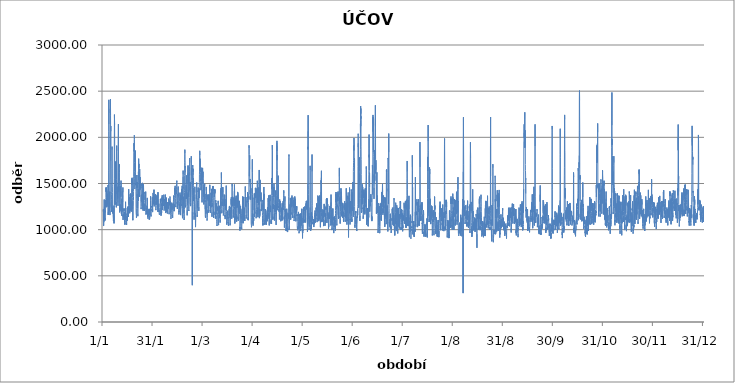
| Category | Series 0 |
|---|---|
| 2012-01-01 01:00:00 | 1198.5 |
| 2012-01-01 02:00:00 | 1199.75 |
| 2012-01-01 03:00:00 | 1194 |
| 2012-01-01 04:00:00 | 1204.25 |
| 2012-01-01 05:00:00 | 1206.75 |
| 2012-01-01 06:00:00 | 1213 |
| 2012-01-01 07:00:00 | 1224.5 |
| 2012-01-01 08:00:00 | 1087 |
| 2012-01-01 09:00:00 | 1039.5 |
| 2012-01-01 10:00:00 | 1044.75 |
| 2012-01-01 11:00:00 | 1045.75 |
| 2012-01-01 12:00:00 | 1058.25 |
| 2012-01-01 13:00:00 | 1062 |
| 2012-01-01 14:00:00 | 1069.5 |
| 2012-01-01 15:00:00 | 1065.25 |
| 2012-01-01 16:00:00 | 1120 |
| 2012-01-01 17:00:00 | 1090 |
| 2012-01-01 18:00:00 | 1147.25 |
| 2012-01-01 19:00:00 | 1326.75 |
| 2012-01-01 20:00:00 | 1124.25 |
| 2012-01-01 21:00:00 | 1173 |
| 2012-01-01 22:00:00 | 1247.25 |
| 2012-01-01 23:00:00 | 1140.25 |
| 2012-01-02 | 1233 |
| 2012-01-02 01:00:00 | 1231.25 |
| 2012-01-02 02:00:00 | 1214.25 |
| 2012-01-02 03:00:00 | 1180.25 |
| 2012-01-02 04:00:00 | 1172.5 |
| 2012-01-02 05:00:00 | 1110 |
| 2012-01-02 06:00:00 | 1124.5 |
| 2012-01-02 07:00:00 | 1099.75 |
| 2012-01-02 08:00:00 | 1207.5 |
| 2012-01-02 09:00:00 | 1188.25 |
| 2012-01-02 10:00:00 | 1191.75 |
| 2012-01-02 11:00:00 | 1196.75 |
| 2012-01-02 12:00:00 | 1208.25 |
| 2012-01-02 13:00:00 | 1250.5 |
| 2012-01-02 14:00:00 | 1319 |
| 2012-01-02 15:00:00 | 1302.25 |
| 2012-01-02 16:00:00 | 1295 |
| 2012-01-02 17:00:00 | 1272.5 |
| 2012-01-02 18:00:00 | 1245 |
| 2012-01-02 19:00:00 | 1259.75 |
| 2012-01-02 20:00:00 | 1348 |
| 2012-01-02 21:00:00 | 1451.5 |
| 2012-01-02 22:00:00 | 1411 |
| 2012-01-02 23:00:00 | 1458.25 |
| 2012-01-03 | 1453.25 |
| 2012-01-03 01:00:00 | 1443.5 |
| 2012-01-03 02:00:00 | 1346.25 |
| 2012-01-03 03:00:00 | 1310.5 |
| 2012-01-03 04:00:00 | 1243.25 |
| 2012-01-03 05:00:00 | 1242.75 |
| 2012-01-03 06:00:00 | 1343.5 |
| 2012-01-03 07:00:00 | 1369.25 |
| 2012-01-03 08:00:00 | 1422.5 |
| 2012-01-03 09:00:00 | 1379.75 |
| 2012-01-03 10:00:00 | 1343.75 |
| 2012-01-03 11:00:00 | 1304.75 |
| 2012-01-03 12:00:00 | 1283.25 |
| 2012-01-03 13:00:00 | 1249.5 |
| 2012-01-03 14:00:00 | 1330.25 |
| 2012-01-03 15:00:00 | 1275.5 |
| 2012-01-03 16:00:00 | 1339 |
| 2012-01-03 17:00:00 | 1318 |
| 2012-01-03 18:00:00 | 1387.5 |
| 2012-01-03 19:00:00 | 1333.75 |
| 2012-01-03 20:00:00 | 1354.75 |
| 2012-01-03 21:00:00 | 1352 |
| 2012-01-03 22:00:00 | 1367 |
| 2012-01-03 23:00:00 | 1386.5 |
| 2012-01-04 | 1449 |
| 2012-01-04 01:00:00 | 1481.5 |
| 2012-01-04 02:00:00 | 1466.5 |
| 2012-01-04 03:00:00 | 1323.5 |
| 2012-01-04 04:00:00 | 1335.5 |
| 2012-01-04 05:00:00 | 1159.5 |
| 2012-01-04 06:00:00 | 1193.25 |
| 2012-01-04 07:00:00 | 1187.25 |
| 2012-01-04 08:00:00 | 1240.5 |
| 2012-01-04 09:00:00 | 1231.5 |
| 2012-01-04 10:00:00 | 1256.5 |
| 2012-01-04 11:00:00 | 1636.25 |
| 2012-01-04 12:00:00 | 1871.75 |
| 2012-01-04 13:00:00 | 2063 |
| 2012-01-04 14:00:00 | 2406 |
| 2012-01-04 15:00:00 | 2143 |
| 2012-01-04 16:00:00 | 2057.75 |
| 2012-01-04 17:00:00 | 1987.25 |
| 2012-01-04 18:00:00 | 1623 |
| 2012-01-04 19:00:00 | 1487.5 |
| 2012-01-04 20:00:00 | 1272.25 |
| 2012-01-04 21:00:00 | 1258.5 |
| 2012-01-04 22:00:00 | 1198.75 |
| 2012-01-04 23:00:00 | 1258.75 |
| 2012-01-05 | 1297 |
| 2012-01-05 01:00:00 | 1287.5 |
| 2012-01-05 02:00:00 | 1251.5 |
| 2012-01-05 03:00:00 | 1301.25 |
| 2012-01-05 04:00:00 | 1411.75 |
| 2012-01-05 05:00:00 | 1235.75 |
| 2012-01-05 06:00:00 | 1158 |
| 2012-01-05 07:00:00 | 1203.5 |
| 2012-01-05 08:00:00 | 1345 |
| 2012-01-05 09:00:00 | 1393 |
| 2012-01-05 10:00:00 | 1824.75 |
| 2012-01-05 11:00:00 | 2266.75 |
| 2012-01-05 12:00:00 | 2307.75 |
| 2012-01-05 13:00:00 | 2264.25 |
| 2012-01-05 14:00:00 | 2415 |
| 2012-01-05 15:00:00 | 2238 |
| 2012-01-05 16:00:00 | 2135 |
| 2012-01-05 17:00:00 | 2066.25 |
| 2012-01-05 18:00:00 | 2122.25 |
| 2012-01-05 19:00:00 | 1745.75 |
| 2012-01-05 20:00:00 | 1654.75 |
| 2012-01-05 21:00:00 | 1546 |
| 2012-01-05 22:00:00 | 1496 |
| 2012-01-05 23:00:00 | 1410.25 |
| 2012-01-06 | 1405.25 |
| 2012-01-06 01:00:00 | 1382.25 |
| 2012-01-06 02:00:00 | 1324.5 |
| 2012-01-06 03:00:00 | 1194.5 |
| 2012-01-06 04:00:00 | 1188.25 |
| 2012-01-06 05:00:00 | 1197.25 |
| 2012-01-06 06:00:00 | 1214.75 |
| 2012-01-06 07:00:00 | 1220 |
| 2012-01-06 08:00:00 | 1323.75 |
| 2012-01-06 09:00:00 | 1381.75 |
| 2012-01-06 10:00:00 | 1409.75 |
| 2012-01-06 11:00:00 | 1481.75 |
| 2012-01-06 12:00:00 | 1660.25 |
| 2012-01-06 13:00:00 | 1899.25 |
| 2012-01-06 14:00:00 | 1866 |
| 2012-01-06 15:00:00 | 1752.75 |
| 2012-01-06 16:00:00 | 1489 |
| 2012-01-06 17:00:00 | 1464.25 |
| 2012-01-06 18:00:00 | 1402.25 |
| 2012-01-06 19:00:00 | 1231.5 |
| 2012-01-06 20:00:00 | 1246.75 |
| 2012-01-06 21:00:00 | 1177 |
| 2012-01-06 22:00:00 | 1193 |
| 2012-01-06 23:00:00 | 1204 |
| 2012-01-07 | 1236.5 |
| 2012-01-07 01:00:00 | 1230.25 |
| 2012-01-07 02:00:00 | 1230.75 |
| 2012-01-07 03:00:00 | 1228 |
| 2012-01-07 04:00:00 | 1196.75 |
| 2012-01-07 05:00:00 | 1143 |
| 2012-01-07 06:00:00 | 1134.5 |
| 2012-01-07 07:00:00 | 1128 |
| 2012-01-07 08:00:00 | 1116.25 |
| 2012-01-07 09:00:00 | 1094.5 |
| 2012-01-07 10:00:00 | 1091.75 |
| 2012-01-07 11:00:00 | 1108.5 |
| 2012-01-07 12:00:00 | 1134.25 |
| 2012-01-07 13:00:00 | 1128.75 |
| 2012-01-07 14:00:00 | 1144 |
| 2012-01-07 15:00:00 | 1140.5 |
| 2012-01-07 16:00:00 | 1190.5 |
| 2012-01-07 17:00:00 | 1260.25 |
| 2012-01-07 18:00:00 | 1068.75 |
| 2012-01-07 19:00:00 | 1155.75 |
| 2012-01-07 20:00:00 | 1239.75 |
| 2012-01-07 21:00:00 | 1554.5 |
| 2012-01-07 22:00:00 | 1929.5 |
| 2012-01-07 23:00:00 | 2106.25 |
| 2012-01-08 | 2246 |
| 2012-01-08 01:00:00 | 2243.25 |
| 2012-01-08 02:00:00 | 2134.5 |
| 2012-01-08 03:00:00 | 2047 |
| 2012-01-08 04:00:00 | 1393.75 |
| 2012-01-08 05:00:00 | 1273.5 |
| 2012-01-08 06:00:00 | 1399 |
| 2012-01-08 07:00:00 | 1483.5 |
| 2012-01-08 08:00:00 | 1378 |
| 2012-01-08 09:00:00 | 1294.75 |
| 2012-01-08 10:00:00 | 1271 |
| 2012-01-08 11:00:00 | 1281.75 |
| 2012-01-08 12:00:00 | 1289 |
| 2012-01-08 13:00:00 | 1295.75 |
| 2012-01-08 14:00:00 | 1313.75 |
| 2012-01-08 15:00:00 | 1422 |
| 2012-01-08 16:00:00 | 1592 |
| 2012-01-08 17:00:00 | 1703.75 |
| 2012-01-08 18:00:00 | 1738.25 |
| 2012-01-08 19:00:00 | 1642.5 |
| 2012-01-08 20:00:00 | 1502.75 |
| 2012-01-08 21:00:00 | 1470.5 |
| 2012-01-08 22:00:00 | 1315.5 |
| 2012-01-08 23:00:00 | 1292.5 |
| 2012-01-09 | 1293.5 |
| 2012-01-09 01:00:00 | 1299 |
| 2012-01-09 02:00:00 | 1272.25 |
| 2012-01-09 03:00:00 | 1241.5 |
| 2012-01-09 04:00:00 | 1304 |
| 2012-01-09 05:00:00 | 1314 |
| 2012-01-09 06:00:00 | 1541.75 |
| 2012-01-09 07:00:00 | 1756 |
| 2012-01-09 08:00:00 | 1889.75 |
| 2012-01-09 09:00:00 | 1910 |
| 2012-01-09 10:00:00 | 1853.25 |
| 2012-01-09 11:00:00 | 1819.75 |
| 2012-01-09 12:00:00 | 1736.75 |
| 2012-01-09 13:00:00 | 1505 |
| 2012-01-09 14:00:00 | 1439 |
| 2012-01-09 15:00:00 | 1385.5 |
| 2012-01-09 16:00:00 | 1424.5 |
| 2012-01-09 17:00:00 | 1465 |
| 2012-01-09 18:00:00 | 1471.25 |
| 2012-01-09 19:00:00 | 1391.75 |
| 2012-01-09 20:00:00 | 1394.25 |
| 2012-01-09 21:00:00 | 1353.75 |
| 2012-01-09 22:00:00 | 1357.75 |
| 2012-01-09 23:00:00 | 1338 |
| 2012-01-10 | 1330 |
| 2012-01-10 01:00:00 | 1334 |
| 2012-01-10 02:00:00 | 1415.75 |
| 2012-01-10 03:00:00 | 1293 |
| 2012-01-10 04:00:00 | 1258.5 |
| 2012-01-10 05:00:00 | 1508 |
| 2012-01-10 06:00:00 | 1718 |
| 2012-01-10 07:00:00 | 1953.25 |
| 2012-01-10 08:00:00 | 2010 |
| 2012-01-10 09:00:00 | 2049.5 |
| 2012-01-10 10:00:00 | 2142.5 |
| 2012-01-10 11:00:00 | 1904.25 |
| 2012-01-10 12:00:00 | 1588.5 |
| 2012-01-10 13:00:00 | 1604.5 |
| 2012-01-10 14:00:00 | 1616 |
| 2012-01-10 15:00:00 | 1412 |
| 2012-01-10 16:00:00 | 1562 |
| 2012-01-10 17:00:00 | 1641.25 |
| 2012-01-10 18:00:00 | 1626.5 |
| 2012-01-10 19:00:00 | 1638.75 |
| 2012-01-10 20:00:00 | 1711.5 |
| 2012-01-10 21:00:00 | 1682.5 |
| 2012-01-10 22:00:00 | 1699.5 |
| 2012-01-10 23:00:00 | 1699 |
| 2012-01-11 | 1669.75 |
| 2012-01-11 01:00:00 | 1526 |
| 2012-01-11 02:00:00 | 1475.25 |
| 2012-01-11 03:00:00 | 1221.5 |
| 2012-01-11 04:00:00 | 1187.25 |
| 2012-01-11 05:00:00 | 1185.25 |
| 2012-01-11 06:00:00 | 1194.75 |
| 2012-01-11 07:00:00 | 1201.5 |
| 2012-01-11 08:00:00 | 1265.5 |
| 2012-01-11 09:00:00 | 1242 |
| 2012-01-11 10:00:00 | 1275.75 |
| 2012-01-11 11:00:00 | 1233.25 |
| 2012-01-11 12:00:00 | 1205.25 |
| 2012-01-11 13:00:00 | 1199.5 |
| 2012-01-11 14:00:00 | 1270.5 |
| 2012-01-11 15:00:00 | 1420.5 |
| 2012-01-11 16:00:00 | 1400.25 |
| 2012-01-11 17:00:00 | 1411 |
| 2012-01-11 18:00:00 | 1413.25 |
| 2012-01-11 19:00:00 | 1406.25 |
| 2012-01-11 20:00:00 | 1471.75 |
| 2012-01-11 21:00:00 | 1372 |
| 2012-01-11 22:00:00 | 1357.5 |
| 2012-01-11 23:00:00 | 1414.5 |
| 2012-01-12 | 1531.25 |
| 2012-01-12 01:00:00 | 1460.25 |
| 2012-01-12 02:00:00 | 1400 |
| 2012-01-12 03:00:00 | 1363.5 |
| 2012-01-12 04:00:00 | 1349 |
| 2012-01-12 05:00:00 | 1172.75 |
| 2012-01-12 06:00:00 | 1229.25 |
| 2012-01-12 07:00:00 | 1193.75 |
| 2012-01-12 08:00:00 | 1244.75 |
| 2012-01-12 09:00:00 | 1176.75 |
| 2012-01-12 10:00:00 | 1174.25 |
| 2012-01-12 11:00:00 | 1167.5 |
| 2012-01-12 12:00:00 | 1149.75 |
| 2012-01-12 13:00:00 | 1267 |
| 2012-01-12 14:00:00 | 1313 |
| 2012-01-12 15:00:00 | 1294.25 |
| 2012-01-12 16:00:00 | 1331.5 |
| 2012-01-12 17:00:00 | 1262.25 |
| 2012-01-12 18:00:00 | 1197.75 |
| 2012-01-12 19:00:00 | 1273 |
| 2012-01-12 20:00:00 | 1413.5 |
| 2012-01-12 21:00:00 | 1377.25 |
| 2012-01-12 22:00:00 | 1311.5 |
| 2012-01-12 23:00:00 | 1298 |
| 2012-01-13 | 1373 |
| 2012-01-13 01:00:00 | 1416 |
| 2012-01-13 02:00:00 | 1429.75 |
| 2012-01-13 03:00:00 | 1457 |
| 2012-01-13 04:00:00 | 1404.25 |
| 2012-01-13 05:00:00 | 1225.25 |
| 2012-01-13 06:00:00 | 1105.5 |
| 2012-01-13 07:00:00 | 1162.5 |
| 2012-01-13 08:00:00 | 1141.25 |
| 2012-01-13 09:00:00 | 1132 |
| 2012-01-13 10:00:00 | 1140 |
| 2012-01-13 11:00:00 | 1134.75 |
| 2012-01-13 12:00:00 | 1165.75 |
| 2012-01-13 13:00:00 | 1150 |
| 2012-01-13 14:00:00 | 1146 |
| 2012-01-13 15:00:00 | 1160.5 |
| 2012-01-13 16:00:00 | 1160.75 |
| 2012-01-13 17:00:00 | 1165.5 |
| 2012-01-13 18:00:00 | 1226.5 |
| 2012-01-13 19:00:00 | 1204.25 |
| 2012-01-13 20:00:00 | 1229 |
| 2012-01-13 21:00:00 | 1209.5 |
| 2012-01-13 22:00:00 | 1200.75 |
| 2012-01-13 23:00:00 | 1123.75 |
| 2012-01-14 | 1170.25 |
| 2012-01-14 01:00:00 | 1189.75 |
| 2012-01-14 02:00:00 | 1107.5 |
| 2012-01-14 03:00:00 | 1079.5 |
| 2012-01-14 04:00:00 | 1098.75 |
| 2012-01-14 05:00:00 | 1062.25 |
| 2012-01-14 06:00:00 | 1073 |
| 2012-01-14 07:00:00 | 1078.25 |
| 2012-01-14 08:00:00 | 1070.5 |
| 2012-01-14 09:00:00 | 1054 |
| 2012-01-14 10:00:00 | 1072.25 |
| 2012-01-14 11:00:00 | 1072.75 |
| 2012-01-14 12:00:00 | 1110.25 |
| 2012-01-14 13:00:00 | 1111.25 |
| 2012-01-14 14:00:00 | 1126.25 |
| 2012-01-14 15:00:00 | 1104.25 |
| 2012-01-14 16:00:00 | 1101.75 |
| 2012-01-14 17:00:00 | 1124 |
| 2012-01-14 18:00:00 | 1302 |
| 2012-01-14 19:00:00 | 1124 |
| 2012-01-14 20:00:00 | 1235.25 |
| 2012-01-14 21:00:00 | 1174.75 |
| 2012-01-14 22:00:00 | 1159.75 |
| 2012-01-14 23:00:00 | 1174.5 |
| 2012-01-15 | 1114.25 |
| 2012-01-15 01:00:00 | 1098.5 |
| 2012-01-15 02:00:00 | 1093.5 |
| 2012-01-15 03:00:00 | 1084.5 |
| 2012-01-15 04:00:00 | 1085.5 |
| 2012-01-15 05:00:00 | 1097.5 |
| 2012-01-15 06:00:00 | 1088.75 |
| 2012-01-15 07:00:00 | 1088.75 |
| 2012-01-15 08:00:00 | 1073.5 |
| 2012-01-15 09:00:00 | 1050.75 |
| 2012-01-15 10:00:00 | 1067.75 |
| 2012-01-15 11:00:00 | 1071.5 |
| 2012-01-15 12:00:00 | 1110.5 |
| 2012-01-15 13:00:00 | 1105.5 |
| 2012-01-15 14:00:00 | 1116 |
| 2012-01-15 15:00:00 | 1095.25 |
| 2012-01-15 16:00:00 | 1137.75 |
| 2012-01-15 17:00:00 | 1147.25 |
| 2012-01-15 18:00:00 | 1153.5 |
| 2012-01-15 19:00:00 | 1103.5 |
| 2012-01-15 20:00:00 | 1153 |
| 2012-01-15 21:00:00 | 1170.75 |
| 2012-01-15 22:00:00 | 1155.75 |
| 2012-01-15 23:00:00 | 1188.5 |
| 2012-01-16 | 1248.75 |
| 2012-01-16 01:00:00 | 1203.75 |
| 2012-01-16 02:00:00 | 1166.75 |
| 2012-01-16 03:00:00 | 1169.25 |
| 2012-01-16 04:00:00 | 1144.75 |
| 2012-01-16 05:00:00 | 1143 |
| 2012-01-16 06:00:00 | 1161.5 |
| 2012-01-16 07:00:00 | 1183 |
| 2012-01-16 08:00:00 | 1230.5 |
| 2012-01-16 09:00:00 | 1211.5 |
| 2012-01-16 10:00:00 | 1214.75 |
| 2012-01-16 11:00:00 | 1234 |
| 2012-01-16 12:00:00 | 1225.5 |
| 2012-01-16 13:00:00 | 1137.5 |
| 2012-01-16 14:00:00 | 1261 |
| 2012-01-16 15:00:00 | 1281.75 |
| 2012-01-16 16:00:00 | 1438.5 |
| 2012-01-16 17:00:00 | 1309 |
| 2012-01-16 18:00:00 | 1275.5 |
| 2012-01-16 19:00:00 | 1348.25 |
| 2012-01-16 20:00:00 | 1325.75 |
| 2012-01-16 21:00:00 | 1352.75 |
| 2012-01-16 22:00:00 | 1360.25 |
| 2012-01-16 23:00:00 | 1354 |
| 2012-01-17 | 1350.25 |
| 2012-01-17 01:00:00 | 1326.75 |
| 2012-01-17 02:00:00 | 1283.25 |
| 2012-01-17 03:00:00 | 1264.75 |
| 2012-01-17 04:00:00 | 1196.25 |
| 2012-01-17 05:00:00 | 1230.25 |
| 2012-01-17 06:00:00 | 1178.25 |
| 2012-01-17 07:00:00 | 1217.5 |
| 2012-01-17 08:00:00 | 1280 |
| 2012-01-17 09:00:00 | 1269 |
| 2012-01-17 10:00:00 | 1272 |
| 2012-01-17 11:00:00 | 1275.25 |
| 2012-01-17 12:00:00 | 1307.5 |
| 2012-01-17 13:00:00 | 1360.25 |
| 2012-01-17 14:00:00 | 1384 |
| 2012-01-17 15:00:00 | 1319.5 |
| 2012-01-17 16:00:00 | 1212.25 |
| 2012-01-17 17:00:00 | 1244.5 |
| 2012-01-17 18:00:00 | 1243.5 |
| 2012-01-17 19:00:00 | 1304.5 |
| 2012-01-17 20:00:00 | 1257 |
| 2012-01-17 21:00:00 | 1259.75 |
| 2012-01-17 22:00:00 | 1392 |
| 2012-01-17 23:00:00 | 1348.5 |
| 2012-01-18 | 1372.25 |
| 2012-01-18 01:00:00 | 1254 |
| 2012-01-18 02:00:00 | 1322.25 |
| 2012-01-18 03:00:00 | 1200 |
| 2012-01-18 04:00:00 | 1259.5 |
| 2012-01-18 05:00:00 | 1268.5 |
| 2012-01-18 06:00:00 | 1197.25 |
| 2012-01-18 07:00:00 | 1229 |
| 2012-01-18 08:00:00 | 1278.5 |
| 2012-01-18 09:00:00 | 1274 |
| 2012-01-18 10:00:00 | 1304.75 |
| 2012-01-18 11:00:00 | 1334.25 |
| 2012-01-18 12:00:00 | 1335.5 |
| 2012-01-18 13:00:00 | 1435.5 |
| 2012-01-18 14:00:00 | 1553.75 |
| 2012-01-18 15:00:00 | 1554.5 |
| 2012-01-18 16:00:00 | 1490 |
| 2012-01-18 17:00:00 | 1548.75 |
| 2012-01-18 18:00:00 | 1562.25 |
| 2012-01-18 19:00:00 | 1401.5 |
| 2012-01-18 20:00:00 | 1439 |
| 2012-01-18 21:00:00 | 1350.75 |
| 2012-01-18 22:00:00 | 1299.25 |
| 2012-01-18 23:00:00 | 1259.25 |
| 2012-01-19 | 1227.75 |
| 2012-01-19 01:00:00 | 1223 |
| 2012-01-19 02:00:00 | 1286.75 |
| 2012-01-19 03:00:00 | 1308.5 |
| 2012-01-19 04:00:00 | 1102.5 |
| 2012-01-19 05:00:00 | 1119.75 |
| 2012-01-19 06:00:00 | 1137 |
| 2012-01-19 07:00:00 | 1200.5 |
| 2012-01-19 08:00:00 | 1248.5 |
| 2012-01-19 09:00:00 | 1243 |
| 2012-01-19 10:00:00 | 1311 |
| 2012-01-19 11:00:00 | 1329.25 |
| 2012-01-19 12:00:00 | 1343 |
| 2012-01-19 13:00:00 | 1325.75 |
| 2012-01-19 14:00:00 | 1358.5 |
| 2012-01-19 15:00:00 | 1414.75 |
| 2012-01-19 16:00:00 | 1572.25 |
| 2012-01-19 17:00:00 | 1711.5 |
| 2012-01-19 18:00:00 | 1840.25 |
| 2012-01-19 19:00:00 | 1906.75 |
| 2012-01-19 20:00:00 | 1936.5 |
| 2012-01-19 21:00:00 | 1901.25 |
| 2012-01-19 22:00:00 | 1849 |
| 2012-01-19 23:00:00 | 1857 |
| 2012-01-20 | 1861.75 |
| 2012-01-20 01:00:00 | 1977.5 |
| 2012-01-20 02:00:00 | 2022 |
| 2012-01-20 03:00:00 | 2009.5 |
| 2012-01-20 04:00:00 | 1976.75 |
| 2012-01-20 05:00:00 | 1725.25 |
| 2012-01-20 06:00:00 | 1631.75 |
| 2012-01-20 07:00:00 | 1551 |
| 2012-01-20 08:00:00 | 1457.75 |
| 2012-01-20 09:00:00 | 1442.5 |
| 2012-01-20 10:00:00 | 1456.25 |
| 2012-01-20 11:00:00 | 1464 |
| 2012-01-20 12:00:00 | 1452 |
| 2012-01-20 13:00:00 | 1461.25 |
| 2012-01-20 14:00:00 | 1678.25 |
| 2012-01-20 15:00:00 | 1848.5 |
| 2012-01-20 16:00:00 | 1824.5 |
| 2012-01-20 17:00:00 | 1837.75 |
| 2012-01-20 18:00:00 | 1856.5 |
| 2012-01-20 19:00:00 | 1766 |
| 2012-01-20 20:00:00 | 1615.75 |
| 2012-01-20 21:00:00 | 1505.5 |
| 2012-01-20 22:00:00 | 1483.25 |
| 2012-01-20 23:00:00 | 1486.25 |
| 2012-01-21 | 1506.25 |
| 2012-01-21 01:00:00 | 1476.25 |
| 2012-01-21 02:00:00 | 1410.75 |
| 2012-01-21 03:00:00 | 1243.75 |
| 2012-01-21 04:00:00 | 1183.25 |
| 2012-01-21 05:00:00 | 1170.25 |
| 2012-01-21 06:00:00 | 1173 |
| 2012-01-21 07:00:00 | 1165.25 |
| 2012-01-21 08:00:00 | 1151 |
| 2012-01-21 09:00:00 | 1130 |
| 2012-01-21 10:00:00 | 1152.75 |
| 2012-01-21 11:00:00 | 1169 |
| 2012-01-21 12:00:00 | 1228.5 |
| 2012-01-21 13:00:00 | 1310.25 |
| 2012-01-21 14:00:00 | 1360.75 |
| 2012-01-21 15:00:00 | 1570 |
| 2012-01-21 16:00:00 | 1592 |
| 2012-01-21 17:00:00 | 1453.5 |
| 2012-01-21 18:00:00 | 1516.25 |
| 2012-01-21 19:00:00 | 1424.75 |
| 2012-01-21 20:00:00 | 1344.25 |
| 2012-01-21 21:00:00 | 1384.25 |
| 2012-01-21 22:00:00 | 1370.5 |
| 2012-01-21 23:00:00 | 1315.5 |
| 2012-01-22 | 1284.75 |
| 2012-01-22 01:00:00 | 1260 |
| 2012-01-22 02:00:00 | 1304.25 |
| 2012-01-22 03:00:00 | 1232 |
| 2012-01-22 04:00:00 | 1174.25 |
| 2012-01-22 05:00:00 | 1145.75 |
| 2012-01-22 06:00:00 | 1175.75 |
| 2012-01-22 07:00:00 | 1201.5 |
| 2012-01-22 08:00:00 | 1322.75 |
| 2012-01-22 09:00:00 | 1360.5 |
| 2012-01-22 10:00:00 | 1436.5 |
| 2012-01-22 11:00:00 | 1312.25 |
| 2012-01-22 12:00:00 | 1340.75 |
| 2012-01-22 13:00:00 | 1378.25 |
| 2012-01-22 14:00:00 | 1628 |
| 2012-01-22 15:00:00 | 1541 |
| 2012-01-22 16:00:00 | 1580.5 |
| 2012-01-22 17:00:00 | 1769 |
| 2012-01-22 18:00:00 | 1758.25 |
| 2012-01-22 19:00:00 | 1670.75 |
| 2012-01-22 20:00:00 | 1712 |
| 2012-01-22 21:00:00 | 1714.5 |
| 2012-01-22 22:00:00 | 1657.75 |
| 2012-01-22 23:00:00 | 1665.25 |
| 2012-01-23 | 1609.75 |
| 2012-01-23 01:00:00 | 1602.75 |
| 2012-01-23 02:00:00 | 1570.25 |
| 2012-01-23 03:00:00 | 1479 |
| 2012-01-23 04:00:00 | 1356 |
| 2012-01-23 05:00:00 | 1410.5 |
| 2012-01-23 06:00:00 | 1499.25 |
| 2012-01-23 07:00:00 | 1517.5 |
| 2012-01-23 08:00:00 | 1656.75 |
| 2012-01-23 09:00:00 | 1560 |
| 2012-01-23 10:00:00 | 1459.25 |
| 2012-01-23 11:00:00 | 1428.5 |
| 2012-01-23 12:00:00 | 1420 |
| 2012-01-23 13:00:00 | 1452.25 |
| 2012-01-23 14:00:00 | 1533.75 |
| 2012-01-23 15:00:00 | 1569.75 |
| 2012-01-23 16:00:00 | 1562.5 |
| 2012-01-23 17:00:00 | 1578.75 |
| 2012-01-23 18:00:00 | 1513.5 |
| 2012-01-23 19:00:00 | 1554.25 |
| 2012-01-23 20:00:00 | 1505 |
| 2012-01-23 21:00:00 | 1495 |
| 2012-01-23 22:00:00 | 1448.75 |
| 2012-01-23 23:00:00 | 1468 |
| 2012-01-24 | 1446 |
| 2012-01-24 01:00:00 | 1385.25 |
| 2012-01-24 02:00:00 | 1304 |
| 2012-01-24 03:00:00 | 1286.75 |
| 2012-01-24 04:00:00 | 1248.5 |
| 2012-01-24 05:00:00 | 1222.5 |
| 2012-01-24 06:00:00 | 1238 |
| 2012-01-24 07:00:00 | 1251.25 |
| 2012-01-24 08:00:00 | 1278 |
| 2012-01-24 09:00:00 | 1379 |
| 2012-01-24 10:00:00 | 1304 |
| 2012-01-24 11:00:00 | 1334.75 |
| 2012-01-24 12:00:00 | 1332.5 |
| 2012-01-24 13:00:00 | 1362.25 |
| 2012-01-24 14:00:00 | 1430.25 |
| 2012-01-24 15:00:00 | 1490.75 |
| 2012-01-24 16:00:00 | 1473 |
| 2012-01-24 17:00:00 | 1476 |
| 2012-01-24 18:00:00 | 1496.25 |
| 2012-01-24 19:00:00 | 1486.25 |
| 2012-01-24 20:00:00 | 1490.75 |
| 2012-01-24 21:00:00 | 1483 |
| 2012-01-24 22:00:00 | 1451.75 |
| 2012-01-24 23:00:00 | 1461.25 |
| 2012-01-25 | 1506.75 |
| 2012-01-25 01:00:00 | 1490.5 |
| 2012-01-25 02:00:00 | 1435.75 |
| 2012-01-25 03:00:00 | 1349.5 |
| 2012-01-25 04:00:00 | 1292 |
| 2012-01-25 05:00:00 | 1221.75 |
| 2012-01-25 06:00:00 | 1289.5 |
| 2012-01-25 07:00:00 | 1386.75 |
| 2012-01-25 08:00:00 | 1294.25 |
| 2012-01-25 09:00:00 | 1261.5 |
| 2012-01-25 10:00:00 | 1440.25 |
| 2012-01-25 11:00:00 | 1206 |
| 2012-01-25 12:00:00 | 1340 |
| 2012-01-25 13:00:00 | 1419.5 |
| 2012-01-25 14:00:00 | 1492.75 |
| 2012-01-25 15:00:00 | 1463.25 |
| 2012-01-25 16:00:00 | 1476.5 |
| 2012-01-25 17:00:00 | 1430.75 |
| 2012-01-25 18:00:00 | 1426.75 |
| 2012-01-25 19:00:00 | 1368.75 |
| 2012-01-25 20:00:00 | 1376.75 |
| 2012-01-25 21:00:00 | 1371.25 |
| 2012-01-25 22:00:00 | 1323.5 |
| 2012-01-25 23:00:00 | 1372 |
| 2012-01-26 | 1392 |
| 2012-01-26 01:00:00 | 1408.5 |
| 2012-01-26 02:00:00 | 1386.75 |
| 2012-01-26 03:00:00 | 1318.75 |
| 2012-01-26 04:00:00 | 1293 |
| 2012-01-26 05:00:00 | 1228.75 |
| 2012-01-26 06:00:00 | 1202 |
| 2012-01-26 07:00:00 | 1210.5 |
| 2012-01-26 08:00:00 | 1235 |
| 2012-01-26 09:00:00 | 1239.75 |
| 2012-01-26 10:00:00 | 1253.75 |
| 2012-01-26 11:00:00 | 1264 |
| 2012-01-26 12:00:00 | 1262 |
| 2012-01-26 13:00:00 | 1276.25 |
| 2012-01-26 14:00:00 | 1252.5 |
| 2012-01-26 15:00:00 | 1217.75 |
| 2012-01-26 16:00:00 | 1212.5 |
| 2012-01-26 17:00:00 | 1240 |
| 2012-01-26 18:00:00 | 1244.5 |
| 2012-01-26 19:00:00 | 1237 |
| 2012-01-26 20:00:00 | 1241.5 |
| 2012-01-26 21:00:00 | 1332.25 |
| 2012-01-26 22:00:00 | 1359.5 |
| 2012-01-26 23:00:00 | 1356.25 |
| 2012-01-27 | 1412 |
| 2012-01-27 01:00:00 | 1311.75 |
| 2012-01-27 02:00:00 | 1319 |
| 2012-01-27 03:00:00 | 1269.5 |
| 2012-01-27 04:00:00 | 1163 |
| 2012-01-27 05:00:00 | 1166.75 |
| 2012-01-27 06:00:00 | 1186.75 |
| 2012-01-27 07:00:00 | 1195.25 |
| 2012-01-27 08:00:00 | 1229 |
| 2012-01-27 09:00:00 | 1192.25 |
| 2012-01-27 10:00:00 | 1188 |
| 2012-01-27 11:00:00 | 1202.75 |
| 2012-01-27 12:00:00 | 1233.25 |
| 2012-01-27 13:00:00 | 1224.25 |
| 2012-01-27 14:00:00 | 1231.75 |
| 2012-01-27 15:00:00 | 1185.75 |
| 2012-01-27 16:00:00 | 1169 |
| 2012-01-27 17:00:00 | 1188.5 |
| 2012-01-27 18:00:00 | 1194.25 |
| 2012-01-27 19:00:00 | 1260 |
| 2012-01-27 20:00:00 | 1180.75 |
| 2012-01-27 21:00:00 | 1175 |
| 2012-01-27 22:00:00 | 1222.75 |
| 2012-01-27 23:00:00 | 1344 |
| 2012-01-28 | 1265.5 |
| 2012-01-28 01:00:00 | 1262.5 |
| 2012-01-28 02:00:00 | 1209 |
| 2012-01-28 03:00:00 | 1136.5 |
| 2012-01-28 04:00:00 | 1134.75 |
| 2012-01-28 05:00:00 | 1136 |
| 2012-01-28 06:00:00 | 1149.5 |
| 2012-01-28 07:00:00 | 1132.5 |
| 2012-01-28 08:00:00 | 1134.75 |
| 2012-01-28 09:00:00 | 1119 |
| 2012-01-28 10:00:00 | 1120.5 |
| 2012-01-28 11:00:00 | 1131.25 |
| 2012-01-28 12:00:00 | 1146.5 |
| 2012-01-28 13:00:00 | 1155.25 |
| 2012-01-28 14:00:00 | 1162.75 |
| 2012-01-28 15:00:00 | 1151.25 |
| 2012-01-28 16:00:00 | 1150.25 |
| 2012-01-28 17:00:00 | 1150.75 |
| 2012-01-28 18:00:00 | 1178.25 |
| 2012-01-28 19:00:00 | 1166.25 |
| 2012-01-28 20:00:00 | 1170.75 |
| 2012-01-28 21:00:00 | 1165.25 |
| 2012-01-28 22:00:00 | 1172.5 |
| 2012-01-28 23:00:00 | 1161.75 |
| 2012-01-29 | 1219.75 |
| 2012-01-29 01:00:00 | 1173 |
| 2012-01-29 02:00:00 | 1225.5 |
| 2012-01-29 03:00:00 | 1162.75 |
| 2012-01-29 04:00:00 | 1108 |
| 2012-01-29 05:00:00 | 1128.25 |
| 2012-01-29 06:00:00 | 1142.5 |
| 2012-01-29 07:00:00 | 1129.25 |
| 2012-01-29 08:00:00 | 1122.75 |
| 2012-01-29 09:00:00 | 1113.75 |
| 2012-01-29 10:00:00 | 1121.25 |
| 2012-01-29 11:00:00 | 1121 |
| 2012-01-29 12:00:00 | 1151 |
| 2012-01-29 13:00:00 | 1161 |
| 2012-01-29 14:00:00 | 1169 |
| 2012-01-29 15:00:00 | 1157 |
| 2012-01-29 16:00:00 | 1153 |
| 2012-01-29 17:00:00 | 1154 |
| 2012-01-29 18:00:00 | 1189.5 |
| 2012-01-29 19:00:00 | 1181.25 |
| 2012-01-29 20:00:00 | 1186.5 |
| 2012-01-29 21:00:00 | 1182.5 |
| 2012-01-29 22:00:00 | 1201.25 |
| 2012-01-29 23:00:00 | 1316.25 |
| 2012-01-30 | 1361 |
| 2012-01-30 01:00:00 | 1320.25 |
| 2012-01-30 02:00:00 | 1229.75 |
| 2012-01-30 03:00:00 | 1179.25 |
| 2012-01-30 04:00:00 | 1177 |
| 2012-01-30 05:00:00 | 1186 |
| 2012-01-30 06:00:00 | 1143.5 |
| 2012-01-30 07:00:00 | 1163.5 |
| 2012-01-30 08:00:00 | 1210 |
| 2012-01-30 09:00:00 | 1203.25 |
| 2012-01-30 10:00:00 | 1222.5 |
| 2012-01-30 11:00:00 | 1228.75 |
| 2012-01-30 12:00:00 | 1219.25 |
| 2012-01-30 13:00:00 | 1207.5 |
| 2012-01-30 14:00:00 | 1218.75 |
| 2012-01-30 15:00:00 | 1216.25 |
| 2012-01-30 16:00:00 | 1225.5 |
| 2012-01-30 17:00:00 | 1231.5 |
| 2012-01-30 18:00:00 | 1254.25 |
| 2012-01-30 19:00:00 | 1243.25 |
| 2012-01-30 20:00:00 | 1253.75 |
| 2012-01-30 21:00:00 | 1240 |
| 2012-01-30 22:00:00 | 1256.25 |
| 2012-01-30 23:00:00 | 1243.25 |
| 2012-01-31 | 1317 |
| 2012-01-31 01:00:00 | 1349 |
| 2012-01-31 02:00:00 | 1331.5 |
| 2012-01-31 03:00:00 | 1260.75 |
| 2012-01-31 04:00:00 | 1243.25 |
| 2012-01-31 05:00:00 | 1190 |
| 2012-01-31 06:00:00 | 1219.5 |
| 2012-01-31 07:00:00 | 1252.5 |
| 2012-01-31 08:00:00 | 1290.5 |
| 2012-01-31 09:00:00 | 1271.5 |
| 2012-01-31 10:00:00 | 1304.5 |
| 2012-01-31 11:00:00 | 1353.75 |
| 2012-01-31 12:00:00 | 1327.75 |
| 2012-01-31 13:00:00 | 1397.75 |
| 2012-01-31 14:00:00 | 1334.5 |
| 2012-01-31 15:00:00 | 1308.5 |
| 2012-01-31 16:00:00 | 1280 |
| 2012-01-31 17:00:00 | 1281.25 |
| 2012-01-31 18:00:00 | 1314.25 |
| 2012-01-31 19:00:00 | 1311.75 |
| 2012-01-31 20:00:00 | 1306.5 |
| 2012-01-31 21:00:00 | 1371.75 |
| 2012-01-31 22:00:00 | 1325.5 |
| 2012-01-31 23:00:00 | 1312 |
| 2012-02-01 | 1304.75 |
| 2012-02-01 01:00:00 | 1432.75 |
| 2012-02-01 02:00:00 | 1294.75 |
| 2012-02-01 03:00:00 | 1252.25 |
| 2012-02-01 04:00:00 | 1249.75 |
| 2012-02-01 05:00:00 | 1244.25 |
| 2012-02-01 06:00:00 | 1273.25 |
| 2012-02-01 07:00:00 | 1299.25 |
| 2012-02-01 08:00:00 | 1322.25 |
| 2012-02-01 09:00:00 | 1332 |
| 2012-02-01 10:00:00 | 1357 |
| 2012-02-01 11:00:00 | 1339.25 |
| 2012-02-01 12:00:00 | 1340.25 |
| 2012-02-01 13:00:00 | 1309 |
| 2012-02-01 14:00:00 | 1311 |
| 2012-02-01 15:00:00 | 1268.25 |
| 2012-02-01 16:00:00 | 1266 |
| 2012-02-01 17:00:00 | 1335.5 |
| 2012-02-01 18:00:00 | 1331.75 |
| 2012-02-01 19:00:00 | 1378.75 |
| 2012-02-01 20:00:00 | 1381.25 |
| 2012-02-01 21:00:00 | 1381 |
| 2012-02-01 22:00:00 | 1365.25 |
| 2012-02-01 23:00:00 | 1327 |
| 2012-02-02 | 1385 |
| 2012-02-02 01:00:00 | 1353 |
| 2012-02-02 02:00:00 | 1317.5 |
| 2012-02-02 03:00:00 | 1264 |
| 2012-02-02 04:00:00 | 1211.5 |
| 2012-02-02 05:00:00 | 1227 |
| 2012-02-02 06:00:00 | 1247.75 |
| 2012-02-02 07:00:00 | 1269 |
| 2012-02-02 08:00:00 | 1304.75 |
| 2012-02-02 09:00:00 | 1308.5 |
| 2012-02-02 10:00:00 | 1277.5 |
| 2012-02-02 11:00:00 | 1292.75 |
| 2012-02-02 12:00:00 | 1282 |
| 2012-02-02 13:00:00 | 1272.75 |
| 2012-02-02 14:00:00 | 1286.25 |
| 2012-02-02 15:00:00 | 1314 |
| 2012-02-02 16:00:00 | 1324.5 |
| 2012-02-02 17:00:00 | 1293.25 |
| 2012-02-02 18:00:00 | 1329 |
| 2012-02-02 19:00:00 | 1322.25 |
| 2012-02-02 20:00:00 | 1373.25 |
| 2012-02-02 21:00:00 | 1329.25 |
| 2012-02-02 22:00:00 | 1358.75 |
| 2012-02-02 23:00:00 | 1293 |
| 2012-02-03 | 1348.25 |
| 2012-02-03 01:00:00 | 1291 |
| 2012-02-03 02:00:00 | 1243.75 |
| 2012-02-03 03:00:00 | 1254.75 |
| 2012-02-03 04:00:00 | 1229.25 |
| 2012-02-03 05:00:00 | 1250 |
| 2012-02-03 06:00:00 | 1254.5 |
| 2012-02-03 07:00:00 | 1289.75 |
| 2012-02-03 08:00:00 | 1329.5 |
| 2012-02-03 09:00:00 | 1301 |
| 2012-02-03 10:00:00 | 1194 |
| 2012-02-03 11:00:00 | 1405.5 |
| 2012-02-03 12:00:00 | 1336.5 |
| 2012-02-03 13:00:00 | 1286.25 |
| 2012-02-03 14:00:00 | 1265.75 |
| 2012-02-03 15:00:00 | 1229.25 |
| 2012-02-03 16:00:00 | 1194.25 |
| 2012-02-03 17:00:00 | 1200.5 |
| 2012-02-03 18:00:00 | 1228.5 |
| 2012-02-03 19:00:00 | 1223.25 |
| 2012-02-03 20:00:00 | 1219.75 |
| 2012-02-03 21:00:00 | 1223.75 |
| 2012-02-03 22:00:00 | 1234 |
| 2012-02-03 23:00:00 | 1281.5 |
| 2012-02-04 | 1246.25 |
| 2012-02-04 01:00:00 | 1242.5 |
| 2012-02-04 02:00:00 | 1184.75 |
| 2012-02-04 03:00:00 | 1178 |
| 2012-02-04 04:00:00 | 1174 |
| 2012-02-04 05:00:00 | 1177.25 |
| 2012-02-04 06:00:00 | 1182.5 |
| 2012-02-04 07:00:00 | 1181.75 |
| 2012-02-04 08:00:00 | 1161.75 |
| 2012-02-04 09:00:00 | 1155 |
| 2012-02-04 10:00:00 | 1170 |
| 2012-02-04 11:00:00 | 1175.5 |
| 2012-02-04 12:00:00 | 1190 |
| 2012-02-04 13:00:00 | 1196.25 |
| 2012-02-04 14:00:00 | 1210 |
| 2012-02-04 15:00:00 | 1193.75 |
| 2012-02-04 16:00:00 | 1183.5 |
| 2012-02-04 17:00:00 | 1183 |
| 2012-02-04 18:00:00 | 1236.5 |
| 2012-02-04 19:00:00 | 1315.75 |
| 2012-02-04 20:00:00 | 1316.5 |
| 2012-02-04 21:00:00 | 1318.25 |
| 2012-02-04 22:00:00 | 1332.75 |
| 2012-02-04 23:00:00 | 1323.75 |
| 2012-02-05 | 1318.5 |
| 2012-02-05 01:00:00 | 1297.75 |
| 2012-02-05 02:00:00 | 1333.75 |
| 2012-02-05 03:00:00 | 1282.75 |
| 2012-02-05 04:00:00 | 1214 |
| 2012-02-05 05:00:00 | 1173.75 |
| 2012-02-05 06:00:00 | 1186.5 |
| 2012-02-05 07:00:00 | 1185.5 |
| 2012-02-05 08:00:00 | 1152 |
| 2012-02-05 09:00:00 | 1147 |
| 2012-02-05 10:00:00 | 1161.5 |
| 2012-02-05 11:00:00 | 1156.5 |
| 2012-02-05 12:00:00 | 1191.5 |
| 2012-02-05 13:00:00 | 1204.5 |
| 2012-02-05 14:00:00 | 1203.75 |
| 2012-02-05 15:00:00 | 1198 |
| 2012-02-05 16:00:00 | 1181.25 |
| 2012-02-05 17:00:00 | 1181.5 |
| 2012-02-05 18:00:00 | 1251.75 |
| 2012-02-05 19:00:00 | 1284 |
| 2012-02-05 20:00:00 | 1281.75 |
| 2012-02-05 21:00:00 | 1250.75 |
| 2012-02-05 22:00:00 | 1346 |
| 2012-02-05 23:00:00 | 1315.75 |
| 2012-02-06 | 1361 |
| 2012-02-06 01:00:00 | 1373.5 |
| 2012-02-06 02:00:00 | 1313.5 |
| 2012-02-06 03:00:00 | 1301 |
| 2012-02-06 04:00:00 | 1330.5 |
| 2012-02-06 05:00:00 | 1214.75 |
| 2012-02-06 06:00:00 | 1246.25 |
| 2012-02-06 07:00:00 | 1277.25 |
| 2012-02-06 08:00:00 | 1309.25 |
| 2012-02-06 09:00:00 | 1319.5 |
| 2012-02-06 10:00:00 | 1333.25 |
| 2012-02-06 11:00:00 | 1321.5 |
| 2012-02-06 12:00:00 | 1327.5 |
| 2012-02-06 13:00:00 | 1312.5 |
| 2012-02-06 14:00:00 | 1311 |
| 2012-02-06 15:00:00 | 1281.75 |
| 2012-02-06 16:00:00 | 1256.25 |
| 2012-02-06 17:00:00 | 1285.75 |
| 2012-02-06 18:00:00 | 1296.5 |
| 2012-02-06 19:00:00 | 1321.25 |
| 2012-02-06 20:00:00 | 1300.75 |
| 2012-02-06 21:00:00 | 1292 |
| 2012-02-06 22:00:00 | 1353.25 |
| 2012-02-06 23:00:00 | 1367.25 |
| 2012-02-07 | 1378.5 |
| 2012-02-07 01:00:00 | 1381.25 |
| 2012-02-07 02:00:00 | 1357.5 |
| 2012-02-07 03:00:00 | 1339 |
| 2012-02-07 04:00:00 | 1281 |
| 2012-02-07 05:00:00 | 1207.25 |
| 2012-02-07 06:00:00 | 1220.5 |
| 2012-02-07 07:00:00 | 1258.5 |
| 2012-02-07 08:00:00 | 1306.5 |
| 2012-02-07 09:00:00 | 1332.5 |
| 2012-02-07 10:00:00 | 1306.75 |
| 2012-02-07 11:00:00 | 1297.5 |
| 2012-02-07 12:00:00 | 1295 |
| 2012-02-07 13:00:00 | 1279 |
| 2012-02-07 14:00:00 | 1278 |
| 2012-02-07 15:00:00 | 1228.5 |
| 2012-02-07 16:00:00 | 1239.25 |
| 2012-02-07 17:00:00 | 1276 |
| 2012-02-07 18:00:00 | 1278 |
| 2012-02-07 19:00:00 | 1329.25 |
| 2012-02-07 20:00:00 | 1335.5 |
| 2012-02-07 21:00:00 | 1337.5 |
| 2012-02-07 22:00:00 | 1359 |
| 2012-02-07 23:00:00 | 1380 |
| 2012-02-08 | 1376.75 |
| 2012-02-08 01:00:00 | 1371.75 |
| 2012-02-08 02:00:00 | 1375.25 |
| 2012-02-08 03:00:00 | 1278.25 |
| 2012-02-08 04:00:00 | 1256 |
| 2012-02-08 05:00:00 | 1180 |
| 2012-02-08 06:00:00 | 1187.25 |
| 2012-02-08 07:00:00 | 1222.75 |
| 2012-02-08 08:00:00 | 1254 |
| 2012-02-08 09:00:00 | 1237.25 |
| 2012-02-08 10:00:00 | 1205.25 |
| 2012-02-08 11:00:00 | 1215.75 |
| 2012-02-08 12:00:00 | 1346.75 |
| 2012-02-08 13:00:00 | 1224.5 |
| 2012-02-08 14:00:00 | 1193.25 |
| 2012-02-08 15:00:00 | 1208 |
| 2012-02-08 16:00:00 | 1232.75 |
| 2012-02-08 17:00:00 | 1227.5 |
| 2012-02-08 18:00:00 | 1247.75 |
| 2012-02-08 19:00:00 | 1270.75 |
| 2012-02-08 20:00:00 | 1268.5 |
| 2012-02-08 21:00:00 | 1284 |
| 2012-02-08 22:00:00 | 1293.75 |
| 2012-02-08 23:00:00 | 1281.5 |
| 2012-02-09 | 1280.75 |
| 2012-02-09 01:00:00 | 1284.5 |
| 2012-02-09 02:00:00 | 1283.5 |
| 2012-02-09 03:00:00 | 1188.5 |
| 2012-02-09 04:00:00 | 1174.75 |
| 2012-02-09 05:00:00 | 1189.5 |
| 2012-02-09 06:00:00 | 1188.5 |
| 2012-02-09 07:00:00 | 1213.5 |
| 2012-02-09 08:00:00 | 1254.5 |
| 2012-02-09 09:00:00 | 1287 |
| 2012-02-09 10:00:00 | 1299 |
| 2012-02-09 11:00:00 | 1282.25 |
| 2012-02-09 12:00:00 | 1292.75 |
| 2012-02-09 13:00:00 | 1251.25 |
| 2012-02-09 14:00:00 | 1257.75 |
| 2012-02-09 15:00:00 | 1234.25 |
| 2012-02-09 16:00:00 | 1246 |
| 2012-02-09 17:00:00 | 1227.75 |
| 2012-02-09 18:00:00 | 1287.25 |
| 2012-02-09 19:00:00 | 1283 |
| 2012-02-09 20:00:00 | 1287 |
| 2012-02-09 21:00:00 | 1291.5 |
| 2012-02-09 22:00:00 | 1301.5 |
| 2012-02-09 23:00:00 | 1336.25 |
| 2012-02-10 | 1332.25 |
| 2012-02-10 01:00:00 | 1323.25 |
| 2012-02-10 02:00:00 | 1307.75 |
| 2012-02-10 03:00:00 | 1245.25 |
| 2012-02-10 04:00:00 | 1204 |
| 2012-02-10 05:00:00 | 1167.5 |
| 2012-02-10 06:00:00 | 1186.25 |
| 2012-02-10 07:00:00 | 1212 |
| 2012-02-10 08:00:00 | 1271.25 |
| 2012-02-10 09:00:00 | 1268 |
| 2012-02-10 10:00:00 | 1279.25 |
| 2012-02-10 11:00:00 | 1284 |
| 2012-02-10 12:00:00 | 1300.75 |
| 2012-02-10 13:00:00 | 1272.5 |
| 2012-02-10 14:00:00 | 1292.5 |
| 2012-02-10 15:00:00 | 1279.5 |
| 2012-02-10 16:00:00 | 1269.5 |
| 2012-02-10 17:00:00 | 1325.75 |
| 2012-02-10 18:00:00 | 1358.5 |
| 2012-02-10 19:00:00 | 1357 |
| 2012-02-10 20:00:00 | 1347.25 |
| 2012-02-10 21:00:00 | 1319.5 |
| 2012-02-10 22:00:00 | 1258.5 |
| 2012-02-10 23:00:00 | 1308.75 |
| 2012-02-11 | 1298 |
| 2012-02-11 01:00:00 | 1279.75 |
| 2012-02-11 02:00:00 | 1247.5 |
| 2012-02-11 03:00:00 | 1270.25 |
| 2012-02-11 04:00:00 | 1174.25 |
| 2012-02-11 05:00:00 | 1151.25 |
| 2012-02-11 06:00:00 | 1157.25 |
| 2012-02-11 07:00:00 | 1134.25 |
| 2012-02-11 08:00:00 | 1118 |
| 2012-02-11 09:00:00 | 1116 |
| 2012-02-11 10:00:00 | 1133.25 |
| 2012-02-11 11:00:00 | 1143 |
| 2012-02-11 12:00:00 | 1159.75 |
| 2012-02-11 13:00:00 | 1169 |
| 2012-02-11 14:00:00 | 1187 |
| 2012-02-11 15:00:00 | 1186.75 |
| 2012-02-11 16:00:00 | 1272.75 |
| 2012-02-11 17:00:00 | 1245.5 |
| 2012-02-11 18:00:00 | 1291.25 |
| 2012-02-11 19:00:00 | 1253.5 |
| 2012-02-11 20:00:00 | 1282.75 |
| 2012-02-11 21:00:00 | 1248.5 |
| 2012-02-11 22:00:00 | 1247.75 |
| 2012-02-11 23:00:00 | 1244.25 |
| 2012-02-12 | 1218.75 |
| 2012-02-12 01:00:00 | 1260.25 |
| 2012-02-12 02:00:00 | 1213.75 |
| 2012-02-12 03:00:00 | 1178 |
| 2012-02-12 04:00:00 | 1144.25 |
| 2012-02-12 05:00:00 | 1143 |
| 2012-02-12 06:00:00 | 1158.5 |
| 2012-02-12 07:00:00 | 1145 |
| 2012-02-12 08:00:00 | 1127 |
| 2012-02-12 09:00:00 | 1121 |
| 2012-02-12 10:00:00 | 1120.25 |
| 2012-02-12 11:00:00 | 1139 |
| 2012-02-12 12:00:00 | 1169 |
| 2012-02-12 13:00:00 | 1179.25 |
| 2012-02-12 14:00:00 | 1182.75 |
| 2012-02-12 15:00:00 | 1176.75 |
| 2012-02-12 16:00:00 | 1279.25 |
| 2012-02-12 17:00:00 | 1263.75 |
| 2012-02-12 18:00:00 | 1293 |
| 2012-02-12 19:00:00 | 1292.25 |
| 2012-02-12 20:00:00 | 1305.75 |
| 2012-02-12 21:00:00 | 1316.5 |
| 2012-02-12 22:00:00 | 1330.5 |
| 2012-02-12 23:00:00 | 1338.5 |
| 2012-02-13 | 1369.5 |
| 2012-02-13 01:00:00 | 1350.25 |
| 2012-02-13 02:00:00 | 1330 |
| 2012-02-13 03:00:00 | 1307 |
| 2012-02-13 04:00:00 | 1308.25 |
| 2012-02-13 05:00:00 | 1228.75 |
| 2012-02-13 06:00:00 | 1272.75 |
| 2012-02-13 07:00:00 | 1200.5 |
| 2012-02-13 08:00:00 | 1232.75 |
| 2012-02-13 09:00:00 | 1311 |
| 2012-02-13 10:00:00 | 1344.75 |
| 2012-02-13 11:00:00 | 1345.75 |
| 2012-02-13 12:00:00 | 1372.5 |
| 2012-02-13 13:00:00 | 1417 |
| 2012-02-13 14:00:00 | 1426 |
| 2012-02-13 15:00:00 | 1449.25 |
| 2012-02-13 16:00:00 | 1410.5 |
| 2012-02-13 17:00:00 | 1434.75 |
| 2012-02-13 18:00:00 | 1462.25 |
| 2012-02-13 19:00:00 | 1459.5 |
| 2012-02-13 20:00:00 | 1457.5 |
| 2012-02-13 21:00:00 | 1463 |
| 2012-02-13 22:00:00 | 1474.75 |
| 2012-02-13 23:00:00 | 1466 |
| 2012-02-14 | 1403 |
| 2012-02-14 01:00:00 | 1415 |
| 2012-02-14 02:00:00 | 1434 |
| 2012-02-14 03:00:00 | 1405 |
| 2012-02-14 04:00:00 | 1337.75 |
| 2012-02-14 05:00:00 | 1338.75 |
| 2012-02-14 06:00:00 | 1244.5 |
| 2012-02-14 07:00:00 | 1248.25 |
| 2012-02-14 08:00:00 | 1250.5 |
| 2012-02-14 09:00:00 | 1256.5 |
| 2012-02-14 10:00:00 | 1284.5 |
| 2012-02-14 11:00:00 | 1300.25 |
| 2012-02-14 12:00:00 | 1300.25 |
| 2012-02-14 13:00:00 | 1364.5 |
| 2012-02-14 14:00:00 | 1410.5 |
| 2012-02-14 15:00:00 | 1387.75 |
| 2012-02-14 16:00:00 | 1431 |
| 2012-02-14 17:00:00 | 1467.75 |
| 2012-02-14 18:00:00 | 1494 |
| 2012-02-14 19:00:00 | 1503.75 |
| 2012-02-14 20:00:00 | 1505.75 |
| 2012-02-14 21:00:00 | 1496 |
| 2012-02-14 22:00:00 | 1530.5 |
| 2012-02-14 23:00:00 | 1516.5 |
| 2012-02-15 | 1496.5 |
| 2012-02-15 01:00:00 | 1455.25 |
| 2012-02-15 02:00:00 | 1407.5 |
| 2012-02-15 03:00:00 | 1315.75 |
| 2012-02-15 04:00:00 | 1280 |
| 2012-02-15 05:00:00 | 1298.25 |
| 2012-02-15 06:00:00 | 1227 |
| 2012-02-15 07:00:00 | 1257.25 |
| 2012-02-15 08:00:00 | 1258 |
| 2012-02-15 09:00:00 | 1256.75 |
| 2012-02-15 10:00:00 | 1293 |
| 2012-02-15 11:00:00 | 1309 |
| 2012-02-15 12:00:00 | 1290.75 |
| 2012-02-15 13:00:00 | 1261.25 |
| 2012-02-15 14:00:00 | 1387.5 |
| 2012-02-15 15:00:00 | 1369.5 |
| 2012-02-15 16:00:00 | 1382.75 |
| 2012-02-15 17:00:00 | 1392.75 |
| 2012-02-15 18:00:00 | 1467 |
| 2012-02-15 19:00:00 | 1424 |
| 2012-02-15 20:00:00 | 1392.5 |
| 2012-02-15 21:00:00 | 1370.25 |
| 2012-02-15 22:00:00 | 1361.5 |
| 2012-02-15 23:00:00 | 1399 |
| 2012-02-16 | 1378.25 |
| 2012-02-16 01:00:00 | 1392 |
| 2012-02-16 02:00:00 | 1345.5 |
| 2012-02-16 03:00:00 | 1299 |
| 2012-02-16 04:00:00 | 1306.5 |
| 2012-02-16 05:00:00 | 1164.5 |
| 2012-02-16 06:00:00 | 1202.5 |
| 2012-02-16 07:00:00 | 1191.25 |
| 2012-02-16 08:00:00 | 1224 |
| 2012-02-16 09:00:00 | 1247.25 |
| 2012-02-16 10:00:00 | 1263.75 |
| 2012-02-16 11:00:00 | 1260.25 |
| 2012-02-16 12:00:00 | 1276 |
| 2012-02-16 13:00:00 | 1230.5 |
| 2012-02-16 14:00:00 | 1243.25 |
| 2012-02-16 15:00:00 | 1302.75 |
| 2012-02-16 16:00:00 | 1344.75 |
| 2012-02-16 17:00:00 | 1358.5 |
| 2012-02-16 18:00:00 | 1389.25 |
| 2012-02-16 19:00:00 | 1380 |
| 2012-02-16 20:00:00 | 1390 |
| 2012-02-16 21:00:00 | 1401.25 |
| 2012-02-16 22:00:00 | 1385.75 |
| 2012-02-16 23:00:00 | 1334.5 |
| 2012-02-17 | 1337.5 |
| 2012-02-17 01:00:00 | 1315.25 |
| 2012-02-17 02:00:00 | 1379.5 |
| 2012-02-17 03:00:00 | 1271.25 |
| 2012-02-17 04:00:00 | 1170.5 |
| 2012-02-17 05:00:00 | 1157.75 |
| 2012-02-17 06:00:00 | 1179 |
| 2012-02-17 07:00:00 | 1176.25 |
| 2012-02-17 08:00:00 | 1213.5 |
| 2012-02-17 09:00:00 | 1223 |
| 2012-02-17 10:00:00 | 1245.5 |
| 2012-02-17 11:00:00 | 1245.75 |
| 2012-02-17 12:00:00 | 1275.5 |
| 2012-02-17 13:00:00 | 1256.5 |
| 2012-02-17 14:00:00 | 1337.25 |
| 2012-02-17 15:00:00 | 1323.5 |
| 2012-02-17 16:00:00 | 1354.25 |
| 2012-02-17 17:00:00 | 1379.75 |
| 2012-02-17 18:00:00 | 1408.5 |
| 2012-02-17 19:00:00 | 1429 |
| 2012-02-17 20:00:00 | 1411.75 |
| 2012-02-17 21:00:00 | 1441 |
| 2012-02-17 22:00:00 | 1395.5 |
| 2012-02-17 23:00:00 | 1375.25 |
| 2012-02-18 | 1364.5 |
| 2012-02-18 01:00:00 | 1342.75 |
| 2012-02-18 02:00:00 | 1329.75 |
| 2012-02-18 03:00:00 | 1366.5 |
| 2012-02-18 04:00:00 | 1475 |
| 2012-02-18 05:00:00 | 1230.25 |
| 2012-02-18 06:00:00 | 1153.5 |
| 2012-02-18 07:00:00 | 1145 |
| 2012-02-18 08:00:00 | 1140.25 |
| 2012-02-18 09:00:00 | 1124.25 |
| 2012-02-18 10:00:00 | 1133.25 |
| 2012-02-18 11:00:00 | 1160.5 |
| 2012-02-18 12:00:00 | 1225.75 |
| 2012-02-18 13:00:00 | 1304.25 |
| 2012-02-18 14:00:00 | 1460 |
| 2012-02-18 15:00:00 | 1459.25 |
| 2012-02-18 16:00:00 | 1446.25 |
| 2012-02-18 17:00:00 | 1573 |
| 2012-02-18 18:00:00 | 1639.5 |
| 2012-02-18 19:00:00 | 1599 |
| 2012-02-18 20:00:00 | 1484.75 |
| 2012-02-18 21:00:00 | 1368.75 |
| 2012-02-18 22:00:00 | 1330.75 |
| 2012-02-18 23:00:00 | 1318.25 |
| 2012-02-19 | 1321 |
| 2012-02-19 01:00:00 | 1349.25 |
| 2012-02-19 02:00:00 | 1181.5 |
| 2012-02-19 03:00:00 | 1162.5 |
| 2012-02-19 04:00:00 | 1170.5 |
| 2012-02-19 05:00:00 | 1163.5 |
| 2012-02-19 06:00:00 | 1133 |
| 2012-02-19 07:00:00 | 1125 |
| 2012-02-19 08:00:00 | 1104.75 |
| 2012-02-19 09:00:00 | 1101.75 |
| 2012-02-19 10:00:00 | 1101.75 |
| 2012-02-19 11:00:00 | 1142 |
| 2012-02-19 12:00:00 | 1170.25 |
| 2012-02-19 13:00:00 | 1217.25 |
| 2012-02-19 14:00:00 | 1404 |
| 2012-02-19 15:00:00 | 1420.75 |
| 2012-02-19 16:00:00 | 1586 |
| 2012-02-19 17:00:00 | 1724.5 |
| 2012-02-19 18:00:00 | 1817.5 |
| 2012-02-19 19:00:00 | 1866.25 |
| 2012-02-19 20:00:00 | 1830.75 |
| 2012-02-19 21:00:00 | 1763 |
| 2012-02-19 22:00:00 | 1751.75 |
| 2012-02-19 23:00:00 | 1674.25 |
| 2012-02-20 | 1689 |
| 2012-02-20 01:00:00 | 1617.75 |
| 2012-02-20 02:00:00 | 1259.25 |
| 2012-02-20 03:00:00 | 1241.75 |
| 2012-02-20 04:00:00 | 1251.75 |
| 2012-02-20 05:00:00 | 1241 |
| 2012-02-20 06:00:00 | 1246 |
| 2012-02-20 07:00:00 | 1235 |
| 2012-02-20 08:00:00 | 1242 |
| 2012-02-20 09:00:00 | 1267.25 |
| 2012-02-20 10:00:00 | 1292.5 |
| 2012-02-20 11:00:00 | 1346 |
| 2012-02-20 12:00:00 | 1373 |
| 2012-02-20 13:00:00 | 1421 |
| 2012-02-20 14:00:00 | 1483.25 |
| 2012-02-20 15:00:00 | 1332 |
| 2012-02-20 16:00:00 | 1421 |
| 2012-02-20 17:00:00 | 1441 |
| 2012-02-20 18:00:00 | 1450.25 |
| 2012-02-20 19:00:00 | 1487.75 |
| 2012-02-20 20:00:00 | 1550.75 |
| 2012-02-20 21:00:00 | 1553 |
| 2012-02-20 22:00:00 | 1589 |
| 2012-02-20 23:00:00 | 1580.5 |
| 2012-02-21 | 1524 |
| 2012-02-21 01:00:00 | 1470.5 |
| 2012-02-21 02:00:00 | 1396.5 |
| 2012-02-21 03:00:00 | 1291.5 |
| 2012-02-21 04:00:00 | 1255.25 |
| 2012-02-21 05:00:00 | 1155.5 |
| 2012-02-21 06:00:00 | 1212 |
| 2012-02-21 07:00:00 | 1249.75 |
| 2012-02-21 08:00:00 | 1248.5 |
| 2012-02-21 09:00:00 | 1263.25 |
| 2012-02-21 10:00:00 | 1329 |
| 2012-02-21 11:00:00 | 1287.5 |
| 2012-02-21 12:00:00 | 1395 |
| 2012-02-21 13:00:00 | 1414.25 |
| 2012-02-21 14:00:00 | 1483.25 |
| 2012-02-21 15:00:00 | 1557.5 |
| 2012-02-21 16:00:00 | 1607.25 |
| 2012-02-21 17:00:00 | 1588.75 |
| 2012-02-21 18:00:00 | 1694.25 |
| 2012-02-21 19:00:00 | 1601.5 |
| 2012-02-21 20:00:00 | 1502 |
| 2012-02-21 21:00:00 | 1602.75 |
| 2012-02-21 22:00:00 | 1398.25 |
| 2012-02-21 23:00:00 | 1357.25 |
| 2012-02-22 | 1368.25 |
| 2012-02-22 01:00:00 | 1411.75 |
| 2012-02-22 02:00:00 | 1376 |
| 2012-02-22 03:00:00 | 1357.75 |
| 2012-02-22 04:00:00 | 1232.75 |
| 2012-02-22 05:00:00 | 1202.5 |
| 2012-02-22 06:00:00 | 1213.5 |
| 2012-02-22 07:00:00 | 1248.5 |
| 2012-02-22 08:00:00 | 1245 |
| 2012-02-22 09:00:00 | 1263.75 |
| 2012-02-22 10:00:00 | 1275.25 |
| 2012-02-22 11:00:00 | 1282.5 |
| 2012-02-22 12:00:00 | 1351.25 |
| 2012-02-22 13:00:00 | 1466.75 |
| 2012-02-22 14:00:00 | 1580.75 |
| 2012-02-22 15:00:00 | 1585.25 |
| 2012-02-22 16:00:00 | 1626 |
| 2012-02-22 17:00:00 | 1683.5 |
| 2012-02-22 18:00:00 | 1774.75 |
| 2012-02-22 19:00:00 | 1726.5 |
| 2012-02-22 20:00:00 | 1651 |
| 2012-02-22 21:00:00 | 1577.75 |
| 2012-02-22 22:00:00 | 1467.5 |
| 2012-02-22 23:00:00 | 1427.25 |
| 2012-02-23 | 1514 |
| 2012-02-23 01:00:00 | 1491 |
| 2012-02-23 02:00:00 | 1410.75 |
| 2012-02-23 03:00:00 | 1426 |
| 2012-02-23 04:00:00 | 1499.5 |
| 2012-02-23 05:00:00 | 1344 |
| 2012-02-23 06:00:00 | 1294 |
| 2012-02-23 07:00:00 | 1255 |
| 2012-02-23 08:00:00 | 1244.25 |
| 2012-02-23 09:00:00 | 1286 |
| 2012-02-23 10:00:00 | 1336 |
| 2012-02-23 11:00:00 | 1354.75 |
| 2012-02-23 12:00:00 | 1451.75 |
| 2012-02-23 13:00:00 | 1495.5 |
| 2012-02-23 14:00:00 | 1491.5 |
| 2012-02-23 15:00:00 | 1530.75 |
| 2012-02-23 16:00:00 | 1679.25 |
| 2012-02-23 17:00:00 | 1795.25 |
| 2012-02-23 18:00:00 | 1766.5 |
| 2012-02-23 19:00:00 | 1590 |
| 2012-02-23 20:00:00 | 1664.25 |
| 2012-02-23 21:00:00 | 1656.25 |
| 2012-02-23 22:00:00 | 1593.5 |
| 2012-02-23 23:00:00 | 1533.75 |
| 2012-02-24 | 1503.25 |
| 2012-02-24 01:00:00 | 1485.5 |
| 2012-02-24 02:00:00 | 1437.25 |
| 2012-02-24 03:00:00 | 1351.75 |
| 2012-02-24 04:00:00 | 1351.75 |
| 2012-02-24 05:00:00 | 1223 |
| 2012-02-24 06:00:00 | 901.25 |
| 2012-02-24 07:00:00 | 421.75 |
| 2012-02-24 08:00:00 | 398.5 |
| 2012-02-24 09:00:00 | 1195 |
| 2012-02-24 10:00:00 | 1374.75 |
| 2012-02-24 11:00:00 | 1532 |
| 2012-02-24 12:00:00 | 1624 |
| 2012-02-24 13:00:00 | 1673.5 |
| 2012-02-24 14:00:00 | 1699.75 |
| 2012-02-24 15:00:00 | 1671.5 |
| 2012-02-24 16:00:00 | 1658.25 |
| 2012-02-24 17:00:00 | 1645.5 |
| 2012-02-24 18:00:00 | 1660.25 |
| 2012-02-24 19:00:00 | 1629.5 |
| 2012-02-24 20:00:00 | 1649.5 |
| 2012-02-24 21:00:00 | 1592.75 |
| 2012-02-24 22:00:00 | 1527.5 |
| 2012-02-24 23:00:00 | 1558.75 |
| 2012-02-25 | 1478 |
| 2012-02-25 01:00:00 | 1453.5 |
| 2012-02-25 02:00:00 | 1367 |
| 2012-02-25 03:00:00 | 1310.25 |
| 2012-02-25 04:00:00 | 1371.75 |
| 2012-02-25 05:00:00 | 1361.5 |
| 2012-02-25 06:00:00 | 1334.75 |
| 2012-02-25 07:00:00 | 1271.5 |
| 2012-02-25 08:00:00 | 1212.5 |
| 2012-02-25 09:00:00 | 1122 |
| 2012-02-25 10:00:00 | 1108.75 |
| 2012-02-25 11:00:00 | 1151.25 |
| 2012-02-25 12:00:00 | 1186 |
| 2012-02-25 13:00:00 | 1175.25 |
| 2012-02-25 14:00:00 | 1181.25 |
| 2012-02-25 15:00:00 | 1162.75 |
| 2012-02-25 16:00:00 | 1252.5 |
| 2012-02-25 17:00:00 | 1298 |
| 2012-02-25 18:00:00 | 1358 |
| 2012-02-25 19:00:00 | 1363.25 |
| 2012-02-25 20:00:00 | 1445 |
| 2012-02-25 21:00:00 | 1464.25 |
| 2012-02-25 22:00:00 | 1400.75 |
| 2012-02-25 23:00:00 | 1320 |
| 2012-02-26 | 1285 |
| 2012-02-26 01:00:00 | 1214.25 |
| 2012-02-26 02:00:00 | 1135.75 |
| 2012-02-26 03:00:00 | 1176.25 |
| 2012-02-26 04:00:00 | 1142.25 |
| 2012-02-26 05:00:00 | 1147.75 |
| 2012-02-26 06:00:00 | 1099.5 |
| 2012-02-26 07:00:00 | 1027.75 |
| 2012-02-26 08:00:00 | 1063.75 |
| 2012-02-26 09:00:00 | 1087 |
| 2012-02-26 10:00:00 | 1080.25 |
| 2012-02-26 11:00:00 | 1146.25 |
| 2012-02-26 12:00:00 | 1162.5 |
| 2012-02-26 13:00:00 | 1154.75 |
| 2012-02-26 14:00:00 | 1219.25 |
| 2012-02-26 15:00:00 | 1223 |
| 2012-02-26 16:00:00 | 1291.5 |
| 2012-02-26 17:00:00 | 1302.5 |
| 2012-02-26 18:00:00 | 1344.5 |
| 2012-02-26 19:00:00 | 1381.25 |
| 2012-02-26 20:00:00 | 1332.25 |
| 2012-02-26 21:00:00 | 1356.5 |
| 2012-02-26 22:00:00 | 1361.5 |
| 2012-02-26 23:00:00 | 1465.5 |
| 2012-02-27 | 1510.75 |
| 2012-02-27 01:00:00 | 1486.75 |
| 2012-02-27 02:00:00 | 1398.5 |
| 2012-02-27 03:00:00 | 1245 |
| 2012-02-27 04:00:00 | 1235.5 |
| 2012-02-27 05:00:00 | 1198 |
| 2012-02-27 06:00:00 | 1173.75 |
| 2012-02-27 07:00:00 | 1138.5 |
| 2012-02-27 08:00:00 | 1159 |
| 2012-02-27 09:00:00 | 1194.75 |
| 2012-02-27 10:00:00 | 1239.75 |
| 2012-02-27 11:00:00 | 1261.75 |
| 2012-02-27 12:00:00 | 1282.5 |
| 2012-02-27 13:00:00 | 1235.75 |
| 2012-02-27 14:00:00 | 1316.25 |
| 2012-02-27 15:00:00 | 1321.25 |
| 2012-02-27 16:00:00 | 1350.25 |
| 2012-02-27 17:00:00 | 1351.75 |
| 2012-02-27 18:00:00 | 1365.5 |
| 2012-02-27 19:00:00 | 1397.25 |
| 2012-02-27 20:00:00 | 1388 |
| 2012-02-27 21:00:00 | 1456.5 |
| 2012-02-27 22:00:00 | 1408 |
| 2012-02-27 23:00:00 | 1423 |
| 2012-02-28 | 1405.25 |
| 2012-02-28 01:00:00 | 1415.75 |
| 2012-02-28 02:00:00 | 1379.5 |
| 2012-02-28 03:00:00 | 1315.5 |
| 2012-02-28 04:00:00 | 1297.5 |
| 2012-02-28 05:00:00 | 1247.75 |
| 2012-02-28 06:00:00 | 1257.25 |
| 2012-02-28 07:00:00 | 1203.5 |
| 2012-02-28 08:00:00 | 1245 |
| 2012-02-28 09:00:00 | 1249.5 |
| 2012-02-28 10:00:00 | 1446 |
| 2012-02-28 11:00:00 | 1361.75 |
| 2012-02-28 12:00:00 | 1342.25 |
| 2012-02-28 13:00:00 | 1360.75 |
| 2012-02-28 14:00:00 | 1458.25 |
| 2012-02-28 15:00:00 | 1512.5 |
| 2012-02-28 16:00:00 | 1601.25 |
| 2012-02-28 17:00:00 | 1634.75 |
| 2012-02-28 18:00:00 | 1677.25 |
| 2012-02-28 19:00:00 | 1727.75 |
| 2012-02-28 20:00:00 | 1854 |
| 2012-02-28 21:00:00 | 1845.25 |
| 2012-02-28 22:00:00 | 1808.5 |
| 2012-02-28 23:00:00 | 1743 |
| 2012-02-29 | 1768 |
| 2012-02-29 01:00:00 | 1685.75 |
| 2012-02-29 02:00:00 | 1649.75 |
| 2012-02-29 03:00:00 | 1742 |
| 2012-02-29 04:00:00 | 1703.25 |
| 2012-02-29 05:00:00 | 1698 |
| 2012-02-29 06:00:00 | 1653.5 |
| 2012-02-29 07:00:00 | 1692.25 |
| 2012-02-29 08:00:00 | 1618 |
| 2012-02-29 09:00:00 | 1525.75 |
| 2012-02-29 10:00:00 | 1550.5 |
| 2012-02-29 11:00:00 | 1536.75 |
| 2012-02-29 12:00:00 | 1538.25 |
| 2012-02-29 13:00:00 | 1489 |
| 2012-02-29 14:00:00 | 1508.25 |
| 2012-02-29 15:00:00 | 1427.75 |
| 2012-02-29 16:00:00 | 1460 |
| 2012-02-29 17:00:00 | 1508.75 |
| 2012-02-29 18:00:00 | 1590.5 |
| 2012-02-29 19:00:00 | 1578.5 |
| 2012-02-29 20:00:00 | 1560.25 |
| 2012-02-29 21:00:00 | 1536.75 |
| 2012-02-29 22:00:00 | 1609.25 |
| 2012-02-29 23:00:00 | 1607 |
| 2012-03-01 | 1670.75 |
| 2012-03-01 01:00:00 | 1599.5 |
| 2012-03-01 02:00:00 | 1621.75 |
| 2012-03-01 03:00:00 | 1579.5 |
| 2012-03-01 04:00:00 | 1577 |
| 2012-03-01 05:00:00 | 1327 |
| 2012-03-01 06:00:00 | 1296 |
| 2012-03-01 07:00:00 | 1433.75 |
| 2012-03-01 08:00:00 | 1540.5 |
| 2012-03-01 09:00:00 | 1616.25 |
| 2012-03-01 10:00:00 | 1622 |
| 2012-03-01 11:00:00 | 1545.25 |
| 2012-03-01 12:00:00 | 1579.75 |
| 2012-03-01 13:00:00 | 1571 |
| 2012-03-01 14:00:00 | 1668.75 |
| 2012-03-01 15:00:00 | 1593.5 |
| 2012-03-01 16:00:00 | 1524.5 |
| 2012-03-01 17:00:00 | 1494.25 |
| 2012-03-01 18:00:00 | 1520.25 |
| 2012-03-01 19:00:00 | 1550.5 |
| 2012-03-01 20:00:00 | 1627.5 |
| 2012-03-01 21:00:00 | 1562.75 |
| 2012-03-01 22:00:00 | 1569.75 |
| 2012-03-01 23:00:00 | 1555.5 |
| 2012-03-02 | 1534.75 |
| 2012-03-02 01:00:00 | 1452.75 |
| 2012-03-02 02:00:00 | 1412.25 |
| 2012-03-02 03:00:00 | 1385.75 |
| 2012-03-02 04:00:00 | 1454.25 |
| 2012-03-02 05:00:00 | 1446.25 |
| 2012-03-02 06:00:00 | 1407.75 |
| 2012-03-02 07:00:00 | 1304 |
| 2012-03-02 08:00:00 | 1273.25 |
| 2012-03-02 09:00:00 | 1276.25 |
| 2012-03-02 10:00:00 | 1328.75 |
| 2012-03-02 11:00:00 | 1351.75 |
| 2012-03-02 12:00:00 | 1483.25 |
| 2012-03-02 13:00:00 | 1354.75 |
| 2012-03-02 14:00:00 | 1404.25 |
| 2012-03-02 15:00:00 | 1453 |
| 2012-03-02 16:00:00 | 1421.75 |
| 2012-03-02 17:00:00 | 1495.75 |
| 2012-03-02 18:00:00 | 1467.75 |
| 2012-03-02 19:00:00 | 1470 |
| 2012-03-02 20:00:00 | 1495 |
| 2012-03-02 21:00:00 | 1419 |
| 2012-03-02 22:00:00 | 1355.75 |
| 2012-03-02 23:00:00 | 1329.25 |
| 2012-03-03 | 1386.25 |
| 2012-03-03 01:00:00 | 1301.25 |
| 2012-03-03 02:00:00 | 1317.25 |
| 2012-03-03 03:00:00 | 1221.5 |
| 2012-03-03 04:00:00 | 1190.5 |
| 2012-03-03 05:00:00 | 1145.75 |
| 2012-03-03 06:00:00 | 1154.25 |
| 2012-03-03 07:00:00 | 1151.5 |
| 2012-03-03 08:00:00 | 1130 |
| 2012-03-03 09:00:00 | 1130.25 |
| 2012-03-03 10:00:00 | 1149.5 |
| 2012-03-03 11:00:00 | 1165.25 |
| 2012-03-03 12:00:00 | 1202 |
| 2012-03-03 13:00:00 | 1206.75 |
| 2012-03-03 14:00:00 | 1251.25 |
| 2012-03-03 15:00:00 | 1214 |
| 2012-03-03 16:00:00 | 1175.5 |
| 2012-03-03 17:00:00 | 1274.75 |
| 2012-03-03 18:00:00 | 1350.25 |
| 2012-03-03 19:00:00 | 1446 |
| 2012-03-03 20:00:00 | 1462.75 |
| 2012-03-03 21:00:00 | 1430.25 |
| 2012-03-03 22:00:00 | 1369.75 |
| 2012-03-03 23:00:00 | 1401 |
| 2012-03-04 | 1344.75 |
| 2012-03-04 01:00:00 | 1298.5 |
| 2012-03-04 02:00:00 | 1306 |
| 2012-03-04 03:00:00 | 1221.5 |
| 2012-03-04 04:00:00 | 1193.5 |
| 2012-03-04 05:00:00 | 1120.5 |
| 2012-03-04 06:00:00 | 1127.75 |
| 2012-03-04 07:00:00 | 1099.25 |
| 2012-03-04 08:00:00 | 1109.25 |
| 2012-03-04 09:00:00 | 1095.25 |
| 2012-03-04 10:00:00 | 1113 |
| 2012-03-04 11:00:00 | 1131 |
| 2012-03-04 12:00:00 | 1158 |
| 2012-03-04 13:00:00 | 1159.75 |
| 2012-03-04 14:00:00 | 1167.75 |
| 2012-03-04 15:00:00 | 1215.5 |
| 2012-03-04 16:00:00 | 1207.75 |
| 2012-03-04 17:00:00 | 1228.75 |
| 2012-03-04 18:00:00 | 1229.75 |
| 2012-03-04 19:00:00 | 1328.5 |
| 2012-03-04 20:00:00 | 1375.25 |
| 2012-03-04 21:00:00 | 1336.75 |
| 2012-03-04 22:00:00 | 1381.5 |
| 2012-03-04 23:00:00 | 1316 |
| 2012-03-05 | 1344.75 |
| 2012-03-05 01:00:00 | 1303.25 |
| 2012-03-05 02:00:00 | 1311 |
| 2012-03-05 03:00:00 | 1221.75 |
| 2012-03-05 04:00:00 | 1184.75 |
| 2012-03-05 05:00:00 | 1191.25 |
| 2012-03-05 06:00:00 | 1212 |
| 2012-03-05 07:00:00 | 1200 |
| 2012-03-05 08:00:00 | 1214.25 |
| 2012-03-05 09:00:00 | 1225.5 |
| 2012-03-05 10:00:00 | 1305 |
| 2012-03-05 11:00:00 | 1302 |
| 2012-03-05 12:00:00 | 1348.5 |
| 2012-03-05 13:00:00 | 1347 |
| 2012-03-05 14:00:00 | 1324.5 |
| 2012-03-05 15:00:00 | 1272.5 |
| 2012-03-05 16:00:00 | 1377.75 |
| 2012-03-05 17:00:00 | 1256.75 |
| 2012-03-05 18:00:00 | 1270.5 |
| 2012-03-05 19:00:00 | 1279.75 |
| 2012-03-05 20:00:00 | 1321.5 |
| 2012-03-05 21:00:00 | 1365 |
| 2012-03-05 22:00:00 | 1390.5 |
| 2012-03-05 23:00:00 | 1485.75 |
| 2012-03-06 | 1421.75 |
| 2012-03-06 01:00:00 | 1401.5 |
| 2012-03-06 02:00:00 | 1364.5 |
| 2012-03-06 03:00:00 | 1289.25 |
| 2012-03-06 04:00:00 | 1240.75 |
| 2012-03-06 05:00:00 | 1232.25 |
| 2012-03-06 06:00:00 | 1182.5 |
| 2012-03-06 07:00:00 | 1191.5 |
| 2012-03-06 08:00:00 | 1217.5 |
| 2012-03-06 09:00:00 | 1246.5 |
| 2012-03-06 10:00:00 | 1283 |
| 2012-03-06 11:00:00 | 1312.5 |
| 2012-03-06 12:00:00 | 1308.5 |
| 2012-03-06 13:00:00 | 1278.25 |
| 2012-03-06 14:00:00 | 1242.25 |
| 2012-03-06 15:00:00 | 1268.25 |
| 2012-03-06 16:00:00 | 1258.75 |
| 2012-03-06 17:00:00 | 1248.25 |
| 2012-03-06 18:00:00 | 1398.5 |
| 2012-03-06 19:00:00 | 1375.5 |
| 2012-03-06 20:00:00 | 1298.75 |
| 2012-03-06 21:00:00 | 1339.5 |
| 2012-03-06 22:00:00 | 1363.75 |
| 2012-03-06 23:00:00 | 1402.5 |
| 2012-03-07 | 1397.75 |
| 2012-03-07 01:00:00 | 1376 |
| 2012-03-07 02:00:00 | 1441.5 |
| 2012-03-07 03:00:00 | 1347.5 |
| 2012-03-07 04:00:00 | 1294.5 |
| 2012-03-07 05:00:00 | 1232.75 |
| 2012-03-07 06:00:00 | 1168.75 |
| 2012-03-07 07:00:00 | 1139.5 |
| 2012-03-07 08:00:00 | 1190.25 |
| 2012-03-07 09:00:00 | 1214 |
| 2012-03-07 10:00:00 | 1267.75 |
| 2012-03-07 11:00:00 | 1252.75 |
| 2012-03-07 12:00:00 | 1290.25 |
| 2012-03-07 13:00:00 | 1341 |
| 2012-03-07 14:00:00 | 1395.75 |
| 2012-03-07 15:00:00 | 1401.25 |
| 2012-03-07 16:00:00 | 1458 |
| 2012-03-07 17:00:00 | 1417 |
| 2012-03-07 18:00:00 | 1472.75 |
| 2012-03-07 19:00:00 | 1475.25 |
| 2012-03-07 20:00:00 | 1456 |
| 2012-03-07 21:00:00 | 1381 |
| 2012-03-07 22:00:00 | 1473 |
| 2012-03-07 23:00:00 | 1414.25 |
| 2012-03-08 | 1408 |
| 2012-03-08 01:00:00 | 1395 |
| 2012-03-08 02:00:00 | 1313.5 |
| 2012-03-08 03:00:00 | 1232 |
| 2012-03-08 04:00:00 | 1185.5 |
| 2012-03-08 05:00:00 | 1134.75 |
| 2012-03-08 06:00:00 | 1153.25 |
| 2012-03-08 07:00:00 | 1127 |
| 2012-03-08 08:00:00 | 1191.25 |
| 2012-03-08 09:00:00 | 1211 |
| 2012-03-08 10:00:00 | 1235.5 |
| 2012-03-08 11:00:00 | 1238.5 |
| 2012-03-08 12:00:00 | 1263.5 |
| 2012-03-08 13:00:00 | 1292.5 |
| 2012-03-08 14:00:00 | 1351.25 |
| 2012-03-08 15:00:00 | 1371 |
| 2012-03-08 16:00:00 | 1374.5 |
| 2012-03-08 17:00:00 | 1355.75 |
| 2012-03-08 18:00:00 | 1411.5 |
| 2012-03-08 19:00:00 | 1383.5 |
| 2012-03-08 20:00:00 | 1380.75 |
| 2012-03-08 21:00:00 | 1391.5 |
| 2012-03-08 22:00:00 | 1418.25 |
| 2012-03-08 23:00:00 | 1440.5 |
| 2012-03-09 | 1398.75 |
| 2012-03-09 01:00:00 | 1432.75 |
| 2012-03-09 02:00:00 | 1383.25 |
| 2012-03-09 03:00:00 | 1329.25 |
| 2012-03-09 04:00:00 | 1160 |
| 2012-03-09 05:00:00 | 1160 |
| 2012-03-09 06:00:00 | 1194.5 |
| 2012-03-09 07:00:00 | 1165.5 |
| 2012-03-09 08:00:00 | 1143.5 |
| 2012-03-09 09:00:00 | 1119 |
| 2012-03-09 10:00:00 | 1170.5 |
| 2012-03-09 11:00:00 | 1191.5 |
| 2012-03-09 12:00:00 | 1248 |
| 2012-03-09 13:00:00 | 1239.25 |
| 2012-03-09 14:00:00 | 1319.25 |
| 2012-03-09 15:00:00 | 1298.75 |
| 2012-03-09 16:00:00 | 1252.75 |
| 2012-03-09 17:00:00 | 1219.5 |
| 2012-03-09 18:00:00 | 1201.25 |
| 2012-03-09 19:00:00 | 1270.25 |
| 2012-03-09 20:00:00 | 1287.75 |
| 2012-03-09 21:00:00 | 1218.25 |
| 2012-03-09 22:00:00 | 1225 |
| 2012-03-09 23:00:00 | 1224.25 |
| 2012-03-10 | 1202.5 |
| 2012-03-10 01:00:00 | 1166.25 |
| 2012-03-10 02:00:00 | 1152 |
| 2012-03-10 03:00:00 | 1108.75 |
| 2012-03-10 04:00:00 | 1091.5 |
| 2012-03-10 05:00:00 | 1069.25 |
| 2012-03-10 06:00:00 | 1077.75 |
| 2012-03-10 07:00:00 | 1051.75 |
| 2012-03-10 08:00:00 | 1040 |
| 2012-03-10 09:00:00 | 1031.25 |
| 2012-03-10 10:00:00 | 1055.5 |
| 2012-03-10 11:00:00 | 1061.25 |
| 2012-03-10 12:00:00 | 1106 |
| 2012-03-10 13:00:00 | 1099 |
| 2012-03-10 14:00:00 | 1106.25 |
| 2012-03-10 15:00:00 | 1183.75 |
| 2012-03-10 16:00:00 | 1196.75 |
| 2012-03-10 17:00:00 | 1249.75 |
| 2012-03-10 18:00:00 | 1241.5 |
| 2012-03-10 19:00:00 | 1237.25 |
| 2012-03-10 20:00:00 | 1212.75 |
| 2012-03-10 21:00:00 | 1205.75 |
| 2012-03-10 22:00:00 | 1217.5 |
| 2012-03-10 23:00:00 | 1240.75 |
| 2012-03-11 | 1278.75 |
| 2012-03-11 01:00:00 | 1312.5 |
| 2012-03-11 02:00:00 | 1277.5 |
| 2012-03-11 03:00:00 | 1210.25 |
| 2012-03-11 04:00:00 | 1164.75 |
| 2012-03-11 05:00:00 | 1058.25 |
| 2012-03-11 06:00:00 | 1082 |
| 2012-03-11 07:00:00 | 1049.25 |
| 2012-03-11 08:00:00 | 1060.25 |
| 2012-03-11 09:00:00 | 1069.75 |
| 2012-03-11 10:00:00 | 1093.5 |
| 2012-03-11 11:00:00 | 1141 |
| 2012-03-11 12:00:00 | 1234.5 |
| 2012-03-11 13:00:00 | 1189.25 |
| 2012-03-11 14:00:00 | 1173.25 |
| 2012-03-11 15:00:00 | 1222.25 |
| 2012-03-11 16:00:00 | 1190.25 |
| 2012-03-11 17:00:00 | 1258.25 |
| 2012-03-11 18:00:00 | 1202.25 |
| 2012-03-11 19:00:00 | 1190.5 |
| 2012-03-11 20:00:00 | 1202.25 |
| 2012-03-11 21:00:00 | 1125.25 |
| 2012-03-11 22:00:00 | 1151 |
| 2012-03-11 23:00:00 | 1207.25 |
| 2012-03-12 | 1254 |
| 2012-03-12 01:00:00 | 1245 |
| 2012-03-12 02:00:00 | 1176.5 |
| 2012-03-12 03:00:00 | 1198.25 |
| 2012-03-12 04:00:00 | 1142.5 |
| 2012-03-12 05:00:00 | 1091.5 |
| 2012-03-12 06:00:00 | 1077 |
| 2012-03-12 07:00:00 | 1084.75 |
| 2012-03-12 08:00:00 | 1108.5 |
| 2012-03-12 09:00:00 | 1161.75 |
| 2012-03-12 10:00:00 | 1216.5 |
| 2012-03-12 11:00:00 | 1314.25 |
| 2012-03-12 12:00:00 | 1259.25 |
| 2012-03-12 13:00:00 | 1340.75 |
| 2012-03-12 14:00:00 | 1319.75 |
| 2012-03-12 15:00:00 | 1322.75 |
| 2012-03-12 16:00:00 | 1425.75 |
| 2012-03-12 17:00:00 | 1325.5 |
| 2012-03-12 18:00:00 | 1342 |
| 2012-03-12 19:00:00 | 1449.25 |
| 2012-03-12 20:00:00 | 1396 |
| 2012-03-12 21:00:00 | 1447.5 |
| 2012-03-12 22:00:00 | 1484.5 |
| 2012-03-12 23:00:00 | 1541 |
| 2012-03-13 | 1619.25 |
| 2012-03-13 01:00:00 | 1554.25 |
| 2012-03-13 02:00:00 | 1556.5 |
| 2012-03-13 03:00:00 | 1423.5 |
| 2012-03-13 04:00:00 | 1339.5 |
| 2012-03-13 05:00:00 | 1230.75 |
| 2012-03-13 06:00:00 | 1178 |
| 2012-03-13 07:00:00 | 1185.5 |
| 2012-03-13 08:00:00 | 1181.25 |
| 2012-03-13 09:00:00 | 1210.5 |
| 2012-03-13 10:00:00 | 1303.25 |
| 2012-03-13 11:00:00 | 1257.75 |
| 2012-03-13 12:00:00 | 1259 |
| 2012-03-13 13:00:00 | 1267 |
| 2012-03-13 14:00:00 | 1338.5 |
| 2012-03-13 15:00:00 | 1435.5 |
| 2012-03-13 16:00:00 | 1362 |
| 2012-03-13 17:00:00 | 1423 |
| 2012-03-13 18:00:00 | 1393.25 |
| 2012-03-13 19:00:00 | 1402.5 |
| 2012-03-13 20:00:00 | 1377.5 |
| 2012-03-13 21:00:00 | 1460.5 |
| 2012-03-13 22:00:00 | 1408.25 |
| 2012-03-13 23:00:00 | 1393 |
| 2012-03-14 | 1350 |
| 2012-03-14 01:00:00 | 1345.5 |
| 2012-03-14 02:00:00 | 1308.25 |
| 2012-03-14 03:00:00 | 1271 |
| 2012-03-14 04:00:00 | 1242.5 |
| 2012-03-14 05:00:00 | 1154 |
| 2012-03-14 06:00:00 | 1149.5 |
| 2012-03-14 07:00:00 | 1150 |
| 2012-03-14 08:00:00 | 1172 |
| 2012-03-14 09:00:00 | 1180.25 |
| 2012-03-14 10:00:00 | 1204.75 |
| 2012-03-14 11:00:00 | 1205.5 |
| 2012-03-14 12:00:00 | 1213.75 |
| 2012-03-14 13:00:00 | 1216.25 |
| 2012-03-14 14:00:00 | 1246.75 |
| 2012-03-14 15:00:00 | 1323.25 |
| 2012-03-14 16:00:00 | 1255 |
| 2012-03-14 17:00:00 | 1379.5 |
| 2012-03-14 18:00:00 | 1317.25 |
| 2012-03-14 19:00:00 | 1330 |
| 2012-03-14 20:00:00 | 1277.75 |
| 2012-03-14 21:00:00 | 1280 |
| 2012-03-14 22:00:00 | 1306 |
| 2012-03-14 23:00:00 | 1298.75 |
| 2012-03-15 | 1287.5 |
| 2012-03-15 01:00:00 | 1249.25 |
| 2012-03-15 02:00:00 | 1239.25 |
| 2012-03-15 03:00:00 | 1186 |
| 2012-03-15 04:00:00 | 1141.75 |
| 2012-03-15 05:00:00 | 1158.75 |
| 2012-03-15 06:00:00 | 1146.75 |
| 2012-03-15 07:00:00 | 1114.25 |
| 2012-03-15 08:00:00 | 1151 |
| 2012-03-15 09:00:00 | 1181.5 |
| 2012-03-15 10:00:00 | 1196.5 |
| 2012-03-15 11:00:00 | 1208 |
| 2012-03-15 12:00:00 | 1237.5 |
| 2012-03-15 13:00:00 | 1272.25 |
| 2012-03-15 14:00:00 | 1247.5 |
| 2012-03-15 15:00:00 | 1216.5 |
| 2012-03-15 16:00:00 | 1236.75 |
| 2012-03-15 17:00:00 | 1267.5 |
| 2012-03-15 18:00:00 | 1265 |
| 2012-03-15 19:00:00 | 1278.5 |
| 2012-03-15 20:00:00 | 1335 |
| 2012-03-15 21:00:00 | 1220.5 |
| 2012-03-15 22:00:00 | 1348.5 |
| 2012-03-15 23:00:00 | 1476.75 |
| 2012-03-16 | 1345.25 |
| 2012-03-16 01:00:00 | 1376.5 |
| 2012-03-16 02:00:00 | 1249.75 |
| 2012-03-16 03:00:00 | 1198.75 |
| 2012-03-16 04:00:00 | 1169.75 |
| 2012-03-16 05:00:00 | 1102.5 |
| 2012-03-16 06:00:00 | 1081.75 |
| 2012-03-16 07:00:00 | 1054 |
| 2012-03-16 08:00:00 | 1090.25 |
| 2012-03-16 09:00:00 | 1096.75 |
| 2012-03-16 10:00:00 | 1127 |
| 2012-03-16 11:00:00 | 1132.5 |
| 2012-03-16 12:00:00 | 1134.5 |
| 2012-03-16 13:00:00 | 1132.5 |
| 2012-03-16 14:00:00 | 1125.5 |
| 2012-03-16 15:00:00 | 1150.75 |
| 2012-03-16 16:00:00 | 1165 |
| 2012-03-16 17:00:00 | 1176.75 |
| 2012-03-16 18:00:00 | 1163.75 |
| 2012-03-16 19:00:00 | 1204.5 |
| 2012-03-16 20:00:00 | 1151.75 |
| 2012-03-16 21:00:00 | 1170 |
| 2012-03-16 22:00:00 | 1160.75 |
| 2012-03-16 23:00:00 | 1121.5 |
| 2012-03-17 | 1140 |
| 2012-03-17 01:00:00 | 1092 |
| 2012-03-17 02:00:00 | 1095.75 |
| 2012-03-17 03:00:00 | 1073.25 |
| 2012-03-17 04:00:00 | 1085 |
| 2012-03-17 05:00:00 | 1089.25 |
| 2012-03-17 06:00:00 | 1078.75 |
| 2012-03-17 07:00:00 | 1044.75 |
| 2012-03-17 08:00:00 | 1065.25 |
| 2012-03-17 09:00:00 | 1045 |
| 2012-03-17 10:00:00 | 1073.75 |
| 2012-03-17 11:00:00 | 1087.75 |
| 2012-03-17 12:00:00 | 1107.25 |
| 2012-03-17 13:00:00 | 1105.25 |
| 2012-03-17 14:00:00 | 1172.75 |
| 2012-03-17 15:00:00 | 1190.75 |
| 2012-03-17 16:00:00 | 1188.75 |
| 2012-03-17 17:00:00 | 1195 |
| 2012-03-17 18:00:00 | 1221.75 |
| 2012-03-17 19:00:00 | 1216.5 |
| 2012-03-17 20:00:00 | 1162.25 |
| 2012-03-17 21:00:00 | 1250.5 |
| 2012-03-17 22:00:00 | 1166 |
| 2012-03-17 23:00:00 | 1256.5 |
| 2012-03-18 | 1199.75 |
| 2012-03-18 01:00:00 | 1151.25 |
| 2012-03-18 02:00:00 | 1232.75 |
| 2012-03-18 03:00:00 | 1122.75 |
| 2012-03-18 04:00:00 | 1128 |
| 2012-03-18 05:00:00 | 1065.5 |
| 2012-03-18 06:00:00 | 1069.5 |
| 2012-03-18 07:00:00 | 1047 |
| 2012-03-18 08:00:00 | 1039.25 |
| 2012-03-18 09:00:00 | 1039 |
| 2012-03-18 10:00:00 | 1053.5 |
| 2012-03-18 11:00:00 | 1078.25 |
| 2012-03-18 12:00:00 | 1095 |
| 2012-03-18 13:00:00 | 1103.75 |
| 2012-03-18 14:00:00 | 1196.5 |
| 2012-03-18 15:00:00 | 1132.25 |
| 2012-03-18 16:00:00 | 1213.25 |
| 2012-03-18 17:00:00 | 1194.25 |
| 2012-03-18 18:00:00 | 1218.25 |
| 2012-03-18 19:00:00 | 1243.75 |
| 2012-03-18 20:00:00 | 1223.25 |
| 2012-03-18 21:00:00 | 1219.5 |
| 2012-03-18 22:00:00 | 1238.25 |
| 2012-03-18 23:00:00 | 1334 |
| 2012-03-19 | 1327 |
| 2012-03-19 01:00:00 | 1271.5 |
| 2012-03-19 02:00:00 | 1352.5 |
| 2012-03-19 03:00:00 | 1173.25 |
| 2012-03-19 04:00:00 | 1183 |
| 2012-03-19 05:00:00 | 1174.25 |
| 2012-03-19 06:00:00 | 1164.5 |
| 2012-03-19 07:00:00 | 1117.75 |
| 2012-03-19 08:00:00 | 1145 |
| 2012-03-19 09:00:00 | 1162.25 |
| 2012-03-19 10:00:00 | 1269 |
| 2012-03-19 11:00:00 | 1437.75 |
| 2012-03-19 12:00:00 | 1453.75 |
| 2012-03-19 13:00:00 | 1497 |
| 2012-03-19 14:00:00 | 1467.25 |
| 2012-03-19 15:00:00 | 1366 |
| 2012-03-19 16:00:00 | 1334.25 |
| 2012-03-19 17:00:00 | 1302.5 |
| 2012-03-19 18:00:00 | 1254 |
| 2012-03-19 19:00:00 | 1314.75 |
| 2012-03-19 20:00:00 | 1310.25 |
| 2012-03-19 21:00:00 | 1296 |
| 2012-03-19 22:00:00 | 1355.25 |
| 2012-03-19 23:00:00 | 1352.5 |
| 2012-03-20 | 1364.25 |
| 2012-03-20 01:00:00 | 1342.75 |
| 2012-03-20 02:00:00 | 1287.25 |
| 2012-03-20 03:00:00 | 1215.25 |
| 2012-03-20 04:00:00 | 1158.5 |
| 2012-03-20 05:00:00 | 1131.25 |
| 2012-03-20 06:00:00 | 1163 |
| 2012-03-20 07:00:00 | 1216.5 |
| 2012-03-20 08:00:00 | 1166.5 |
| 2012-03-20 09:00:00 | 1175 |
| 2012-03-20 10:00:00 | 1213.75 |
| 2012-03-20 11:00:00 | 1230.25 |
| 2012-03-20 12:00:00 | 1278.75 |
| 2012-03-20 13:00:00 | 1281.25 |
| 2012-03-20 14:00:00 | 1342 |
| 2012-03-20 15:00:00 | 1332 |
| 2012-03-20 16:00:00 | 1309.5 |
| 2012-03-20 17:00:00 | 1262.25 |
| 2012-03-20 18:00:00 | 1306.25 |
| 2012-03-20 19:00:00 | 1260 |
| 2012-03-20 20:00:00 | 1251.5 |
| 2012-03-20 21:00:00 | 1417 |
| 2012-03-20 22:00:00 | 1412.5 |
| 2012-03-20 23:00:00 | 1489.25 |
| 2012-03-21 | 1480.25 |
| 2012-03-21 01:00:00 | 1400.75 |
| 2012-03-21 02:00:00 | 1342.75 |
| 2012-03-21 03:00:00 | 1227.25 |
| 2012-03-21 04:00:00 | 1247.5 |
| 2012-03-21 05:00:00 | 1067.5 |
| 2012-03-21 06:00:00 | 1125.25 |
| 2012-03-21 07:00:00 | 1142.75 |
| 2012-03-21 08:00:00 | 1109.25 |
| 2012-03-21 09:00:00 | 1111.75 |
| 2012-03-21 10:00:00 | 1117.75 |
| 2012-03-21 11:00:00 | 1158.5 |
| 2012-03-21 12:00:00 | 1174.75 |
| 2012-03-21 13:00:00 | 1160.25 |
| 2012-03-21 14:00:00 | 1249.5 |
| 2012-03-21 15:00:00 | 1338.25 |
| 2012-03-21 16:00:00 | 1287.75 |
| 2012-03-21 17:00:00 | 1260 |
| 2012-03-21 18:00:00 | 1268.5 |
| 2012-03-21 19:00:00 | 1237.75 |
| 2012-03-21 20:00:00 | 1290.25 |
| 2012-03-21 21:00:00 | 1233 |
| 2012-03-21 22:00:00 | 1345.75 |
| 2012-03-21 23:00:00 | 1329 |
| 2012-03-22 | 1367 |
| 2012-03-22 01:00:00 | 1273.75 |
| 2012-03-22 02:00:00 | 1284.5 |
| 2012-03-22 03:00:00 | 1190.5 |
| 2012-03-22 04:00:00 | 1177.25 |
| 2012-03-22 05:00:00 | 1095.25 |
| 2012-03-22 06:00:00 | 1142.25 |
| 2012-03-22 07:00:00 | 1087.75 |
| 2012-03-22 08:00:00 | 1135 |
| 2012-03-22 09:00:00 | 1125 |
| 2012-03-22 10:00:00 | 1116.75 |
| 2012-03-22 11:00:00 | 1157.25 |
| 2012-03-22 12:00:00 | 1189.5 |
| 2012-03-22 13:00:00 | 1246.25 |
| 2012-03-22 14:00:00 | 1308.75 |
| 2012-03-22 15:00:00 | 1316 |
| 2012-03-22 16:00:00 | 1325.5 |
| 2012-03-22 17:00:00 | 1321.75 |
| 2012-03-22 18:00:00 | 1306.25 |
| 2012-03-22 19:00:00 | 1298 |
| 2012-03-22 20:00:00 | 1408.5 |
| 2012-03-22 21:00:00 | 1241.5 |
| 2012-03-22 22:00:00 | 1381.25 |
| 2012-03-22 23:00:00 | 1311.5 |
| 2012-03-23 | 1377.75 |
| 2012-03-23 01:00:00 | 1402.5 |
| 2012-03-23 02:00:00 | 1279.5 |
| 2012-03-23 03:00:00 | 1209.75 |
| 2012-03-23 04:00:00 | 1114 |
| 2012-03-23 05:00:00 | 1106 |
| 2012-03-23 06:00:00 | 1110.75 |
| 2012-03-23 07:00:00 | 1095.75 |
| 2012-03-23 08:00:00 | 1144 |
| 2012-03-23 09:00:00 | 1137.5 |
| 2012-03-23 10:00:00 | 1142.5 |
| 2012-03-23 11:00:00 | 1156.5 |
| 2012-03-23 12:00:00 | 1154.5 |
| 2012-03-23 13:00:00 | 1207.75 |
| 2012-03-23 14:00:00 | 1242.25 |
| 2012-03-23 15:00:00 | 1199.75 |
| 2012-03-23 16:00:00 | 1313.5 |
| 2012-03-23 17:00:00 | 1185.75 |
| 2012-03-23 18:00:00 | 1309.5 |
| 2012-03-23 19:00:00 | 1186.5 |
| 2012-03-23 20:00:00 | 1260 |
| 2012-03-23 21:00:00 | 1249.75 |
| 2012-03-23 22:00:00 | 1265 |
| 2012-03-23 23:00:00 | 1185.75 |
| 2012-03-24 | 1270 |
| 2012-03-24 01:00:00 | 1266 |
| 2012-03-24 02:00:00 | 1174.5 |
| 2012-03-24 03:00:00 | 1271.75 |
| 2012-03-24 04:00:00 | 1224.75 |
| 2012-03-24 05:00:00 | 1165.25 |
| 2012-03-24 06:00:00 | 1099.75 |
| 2012-03-24 07:00:00 | 989.5 |
| 2012-03-24 08:00:00 | 1025.5 |
| 2012-03-24 09:00:00 | 1012.75 |
| 2012-03-24 10:00:00 | 1034 |
| 2012-03-24 11:00:00 | 1042.75 |
| 2012-03-24 12:00:00 | 1070.5 |
| 2012-03-24 13:00:00 | 1160 |
| 2012-03-24 14:00:00 | 1202.75 |
| 2012-03-24 15:00:00 | 1234 |
| 2012-03-24 16:00:00 | 1255.75 |
| 2012-03-24 17:00:00 | 1193.5 |
| 2012-03-24 18:00:00 | 1204 |
| 2012-03-24 19:00:00 | 1226 |
| 2012-03-24 20:00:00 | 1139.75 |
| 2012-03-24 21:00:00 | 1170.75 |
| 2012-03-24 22:00:00 | 1153.25 |
| 2012-03-24 23:00:00 | 1148.5 |
| 2012-03-25 | 1120 |
| 2012-03-25 01:00:00 | 1149.5 |
| 2012-03-25 03:00:00 | 1071.5 |
| 2012-03-25 04:00:00 | 1047 |
| 2012-03-25 05:00:00 | 1042 |
| 2012-03-25 06:00:00 | 1049 |
| 2012-03-25 07:00:00 | 1033.25 |
| 2012-03-25 08:00:00 | 1027.5 |
| 2012-03-25 09:00:00 | 1004.5 |
| 2012-03-25 10:00:00 | 1022 |
| 2012-03-25 11:00:00 | 1019.25 |
| 2012-03-25 12:00:00 | 1052.25 |
| 2012-03-25 13:00:00 | 1061.25 |
| 2012-03-25 14:00:00 | 1070 |
| 2012-03-25 15:00:00 | 1064 |
| 2012-03-25 16:00:00 | 1165 |
| 2012-03-25 17:00:00 | 1197 |
| 2012-03-25 18:00:00 | 1159 |
| 2012-03-25 19:00:00 | 1215 |
| 2012-03-25 20:00:00 | 1179.75 |
| 2012-03-25 21:00:00 | 1194.25 |
| 2012-03-25 22:00:00 | 1286.25 |
| 2012-03-25 23:00:00 | 1266 |
| 2012-03-26 | 1359.5 |
| 2012-03-26 01:00:00 | 1249.5 |
| 2012-03-26 02:00:00 | 1159.5 |
| 2012-03-26 03:00:00 | 1261.5 |
| 2012-03-26 04:00:00 | 1104 |
| 2012-03-26 05:00:00 | 1154.25 |
| 2012-03-26 06:00:00 | 1070 |
| 2012-03-26 07:00:00 | 1183.25 |
| 2012-03-26 08:00:00 | 1144.75 |
| 2012-03-26 09:00:00 | 1144.25 |
| 2012-03-26 10:00:00 | 1146.25 |
| 2012-03-26 11:00:00 | 1113.25 |
| 2012-03-26 12:00:00 | 1216.25 |
| 2012-03-26 13:00:00 | 1117.5 |
| 2012-03-26 14:00:00 | 1114.75 |
| 2012-03-26 15:00:00 | 1354 |
| 2012-03-26 16:00:00 | 1342.5 |
| 2012-03-26 17:00:00 | 1299 |
| 2012-03-26 18:00:00 | 1234.5 |
| 2012-03-26 19:00:00 | 1194 |
| 2012-03-26 20:00:00 | 1186.75 |
| 2012-03-26 21:00:00 | 1223.25 |
| 2012-03-26 22:00:00 | 1231.75 |
| 2012-03-26 23:00:00 | 1237.75 |
| 2012-03-27 | 1221 |
| 2012-03-27 01:00:00 | 1202.25 |
| 2012-03-27 02:00:00 | 1220.75 |
| 2012-03-27 03:00:00 | 1123.75 |
| 2012-03-27 04:00:00 | 1123.25 |
| 2012-03-27 05:00:00 | 1158.75 |
| 2012-03-27 06:00:00 | 1094 |
| 2012-03-27 07:00:00 | 1141.75 |
| 2012-03-27 08:00:00 | 1148.75 |
| 2012-03-27 09:00:00 | 1157.5 |
| 2012-03-27 10:00:00 | 1163.5 |
| 2012-03-27 11:00:00 | 1178 |
| 2012-03-27 12:00:00 | 1362.25 |
| 2012-03-27 13:00:00 | 1445.5 |
| 2012-03-27 14:00:00 | 1468 |
| 2012-03-27 15:00:00 | 1404.25 |
| 2012-03-27 16:00:00 | 1410 |
| 2012-03-27 17:00:00 | 1310 |
| 2012-03-27 18:00:00 | 1302 |
| 2012-03-27 19:00:00 | 1252 |
| 2012-03-27 20:00:00 | 1253.75 |
| 2012-03-27 21:00:00 | 1279.25 |
| 2012-03-27 22:00:00 | 1333.5 |
| 2012-03-27 23:00:00 | 1340.25 |
| 2012-03-28 | 1340.75 |
| 2012-03-28 01:00:00 | 1352 |
| 2012-03-28 02:00:00 | 1246.25 |
| 2012-03-28 03:00:00 | 1220.75 |
| 2012-03-28 04:00:00 | 1121.25 |
| 2012-03-28 05:00:00 | 1112 |
| 2012-03-28 06:00:00 | 1123.75 |
| 2012-03-28 07:00:00 | 1133.75 |
| 2012-03-28 08:00:00 | 1137.25 |
| 2012-03-28 09:00:00 | 1145.75 |
| 2012-03-28 10:00:00 | 1163.25 |
| 2012-03-28 11:00:00 | 1175.5 |
| 2012-03-28 12:00:00 | 1228.25 |
| 2012-03-28 13:00:00 | 1255.25 |
| 2012-03-28 14:00:00 | 1262.5 |
| 2012-03-28 15:00:00 | 1293.25 |
| 2012-03-28 16:00:00 | 1312.75 |
| 2012-03-28 17:00:00 | 1295.5 |
| 2012-03-28 18:00:00 | 1286.25 |
| 2012-03-28 19:00:00 | 1288 |
| 2012-03-28 20:00:00 | 1311 |
| 2012-03-28 21:00:00 | 1316.75 |
| 2012-03-28 22:00:00 | 1302 |
| 2012-03-28 23:00:00 | 1340.5 |
| 2012-03-29 | 1406.5 |
| 2012-03-29 01:00:00 | 1337.75 |
| 2012-03-29 02:00:00 | 1321.75 |
| 2012-03-29 03:00:00 | 1222.5 |
| 2012-03-29 04:00:00 | 1175 |
| 2012-03-29 05:00:00 | 1141.5 |
| 2012-03-29 06:00:00 | 1120 |
| 2012-03-29 07:00:00 | 1106 |
| 2012-03-29 08:00:00 | 1131.5 |
| 2012-03-29 09:00:00 | 1102.5 |
| 2012-03-29 10:00:00 | 1110.75 |
| 2012-03-29 11:00:00 | 1108 |
| 2012-03-29 12:00:00 | 1242.5 |
| 2012-03-29 13:00:00 | 1290.75 |
| 2012-03-29 14:00:00 | 1299 |
| 2012-03-29 15:00:00 | 1332.5 |
| 2012-03-29 16:00:00 | 1361 |
| 2012-03-29 17:00:00 | 1327 |
| 2012-03-29 18:00:00 | 1391.75 |
| 2012-03-29 19:00:00 | 1506.75 |
| 2012-03-29 20:00:00 | 1812.75 |
| 2012-03-29 21:00:00 | 1913.75 |
| 2012-03-29 22:00:00 | 1883.5 |
| 2012-03-29 23:00:00 | 1816.75 |
| 2012-03-30 | 1814 |
| 2012-03-30 01:00:00 | 1770.5 |
| 2012-03-30 02:00:00 | 1579.25 |
| 2012-03-30 03:00:00 | 1642 |
| 2012-03-30 04:00:00 | 1748 |
| 2012-03-30 05:00:00 | 1769.75 |
| 2012-03-30 06:00:00 | 1804.5 |
| 2012-03-30 07:00:00 | 1651.25 |
| 2012-03-30 08:00:00 | 1549.5 |
| 2012-03-30 09:00:00 | 1551.5 |
| 2012-03-30 10:00:00 | 1543.25 |
| 2012-03-30 11:00:00 | 1513.75 |
| 2012-03-30 12:00:00 | 1549 |
| 2012-03-30 13:00:00 | 1466.25 |
| 2012-03-30 14:00:00 | 1386.5 |
| 2012-03-30 15:00:00 | 1379.75 |
| 2012-03-30 16:00:00 | 1426.75 |
| 2012-03-30 17:00:00 | 1403.75 |
| 2012-03-30 18:00:00 | 1495.25 |
| 2012-03-30 19:00:00 | 1365.25 |
| 2012-03-30 20:00:00 | 1337.75 |
| 2012-03-30 21:00:00 | 1325.75 |
| 2012-03-30 22:00:00 | 1316.75 |
| 2012-03-30 23:00:00 | 1448 |
| 2012-03-31 | 1395.25 |
| 2012-03-31 01:00:00 | 1341 |
| 2012-03-31 02:00:00 | 1287.75 |
| 2012-03-31 03:00:00 | 1133.25 |
| 2012-03-31 04:00:00 | 1064.75 |
| 2012-03-31 05:00:00 | 1061 |
| 2012-03-31 06:00:00 | 1073.5 |
| 2012-03-31 07:00:00 | 1046.5 |
| 2012-03-31 08:00:00 | 1026.25 |
| 2012-03-31 09:00:00 | 1015.75 |
| 2012-03-31 10:00:00 | 1043.75 |
| 2012-03-31 11:00:00 | 1057.5 |
| 2012-03-31 12:00:00 | 1083.75 |
| 2012-03-31 13:00:00 | 1106.5 |
| 2012-03-31 14:00:00 | 1100.75 |
| 2012-03-31 15:00:00 | 1112 |
| 2012-03-31 16:00:00 | 1186.75 |
| 2012-03-31 17:00:00 | 1291.75 |
| 2012-03-31 18:00:00 | 1516 |
| 2012-03-31 19:00:00 | 1687 |
| 2012-03-31 20:00:00 | 1749.75 |
| 2012-03-31 21:00:00 | 1762.25 |
| 2012-03-31 22:00:00 | 1621.75 |
| 2012-03-31 23:00:00 | 1379.5 |
| 2012-04-01 | 1202.5 |
| 2012-04-01 01:00:00 | 1136.25 |
| 2012-04-01 02:00:00 | 1120.75 |
| 2012-04-01 03:00:00 | 1175.25 |
| 2012-04-01 04:00:00 | 1067.75 |
| 2012-04-01 05:00:00 | 1063 |
| 2012-04-01 06:00:00 | 1091.75 |
| 2012-04-01 07:00:00 | 1069.5 |
| 2012-04-01 08:00:00 | 1043.75 |
| 2012-04-01 09:00:00 | 1044.5 |
| 2012-04-01 10:00:00 | 1072.25 |
| 2012-04-01 11:00:00 | 1085.5 |
| 2012-04-01 12:00:00 | 1128.25 |
| 2012-04-01 13:00:00 | 1133.25 |
| 2012-04-01 14:00:00 | 1128 |
| 2012-04-01 15:00:00 | 1119.25 |
| 2012-04-01 16:00:00 | 1137.75 |
| 2012-04-01 17:00:00 | 1098 |
| 2012-04-01 18:00:00 | 1131 |
| 2012-04-01 19:00:00 | 1175 |
| 2012-04-01 20:00:00 | 1257.5 |
| 2012-04-01 21:00:00 | 1260.25 |
| 2012-04-01 22:00:00 | 1250.75 |
| 2012-04-01 23:00:00 | 1346.75 |
| 2012-04-02 | 1327.75 |
| 2012-04-02 01:00:00 | 1211 |
| 2012-04-02 02:00:00 | 1392.25 |
| 2012-04-02 03:00:00 | 1218.25 |
| 2012-04-02 04:00:00 | 1138.25 |
| 2012-04-02 05:00:00 | 1144.5 |
| 2012-04-02 06:00:00 | 1136.75 |
| 2012-04-02 07:00:00 | 1195.25 |
| 2012-04-02 08:00:00 | 1192.5 |
| 2012-04-02 09:00:00 | 1175.25 |
| 2012-04-02 10:00:00 | 1231.5 |
| 2012-04-02 11:00:00 | 1259.75 |
| 2012-04-02 12:00:00 | 1257 |
| 2012-04-02 13:00:00 | 1317.75 |
| 2012-04-02 14:00:00 | 1383.5 |
| 2012-04-02 15:00:00 | 1396.5 |
| 2012-04-02 16:00:00 | 1409.75 |
| 2012-04-02 17:00:00 | 1450.25 |
| 2012-04-02 18:00:00 | 1450.25 |
| 2012-04-02 19:00:00 | 1418 |
| 2012-04-02 20:00:00 | 1452.75 |
| 2012-04-02 21:00:00 | 1392.25 |
| 2012-04-02 22:00:00 | 1429.75 |
| 2012-04-02 23:00:00 | 1348 |
| 2012-04-03 | 1424.75 |
| 2012-04-03 01:00:00 | 1338 |
| 2012-04-03 02:00:00 | 1312.75 |
| 2012-04-03 03:00:00 | 1220 |
| 2012-04-03 04:00:00 | 1123.75 |
| 2012-04-03 05:00:00 | 1114.75 |
| 2012-04-03 06:00:00 | 1132.5 |
| 2012-04-03 07:00:00 | 1131.75 |
| 2012-04-03 08:00:00 | 1180.5 |
| 2012-04-03 09:00:00 | 1192.25 |
| 2012-04-03 10:00:00 | 1200 |
| 2012-04-03 11:00:00 | 1217 |
| 2012-04-03 12:00:00 | 1209.5 |
| 2012-04-03 13:00:00 | 1292.25 |
| 2012-04-03 14:00:00 | 1427 |
| 2012-04-03 15:00:00 | 1447 |
| 2012-04-03 16:00:00 | 1443.75 |
| 2012-04-03 17:00:00 | 1390.5 |
| 2012-04-03 18:00:00 | 1350.25 |
| 2012-04-03 19:00:00 | 1289.5 |
| 2012-04-03 20:00:00 | 1322.5 |
| 2012-04-03 21:00:00 | 1293 |
| 2012-04-03 22:00:00 | 1529 |
| 2012-04-03 23:00:00 | 1515.75 |
| 2012-04-04 | 1317.25 |
| 2012-04-04 01:00:00 | 1394.5 |
| 2012-04-04 02:00:00 | 1331.75 |
| 2012-04-04 03:00:00 | 1280.5 |
| 2012-04-04 04:00:00 | 1240 |
| 2012-04-04 05:00:00 | 1167.75 |
| 2012-04-04 06:00:00 | 1240.5 |
| 2012-04-04 07:00:00 | 1135.25 |
| 2012-04-04 08:00:00 | 1169.75 |
| 2012-04-04 09:00:00 | 1167 |
| 2012-04-04 10:00:00 | 1183.25 |
| 2012-04-04 11:00:00 | 1185.25 |
| 2012-04-04 12:00:00 | 1183.75 |
| 2012-04-04 13:00:00 | 1277 |
| 2012-04-04 14:00:00 | 1351 |
| 2012-04-04 15:00:00 | 1356.5 |
| 2012-04-04 16:00:00 | 1448.5 |
| 2012-04-04 17:00:00 | 1402.25 |
| 2012-04-04 18:00:00 | 1327.75 |
| 2012-04-04 19:00:00 | 1269.25 |
| 2012-04-04 20:00:00 | 1383.5 |
| 2012-04-04 21:00:00 | 1459.5 |
| 2012-04-04 22:00:00 | 1351 |
| 2012-04-04 23:00:00 | 1409 |
| 2012-04-05 | 1507.75 |
| 2012-04-05 01:00:00 | 1646.5 |
| 2012-04-05 02:00:00 | 1353.25 |
| 2012-04-05 03:00:00 | 1306.25 |
| 2012-04-05 04:00:00 | 1124.5 |
| 2012-04-05 05:00:00 | 1139.25 |
| 2012-04-05 06:00:00 | 1151.75 |
| 2012-04-05 07:00:00 | 1137 |
| 2012-04-05 08:00:00 | 1221.75 |
| 2012-04-05 09:00:00 | 1152 |
| 2012-04-05 10:00:00 | 1218.25 |
| 2012-04-05 11:00:00 | 1373.25 |
| 2012-04-05 12:00:00 | 1435.25 |
| 2012-04-05 13:00:00 | 1465.5 |
| 2012-04-05 14:00:00 | 1539.5 |
| 2012-04-05 15:00:00 | 1506.25 |
| 2012-04-05 16:00:00 | 1524.75 |
| 2012-04-05 17:00:00 | 1387.5 |
| 2012-04-05 18:00:00 | 1361.25 |
| 2012-04-05 19:00:00 | 1335.75 |
| 2012-04-05 20:00:00 | 1333.5 |
| 2012-04-05 21:00:00 | 1352.5 |
| 2012-04-05 22:00:00 | 1334 |
| 2012-04-05 23:00:00 | 1347 |
| 2012-04-06 | 1344.25 |
| 2012-04-06 01:00:00 | 1356.25 |
| 2012-04-06 02:00:00 | 1307.5 |
| 2012-04-06 03:00:00 | 1402 |
| 2012-04-06 04:00:00 | 1393 |
| 2012-04-06 05:00:00 | 1311 |
| 2012-04-06 06:00:00 | 1297.75 |
| 2012-04-06 07:00:00 | 1201.5 |
| 2012-04-06 08:00:00 | 1199.75 |
| 2012-04-06 09:00:00 | 1204.5 |
| 2012-04-06 10:00:00 | 1230.25 |
| 2012-04-06 11:00:00 | 1261.5 |
| 2012-04-06 12:00:00 | 1268 |
| 2012-04-06 13:00:00 | 1247.75 |
| 2012-04-06 14:00:00 | 1272.75 |
| 2012-04-06 15:00:00 | 1262 |
| 2012-04-06 16:00:00 | 1269 |
| 2012-04-06 17:00:00 | 1253.25 |
| 2012-04-06 18:00:00 | 1212 |
| 2012-04-06 19:00:00 | 1293 |
| 2012-04-06 20:00:00 | 1321.5 |
| 2012-04-06 21:00:00 | 1301.75 |
| 2012-04-06 22:00:00 | 1221.75 |
| 2012-04-06 23:00:00 | 1200.75 |
| 2012-04-07 | 1189 |
| 2012-04-07 01:00:00 | 1155 |
| 2012-04-07 02:00:00 | 1119 |
| 2012-04-07 03:00:00 | 1085.5 |
| 2012-04-07 04:00:00 | 1118.5 |
| 2012-04-07 05:00:00 | 1124.75 |
| 2012-04-07 06:00:00 | 1047 |
| 2012-04-07 07:00:00 | 1066 |
| 2012-04-07 08:00:00 | 1060 |
| 2012-04-07 09:00:00 | 1049.5 |
| 2012-04-07 10:00:00 | 1072.5 |
| 2012-04-07 11:00:00 | 1082.25 |
| 2012-04-07 12:00:00 | 1104 |
| 2012-04-07 13:00:00 | 1106 |
| 2012-04-07 14:00:00 | 1167.75 |
| 2012-04-07 15:00:00 | 1338.25 |
| 2012-04-07 16:00:00 | 1314 |
| 2012-04-07 17:00:00 | 1379.75 |
| 2012-04-07 18:00:00 | 1333.25 |
| 2012-04-07 19:00:00 | 1211.75 |
| 2012-04-07 20:00:00 | 1343 |
| 2012-04-07 21:00:00 | 1462.25 |
| 2012-04-07 22:00:00 | 1338 |
| 2012-04-07 23:00:00 | 1325.5 |
| 2012-04-08 | 1387.25 |
| 2012-04-08 01:00:00 | 1329 |
| 2012-04-08 02:00:00 | 1127.75 |
| 2012-04-08 03:00:00 | 1077.25 |
| 2012-04-08 04:00:00 | 1074.25 |
| 2012-04-08 05:00:00 | 1066 |
| 2012-04-08 06:00:00 | 1079 |
| 2012-04-08 07:00:00 | 1070.5 |
| 2012-04-08 08:00:00 | 1054.75 |
| 2012-04-08 09:00:00 | 1048.25 |
| 2012-04-08 10:00:00 | 1066.25 |
| 2012-04-08 11:00:00 | 1083.75 |
| 2012-04-08 12:00:00 | 1100.5 |
| 2012-04-08 13:00:00 | 1110.75 |
| 2012-04-08 14:00:00 | 1104.75 |
| 2012-04-08 15:00:00 | 1087.5 |
| 2012-04-08 16:00:00 | 1082.25 |
| 2012-04-08 17:00:00 | 1086.75 |
| 2012-04-08 18:00:00 | 1223.25 |
| 2012-04-08 19:00:00 | 1084.75 |
| 2012-04-08 20:00:00 | 1095.25 |
| 2012-04-08 21:00:00 | 1113.75 |
| 2012-04-08 22:00:00 | 1127.25 |
| 2012-04-08 23:00:00 | 1124 |
| 2012-04-09 | 1115 |
| 2012-04-09 01:00:00 | 1107.25 |
| 2012-04-09 02:00:00 | 1101.75 |
| 2012-04-09 03:00:00 | 1106.5 |
| 2012-04-09 04:00:00 | 1055.75 |
| 2012-04-09 05:00:00 | 1070.75 |
| 2012-04-09 06:00:00 | 1082.75 |
| 2012-04-09 07:00:00 | 1064.25 |
| 2012-04-09 08:00:00 | 1052.5 |
| 2012-04-09 09:00:00 | 1054 |
| 2012-04-09 10:00:00 | 1061.25 |
| 2012-04-09 11:00:00 | 1088.5 |
| 2012-04-09 12:00:00 | 1101.5 |
| 2012-04-09 13:00:00 | 1101.25 |
| 2012-04-09 14:00:00 | 1105.5 |
| 2012-04-09 15:00:00 | 1087.25 |
| 2012-04-09 16:00:00 | 1146 |
| 2012-04-09 17:00:00 | 1102 |
| 2012-04-09 18:00:00 | 1158.75 |
| 2012-04-09 19:00:00 | 1093.5 |
| 2012-04-09 20:00:00 | 1178.5 |
| 2012-04-09 21:00:00 | 1204.75 |
| 2012-04-09 22:00:00 | 1143 |
| 2012-04-09 23:00:00 | 1194 |
| 2012-04-10 | 1214.75 |
| 2012-04-10 01:00:00 | 1199.75 |
| 2012-04-10 02:00:00 | 1241 |
| 2012-04-10 03:00:00 | 1163.25 |
| 2012-04-10 04:00:00 | 1199 |
| 2012-04-10 05:00:00 | 1152 |
| 2012-04-10 06:00:00 | 1172 |
| 2012-04-10 07:00:00 | 1142.5 |
| 2012-04-10 08:00:00 | 1178.5 |
| 2012-04-10 09:00:00 | 1119.25 |
| 2012-04-10 10:00:00 | 1215.25 |
| 2012-04-10 11:00:00 | 1293 |
| 2012-04-10 12:00:00 | 1343 |
| 2012-04-10 13:00:00 | 1320.5 |
| 2012-04-10 14:00:00 | 1193.75 |
| 2012-04-10 15:00:00 | 1328 |
| 2012-04-10 16:00:00 | 1299.25 |
| 2012-04-10 17:00:00 | 1318.25 |
| 2012-04-10 18:00:00 | 1366.25 |
| 2012-04-10 19:00:00 | 1293.75 |
| 2012-04-10 20:00:00 | 1299.5 |
| 2012-04-10 21:00:00 | 1329.5 |
| 2012-04-10 22:00:00 | 1306.75 |
| 2012-04-10 23:00:00 | 1318.25 |
| 2012-04-11 | 1374 |
| 2012-04-11 01:00:00 | 1315.25 |
| 2012-04-11 02:00:00 | 1258 |
| 2012-04-11 03:00:00 | 1332.25 |
| 2012-04-11 04:00:00 | 1047 |
| 2012-04-11 05:00:00 | 1106.75 |
| 2012-04-11 06:00:00 | 1124.5 |
| 2012-04-11 07:00:00 | 1113 |
| 2012-04-11 08:00:00 | 1141.25 |
| 2012-04-11 09:00:00 | 1139 |
| 2012-04-11 10:00:00 | 1132.75 |
| 2012-04-11 11:00:00 | 1168 |
| 2012-04-11 12:00:00 | 1183.25 |
| 2012-04-11 13:00:00 | 1195.25 |
| 2012-04-11 14:00:00 | 1314 |
| 2012-04-11 15:00:00 | 1317.5 |
| 2012-04-11 16:00:00 | 1359.25 |
| 2012-04-11 17:00:00 | 1377 |
| 2012-04-11 18:00:00 | 1304.25 |
| 2012-04-11 19:00:00 | 1241 |
| 2012-04-11 20:00:00 | 1190.75 |
| 2012-04-11 21:00:00 | 1213.75 |
| 2012-04-11 22:00:00 | 1259.75 |
| 2012-04-11 23:00:00 | 1269 |
| 2012-04-12 | 1267 |
| 2012-04-12 01:00:00 | 1244.25 |
| 2012-04-12 02:00:00 | 1222.25 |
| 2012-04-12 03:00:00 | 1227 |
| 2012-04-12 04:00:00 | 1120.25 |
| 2012-04-12 05:00:00 | 1063.75 |
| 2012-04-12 06:00:00 | 1065.75 |
| 2012-04-12 07:00:00 | 1094.5 |
| 2012-04-12 08:00:00 | 1109 |
| 2012-04-12 09:00:00 | 1078.5 |
| 2012-04-12 10:00:00 | 1079.75 |
| 2012-04-12 11:00:00 | 1089.75 |
| 2012-04-12 12:00:00 | 1078.5 |
| 2012-04-12 13:00:00 | 1061.5 |
| 2012-04-12 14:00:00 | 1073.5 |
| 2012-04-12 15:00:00 | 1367.5 |
| 2012-04-12 16:00:00 | 1557.25 |
| 2012-04-12 17:00:00 | 1438.75 |
| 2012-04-12 18:00:00 | 1490.5 |
| 2012-04-12 19:00:00 | 1463.5 |
| 2012-04-12 20:00:00 | 1481.5 |
| 2012-04-12 21:00:00 | 1545.75 |
| 2012-04-12 22:00:00 | 1700 |
| 2012-04-12 23:00:00 | 1873.5 |
| 2012-04-13 | 1916 |
| 2012-04-13 01:00:00 | 1918.75 |
| 2012-04-13 02:00:00 | 1858.25 |
| 2012-04-13 03:00:00 | 1542 |
| 2012-04-13 04:00:00 | 1367.25 |
| 2012-04-13 05:00:00 | 1119.25 |
| 2012-04-13 06:00:00 | 1136.25 |
| 2012-04-13 07:00:00 | 1109.5 |
| 2012-04-13 08:00:00 | 1151.5 |
| 2012-04-13 09:00:00 | 1175.5 |
| 2012-04-13 10:00:00 | 1183.5 |
| 2012-04-13 11:00:00 | 1189.5 |
| 2012-04-13 12:00:00 | 1276.75 |
| 2012-04-13 13:00:00 | 1224.5 |
| 2012-04-13 14:00:00 | 1280.75 |
| 2012-04-13 15:00:00 | 1271.5 |
| 2012-04-13 16:00:00 | 1348 |
| 2012-04-13 17:00:00 | 1423.75 |
| 2012-04-13 18:00:00 | 1425.75 |
| 2012-04-13 19:00:00 | 1436.5 |
| 2012-04-13 20:00:00 | 1416.5 |
| 2012-04-13 21:00:00 | 1460.25 |
| 2012-04-13 22:00:00 | 1414 |
| 2012-04-13 23:00:00 | 1355.5 |
| 2012-04-14 | 1462.5 |
| 2012-04-14 01:00:00 | 1497 |
| 2012-04-14 02:00:00 | 1315.75 |
| 2012-04-14 03:00:00 | 1221.5 |
| 2012-04-14 04:00:00 | 1110.5 |
| 2012-04-14 05:00:00 | 1121.5 |
| 2012-04-14 06:00:00 | 1173.75 |
| 2012-04-14 07:00:00 | 1099.75 |
| 2012-04-14 08:00:00 | 1090 |
| 2012-04-14 09:00:00 | 1103.5 |
| 2012-04-14 10:00:00 | 1113.75 |
| 2012-04-14 11:00:00 | 1131 |
| 2012-04-14 12:00:00 | 1149.5 |
| 2012-04-14 13:00:00 | 1227.25 |
| 2012-04-14 14:00:00 | 1213.5 |
| 2012-04-14 15:00:00 | 1218 |
| 2012-04-14 16:00:00 | 1267 |
| 2012-04-14 17:00:00 | 1271.75 |
| 2012-04-14 18:00:00 | 1193 |
| 2012-04-14 19:00:00 | 1318.25 |
| 2012-04-14 20:00:00 | 1302.5 |
| 2012-04-14 21:00:00 | 1274.25 |
| 2012-04-14 22:00:00 | 1315.75 |
| 2012-04-14 23:00:00 | 1306 |
| 2012-04-15 | 1329.25 |
| 2012-04-15 01:00:00 | 1325.25 |
| 2012-04-15 02:00:00 | 1424.5 |
| 2012-04-15 03:00:00 | 1261.5 |
| 2012-04-15 04:00:00 | 1227.25 |
| 2012-04-15 05:00:00 | 1217.5 |
| 2012-04-15 06:00:00 | 1140.75 |
| 2012-04-15 07:00:00 | 1082 |
| 2012-04-15 08:00:00 | 1051.5 |
| 2012-04-15 09:00:00 | 1184 |
| 2012-04-15 10:00:00 | 1169.5 |
| 2012-04-15 11:00:00 | 1239.25 |
| 2012-04-15 12:00:00 | 1220.75 |
| 2012-04-15 13:00:00 | 1196 |
| 2012-04-15 14:00:00 | 1285.5 |
| 2012-04-15 15:00:00 | 1372.75 |
| 2012-04-15 16:00:00 | 1656 |
| 2012-04-15 17:00:00 | 1907.75 |
| 2012-04-15 18:00:00 | 1853.25 |
| 2012-04-15 19:00:00 | 1939 |
| 2012-04-15 20:00:00 | 1961.75 |
| 2012-04-15 21:00:00 | 1966.25 |
| 2012-04-15 22:00:00 | 1753 |
| 2012-04-15 23:00:00 | 1807.5 |
| 2012-04-16 | 1768.25 |
| 2012-04-16 01:00:00 | 1637.75 |
| 2012-04-16 02:00:00 | 1476.75 |
| 2012-04-16 03:00:00 | 1243.75 |
| 2012-04-16 04:00:00 | 1242 |
| 2012-04-16 05:00:00 | 1228.25 |
| 2012-04-16 06:00:00 | 1226 |
| 2012-04-16 07:00:00 | 1210.75 |
| 2012-04-16 08:00:00 | 1302 |
| 2012-04-16 09:00:00 | 1358.5 |
| 2012-04-16 10:00:00 | 1338.25 |
| 2012-04-16 11:00:00 | 1328 |
| 2012-04-16 12:00:00 | 1379.75 |
| 2012-04-16 13:00:00 | 1463 |
| 2012-04-16 14:00:00 | 1585 |
| 2012-04-16 15:00:00 | 1521.75 |
| 2012-04-16 16:00:00 | 1441.75 |
| 2012-04-16 17:00:00 | 1484 |
| 2012-04-16 18:00:00 | 1467.5 |
| 2012-04-16 19:00:00 | 1356 |
| 2012-04-16 20:00:00 | 1294.5 |
| 2012-04-16 21:00:00 | 1236.5 |
| 2012-04-16 22:00:00 | 1255 |
| 2012-04-16 23:00:00 | 1258.5 |
| 2012-04-17 | 1264.25 |
| 2012-04-17 01:00:00 | 1236.5 |
| 2012-04-17 02:00:00 | 1220.25 |
| 2012-04-17 03:00:00 | 1194.75 |
| 2012-04-17 04:00:00 | 1225.75 |
| 2012-04-17 05:00:00 | 1196.25 |
| 2012-04-17 06:00:00 | 1157.5 |
| 2012-04-17 07:00:00 | 1131.5 |
| 2012-04-17 08:00:00 | 1110.25 |
| 2012-04-17 09:00:00 | 1104.5 |
| 2012-04-17 10:00:00 | 1100 |
| 2012-04-17 11:00:00 | 1171.5 |
| 2012-04-17 12:00:00 | 1327 |
| 2012-04-17 13:00:00 | 1189.5 |
| 2012-04-17 14:00:00 | 1195.25 |
| 2012-04-17 15:00:00 | 1189.75 |
| 2012-04-17 16:00:00 | 1238 |
| 2012-04-17 17:00:00 | 1310 |
| 2012-04-17 18:00:00 | 1249.25 |
| 2012-04-17 19:00:00 | 1240.25 |
| 2012-04-17 20:00:00 | 1246.5 |
| 2012-04-17 21:00:00 | 1255.75 |
| 2012-04-17 22:00:00 | 1263.5 |
| 2012-04-17 23:00:00 | 1276.5 |
| 2012-04-18 | 1267.75 |
| 2012-04-18 01:00:00 | 1251.25 |
| 2012-04-18 02:00:00 | 1231.5 |
| 2012-04-18 03:00:00 | 1162.25 |
| 2012-04-18 04:00:00 | 1090.75 |
| 2012-04-18 05:00:00 | 1092.75 |
| 2012-04-18 06:00:00 | 1100.5 |
| 2012-04-18 07:00:00 | 1080 |
| 2012-04-18 08:00:00 | 1121.5 |
| 2012-04-18 09:00:00 | 1114.25 |
| 2012-04-18 10:00:00 | 1151.5 |
| 2012-04-18 11:00:00 | 1154 |
| 2012-04-18 12:00:00 | 1130.25 |
| 2012-04-18 13:00:00 | 1100.75 |
| 2012-04-18 14:00:00 | 1235.75 |
| 2012-04-18 15:00:00 | 1227.25 |
| 2012-04-18 16:00:00 | 1220 |
| 2012-04-18 17:00:00 | 1214.25 |
| 2012-04-18 18:00:00 | 1203.5 |
| 2012-04-18 19:00:00 | 1200.75 |
| 2012-04-18 20:00:00 | 1205.25 |
| 2012-04-18 21:00:00 | 1235.25 |
| 2012-04-18 22:00:00 | 1265.5 |
| 2012-04-18 23:00:00 | 1276 |
| 2012-04-19 | 1286.5 |
| 2012-04-19 01:00:00 | 1251 |
| 2012-04-19 02:00:00 | 1229.25 |
| 2012-04-19 03:00:00 | 1248 |
| 2012-04-19 04:00:00 | 1137.5 |
| 2012-04-19 05:00:00 | 1101 |
| 2012-04-19 06:00:00 | 1109.75 |
| 2012-04-19 07:00:00 | 1094 |
| 2012-04-19 08:00:00 | 1115 |
| 2012-04-19 09:00:00 | 1153.75 |
| 2012-04-19 10:00:00 | 1185 |
| 2012-04-19 11:00:00 | 1238.75 |
| 2012-04-19 12:00:00 | 1248.5 |
| 2012-04-19 13:00:00 | 1213.5 |
| 2012-04-19 14:00:00 | 1277 |
| 2012-04-19 15:00:00 | 1310.75 |
| 2012-04-19 16:00:00 | 1245.5 |
| 2012-04-19 17:00:00 | 1295 |
| 2012-04-19 18:00:00 | 1284.5 |
| 2012-04-19 19:00:00 | 1255 |
| 2012-04-19 20:00:00 | 1333 |
| 2012-04-19 21:00:00 | 1347.25 |
| 2012-04-19 22:00:00 | 1374 |
| 2012-04-19 23:00:00 | 1425.75 |
| 2012-04-20 | 1416.75 |
| 2012-04-20 01:00:00 | 1397.25 |
| 2012-04-20 02:00:00 | 1322 |
| 2012-04-20 03:00:00 | 1284.75 |
| 2012-04-20 04:00:00 | 1172.5 |
| 2012-04-20 05:00:00 | 1144.75 |
| 2012-04-20 06:00:00 | 1114 |
| 2012-04-20 07:00:00 | 1140.5 |
| 2012-04-20 08:00:00 | 1098.75 |
| 2012-04-20 09:00:00 | 1022 |
| 2012-04-20 10:00:00 | 1132.25 |
| 2012-04-20 11:00:00 | 1058.5 |
| 2012-04-20 12:00:00 | 1125.25 |
| 2012-04-20 13:00:00 | 1162 |
| 2012-04-20 14:00:00 | 1188.25 |
| 2012-04-20 15:00:00 | 1257.75 |
| 2012-04-20 16:00:00 | 1359.75 |
| 2012-04-20 17:00:00 | 1304.25 |
| 2012-04-20 18:00:00 | 1262.25 |
| 2012-04-20 19:00:00 | 1252.75 |
| 2012-04-20 20:00:00 | 1213.25 |
| 2012-04-20 21:00:00 | 1197.75 |
| 2012-04-20 22:00:00 | 1220.5 |
| 2012-04-20 23:00:00 | 1210.5 |
| 2012-04-21 | 1211.5 |
| 2012-04-21 01:00:00 | 1192.25 |
| 2012-04-21 02:00:00 | 1143.75 |
| 2012-04-21 03:00:00 | 1136.25 |
| 2012-04-21 04:00:00 | 1196.75 |
| 2012-04-21 05:00:00 | 1114.25 |
| 2012-04-21 06:00:00 | 1058 |
| 2012-04-21 07:00:00 | 986.75 |
| 2012-04-21 08:00:00 | 985.75 |
| 2012-04-21 09:00:00 | 985 |
| 2012-04-21 10:00:00 | 1020 |
| 2012-04-21 11:00:00 | 1059 |
| 2012-04-21 12:00:00 | 1112.75 |
| 2012-04-21 13:00:00 | 1067.75 |
| 2012-04-21 14:00:00 | 1093.75 |
| 2012-04-21 15:00:00 | 1088.5 |
| 2012-04-21 16:00:00 | 1141 |
| 2012-04-21 17:00:00 | 984.25 |
| 2012-04-21 18:00:00 | 1104.5 |
| 2012-04-21 19:00:00 | 1226.5 |
| 2012-04-21 20:00:00 | 1092.75 |
| 2012-04-21 21:00:00 | 1184 |
| 2012-04-21 22:00:00 | 1194.5 |
| 2012-04-21 23:00:00 | 1148.75 |
| 2012-04-22 | 1143 |
| 2012-04-22 01:00:00 | 1100.75 |
| 2012-04-22 02:00:00 | 1067.75 |
| 2012-04-22 03:00:00 | 995.75 |
| 2012-04-22 04:00:00 | 993 |
| 2012-04-22 05:00:00 | 999.25 |
| 2012-04-22 06:00:00 | 1016.75 |
| 2012-04-22 07:00:00 | 974.25 |
| 2012-04-22 08:00:00 | 1012.25 |
| 2012-04-22 09:00:00 | 995.5 |
| 2012-04-22 10:00:00 | 1005.75 |
| 2012-04-22 11:00:00 | 1024.25 |
| 2012-04-22 12:00:00 | 1048.5 |
| 2012-04-22 13:00:00 | 1052.25 |
| 2012-04-22 14:00:00 | 1047.25 |
| 2012-04-22 15:00:00 | 1059 |
| 2012-04-22 16:00:00 | 1095.5 |
| 2012-04-22 17:00:00 | 1101 |
| 2012-04-22 18:00:00 | 1166.75 |
| 2012-04-22 19:00:00 | 1154.25 |
| 2012-04-22 20:00:00 | 1177.75 |
| 2012-04-22 21:00:00 | 1122.25 |
| 2012-04-22 22:00:00 | 1160.5 |
| 2012-04-22 23:00:00 | 1361 |
| 2012-04-23 | 1593 |
| 2012-04-23 01:00:00 | 1657 |
| 2012-04-23 02:00:00 | 1781 |
| 2012-04-23 03:00:00 | 1813.5 |
| 2012-04-23 04:00:00 | 1794.5 |
| 2012-04-23 05:00:00 | 1305.25 |
| 2012-04-23 06:00:00 | 1067.25 |
| 2012-04-23 07:00:00 | 997.75 |
| 2012-04-23 08:00:00 | 1039 |
| 2012-04-23 09:00:00 | 1048.5 |
| 2012-04-23 10:00:00 | 1059.25 |
| 2012-04-23 11:00:00 | 1105 |
| 2012-04-23 12:00:00 | 1151 |
| 2012-04-23 13:00:00 | 1133 |
| 2012-04-23 14:00:00 | 1141.5 |
| 2012-04-23 15:00:00 | 1133 |
| 2012-04-23 16:00:00 | 1220.25 |
| 2012-04-23 17:00:00 | 1213.25 |
| 2012-04-23 18:00:00 | 1274 |
| 2012-04-23 19:00:00 | 1284.25 |
| 2012-04-23 20:00:00 | 1200 |
| 2012-04-23 21:00:00 | 1263 |
| 2012-04-23 22:00:00 | 1293.5 |
| 2012-04-23 23:00:00 | 1341.5 |
| 2012-04-24 | 1349.75 |
| 2012-04-24 01:00:00 | 1313.5 |
| 2012-04-24 02:00:00 | 1254 |
| 2012-04-24 03:00:00 | 1287.75 |
| 2012-04-24 04:00:00 | 1109 |
| 2012-04-24 05:00:00 | 1110.5 |
| 2012-04-24 06:00:00 | 1141.75 |
| 2012-04-24 07:00:00 | 1188.25 |
| 2012-04-24 08:00:00 | 1193.25 |
| 2012-04-24 09:00:00 | 1164.25 |
| 2012-04-24 10:00:00 | 1303.75 |
| 2012-04-24 11:00:00 | 1304.5 |
| 2012-04-24 12:00:00 | 1305.25 |
| 2012-04-24 13:00:00 | 1295.25 |
| 2012-04-24 14:00:00 | 1323.25 |
| 2012-04-24 15:00:00 | 1353 |
| 2012-04-24 16:00:00 | 1244.25 |
| 2012-04-24 17:00:00 | 1320.5 |
| 2012-04-24 18:00:00 | 1292.25 |
| 2012-04-24 19:00:00 | 1278 |
| 2012-04-24 20:00:00 | 1302.75 |
| 2012-04-24 21:00:00 | 1335 |
| 2012-04-24 22:00:00 | 1352 |
| 2012-04-24 23:00:00 | 1369.75 |
| 2012-04-25 | 1367 |
| 2012-04-25 01:00:00 | 1337.5 |
| 2012-04-25 02:00:00 | 1275.25 |
| 2012-04-25 03:00:00 | 1275.5 |
| 2012-04-25 04:00:00 | 1190 |
| 2012-04-25 05:00:00 | 1139.75 |
| 2012-04-25 06:00:00 | 1127.75 |
| 2012-04-25 07:00:00 | 1120 |
| 2012-04-25 08:00:00 | 1160.25 |
| 2012-04-25 09:00:00 | 1172 |
| 2012-04-25 10:00:00 | 1175.25 |
| 2012-04-25 11:00:00 | 1179 |
| 2012-04-25 12:00:00 | 1196.25 |
| 2012-04-25 13:00:00 | 1204 |
| 2012-04-25 14:00:00 | 1347.75 |
| 2012-04-25 15:00:00 | 1254.75 |
| 2012-04-25 16:00:00 | 1305 |
| 2012-04-25 17:00:00 | 1311.5 |
| 2012-04-25 18:00:00 | 1309 |
| 2012-04-25 19:00:00 | 1274 |
| 2012-04-25 20:00:00 | 1241.75 |
| 2012-04-25 21:00:00 | 1318.75 |
| 2012-04-25 22:00:00 | 1296.5 |
| 2012-04-25 23:00:00 | 1296.75 |
| 2012-04-26 | 1307 |
| 2012-04-26 01:00:00 | 1282.75 |
| 2012-04-26 02:00:00 | 1252.75 |
| 2012-04-26 03:00:00 | 1278.25 |
| 2012-04-26 04:00:00 | 1173 |
| 2012-04-26 05:00:00 | 1138.25 |
| 2012-04-26 06:00:00 | 1093.5 |
| 2012-04-26 07:00:00 | 1105.25 |
| 2012-04-26 08:00:00 | 1150.75 |
| 2012-04-26 09:00:00 | 1126.75 |
| 2012-04-26 10:00:00 | 1170.5 |
| 2012-04-26 11:00:00 | 1203 |
| 2012-04-26 12:00:00 | 1204.75 |
| 2012-04-26 13:00:00 | 1193.5 |
| 2012-04-26 14:00:00 | 1254.75 |
| 2012-04-26 15:00:00 | 1242.25 |
| 2012-04-26 16:00:00 | 1358.75 |
| 2012-04-26 17:00:00 | 1264.75 |
| 2012-04-26 18:00:00 | 1335.75 |
| 2012-04-26 19:00:00 | 1252.75 |
| 2012-04-26 20:00:00 | 1242.5 |
| 2012-04-26 21:00:00 | 1300.75 |
| 2012-04-26 22:00:00 | 1236.5 |
| 2012-04-26 23:00:00 | 1286 |
| 2012-04-27 | 1284 |
| 2012-04-27 01:00:00 | 1246.5 |
| 2012-04-27 02:00:00 | 1194.25 |
| 2012-04-27 03:00:00 | 1227.75 |
| 2012-04-27 04:00:00 | 1164 |
| 2012-04-27 05:00:00 | 1103.75 |
| 2012-04-27 06:00:00 | 1097.75 |
| 2012-04-27 07:00:00 | 1090.25 |
| 2012-04-27 08:00:00 | 1130.25 |
| 2012-04-27 09:00:00 | 1125.5 |
| 2012-04-27 10:00:00 | 1143.5 |
| 2012-04-27 11:00:00 | 1214.25 |
| 2012-04-27 12:00:00 | 1253.25 |
| 2012-04-27 13:00:00 | 1222.25 |
| 2012-04-27 14:00:00 | 1253.25 |
| 2012-04-27 15:00:00 | 1178.5 |
| 2012-04-27 16:00:00 | 1213.5 |
| 2012-04-27 17:00:00 | 1199.5 |
| 2012-04-27 18:00:00 | 1208.5 |
| 2012-04-27 19:00:00 | 1199.75 |
| 2012-04-27 20:00:00 | 1195.25 |
| 2012-04-27 21:00:00 | 1252.5 |
| 2012-04-27 22:00:00 | 1209 |
| 2012-04-27 23:00:00 | 1207.5 |
| 2012-04-28 | 1168 |
| 2012-04-28 01:00:00 | 1149.5 |
| 2012-04-28 02:00:00 | 1166 |
| 2012-04-28 03:00:00 | 1094.5 |
| 2012-04-28 04:00:00 | 1030.75 |
| 2012-04-28 05:00:00 | 1024 |
| 2012-04-28 06:00:00 | 1012 |
| 2012-04-28 07:00:00 | 1007.5 |
| 2012-04-28 08:00:00 | 1005 |
| 2012-04-28 09:00:00 | 994 |
| 2012-04-28 10:00:00 | 1016.25 |
| 2012-04-28 11:00:00 | 1017.5 |
| 2012-04-28 12:00:00 | 1034.25 |
| 2012-04-28 13:00:00 | 1035.75 |
| 2012-04-28 14:00:00 | 1036 |
| 2012-04-28 15:00:00 | 1032.75 |
| 2012-04-28 16:00:00 | 1018 |
| 2012-04-28 17:00:00 | 1005.75 |
| 2012-04-28 18:00:00 | 1023.75 |
| 2012-04-28 19:00:00 | 1044.5 |
| 2012-04-28 20:00:00 | 1091.5 |
| 2012-04-28 21:00:00 | 1142.5 |
| 2012-04-28 22:00:00 | 1192.25 |
| 2012-04-28 23:00:00 | 1145.75 |
| 2012-04-29 | 1145.5 |
| 2012-04-29 01:00:00 | 1141.5 |
| 2012-04-29 02:00:00 | 1111.75 |
| 2012-04-29 03:00:00 | 1021.25 |
| 2012-04-29 04:00:00 | 1084.25 |
| 2012-04-29 05:00:00 | 1006.25 |
| 2012-04-29 06:00:00 | 961.5 |
| 2012-04-29 07:00:00 | 956.25 |
| 2012-04-29 08:00:00 | 969.5 |
| 2012-04-29 09:00:00 | 969.5 |
| 2012-04-29 10:00:00 | 981.75 |
| 2012-04-29 11:00:00 | 999.75 |
| 2012-04-29 12:00:00 | 1029 |
| 2012-04-29 13:00:00 | 1025.25 |
| 2012-04-29 14:00:00 | 1065 |
| 2012-04-29 15:00:00 | 1048.75 |
| 2012-04-29 16:00:00 | 1169 |
| 2012-04-29 17:00:00 | 1099.25 |
| 2012-04-29 18:00:00 | 1131.25 |
| 2012-04-29 19:00:00 | 1104.75 |
| 2012-04-29 20:00:00 | 1111 |
| 2012-04-29 21:00:00 | 1166.5 |
| 2012-04-29 22:00:00 | 1155 |
| 2012-04-29 23:00:00 | 1156.5 |
| 2012-04-30 | 1148 |
| 2012-04-30 01:00:00 | 1175 |
| 2012-04-30 02:00:00 | 1016 |
| 2012-04-30 03:00:00 | 1020 |
| 2012-04-30 04:00:00 | 1007.25 |
| 2012-04-30 05:00:00 | 999.75 |
| 2012-04-30 06:00:00 | 985 |
| 2012-04-30 07:00:00 | 987.75 |
| 2012-04-30 08:00:00 | 1006.25 |
| 2012-04-30 09:00:00 | 1040 |
| 2012-04-30 10:00:00 | 1071.5 |
| 2012-04-30 11:00:00 | 1046.5 |
| 2012-04-30 12:00:00 | 1066.75 |
| 2012-04-30 13:00:00 | 1113.25 |
| 2012-04-30 14:00:00 | 1089 |
| 2012-04-30 15:00:00 | 1047.5 |
| 2012-04-30 16:00:00 | 1103.5 |
| 2012-04-30 17:00:00 | 1089.75 |
| 2012-04-30 18:00:00 | 1090.25 |
| 2012-04-30 19:00:00 | 1118.25 |
| 2012-04-30 20:00:00 | 1136 |
| 2012-04-30 21:00:00 | 1147.75 |
| 2012-04-30 22:00:00 | 1087.5 |
| 2012-04-30 23:00:00 | 1226 |
| 2012-05-01 | 1142.25 |
| 2012-05-01 01:00:00 | 1069.25 |
| 2012-05-01 02:00:00 | 1100.25 |
| 2012-05-01 03:00:00 | 1015 |
| 2012-05-01 04:00:00 | 989.5 |
| 2012-05-01 05:00:00 | 992.5 |
| 2012-05-01 06:00:00 | 975.25 |
| 2012-05-01 07:00:00 | 968.5 |
| 2012-05-01 08:00:00 | 959.25 |
| 2012-05-01 09:00:00 | 906 |
| 2012-05-01 10:00:00 | 990.75 |
| 2012-05-01 11:00:00 | 964.75 |
| 2012-05-01 12:00:00 | 979.25 |
| 2012-05-01 13:00:00 | 974.25 |
| 2012-05-01 14:00:00 | 1001.25 |
| 2012-05-01 15:00:00 | 988.25 |
| 2012-05-01 16:00:00 | 1056.75 |
| 2012-05-01 17:00:00 | 1127.75 |
| 2012-05-01 18:00:00 | 1119.75 |
| 2012-05-01 19:00:00 | 1096.75 |
| 2012-05-01 20:00:00 | 1080.5 |
| 2012-05-01 21:00:00 | 1126.25 |
| 2012-05-01 22:00:00 | 1155.25 |
| 2012-05-01 23:00:00 | 1241.25 |
| 2012-05-02 | 1159.25 |
| 2012-05-02 01:00:00 | 1206.75 |
| 2012-05-02 02:00:00 | 1123 |
| 2012-05-02 03:00:00 | 1089.75 |
| 2012-05-02 04:00:00 | 1081 |
| 2012-05-02 05:00:00 | 1072.25 |
| 2012-05-02 06:00:00 | 1062 |
| 2012-05-02 07:00:00 | 1071.5 |
| 2012-05-02 08:00:00 | 1104.75 |
| 2012-05-02 09:00:00 | 1082.75 |
| 2012-05-02 10:00:00 | 1114.25 |
| 2012-05-02 11:00:00 | 1111 |
| 2012-05-02 12:00:00 | 1196 |
| 2012-05-02 13:00:00 | 1199.25 |
| 2012-05-02 14:00:00 | 1215 |
| 2012-05-02 15:00:00 | 1250.25 |
| 2012-05-02 16:00:00 | 1242 |
| 2012-05-02 17:00:00 | 1228 |
| 2012-05-02 18:00:00 | 1223.75 |
| 2012-05-02 19:00:00 | 1219.5 |
| 2012-05-02 20:00:00 | 1216.25 |
| 2012-05-02 21:00:00 | 1242.5 |
| 2012-05-02 22:00:00 | 1229.5 |
| 2012-05-02 23:00:00 | 1198.25 |
| 2012-05-03 | 1199.75 |
| 2012-05-03 01:00:00 | 1200.5 |
| 2012-05-03 02:00:00 | 1218.75 |
| 2012-05-03 03:00:00 | 1094.25 |
| 2012-05-03 04:00:00 | 1158.25 |
| 2012-05-03 05:00:00 | 1100.75 |
| 2012-05-03 06:00:00 | 1077.25 |
| 2012-05-03 07:00:00 | 1074.25 |
| 2012-05-03 08:00:00 | 1131.25 |
| 2012-05-03 09:00:00 | 1150.75 |
| 2012-05-03 10:00:00 | 1229.5 |
| 2012-05-03 11:00:00 | 1228.75 |
| 2012-05-03 12:00:00 | 1284.5 |
| 2012-05-03 13:00:00 | 1238 |
| 2012-05-03 14:00:00 | 1268 |
| 2012-05-03 15:00:00 | 1309 |
| 2012-05-03 16:00:00 | 1300.75 |
| 2012-05-03 17:00:00 | 1284.75 |
| 2012-05-03 18:00:00 | 1247.25 |
| 2012-05-03 19:00:00 | 1238.25 |
| 2012-05-03 20:00:00 | 1234 |
| 2012-05-03 21:00:00 | 1287.5 |
| 2012-05-03 22:00:00 | 1295.75 |
| 2012-05-03 23:00:00 | 1219.75 |
| 2012-05-04 | 1303 |
| 2012-05-04 01:00:00 | 1314 |
| 2012-05-04 02:00:00 | 1273 |
| 2012-05-04 03:00:00 | 1210.75 |
| 2012-05-04 04:00:00 | 1191 |
| 2012-05-04 05:00:00 | 1172.75 |
| 2012-05-04 06:00:00 | 1144.25 |
| 2012-05-04 07:00:00 | 1119 |
| 2012-05-04 08:00:00 | 1127.25 |
| 2012-05-04 09:00:00 | 975.75 |
| 2012-05-04 10:00:00 | 1264 |
| 2012-05-04 11:00:00 | 1233.75 |
| 2012-05-04 12:00:00 | 1207.25 |
| 2012-05-04 13:00:00 | 1137 |
| 2012-05-04 14:00:00 | 1133 |
| 2012-05-04 15:00:00 | 1496.5 |
| 2012-05-04 16:00:00 | 1897 |
| 2012-05-04 17:00:00 | 1869.5 |
| 2012-05-04 18:00:00 | 2065.75 |
| 2012-05-04 19:00:00 | 2240.25 |
| 2012-05-04 20:00:00 | 1987 |
| 2012-05-04 21:00:00 | 1479.5 |
| 2012-05-04 22:00:00 | 1436.75 |
| 2012-05-04 23:00:00 | 1380 |
| 2012-05-05 | 1321 |
| 2012-05-05 01:00:00 | 1234 |
| 2012-05-05 02:00:00 | 1119 |
| 2012-05-05 03:00:00 | 1180 |
| 2012-05-05 04:00:00 | 1053.5 |
| 2012-05-05 05:00:00 | 1043.5 |
| 2012-05-05 06:00:00 | 1020.75 |
| 2012-05-05 07:00:00 | 1017 |
| 2012-05-05 08:00:00 | 1011.25 |
| 2012-05-05 09:00:00 | 998 |
| 2012-05-05 10:00:00 | 1017 |
| 2012-05-05 11:00:00 | 1023.5 |
| 2012-05-05 12:00:00 | 1055.25 |
| 2012-05-05 13:00:00 | 1051.5 |
| 2012-05-05 14:00:00 | 1034 |
| 2012-05-05 15:00:00 | 1104 |
| 2012-05-05 16:00:00 | 1119 |
| 2012-05-05 17:00:00 | 1103 |
| 2012-05-05 18:00:00 | 1144 |
| 2012-05-05 19:00:00 | 1144.75 |
| 2012-05-05 20:00:00 | 1101.5 |
| 2012-05-05 21:00:00 | 1081.5 |
| 2012-05-05 22:00:00 | 1242 |
| 2012-05-05 23:00:00 | 1538.25 |
| 2012-05-06 | 1691.25 |
| 2012-05-06 01:00:00 | 1644 |
| 2012-05-06 02:00:00 | 1319.75 |
| 2012-05-06 03:00:00 | 1055.25 |
| 2012-05-06 04:00:00 | 1039.25 |
| 2012-05-06 05:00:00 | 1026.25 |
| 2012-05-06 06:00:00 | 1001 |
| 2012-05-06 07:00:00 | 991 |
| 2012-05-06 08:00:00 | 987.25 |
| 2012-05-06 09:00:00 | 988.75 |
| 2012-05-06 10:00:00 | 986.5 |
| 2012-05-06 11:00:00 | 1012.25 |
| 2012-05-06 12:00:00 | 1028.75 |
| 2012-05-06 13:00:00 | 1038.25 |
| 2012-05-06 14:00:00 | 1039.5 |
| 2012-05-06 15:00:00 | 1031.75 |
| 2012-05-06 16:00:00 | 1068.25 |
| 2012-05-06 17:00:00 | 1183.5 |
| 2012-05-06 18:00:00 | 1045.75 |
| 2012-05-06 19:00:00 | 1006.25 |
| 2012-05-06 20:00:00 | 1073.25 |
| 2012-05-06 21:00:00 | 1184 |
| 2012-05-06 22:00:00 | 1124.25 |
| 2012-05-06 23:00:00 | 1099.25 |
| 2012-05-07 | 1122.25 |
| 2012-05-07 01:00:00 | 1280 |
| 2012-05-07 02:00:00 | 1495.25 |
| 2012-05-07 03:00:00 | 1711.5 |
| 2012-05-07 04:00:00 | 1813.75 |
| 2012-05-07 05:00:00 | 1629.25 |
| 2012-05-07 06:00:00 | 1259.5 |
| 2012-05-07 07:00:00 | 1104.5 |
| 2012-05-07 08:00:00 | 1146.75 |
| 2012-05-07 09:00:00 | 1150.5 |
| 2012-05-07 10:00:00 | 1146 |
| 2012-05-07 11:00:00 | 1152.5 |
| 2012-05-07 12:00:00 | 1133.25 |
| 2012-05-07 13:00:00 | 1126.75 |
| 2012-05-07 14:00:00 | 1111 |
| 2012-05-07 15:00:00 | 1085.25 |
| 2012-05-07 16:00:00 | 1063.5 |
| 2012-05-07 17:00:00 | 1079.5 |
| 2012-05-07 18:00:00 | 1059 |
| 2012-05-07 19:00:00 | 1051 |
| 2012-05-07 20:00:00 | 1068 |
| 2012-05-07 21:00:00 | 1113.75 |
| 2012-05-07 22:00:00 | 1119.5 |
| 2012-05-07 23:00:00 | 1108.5 |
| 2012-05-08 | 1096.75 |
| 2012-05-08 01:00:00 | 1101.75 |
| 2012-05-08 02:00:00 | 1086.75 |
| 2012-05-08 03:00:00 | 1048.5 |
| 2012-05-08 04:00:00 | 1044.25 |
| 2012-05-08 05:00:00 | 1037.75 |
| 2012-05-08 06:00:00 | 1028.5 |
| 2012-05-08 07:00:00 | 1030.75 |
| 2012-05-08 08:00:00 | 1026.25 |
| 2012-05-08 09:00:00 | 1029.5 |
| 2012-05-08 10:00:00 | 1030.25 |
| 2012-05-08 11:00:00 | 1087.75 |
| 2012-05-08 12:00:00 | 1060 |
| 2012-05-08 13:00:00 | 1064 |
| 2012-05-08 14:00:00 | 1069.75 |
| 2012-05-08 15:00:00 | 1071.75 |
| 2012-05-08 16:00:00 | 1067 |
| 2012-05-08 17:00:00 | 1064.5 |
| 2012-05-08 18:00:00 | 1143.25 |
| 2012-05-08 19:00:00 | 1158.75 |
| 2012-05-08 20:00:00 | 1137.25 |
| 2012-05-08 21:00:00 | 1161.75 |
| 2012-05-08 22:00:00 | 1168.25 |
| 2012-05-08 23:00:00 | 1178.5 |
| 2012-05-09 | 1207.25 |
| 2012-05-09 01:00:00 | 1164.25 |
| 2012-05-09 02:00:00 | 1150.5 |
| 2012-05-09 03:00:00 | 1181 |
| 2012-05-09 04:00:00 | 1097.25 |
| 2012-05-09 05:00:00 | 1104.5 |
| 2012-05-09 06:00:00 | 1077 |
| 2012-05-09 07:00:00 | 1089.5 |
| 2012-05-09 08:00:00 | 1128.25 |
| 2012-05-09 09:00:00 | 1116.25 |
| 2012-05-09 10:00:00 | 1172.25 |
| 2012-05-09 11:00:00 | 1153.25 |
| 2012-05-09 12:00:00 | 1169.25 |
| 2012-05-09 13:00:00 | 1148 |
| 2012-05-09 14:00:00 | 1227.75 |
| 2012-05-09 15:00:00 | 1238.75 |
| 2012-05-09 16:00:00 | 1231.75 |
| 2012-05-09 17:00:00 | 1221.25 |
| 2012-05-09 18:00:00 | 1222.25 |
| 2012-05-09 19:00:00 | 1214.25 |
| 2012-05-09 20:00:00 | 1228.75 |
| 2012-05-09 21:00:00 | 1234.5 |
| 2012-05-09 22:00:00 | 1269.25 |
| 2012-05-09 23:00:00 | 1254 |
| 2012-05-10 | 1256.5 |
| 2012-05-10 01:00:00 | 1284.25 |
| 2012-05-10 02:00:00 | 1263 |
| 2012-05-10 03:00:00 | 1197.5 |
| 2012-05-10 04:00:00 | 1262 |
| 2012-05-10 05:00:00 | 1107.75 |
| 2012-05-10 06:00:00 | 1081.75 |
| 2012-05-10 07:00:00 | 1084.5 |
| 2012-05-10 08:00:00 | 1128.5 |
| 2012-05-10 09:00:00 | 1146.5 |
| 2012-05-10 10:00:00 | 1159.5 |
| 2012-05-10 11:00:00 | 1202 |
| 2012-05-10 12:00:00 | 1246.75 |
| 2012-05-10 13:00:00 | 1277 |
| 2012-05-10 14:00:00 | 1267.25 |
| 2012-05-10 15:00:00 | 1350.5 |
| 2012-05-10 16:00:00 | 1369 |
| 2012-05-10 17:00:00 | 1353.5 |
| 2012-05-10 18:00:00 | 1344.5 |
| 2012-05-10 19:00:00 | 1348.5 |
| 2012-05-10 20:00:00 | 1316.75 |
| 2012-05-10 21:00:00 | 1309.5 |
| 2012-05-10 22:00:00 | 1339 |
| 2012-05-10 23:00:00 | 1358 |
| 2012-05-11 | 1335.75 |
| 2012-05-11 01:00:00 | 1322.75 |
| 2012-05-11 02:00:00 | 1309 |
| 2012-05-11 03:00:00 | 1328.25 |
| 2012-05-11 04:00:00 | 1188 |
| 2012-05-11 05:00:00 | 1202.75 |
| 2012-05-11 06:00:00 | 1092.75 |
| 2012-05-11 07:00:00 | 1092.25 |
| 2012-05-11 08:00:00 | 1090.25 |
| 2012-05-11 09:00:00 | 1090.25 |
| 2012-05-11 10:00:00 | 1175.25 |
| 2012-05-11 11:00:00 | 1236.25 |
| 2012-05-11 12:00:00 | 1250.25 |
| 2012-05-11 13:00:00 | 1336.75 |
| 2012-05-11 14:00:00 | 1257.75 |
| 2012-05-11 15:00:00 | 1325.5 |
| 2012-05-11 16:00:00 | 1341.5 |
| 2012-05-11 17:00:00 | 1360.25 |
| 2012-05-11 18:00:00 | 1286 |
| 2012-05-11 19:00:00 | 1111.5 |
| 2012-05-11 20:00:00 | 1231 |
| 2012-05-11 21:00:00 | 1371 |
| 2012-05-11 22:00:00 | 1363 |
| 2012-05-11 23:00:00 | 1227 |
| 2012-05-12 | 1253.5 |
| 2012-05-12 01:00:00 | 1251.75 |
| 2012-05-12 02:00:00 | 1238.5 |
| 2012-05-12 03:00:00 | 1255.5 |
| 2012-05-12 04:00:00 | 1189.5 |
| 2012-05-12 05:00:00 | 1044.75 |
| 2012-05-12 06:00:00 | 1026 |
| 2012-05-12 07:00:00 | 1100.75 |
| 2012-05-12 08:00:00 | 1104 |
| 2012-05-12 09:00:00 | 1099.5 |
| 2012-05-12 10:00:00 | 1096.75 |
| 2012-05-12 11:00:00 | 1114 |
| 2012-05-12 12:00:00 | 1301 |
| 2012-05-12 13:00:00 | 1190.75 |
| 2012-05-12 14:00:00 | 1409.75 |
| 2012-05-12 15:00:00 | 1534 |
| 2012-05-12 16:00:00 | 1532.5 |
| 2012-05-12 17:00:00 | 1489.75 |
| 2012-05-12 18:00:00 | 1309.25 |
| 2012-05-12 19:00:00 | 1563 |
| 2012-05-12 20:00:00 | 1617.5 |
| 2012-05-12 21:00:00 | 1637.75 |
| 2012-05-12 22:00:00 | 1478.25 |
| 2012-05-12 23:00:00 | 1272.75 |
| 2012-05-13 | 1182.25 |
| 2012-05-13 01:00:00 | 1149.75 |
| 2012-05-13 02:00:00 | 1184.75 |
| 2012-05-13 03:00:00 | 1082 |
| 2012-05-13 04:00:00 | 1108.5 |
| 2012-05-13 05:00:00 | 1107.75 |
| 2012-05-13 06:00:00 | 1089.75 |
| 2012-05-13 07:00:00 | 1088.5 |
| 2012-05-13 08:00:00 | 1083 |
| 2012-05-13 09:00:00 | 1079.25 |
| 2012-05-13 10:00:00 | 1090.75 |
| 2012-05-13 11:00:00 | 1104.5 |
| 2012-05-13 12:00:00 | 1128 |
| 2012-05-13 13:00:00 | 1117 |
| 2012-05-13 14:00:00 | 1134.75 |
| 2012-05-13 15:00:00 | 1126.5 |
| 2012-05-13 16:00:00 | 1142.25 |
| 2012-05-13 17:00:00 | 1220 |
| 2012-05-13 18:00:00 | 1224.5 |
| 2012-05-13 19:00:00 | 1192.75 |
| 2012-05-13 20:00:00 | 1125.5 |
| 2012-05-13 21:00:00 | 1177.5 |
| 2012-05-13 22:00:00 | 1207 |
| 2012-05-13 23:00:00 | 1196.5 |
| 2012-05-14 | 1171.75 |
| 2012-05-14 01:00:00 | 1208.75 |
| 2012-05-14 02:00:00 | 1160.25 |
| 2012-05-14 03:00:00 | 1120.75 |
| 2012-05-14 04:00:00 | 1038.75 |
| 2012-05-14 05:00:00 | 1061.25 |
| 2012-05-14 06:00:00 | 1041.25 |
| 2012-05-14 07:00:00 | 1092 |
| 2012-05-14 08:00:00 | 1164 |
| 2012-05-14 09:00:00 | 1159.5 |
| 2012-05-14 10:00:00 | 1172.75 |
| 2012-05-14 11:00:00 | 1182.25 |
| 2012-05-14 12:00:00 | 1162.75 |
| 2012-05-14 13:00:00 | 1278.75 |
| 2012-05-14 14:00:00 | 1219.75 |
| 2012-05-14 15:00:00 | 1172.5 |
| 2012-05-14 16:00:00 | 1142.5 |
| 2012-05-14 17:00:00 | 1135.5 |
| 2012-05-14 18:00:00 | 1248 |
| 2012-05-14 19:00:00 | 1262.75 |
| 2012-05-14 20:00:00 | 1265.5 |
| 2012-05-14 21:00:00 | 1230 |
| 2012-05-14 22:00:00 | 1250.75 |
| 2012-05-14 23:00:00 | 1217.5 |
| 2012-05-15 | 1150.5 |
| 2012-05-15 01:00:00 | 1086.75 |
| 2012-05-15 02:00:00 | 1042.75 |
| 2012-05-15 03:00:00 | 1041.5 |
| 2012-05-15 04:00:00 | 1101.75 |
| 2012-05-15 05:00:00 | 1108.5 |
| 2012-05-15 06:00:00 | 1087.5 |
| 2012-05-15 07:00:00 | 1098.75 |
| 2012-05-15 08:00:00 | 1136.75 |
| 2012-05-15 09:00:00 | 1135 |
| 2012-05-15 10:00:00 | 1176.25 |
| 2012-05-15 11:00:00 | 1078.5 |
| 2012-05-15 12:00:00 | 1097.75 |
| 2012-05-15 13:00:00 | 1227.5 |
| 2012-05-15 14:00:00 | 1244.75 |
| 2012-05-15 15:00:00 | 1255.5 |
| 2012-05-15 16:00:00 | 1216.5 |
| 2012-05-15 17:00:00 | 1223.25 |
| 2012-05-15 18:00:00 | 1251 |
| 2012-05-15 19:00:00 | 1269.25 |
| 2012-05-15 20:00:00 | 1287.75 |
| 2012-05-15 21:00:00 | 1332 |
| 2012-05-15 22:00:00 | 1282.25 |
| 2012-05-15 23:00:00 | 1340 |
| 2012-05-16 | 1324.75 |
| 2012-05-16 01:00:00 | 1258 |
| 2012-05-16 02:00:00 | 1190.75 |
| 2012-05-16 03:00:00 | 1143.5 |
| 2012-05-16 04:00:00 | 1110.75 |
| 2012-05-16 05:00:00 | 1073 |
| 2012-05-16 06:00:00 | 1068.25 |
| 2012-05-16 07:00:00 | 1077 |
| 2012-05-16 08:00:00 | 1119.5 |
| 2012-05-16 09:00:00 | 1138.5 |
| 2012-05-16 10:00:00 | 1165.75 |
| 2012-05-16 11:00:00 | 1186 |
| 2012-05-16 12:00:00 | 1215.75 |
| 2012-05-16 13:00:00 | 1337.5 |
| 2012-05-16 14:00:00 | 1202 |
| 2012-05-16 15:00:00 | 1165.75 |
| 2012-05-16 16:00:00 | 1276 |
| 2012-05-16 17:00:00 | 1244 |
| 2012-05-16 18:00:00 | 1242.75 |
| 2012-05-16 19:00:00 | 1151 |
| 2012-05-16 20:00:00 | 1171.25 |
| 2012-05-16 21:00:00 | 1118 |
| 2012-05-16 22:00:00 | 1143.25 |
| 2012-05-16 23:00:00 | 1160.25 |
| 2012-05-17 | 1160.75 |
| 2012-05-17 01:00:00 | 1127.25 |
| 2012-05-17 02:00:00 | 1118.25 |
| 2012-05-17 03:00:00 | 1135.5 |
| 2012-05-17 04:00:00 | 1010.5 |
| 2012-05-17 05:00:00 | 1052 |
| 2012-05-17 06:00:00 | 1026.5 |
| 2012-05-17 07:00:00 | 1037.75 |
| 2012-05-17 08:00:00 | 1080 |
| 2012-05-17 09:00:00 | 1104.25 |
| 2012-05-17 10:00:00 | 1133.75 |
| 2012-05-17 11:00:00 | 1148.75 |
| 2012-05-17 12:00:00 | 1167.75 |
| 2012-05-17 13:00:00 | 1183.5 |
| 2012-05-17 14:00:00 | 1127.25 |
| 2012-05-17 15:00:00 | 1175 |
| 2012-05-17 16:00:00 | 1191 |
| 2012-05-17 17:00:00 | 1153.25 |
| 2012-05-17 18:00:00 | 1233.75 |
| 2012-05-17 19:00:00 | 1203.75 |
| 2012-05-17 20:00:00 | 1117 |
| 2012-05-17 21:00:00 | 1201.25 |
| 2012-05-17 22:00:00 | 1196 |
| 2012-05-17 23:00:00 | 1224.25 |
| 2012-05-18 | 1256.75 |
| 2012-05-18 01:00:00 | 1193.75 |
| 2012-05-18 02:00:00 | 1162 |
| 2012-05-18 03:00:00 | 1135.5 |
| 2012-05-18 04:00:00 | 1108.75 |
| 2012-05-18 05:00:00 | 1064.5 |
| 2012-05-18 06:00:00 | 1045.75 |
| 2012-05-18 07:00:00 | 1058.75 |
| 2012-05-18 08:00:00 | 1072.5 |
| 2012-05-18 09:00:00 | 1094.75 |
| 2012-05-18 10:00:00 | 1117.5 |
| 2012-05-18 11:00:00 | 1128 |
| 2012-05-18 12:00:00 | 1182 |
| 2012-05-18 13:00:00 | 1228.5 |
| 2012-05-18 14:00:00 | 1242.75 |
| 2012-05-18 15:00:00 | 1226 |
| 2012-05-18 16:00:00 | 1297 |
| 2012-05-18 17:00:00 | 1380 |
| 2012-05-18 18:00:00 | 1253 |
| 2012-05-18 19:00:00 | 1252 |
| 2012-05-18 20:00:00 | 1226.75 |
| 2012-05-18 21:00:00 | 1114.75 |
| 2012-05-18 22:00:00 | 1215.75 |
| 2012-05-18 23:00:00 | 1208.25 |
| 2012-05-19 | 1069.5 |
| 2012-05-19 01:00:00 | 1111.75 |
| 2012-05-19 02:00:00 | 1048.75 |
| 2012-05-19 03:00:00 | 1040.5 |
| 2012-05-19 04:00:00 | 1033 |
| 2012-05-19 05:00:00 | 1021.75 |
| 2012-05-19 06:00:00 | 995.5 |
| 2012-05-19 07:00:00 | 1004.25 |
| 2012-05-19 08:00:00 | 996.25 |
| 2012-05-19 09:00:00 | 991.25 |
| 2012-05-19 10:00:00 | 1025 |
| 2012-05-19 11:00:00 | 1044.75 |
| 2012-05-19 12:00:00 | 1056.5 |
| 2012-05-19 13:00:00 | 1048.75 |
| 2012-05-19 14:00:00 | 1050 |
| 2012-05-19 15:00:00 | 1082.5 |
| 2012-05-19 16:00:00 | 1125 |
| 2012-05-19 17:00:00 | 1100.75 |
| 2012-05-19 18:00:00 | 1047.25 |
| 2012-05-19 19:00:00 | 1229 |
| 2012-05-19 20:00:00 | 1101.25 |
| 2012-05-19 21:00:00 | 1108 |
| 2012-05-19 22:00:00 | 1137.25 |
| 2012-05-19 23:00:00 | 1141.5 |
| 2012-05-20 | 1099 |
| 2012-05-20 01:00:00 | 1067.5 |
| 2012-05-20 02:00:00 | 1065 |
| 2012-05-20 03:00:00 | 1020 |
| 2012-05-20 04:00:00 | 1010 |
| 2012-05-20 05:00:00 | 1009.25 |
| 2012-05-20 06:00:00 | 976.25 |
| 2012-05-20 07:00:00 | 979.75 |
| 2012-05-20 08:00:00 | 985.75 |
| 2012-05-20 09:00:00 | 962.75 |
| 2012-05-20 10:00:00 | 985.75 |
| 2012-05-20 11:00:00 | 1008.5 |
| 2012-05-20 12:00:00 | 1044.5 |
| 2012-05-20 13:00:00 | 1037.75 |
| 2012-05-20 14:00:00 | 1036.75 |
| 2012-05-20 15:00:00 | 1084 |
| 2012-05-20 16:00:00 | 1079 |
| 2012-05-20 17:00:00 | 1035 |
| 2012-05-20 18:00:00 | 1079.75 |
| 2012-05-20 19:00:00 | 1143 |
| 2012-05-20 20:00:00 | 1033.75 |
| 2012-05-20 21:00:00 | 1105 |
| 2012-05-20 22:00:00 | 1105.75 |
| 2012-05-20 23:00:00 | 1116.75 |
| 2012-05-21 | 1132.5 |
| 2012-05-21 01:00:00 | 1088.5 |
| 2012-05-21 02:00:00 | 1097 |
| 2012-05-21 03:00:00 | 1083 |
| 2012-05-21 04:00:00 | 1103.25 |
| 2012-05-21 05:00:00 | 1007.25 |
| 2012-05-21 06:00:00 | 988.25 |
| 2012-05-21 07:00:00 | 1041.25 |
| 2012-05-21 08:00:00 | 1106.5 |
| 2012-05-21 09:00:00 | 1134 |
| 2012-05-21 10:00:00 | 1173 |
| 2012-05-21 11:00:00 | 1206.5 |
| 2012-05-21 12:00:00 | 1259.25 |
| 2012-05-21 13:00:00 | 1278.25 |
| 2012-05-21 14:00:00 | 1331.75 |
| 2012-05-21 15:00:00 | 1298.5 |
| 2012-05-21 16:00:00 | 1384 |
| 2012-05-21 17:00:00 | 1361 |
| 2012-05-21 18:00:00 | 1407.75 |
| 2012-05-21 19:00:00 | 1350 |
| 2012-05-21 20:00:00 | 1301 |
| 2012-05-21 21:00:00 | 1293 |
| 2012-05-21 22:00:00 | 1361.5 |
| 2012-05-21 23:00:00 | 1353.5 |
| 2012-05-22 | 1256.75 |
| 2012-05-22 01:00:00 | 1295.5 |
| 2012-05-22 02:00:00 | 1241.5 |
| 2012-05-22 03:00:00 | 1262.75 |
| 2012-05-22 04:00:00 | 1219 |
| 2012-05-22 05:00:00 | 1046.75 |
| 2012-05-22 06:00:00 | 1065 |
| 2012-05-22 07:00:00 | 1106.25 |
| 2012-05-22 08:00:00 | 1199 |
| 2012-05-22 09:00:00 | 1269.25 |
| 2012-05-22 10:00:00 | 1270.25 |
| 2012-05-22 11:00:00 | 1244.5 |
| 2012-05-22 12:00:00 | 1274.5 |
| 2012-05-22 13:00:00 | 1297.75 |
| 2012-05-22 14:00:00 | 1356.5 |
| 2012-05-22 15:00:00 | 1348 |
| 2012-05-22 16:00:00 | 1314.75 |
| 2012-05-22 17:00:00 | 1371.5 |
| 2012-05-22 18:00:00 | 1401.5 |
| 2012-05-22 19:00:00 | 1391.75 |
| 2012-05-22 20:00:00 | 1352.75 |
| 2012-05-22 21:00:00 | 1396 |
| 2012-05-22 22:00:00 | 1397.25 |
| 2012-05-22 23:00:00 | 1404.75 |
| 2012-05-23 | 1413.25 |
| 2012-05-23 01:00:00 | 1405.25 |
| 2012-05-23 02:00:00 | 1306.5 |
| 2012-05-23 03:00:00 | 1161.75 |
| 2012-05-23 04:00:00 | 1247.75 |
| 2012-05-23 05:00:00 | 1214.25 |
| 2012-05-23 06:00:00 | 1132.25 |
| 2012-05-23 07:00:00 | 1188.75 |
| 2012-05-23 08:00:00 | 1117.25 |
| 2012-05-23 09:00:00 | 1140.75 |
| 2012-05-23 10:00:00 | 1145.5 |
| 2012-05-23 11:00:00 | 1128 |
| 2012-05-23 12:00:00 | 1128.5 |
| 2012-05-23 13:00:00 | 1126.75 |
| 2012-05-23 14:00:00 | 1143 |
| 2012-05-23 15:00:00 | 1273.5 |
| 2012-05-23 16:00:00 | 1476.25 |
| 2012-05-23 17:00:00 | 1592.5 |
| 2012-05-23 18:00:00 | 1669 |
| 2012-05-23 19:00:00 | 1574.5 |
| 2012-05-23 20:00:00 | 1493.25 |
| 2012-05-23 21:00:00 | 1428 |
| 2012-05-23 22:00:00 | 1419 |
| 2012-05-23 23:00:00 | 1372.25 |
| 2012-05-24 | 1334.5 |
| 2012-05-24 01:00:00 | 1280.5 |
| 2012-05-24 02:00:00 | 1347.5 |
| 2012-05-24 03:00:00 | 1252.5 |
| 2012-05-24 04:00:00 | 1238.75 |
| 2012-05-24 05:00:00 | 1167 |
| 2012-05-24 06:00:00 | 1065.75 |
| 2012-05-24 07:00:00 | 1115.75 |
| 2012-05-24 08:00:00 | 1155.75 |
| 2012-05-24 09:00:00 | 1153.25 |
| 2012-05-24 10:00:00 | 1199.5 |
| 2012-05-24 11:00:00 | 1201.25 |
| 2012-05-24 12:00:00 | 1283.75 |
| 2012-05-24 13:00:00 | 1255.25 |
| 2012-05-24 14:00:00 | 1341.75 |
| 2012-05-24 15:00:00 | 1354.75 |
| 2012-05-24 16:00:00 | 1344.5 |
| 2012-05-24 17:00:00 | 1314.75 |
| 2012-05-24 18:00:00 | 1447.25 |
| 2012-05-24 19:00:00 | 1388.25 |
| 2012-05-24 20:00:00 | 1285.25 |
| 2012-05-24 21:00:00 | 1288.75 |
| 2012-05-24 22:00:00 | 1409.75 |
| 2012-05-24 23:00:00 | 1401.5 |
| 2012-05-25 | 1324.75 |
| 2012-05-25 01:00:00 | 1297 |
| 2012-05-25 02:00:00 | 1362.75 |
| 2012-05-25 03:00:00 | 1301.5 |
| 2012-05-25 04:00:00 | 1160.5 |
| 2012-05-25 05:00:00 | 1174.75 |
| 2012-05-25 06:00:00 | 1144.5 |
| 2012-05-25 07:00:00 | 1145.75 |
| 2012-05-25 08:00:00 | 1196.25 |
| 2012-05-25 09:00:00 | 1178 |
| 2012-05-25 10:00:00 | 1205.75 |
| 2012-05-25 11:00:00 | 1224.5 |
| 2012-05-25 12:00:00 | 1229 |
| 2012-05-25 13:00:00 | 1290.75 |
| 2012-05-25 14:00:00 | 1214.75 |
| 2012-05-25 15:00:00 | 1244.25 |
| 2012-05-25 16:00:00 | 1141.5 |
| 2012-05-25 17:00:00 | 1128.5 |
| 2012-05-25 18:00:00 | 1134.75 |
| 2012-05-25 19:00:00 | 1179.25 |
| 2012-05-25 20:00:00 | 1160.75 |
| 2012-05-25 21:00:00 | 1204.25 |
| 2012-05-25 22:00:00 | 1245.25 |
| 2012-05-25 23:00:00 | 1285.5 |
| 2012-05-26 | 1264.75 |
| 2012-05-26 01:00:00 | 1265 |
| 2012-05-26 02:00:00 | 1180 |
| 2012-05-26 03:00:00 | 1191.75 |
| 2012-05-26 04:00:00 | 1144.25 |
| 2012-05-26 05:00:00 | 1121.75 |
| 2012-05-26 06:00:00 | 1095.75 |
| 2012-05-26 07:00:00 | 1091.5 |
| 2012-05-26 08:00:00 | 1092.75 |
| 2012-05-26 09:00:00 | 1083.75 |
| 2012-05-26 10:00:00 | 1124 |
| 2012-05-26 11:00:00 | 1133.75 |
| 2012-05-26 12:00:00 | 1143.25 |
| 2012-05-26 13:00:00 | 1144.75 |
| 2012-05-26 14:00:00 | 1154.75 |
| 2012-05-26 15:00:00 | 1142 |
| 2012-05-26 16:00:00 | 1183.5 |
| 2012-05-26 17:00:00 | 1265.5 |
| 2012-05-26 18:00:00 | 1233.25 |
| 2012-05-26 19:00:00 | 1259.5 |
| 2012-05-26 20:00:00 | 1217.75 |
| 2012-05-26 21:00:00 | 1219.5 |
| 2012-05-26 22:00:00 | 1246.5 |
| 2012-05-26 23:00:00 | 1221 |
| 2012-05-27 | 1267.25 |
| 2012-05-27 01:00:00 | 1308.5 |
| 2012-05-27 02:00:00 | 1244.25 |
| 2012-05-27 03:00:00 | 1157.5 |
| 2012-05-27 04:00:00 | 1135 |
| 2012-05-27 05:00:00 | 1110.75 |
| 2012-05-27 06:00:00 | 1099.5 |
| 2012-05-27 07:00:00 | 1106.75 |
| 2012-05-27 08:00:00 | 1097.75 |
| 2012-05-27 09:00:00 | 1085.75 |
| 2012-05-27 10:00:00 | 1111 |
| 2012-05-27 11:00:00 | 1125 |
| 2012-05-27 12:00:00 | 1138.25 |
| 2012-05-27 13:00:00 | 1143.75 |
| 2012-05-27 14:00:00 | 1215.75 |
| 2012-05-27 15:00:00 | 1129.75 |
| 2012-05-27 16:00:00 | 1194 |
| 2012-05-27 17:00:00 | 1242.5 |
| 2012-05-27 18:00:00 | 1226.75 |
| 2012-05-27 19:00:00 | 1187 |
| 2012-05-27 20:00:00 | 1288 |
| 2012-05-27 21:00:00 | 1189.5 |
| 2012-05-27 22:00:00 | 1279 |
| 2012-05-27 23:00:00 | 1448 |
| 2012-05-28 | 1306.25 |
| 2012-05-28 01:00:00 | 1273.25 |
| 2012-05-28 02:00:00 | 1190.75 |
| 2012-05-28 03:00:00 | 1240 |
| 2012-05-28 04:00:00 | 1147.75 |
| 2012-05-28 05:00:00 | 1120 |
| 2012-05-28 06:00:00 | 1140 |
| 2012-05-28 07:00:00 | 1207 |
| 2012-05-28 08:00:00 | 1107.75 |
| 2012-05-28 09:00:00 | 1055 |
| 2012-05-28 10:00:00 | 1117 |
| 2012-05-28 11:00:00 | 1094 |
| 2012-05-28 12:00:00 | 1102.25 |
| 2012-05-28 13:00:00 | 1189 |
| 2012-05-28 14:00:00 | 1304.75 |
| 2012-05-28 15:00:00 | 1237.75 |
| 2012-05-28 16:00:00 | 1241 |
| 2012-05-28 17:00:00 | 1291 |
| 2012-05-28 18:00:00 | 1185.25 |
| 2012-05-28 19:00:00 | 1282.5 |
| 2012-05-28 20:00:00 | 1240 |
| 2012-05-28 21:00:00 | 1350.25 |
| 2012-05-28 22:00:00 | 1367 |
| 2012-05-28 23:00:00 | 1336.5 |
| 2012-05-29 | 1351 |
| 2012-05-29 01:00:00 | 1390.75 |
| 2012-05-29 02:00:00 | 1387.5 |
| 2012-05-29 03:00:00 | 1402.5 |
| 2012-05-29 04:00:00 | 1390.5 |
| 2012-05-29 05:00:00 | 1305.5 |
| 2012-05-29 06:00:00 | 1092.5 |
| 2012-05-29 07:00:00 | 1091 |
| 2012-05-29 08:00:00 | 916 |
| 2012-05-29 09:00:00 | 1055.75 |
| 2012-05-29 10:00:00 | 1144.25 |
| 2012-05-29 11:00:00 | 1157.25 |
| 2012-05-29 12:00:00 | 1192.5 |
| 2012-05-29 13:00:00 | 1281.75 |
| 2012-05-29 14:00:00 | 1326.75 |
| 2012-05-29 15:00:00 | 1346.5 |
| 2012-05-29 16:00:00 | 1320.5 |
| 2012-05-29 17:00:00 | 1302.75 |
| 2012-05-29 18:00:00 | 1294.75 |
| 2012-05-29 19:00:00 | 1270.25 |
| 2012-05-29 20:00:00 | 1271 |
| 2012-05-29 21:00:00 | 1297 |
| 2012-05-29 22:00:00 | 1352 |
| 2012-05-29 23:00:00 | 1456 |
| 2012-05-30 | 1362.75 |
| 2012-05-30 01:00:00 | 1319.25 |
| 2012-05-30 02:00:00 | 1284 |
| 2012-05-30 03:00:00 | 1177.25 |
| 2012-05-30 04:00:00 | 1290.75 |
| 2012-05-30 05:00:00 | 1115.25 |
| 2012-05-30 06:00:00 | 1056.25 |
| 2012-05-30 07:00:00 | 1116 |
| 2012-05-30 08:00:00 | 1103.75 |
| 2012-05-30 09:00:00 | 1115 |
| 2012-05-30 10:00:00 | 1134.5 |
| 2012-05-30 11:00:00 | 1184.75 |
| 2012-05-30 12:00:00 | 1231 |
| 2012-05-30 13:00:00 | 1231.5 |
| 2012-05-30 14:00:00 | 1308.5 |
| 2012-05-30 15:00:00 | 1291.5 |
| 2012-05-30 16:00:00 | 1289 |
| 2012-05-30 17:00:00 | 1281 |
| 2012-05-30 18:00:00 | 1243 |
| 2012-05-30 19:00:00 | 1213.75 |
| 2012-05-30 20:00:00 | 1213.5 |
| 2012-05-30 21:00:00 | 1243.75 |
| 2012-05-30 22:00:00 | 1373.75 |
| 2012-05-30 23:00:00 | 1393.5 |
| 2012-05-31 | 1435.25 |
| 2012-05-31 01:00:00 | 1420.25 |
| 2012-05-31 02:00:00 | 1335.75 |
| 2012-05-31 03:00:00 | 1255 |
| 2012-05-31 04:00:00 | 1213 |
| 2012-05-31 05:00:00 | 1143 |
| 2012-05-31 06:00:00 | 1083.5 |
| 2012-05-31 07:00:00 | 1101.25 |
| 2012-05-31 08:00:00 | 1116.25 |
| 2012-05-31 09:00:00 | 1087.75 |
| 2012-05-31 10:00:00 | 1139.5 |
| 2012-05-31 11:00:00 | 1217.5 |
| 2012-05-31 12:00:00 | 1406 |
| 2012-05-31 13:00:00 | 1284 |
| 2012-05-31 14:00:00 | 1347.75 |
| 2012-05-31 15:00:00 | 1207 |
| 2012-05-31 16:00:00 | 1219.5 |
| 2012-05-31 17:00:00 | 1226.5 |
| 2012-05-31 18:00:00 | 1207.75 |
| 2012-05-31 19:00:00 | 1272.75 |
| 2012-05-31 20:00:00 | 1295.75 |
| 2012-05-31 21:00:00 | 1407.25 |
| 2012-05-31 22:00:00 | 1460 |
| 2012-05-31 23:00:00 | 1495.5 |
| 2012-06-01 | 1515.5 |
| 2012-06-01 01:00:00 | 1425 |
| 2012-06-01 02:00:00 | 1312 |
| 2012-06-01 03:00:00 | 1243.5 |
| 2012-06-01 04:00:00 | 1154 |
| 2012-06-01 05:00:00 | 1138.25 |
| 2012-06-01 06:00:00 | 1252.75 |
| 2012-06-01 07:00:00 | 1629 |
| 2012-06-01 08:00:00 | 1672.5 |
| 2012-06-01 09:00:00 | 1698.75 |
| 2012-06-01 10:00:00 | 1727.25 |
| 2012-06-01 11:00:00 | 1749.75 |
| 2012-06-01 12:00:00 | 1859 |
| 2012-06-01 13:00:00 | 1910.25 |
| 2012-06-01 14:00:00 | 1858 |
| 2012-06-01 15:00:00 | 1882 |
| 2012-06-01 16:00:00 | 1993 |
| 2012-06-01 17:00:00 | 1990.75 |
| 2012-06-01 18:00:00 | 1900.75 |
| 2012-06-01 19:00:00 | 1773.25 |
| 2012-06-01 20:00:00 | 1774.75 |
| 2012-06-01 21:00:00 | 1664.75 |
| 2012-06-01 22:00:00 | 1712.75 |
| 2012-06-01 23:00:00 | 1774 |
| 2012-06-02 | 1752 |
| 2012-06-02 01:00:00 | 1248 |
| 2012-06-02 02:00:00 | 1156.25 |
| 2012-06-02 03:00:00 | 1036.75 |
| 2012-06-02 04:00:00 | 1048.75 |
| 2012-06-02 05:00:00 | 1037.25 |
| 2012-06-02 06:00:00 | 1020.75 |
| 2012-06-02 07:00:00 | 1036 |
| 2012-06-02 08:00:00 | 1041.5 |
| 2012-06-02 09:00:00 | 1048.5 |
| 2012-06-02 10:00:00 | 1043.5 |
| 2012-06-02 11:00:00 | 1067.75 |
| 2012-06-02 12:00:00 | 1091 |
| 2012-06-02 13:00:00 | 1084.5 |
| 2012-06-02 14:00:00 | 1093 |
| 2012-06-02 15:00:00 | 1134.5 |
| 2012-06-02 16:00:00 | 1192 |
| 2012-06-02 17:00:00 | 1180.75 |
| 2012-06-02 18:00:00 | 1201.5 |
| 2012-06-02 19:00:00 | 1188.25 |
| 2012-06-02 20:00:00 | 1120.75 |
| 2012-06-02 21:00:00 | 1060.5 |
| 2012-06-02 22:00:00 | 1093 |
| 2012-06-02 23:00:00 | 1097 |
| 2012-06-03 | 1088.75 |
| 2012-06-03 01:00:00 | 1078.75 |
| 2012-06-03 02:00:00 | 1064.5 |
| 2012-06-03 03:00:00 | 1140 |
| 2012-06-03 04:00:00 | 1017.75 |
| 2012-06-03 05:00:00 | 1026.25 |
| 2012-06-03 06:00:00 | 1004.25 |
| 2012-06-03 07:00:00 | 1003 |
| 2012-06-03 08:00:00 | 1001.75 |
| 2012-06-03 09:00:00 | 985.25 |
| 2012-06-03 10:00:00 | 1010.5 |
| 2012-06-03 11:00:00 | 1028 |
| 2012-06-03 12:00:00 | 1060 |
| 2012-06-03 13:00:00 | 1071.75 |
| 2012-06-03 14:00:00 | 1070 |
| 2012-06-03 15:00:00 | 1067.5 |
| 2012-06-03 16:00:00 | 1146.25 |
| 2012-06-03 17:00:00 | 1137.25 |
| 2012-06-03 18:00:00 | 1183 |
| 2012-06-03 19:00:00 | 1129.25 |
| 2012-06-03 20:00:00 | 1207 |
| 2012-06-03 21:00:00 | 1157.25 |
| 2012-06-03 22:00:00 | 1223.75 |
| 2012-06-03 23:00:00 | 1221.75 |
| 2012-06-04 | 1247.5 |
| 2012-06-04 01:00:00 | 1274.75 |
| 2012-06-04 02:00:00 | 1682.75 |
| 2012-06-04 03:00:00 | 1887.25 |
| 2012-06-04 04:00:00 | 2014 |
| 2012-06-04 05:00:00 | 2038.75 |
| 2012-06-04 06:00:00 | 2027.5 |
| 2012-06-04 07:00:00 | 1893.75 |
| 2012-06-04 08:00:00 | 1934.5 |
| 2012-06-04 09:00:00 | 1783.75 |
| 2012-06-04 10:00:00 | 1689.5 |
| 2012-06-04 11:00:00 | 1703.5 |
| 2012-06-04 12:00:00 | 1292.75 |
| 2012-06-04 13:00:00 | 1234.25 |
| 2012-06-04 14:00:00 | 1243 |
| 2012-06-04 15:00:00 | 1403 |
| 2012-06-04 16:00:00 | 1442 |
| 2012-06-04 17:00:00 | 1661.5 |
| 2012-06-04 18:00:00 | 1784.75 |
| 2012-06-04 19:00:00 | 1789.5 |
| 2012-06-04 20:00:00 | 1760.5 |
| 2012-06-04 21:00:00 | 1779.5 |
| 2012-06-04 22:00:00 | 1631 |
| 2012-06-04 23:00:00 | 1518.75 |
| 2012-06-05 | 1604.75 |
| 2012-06-05 01:00:00 | 1587.5 |
| 2012-06-05 02:00:00 | 1600.5 |
| 2012-06-05 03:00:00 | 1477.25 |
| 2012-06-05 04:00:00 | 1340.75 |
| 2012-06-05 05:00:00 | 1242.25 |
| 2012-06-05 06:00:00 | 1094.75 |
| 2012-06-05 07:00:00 | 1150.25 |
| 2012-06-05 08:00:00 | 1179 |
| 2012-06-05 09:00:00 | 1191.75 |
| 2012-06-05 10:00:00 | 1204.75 |
| 2012-06-05 11:00:00 | 1216 |
| 2012-06-05 12:00:00 | 1334 |
| 2012-06-05 13:00:00 | 1868.25 |
| 2012-06-05 14:00:00 | 2147.25 |
| 2012-06-05 15:00:00 | 2051.75 |
| 2012-06-05 16:00:00 | 2180.75 |
| 2012-06-05 17:00:00 | 2339 |
| 2012-06-05 18:00:00 | 2256.75 |
| 2012-06-05 19:00:00 | 2312 |
| 2012-06-05 20:00:00 | 2202.75 |
| 2012-06-05 21:00:00 | 2227 |
| 2012-06-05 22:00:00 | 2119.5 |
| 2012-06-05 23:00:00 | 1904.25 |
| 2012-06-06 | 1796.5 |
| 2012-06-06 01:00:00 | 1757.25 |
| 2012-06-06 02:00:00 | 1598.75 |
| 2012-06-06 03:00:00 | 1361.75 |
| 2012-06-06 04:00:00 | 1210.5 |
| 2012-06-06 05:00:00 | 1199.75 |
| 2012-06-06 06:00:00 | 1181.5 |
| 2012-06-06 07:00:00 | 1195.5 |
| 2012-06-06 08:00:00 | 1218.75 |
| 2012-06-06 09:00:00 | 1219 |
| 2012-06-06 10:00:00 | 1240.25 |
| 2012-06-06 11:00:00 | 1337.25 |
| 2012-06-06 12:00:00 | 1378.5 |
| 2012-06-06 13:00:00 | 1275.75 |
| 2012-06-06 14:00:00 | 1421.75 |
| 2012-06-06 15:00:00 | 1404 |
| 2012-06-06 16:00:00 | 1441 |
| 2012-06-06 17:00:00 | 1491.5 |
| 2012-06-06 18:00:00 | 1340.25 |
| 2012-06-06 19:00:00 | 1376.25 |
| 2012-06-06 20:00:00 | 1387 |
| 2012-06-06 21:00:00 | 1301.5 |
| 2012-06-06 22:00:00 | 1322 |
| 2012-06-06 23:00:00 | 1462.75 |
| 2012-06-07 | 1384 |
| 2012-06-07 01:00:00 | 1315.75 |
| 2012-06-07 02:00:00 | 1306.5 |
| 2012-06-07 03:00:00 | 1226.5 |
| 2012-06-07 04:00:00 | 1238 |
| 2012-06-07 05:00:00 | 1187 |
| 2012-06-07 06:00:00 | 1117.75 |
| 2012-06-07 07:00:00 | 1112.25 |
| 2012-06-07 08:00:00 | 1151.75 |
| 2012-06-07 09:00:00 | 1147.25 |
| 2012-06-07 10:00:00 | 1163.75 |
| 2012-06-07 11:00:00 | 1246 |
| 2012-06-07 12:00:00 | 1252.5 |
| 2012-06-07 13:00:00 | 1275.25 |
| 2012-06-07 14:00:00 | 1337 |
| 2012-06-07 15:00:00 | 1410.5 |
| 2012-06-07 16:00:00 | 1362 |
| 2012-06-07 17:00:00 | 1433.25 |
| 2012-06-07 18:00:00 | 1388.75 |
| 2012-06-07 19:00:00 | 1340 |
| 2012-06-07 20:00:00 | 1378.75 |
| 2012-06-07 21:00:00 | 1343.5 |
| 2012-06-07 22:00:00 | 1390.75 |
| 2012-06-07 23:00:00 | 1386.75 |
| 2012-06-08 | 1343 |
| 2012-06-08 01:00:00 | 1270.75 |
| 2012-06-08 02:00:00 | 1336.75 |
| 2012-06-08 03:00:00 | 1175.75 |
| 2012-06-08 04:00:00 | 1172.5 |
| 2012-06-08 05:00:00 | 1272.25 |
| 2012-06-08 06:00:00 | 1181 |
| 2012-06-08 07:00:00 | 1165.25 |
| 2012-06-08 08:00:00 | 1213 |
| 2012-06-08 09:00:00 | 1220.25 |
| 2012-06-08 10:00:00 | 1397.5 |
| 2012-06-08 11:00:00 | 1383.5 |
| 2012-06-08 12:00:00 | 1319 |
| 2012-06-08 13:00:00 | 1448 |
| 2012-06-08 14:00:00 | 1338.75 |
| 2012-06-08 15:00:00 | 1291.75 |
| 2012-06-08 16:00:00 | 1310 |
| 2012-06-08 17:00:00 | 1368.75 |
| 2012-06-08 18:00:00 | 1423.75 |
| 2012-06-08 19:00:00 | 1337.75 |
| 2012-06-08 20:00:00 | 1312.5 |
| 2012-06-08 21:00:00 | 1249.25 |
| 2012-06-08 22:00:00 | 1267 |
| 2012-06-08 23:00:00 | 1293.5 |
| 2012-06-09 | 1389.5 |
| 2012-06-09 01:00:00 | 1337.75 |
| 2012-06-09 02:00:00 | 1524.75 |
| 2012-06-09 03:00:00 | 1684.25 |
| 2012-06-09 04:00:00 | 1656.25 |
| 2012-06-09 05:00:00 | 1425.25 |
| 2012-06-09 06:00:00 | 1128.5 |
| 2012-06-09 07:00:00 | 1122.5 |
| 2012-06-09 08:00:00 | 1057.5 |
| 2012-06-09 09:00:00 | 1087.75 |
| 2012-06-09 10:00:00 | 1056.25 |
| 2012-06-09 11:00:00 | 1099 |
| 2012-06-09 12:00:00 | 1131.5 |
| 2012-06-09 13:00:00 | 1100.75 |
| 2012-06-09 14:00:00 | 1119 |
| 2012-06-09 15:00:00 | 1159.5 |
| 2012-06-09 16:00:00 | 1234.75 |
| 2012-06-09 17:00:00 | 1203.25 |
| 2012-06-09 18:00:00 | 1230.5 |
| 2012-06-09 19:00:00 | 1234.75 |
| 2012-06-09 20:00:00 | 1214.25 |
| 2012-06-09 21:00:00 | 1147.75 |
| 2012-06-09 22:00:00 | 1223.5 |
| 2012-06-09 23:00:00 | 1215.25 |
| 2012-06-10 | 1165.5 |
| 2012-06-10 01:00:00 | 1204.25 |
| 2012-06-10 02:00:00 | 1194.5 |
| 2012-06-10 03:00:00 | 1089.5 |
| 2012-06-10 04:00:00 | 1151.25 |
| 2012-06-10 05:00:00 | 1041.25 |
| 2012-06-10 06:00:00 | 1054 |
| 2012-06-10 07:00:00 | 1046.75 |
| 2012-06-10 08:00:00 | 1036.5 |
| 2012-06-10 09:00:00 | 1033.25 |
| 2012-06-10 10:00:00 | 1052 |
| 2012-06-10 11:00:00 | 1060.5 |
| 2012-06-10 12:00:00 | 1107 |
| 2012-06-10 13:00:00 | 1173.75 |
| 2012-06-10 14:00:00 | 1132 |
| 2012-06-10 15:00:00 | 1335.75 |
| 2012-06-10 16:00:00 | 1583.5 |
| 2012-06-10 17:00:00 | 1595.75 |
| 2012-06-10 18:00:00 | 1640.5 |
| 2012-06-10 19:00:00 | 1879 |
| 2012-06-10 20:00:00 | 2030 |
| 2012-06-10 21:00:00 | 1783.5 |
| 2012-06-10 22:00:00 | 1811.75 |
| 2012-06-10 23:00:00 | 1643.75 |
| 2012-06-11 | 1629.25 |
| 2012-06-11 01:00:00 | 1585 |
| 2012-06-11 02:00:00 | 1599.75 |
| 2012-06-11 03:00:00 | 1611.25 |
| 2012-06-11 04:00:00 | 1460 |
| 2012-06-11 05:00:00 | 1208.75 |
| 2012-06-11 06:00:00 | 1195.25 |
| 2012-06-11 07:00:00 | 1185.5 |
| 2012-06-11 08:00:00 | 1202.25 |
| 2012-06-11 09:00:00 | 1275.25 |
| 2012-06-11 10:00:00 | 1318.75 |
| 2012-06-11 11:00:00 | 1278.75 |
| 2012-06-11 12:00:00 | 1275 |
| 2012-06-11 13:00:00 | 1254.25 |
| 2012-06-11 14:00:00 | 1294 |
| 2012-06-11 15:00:00 | 1323.5 |
| 2012-06-11 16:00:00 | 1347.5 |
| 2012-06-11 17:00:00 | 1330.75 |
| 2012-06-11 18:00:00 | 1360.75 |
| 2012-06-11 19:00:00 | 1299.5 |
| 2012-06-11 20:00:00 | 1339.75 |
| 2012-06-11 21:00:00 | 1300.25 |
| 2012-06-11 22:00:00 | 1383.25 |
| 2012-06-11 23:00:00 | 1370.25 |
| 2012-06-12 | 1379.75 |
| 2012-06-12 01:00:00 | 1319.75 |
| 2012-06-12 02:00:00 | 1281.75 |
| 2012-06-12 03:00:00 | 1200.75 |
| 2012-06-12 04:00:00 | 1184 |
| 2012-06-12 05:00:00 | 1141 |
| 2012-06-12 06:00:00 | 1119.5 |
| 2012-06-12 07:00:00 | 1107 |
| 2012-06-12 08:00:00 | 1154.25 |
| 2012-06-12 09:00:00 | 1102 |
| 2012-06-12 10:00:00 | 1132.25 |
| 2012-06-12 11:00:00 | 1113.25 |
| 2012-06-12 12:00:00 | 1143 |
| 2012-06-12 13:00:00 | 1093 |
| 2012-06-12 14:00:00 | 1119 |
| 2012-06-12 15:00:00 | 1149.75 |
| 2012-06-12 16:00:00 | 1297 |
| 2012-06-12 17:00:00 | 1351.5 |
| 2012-06-12 18:00:00 | 1539.5 |
| 2012-06-12 19:00:00 | 1601 |
| 2012-06-12 20:00:00 | 1634.75 |
| 2012-06-12 21:00:00 | 1700.5 |
| 2012-06-12 22:00:00 | 1653 |
| 2012-06-12 23:00:00 | 1621.25 |
| 2012-06-13 | 1382.75 |
| 2012-06-13 01:00:00 | 1406.75 |
| 2012-06-13 02:00:00 | 1566.5 |
| 2012-06-13 03:00:00 | 1856 |
| 2012-06-13 04:00:00 | 2016.25 |
| 2012-06-13 05:00:00 | 2242.5 |
| 2012-06-13 06:00:00 | 2146.25 |
| 2012-06-13 07:00:00 | 2062.25 |
| 2012-06-13 08:00:00 | 2218.5 |
| 2012-06-13 09:00:00 | 1977.75 |
| 2012-06-13 10:00:00 | 1973.25 |
| 2012-06-13 11:00:00 | 1845 |
| 2012-06-13 12:00:00 | 2120.25 |
| 2012-06-13 13:00:00 | 2203.5 |
| 2012-06-13 14:00:00 | 2129 |
| 2012-06-13 15:00:00 | 2052 |
| 2012-06-13 16:00:00 | 1812.5 |
| 2012-06-13 17:00:00 | 1792 |
| 2012-06-13 18:00:00 | 1584 |
| 2012-06-13 19:00:00 | 1467.25 |
| 2012-06-13 20:00:00 | 1333.5 |
| 2012-06-13 21:00:00 | 1452.75 |
| 2012-06-13 22:00:00 | 1597 |
| 2012-06-13 23:00:00 | 1561.25 |
| 2012-06-14 | 1498.25 |
| 2012-06-14 01:00:00 | 1694.75 |
| 2012-06-14 02:00:00 | 1777.75 |
| 2012-06-14 03:00:00 | 1832.5 |
| 2012-06-14 04:00:00 | 1860.25 |
| 2012-06-14 05:00:00 | 1768.5 |
| 2012-06-14 06:00:00 | 1657.75 |
| 2012-06-14 07:00:00 | 1531.25 |
| 2012-06-14 08:00:00 | 1581 |
| 2012-06-14 09:00:00 | 1671.75 |
| 2012-06-14 10:00:00 | 1682.25 |
| 2012-06-14 11:00:00 | 1681 |
| 2012-06-14 12:00:00 | 1683 |
| 2012-06-14 13:00:00 | 1944.5 |
| 2012-06-14 14:00:00 | 2056.75 |
| 2012-06-14 15:00:00 | 2210.5 |
| 2012-06-14 16:00:00 | 2347 |
| 2012-06-14 17:00:00 | 2114 |
| 2012-06-14 18:00:00 | 1992.75 |
| 2012-06-14 19:00:00 | 1757.75 |
| 2012-06-14 20:00:00 | 1610 |
| 2012-06-14 21:00:00 | 1609.75 |
| 2012-06-14 22:00:00 | 1724 |
| 2012-06-14 23:00:00 | 1724.75 |
| 2012-06-15 | 1752 |
| 2012-06-15 01:00:00 | 1648 |
| 2012-06-15 02:00:00 | 1573.75 |
| 2012-06-15 03:00:00 | 1523 |
| 2012-06-15 04:00:00 | 1509.5 |
| 2012-06-15 05:00:00 | 1469.25 |
| 2012-06-15 06:00:00 | 1266.25 |
| 2012-06-15 07:00:00 | 1172.5 |
| 2012-06-15 08:00:00 | 1246.25 |
| 2012-06-15 09:00:00 | 1259.5 |
| 2012-06-15 10:00:00 | 1366.5 |
| 2012-06-15 11:00:00 | 1384 |
| 2012-06-15 12:00:00 | 1406 |
| 2012-06-15 13:00:00 | 1505.5 |
| 2012-06-15 14:00:00 | 1621 |
| 2012-06-15 15:00:00 | 1354.75 |
| 2012-06-15 16:00:00 | 1347.25 |
| 2012-06-15 17:00:00 | 1369.5 |
| 2012-06-15 18:00:00 | 1370.25 |
| 2012-06-15 19:00:00 | 1256 |
| 2012-06-15 20:00:00 | 1347.25 |
| 2012-06-15 21:00:00 | 1180.5 |
| 2012-06-15 22:00:00 | 1318 |
| 2012-06-15 23:00:00 | 1307 |
| 2012-06-16 | 1291.75 |
| 2012-06-16 01:00:00 | 1264.25 |
| 2012-06-16 02:00:00 | 1225.75 |
| 2012-06-16 03:00:00 | 1181.75 |
| 2012-06-16 04:00:00 | 1184.75 |
| 2012-06-16 05:00:00 | 1153.25 |
| 2012-06-16 06:00:00 | 995.5 |
| 2012-06-16 07:00:00 | 964.25 |
| 2012-06-16 08:00:00 | 962 |
| 2012-06-16 09:00:00 | 974 |
| 2012-06-16 10:00:00 | 999.5 |
| 2012-06-16 11:00:00 | 1021.75 |
| 2012-06-16 12:00:00 | 1046 |
| 2012-06-16 13:00:00 | 1076 |
| 2012-06-16 14:00:00 | 1188.25 |
| 2012-06-16 15:00:00 | 1196.5 |
| 2012-06-16 16:00:00 | 1286.75 |
| 2012-06-16 17:00:00 | 1277.75 |
| 2012-06-16 18:00:00 | 1270.5 |
| 2012-06-16 19:00:00 | 1216.25 |
| 2012-06-16 20:00:00 | 1210.25 |
| 2012-06-16 21:00:00 | 1156.75 |
| 2012-06-16 22:00:00 | 1174.5 |
| 2012-06-16 23:00:00 | 1144 |
| 2012-06-17 | 1253.5 |
| 2012-06-17 01:00:00 | 1045.25 |
| 2012-06-17 02:00:00 | 1160.75 |
| 2012-06-17 03:00:00 | 1038.75 |
| 2012-06-17 04:00:00 | 1015.5 |
| 2012-06-17 05:00:00 | 980.5 |
| 2012-06-17 06:00:00 | 962 |
| 2012-06-17 07:00:00 | 957 |
| 2012-06-17 08:00:00 | 959.25 |
| 2012-06-17 09:00:00 | 964.5 |
| 2012-06-17 10:00:00 | 978.75 |
| 2012-06-17 11:00:00 | 996.5 |
| 2012-06-17 12:00:00 | 1033.75 |
| 2012-06-17 13:00:00 | 1095.75 |
| 2012-06-17 14:00:00 | 1152.5 |
| 2012-06-17 15:00:00 | 1216 |
| 2012-06-17 16:00:00 | 1264.75 |
| 2012-06-17 17:00:00 | 1267.25 |
| 2012-06-17 18:00:00 | 1277.25 |
| 2012-06-17 19:00:00 | 1240.5 |
| 2012-06-17 20:00:00 | 1209.5 |
| 2012-06-17 21:00:00 | 1200.5 |
| 2012-06-17 22:00:00 | 1161 |
| 2012-06-17 23:00:00 | 1228.25 |
| 2012-06-18 | 1250 |
| 2012-06-18 01:00:00 | 1289.75 |
| 2012-06-18 02:00:00 | 1251 |
| 2012-06-18 03:00:00 | 1235.25 |
| 2012-06-18 04:00:00 | 1233 |
| 2012-06-18 05:00:00 | 1100.75 |
| 2012-06-18 06:00:00 | 1156.5 |
| 2012-06-18 07:00:00 | 1099.5 |
| 2012-06-18 08:00:00 | 1139.5 |
| 2012-06-18 09:00:00 | 1200.5 |
| 2012-06-18 10:00:00 | 1278 |
| 2012-06-18 11:00:00 | 1386.75 |
| 2012-06-18 12:00:00 | 1407 |
| 2012-06-18 13:00:00 | 1307.25 |
| 2012-06-18 14:00:00 | 1336.25 |
| 2012-06-18 15:00:00 | 1300 |
| 2012-06-18 16:00:00 | 1277.25 |
| 2012-06-18 17:00:00 | 1245.75 |
| 2012-06-18 18:00:00 | 1320.75 |
| 2012-06-18 19:00:00 | 1330.75 |
| 2012-06-18 20:00:00 | 1367 |
| 2012-06-18 21:00:00 | 1347.5 |
| 2012-06-18 22:00:00 | 1420.5 |
| 2012-06-18 23:00:00 | 1471 |
| 2012-06-19 | 1496.5 |
| 2012-06-19 01:00:00 | 1407.75 |
| 2012-06-19 02:00:00 | 1372.5 |
| 2012-06-19 03:00:00 | 1365 |
| 2012-06-19 04:00:00 | 1313 |
| 2012-06-19 05:00:00 | 1221 |
| 2012-06-19 06:00:00 | 1161 |
| 2012-06-19 07:00:00 | 1229.75 |
| 2012-06-19 08:00:00 | 1180.75 |
| 2012-06-19 09:00:00 | 1230.25 |
| 2012-06-19 10:00:00 | 1253 |
| 2012-06-19 11:00:00 | 1305 |
| 2012-06-19 12:00:00 | 1285.25 |
| 2012-06-19 13:00:00 | 1229.75 |
| 2012-06-19 14:00:00 | 1269 |
| 2012-06-19 15:00:00 | 1369.75 |
| 2012-06-19 16:00:00 | 1306 |
| 2012-06-19 17:00:00 | 1233.75 |
| 2012-06-19 18:00:00 | 1253.25 |
| 2012-06-19 19:00:00 | 1236 |
| 2012-06-19 20:00:00 | 1351.25 |
| 2012-06-19 21:00:00 | 1284.5 |
| 2012-06-19 22:00:00 | 1349.25 |
| 2012-06-19 23:00:00 | 1319.5 |
| 2012-06-20 | 1259.75 |
| 2012-06-20 01:00:00 | 1191.75 |
| 2012-06-20 02:00:00 | 1157.75 |
| 2012-06-20 03:00:00 | 1136.5 |
| 2012-06-20 04:00:00 | 1104.5 |
| 2012-06-20 05:00:00 | 1078 |
| 2012-06-20 06:00:00 | 1052 |
| 2012-06-20 07:00:00 | 1062.25 |
| 2012-06-20 08:00:00 | 1068.75 |
| 2012-06-20 09:00:00 | 1031 |
| 2012-06-20 10:00:00 | 1169.5 |
| 2012-06-20 11:00:00 | 1118.5 |
| 2012-06-20 12:00:00 | 1202.75 |
| 2012-06-20 13:00:00 | 1237 |
| 2012-06-20 14:00:00 | 1272.75 |
| 2012-06-20 15:00:00 | 1243.75 |
| 2012-06-20 16:00:00 | 1202.75 |
| 2012-06-20 17:00:00 | 1201 |
| 2012-06-20 18:00:00 | 1268.25 |
| 2012-06-20 19:00:00 | 1347.25 |
| 2012-06-20 20:00:00 | 1356 |
| 2012-06-20 21:00:00 | 1216.5 |
| 2012-06-20 22:00:00 | 1179 |
| 2012-06-20 23:00:00 | 1167.75 |
| 2012-06-21 | 1162 |
| 2012-06-21 01:00:00 | 1144.75 |
| 2012-06-21 02:00:00 | 1211 |
| 2012-06-21 03:00:00 | 1186 |
| 2012-06-21 04:00:00 | 1154.25 |
| 2012-06-21 05:00:00 | 1076.5 |
| 2012-06-21 06:00:00 | 1060 |
| 2012-06-21 07:00:00 | 1204.75 |
| 2012-06-21 08:00:00 | 1548 |
| 2012-06-21 09:00:00 | 1643.25 |
| 2012-06-21 10:00:00 | 1628.25 |
| 2012-06-21 11:00:00 | 1651.25 |
| 2012-06-21 12:00:00 | 1655.75 |
| 2012-06-21 13:00:00 | 1621.5 |
| 2012-06-21 14:00:00 | 1257.5 |
| 2012-06-21 15:00:00 | 1204 |
| 2012-06-21 16:00:00 | 1184.5 |
| 2012-06-21 17:00:00 | 1146 |
| 2012-06-21 18:00:00 | 1223.5 |
| 2012-06-21 19:00:00 | 1199.25 |
| 2012-06-21 20:00:00 | 1260.5 |
| 2012-06-21 21:00:00 | 1204.75 |
| 2012-06-21 22:00:00 | 1216.25 |
| 2012-06-21 23:00:00 | 1200.75 |
| 2012-06-22 | 1188.25 |
| 2012-06-22 01:00:00 | 1164.25 |
| 2012-06-22 02:00:00 | 1106.25 |
| 2012-06-22 03:00:00 | 1093 |
| 2012-06-22 04:00:00 | 1040 |
| 2012-06-22 05:00:00 | 999.25 |
| 2012-06-22 06:00:00 | 980.75 |
| 2012-06-22 07:00:00 | 1199 |
| 2012-06-22 08:00:00 | 1617.5 |
| 2012-06-22 09:00:00 | 1776.5 |
| 2012-06-22 10:00:00 | 1761.25 |
| 2012-06-22 11:00:00 | 1718.25 |
| 2012-06-22 12:00:00 | 1415.75 |
| 2012-06-22 13:00:00 | 1445 |
| 2012-06-22 14:00:00 | 1355 |
| 2012-06-22 15:00:00 | 1280 |
| 2012-06-22 16:00:00 | 1275.5 |
| 2012-06-22 17:00:00 | 1418.5 |
| 2012-06-22 18:00:00 | 1702.5 |
| 2012-06-22 19:00:00 | 2040.75 |
| 2012-06-22 20:00:00 | 1839.25 |
| 2012-06-22 21:00:00 | 1694.5 |
| 2012-06-22 22:00:00 | 1527 |
| 2012-06-22 23:00:00 | 1487.25 |
| 2012-06-23 | 1231 |
| 2012-06-23 01:00:00 | 1175.5 |
| 2012-06-23 02:00:00 | 1124 |
| 2012-06-23 03:00:00 | 1087.5 |
| 2012-06-23 04:00:00 | 1068.5 |
| 2012-06-23 05:00:00 | 1082.75 |
| 2012-06-23 06:00:00 | 1035.25 |
| 2012-06-23 07:00:00 | 1067.5 |
| 2012-06-23 08:00:00 | 1055.5 |
| 2012-06-23 09:00:00 | 1077.25 |
| 2012-06-23 10:00:00 | 1067.25 |
| 2012-06-23 11:00:00 | 1094.75 |
| 2012-06-23 12:00:00 | 1087.75 |
| 2012-06-23 13:00:00 | 1112 |
| 2012-06-23 14:00:00 | 1045.5 |
| 2012-06-23 15:00:00 | 1037 |
| 2012-06-23 16:00:00 | 1050.75 |
| 2012-06-23 17:00:00 | 1024.5 |
| 2012-06-23 18:00:00 | 1012 |
| 2012-06-23 19:00:00 | 1172 |
| 2012-06-23 20:00:00 | 1055.25 |
| 2012-06-23 21:00:00 | 1049.75 |
| 2012-06-23 22:00:00 | 1049 |
| 2012-06-23 23:00:00 | 1051.25 |
| 2012-06-24 | 1019 |
| 2012-06-24 01:00:00 | 1033.25 |
| 2012-06-24 02:00:00 | 1012.25 |
| 2012-06-24 03:00:00 | 1009.25 |
| 2012-06-24 04:00:00 | 1000 |
| 2012-06-24 05:00:00 | 996.25 |
| 2012-06-24 06:00:00 | 964.75 |
| 2012-06-24 07:00:00 | 962 |
| 2012-06-24 08:00:00 | 966.75 |
| 2012-06-24 09:00:00 | 986 |
| 2012-06-24 10:00:00 | 992.25 |
| 2012-06-24 11:00:00 | 996.25 |
| 2012-06-24 12:00:00 | 1017.5 |
| 2012-06-24 13:00:00 | 1020 |
| 2012-06-24 14:00:00 | 1017.25 |
| 2012-06-24 15:00:00 | 1049.25 |
| 2012-06-24 16:00:00 | 1057.25 |
| 2012-06-24 17:00:00 | 1095 |
| 2012-06-24 18:00:00 | 1123.5 |
| 2012-06-24 19:00:00 | 1103.75 |
| 2012-06-24 20:00:00 | 1092.75 |
| 2012-06-24 21:00:00 | 1169.5 |
| 2012-06-24 22:00:00 | 1223.5 |
| 2012-06-24 23:00:00 | 1219.5 |
| 2012-06-25 | 1170 |
| 2012-06-25 01:00:00 | 1237.5 |
| 2012-06-25 02:00:00 | 1218 |
| 2012-06-25 03:00:00 | 1184.75 |
| 2012-06-25 04:00:00 | 1175.25 |
| 2012-06-25 05:00:00 | 1158.75 |
| 2012-06-25 06:00:00 | 1140 |
| 2012-06-25 07:00:00 | 1053.25 |
| 2012-06-25 08:00:00 | 1087.5 |
| 2012-06-25 09:00:00 | 1103.5 |
| 2012-06-25 10:00:00 | 1128.25 |
| 2012-06-25 11:00:00 | 1112 |
| 2012-06-25 12:00:00 | 1134.75 |
| 2012-06-25 13:00:00 | 1145 |
| 2012-06-25 14:00:00 | 1177.75 |
| 2012-06-25 15:00:00 | 1083.25 |
| 2012-06-25 16:00:00 | 1096.5 |
| 2012-06-25 17:00:00 | 1057 |
| 2012-06-25 18:00:00 | 1073.75 |
| 2012-06-25 19:00:00 | 1039.5 |
| 2012-06-25 20:00:00 | 1068.25 |
| 2012-06-25 21:00:00 | 1046.25 |
| 2012-06-25 22:00:00 | 1244 |
| 2012-06-25 23:00:00 | 1328 |
| 2012-06-26 | 1341.5 |
| 2012-06-26 01:00:00 | 1320.75 |
| 2012-06-26 02:00:00 | 1274.75 |
| 2012-06-26 03:00:00 | 1128.5 |
| 2012-06-26 04:00:00 | 1006 |
| 2012-06-26 05:00:00 | 1008 |
| 2012-06-26 06:00:00 | 980.5 |
| 2012-06-26 07:00:00 | 961.25 |
| 2012-06-26 08:00:00 | 1018 |
| 2012-06-26 09:00:00 | 1007 |
| 2012-06-26 10:00:00 | 1033.25 |
| 2012-06-26 11:00:00 | 937.75 |
| 2012-06-26 12:00:00 | 1056.5 |
| 2012-06-26 13:00:00 | 1067.25 |
| 2012-06-26 14:00:00 | 1065.25 |
| 2012-06-26 15:00:00 | 1120.75 |
| 2012-06-26 16:00:00 | 1106.75 |
| 2012-06-26 17:00:00 | 1061.25 |
| 2012-06-26 18:00:00 | 1156 |
| 2012-06-26 19:00:00 | 1068.25 |
| 2012-06-26 20:00:00 | 1138.5 |
| 2012-06-26 21:00:00 | 1145.25 |
| 2012-06-26 22:00:00 | 1132.25 |
| 2012-06-26 23:00:00 | 1185.25 |
| 2012-06-27 | 1292 |
| 2012-06-27 01:00:00 | 1251.25 |
| 2012-06-27 02:00:00 | 1214.25 |
| 2012-06-27 03:00:00 | 1146 |
| 2012-06-27 04:00:00 | 1094.25 |
| 2012-06-27 05:00:00 | 1022.5 |
| 2012-06-27 06:00:00 | 1027 |
| 2012-06-27 07:00:00 | 1029 |
| 2012-06-27 08:00:00 | 1035.25 |
| 2012-06-27 09:00:00 | 990.25 |
| 2012-06-27 10:00:00 | 1082.5 |
| 2012-06-27 11:00:00 | 1050 |
| 2012-06-27 12:00:00 | 1101.25 |
| 2012-06-27 13:00:00 | 1172.5 |
| 2012-06-27 14:00:00 | 1197.75 |
| 2012-06-27 15:00:00 | 1210.5 |
| 2012-06-27 16:00:00 | 1264.25 |
| 2012-06-27 17:00:00 | 1220.5 |
| 2012-06-27 18:00:00 | 1177.5 |
| 2012-06-27 19:00:00 | 1199 |
| 2012-06-27 20:00:00 | 1238 |
| 2012-06-27 21:00:00 | 1152.25 |
| 2012-06-27 22:00:00 | 1207.75 |
| 2012-06-27 23:00:00 | 1044.5 |
| 2012-06-28 | 982.25 |
| 2012-06-28 01:00:00 | 1001.75 |
| 2012-06-28 02:00:00 | 1008.75 |
| 2012-06-28 03:00:00 | 1003 |
| 2012-06-28 04:00:00 | 1001 |
| 2012-06-28 05:00:00 | 985 |
| 2012-06-28 06:00:00 | 958.75 |
| 2012-06-28 07:00:00 | 1028.75 |
| 2012-06-28 08:00:00 | 1175 |
| 2012-06-28 09:00:00 | 1228.5 |
| 2012-06-28 10:00:00 | 1187.5 |
| 2012-06-28 11:00:00 | 1133.75 |
| 2012-06-28 12:00:00 | 1234.75 |
| 2012-06-28 13:00:00 | 1033 |
| 2012-06-28 14:00:00 | 1075.25 |
| 2012-06-28 15:00:00 | 1153.25 |
| 2012-06-28 16:00:00 | 1190.25 |
| 2012-06-28 17:00:00 | 1192.25 |
| 2012-06-28 18:00:00 | 1163.75 |
| 2012-06-28 19:00:00 | 1160 |
| 2012-06-28 20:00:00 | 1152 |
| 2012-06-28 21:00:00 | 1164 |
| 2012-06-28 22:00:00 | 1125.75 |
| 2012-06-28 23:00:00 | 1158 |
| 2012-06-29 | 1102.75 |
| 2012-06-29 01:00:00 | 1141.5 |
| 2012-06-29 02:00:00 | 1096.25 |
| 2012-06-29 03:00:00 | 1105.5 |
| 2012-06-29 04:00:00 | 1042.25 |
| 2012-06-29 05:00:00 | 1054 |
| 2012-06-29 06:00:00 | 1013 |
| 2012-06-29 07:00:00 | 1121 |
| 2012-06-29 08:00:00 | 1086.25 |
| 2012-06-29 09:00:00 | 1078.75 |
| 2012-06-29 10:00:00 | 1058.75 |
| 2012-06-29 11:00:00 | 1118.75 |
| 2012-06-29 12:00:00 | 1121.75 |
| 2012-06-29 13:00:00 | 1169.5 |
| 2012-06-29 14:00:00 | 1127.5 |
| 2012-06-29 15:00:00 | 1115 |
| 2012-06-29 16:00:00 | 1243 |
| 2012-06-29 17:00:00 | 1239 |
| 2012-06-29 18:00:00 | 1228.75 |
| 2012-06-29 19:00:00 | 1308.25 |
| 2012-06-29 20:00:00 | 1287.5 |
| 2012-06-29 21:00:00 | 1256 |
| 2012-06-29 22:00:00 | 1231.75 |
| 2012-06-29 23:00:00 | 1305.5 |
| 2012-06-30 | 1282.75 |
| 2012-06-30 01:00:00 | 1240.75 |
| 2012-06-30 02:00:00 | 1156.25 |
| 2012-06-30 03:00:00 | 1202 |
| 2012-06-30 04:00:00 | 1135.25 |
| 2012-06-30 05:00:00 | 1076.75 |
| 2012-06-30 06:00:00 | 996.5 |
| 2012-06-30 07:00:00 | 1028.75 |
| 2012-06-30 08:00:00 | 997.75 |
| 2012-06-30 09:00:00 | 1016.75 |
| 2012-06-30 10:00:00 | 1018.25 |
| 2012-06-30 11:00:00 | 1075.75 |
| 2012-06-30 12:00:00 | 1082 |
| 2012-06-30 13:00:00 | 1182.25 |
| 2012-06-30 14:00:00 | 1222.5 |
| 2012-06-30 15:00:00 | 1183.5 |
| 2012-06-30 16:00:00 | 1134.5 |
| 2012-06-30 17:00:00 | 1145.25 |
| 2012-06-30 18:00:00 | 1188.25 |
| 2012-06-30 19:00:00 | 1213 |
| 2012-06-30 20:00:00 | 1198.5 |
| 2012-06-30 21:00:00 | 1145.25 |
| 2012-06-30 22:00:00 | 1175 |
| 2012-06-30 23:00:00 | 1149.5 |
| 2012-07-01 | 1147 |
| 2012-07-01 01:00:00 | 1170 |
| 2012-07-01 02:00:00 | 1064.75 |
| 2012-07-01 03:00:00 | 1131 |
| 2012-07-01 04:00:00 | 1030.75 |
| 2012-07-01 05:00:00 | 1020 |
| 2012-07-01 06:00:00 | 982 |
| 2012-07-01 07:00:00 | 999.5 |
| 2012-07-01 08:00:00 | 1012 |
| 2012-07-01 09:00:00 | 1035.5 |
| 2012-07-01 10:00:00 | 1021.5 |
| 2012-07-01 11:00:00 | 1055 |
| 2012-07-01 12:00:00 | 1071.25 |
| 2012-07-01 13:00:00 | 1157.25 |
| 2012-07-01 14:00:00 | 1099.25 |
| 2012-07-01 15:00:00 | 1142.25 |
| 2012-07-01 16:00:00 | 1111.5 |
| 2012-07-01 17:00:00 | 1115.25 |
| 2012-07-01 18:00:00 | 1123.25 |
| 2012-07-01 19:00:00 | 1131.75 |
| 2012-07-01 20:00:00 | 1139.5 |
| 2012-07-01 21:00:00 | 1149.25 |
| 2012-07-01 22:00:00 | 1189.5 |
| 2012-07-01 23:00:00 | 1191.75 |
| 2012-07-02 | 1183.75 |
| 2012-07-02 01:00:00 | 1191 |
| 2012-07-02 02:00:00 | 1217 |
| 2012-07-02 03:00:00 | 1291.5 |
| 2012-07-02 04:00:00 | 1284 |
| 2012-07-02 05:00:00 | 1234 |
| 2012-07-02 06:00:00 | 1216.75 |
| 2012-07-02 07:00:00 | 1135.75 |
| 2012-07-02 08:00:00 | 1063.75 |
| 2012-07-02 09:00:00 | 1080.75 |
| 2012-07-02 10:00:00 | 1105.75 |
| 2012-07-02 11:00:00 | 1183.75 |
| 2012-07-02 12:00:00 | 1206.25 |
| 2012-07-02 13:00:00 | 1196.25 |
| 2012-07-02 14:00:00 | 1269.5 |
| 2012-07-02 15:00:00 | 1272 |
| 2012-07-02 16:00:00 | 1280.25 |
| 2012-07-02 17:00:00 | 1242 |
| 2012-07-02 18:00:00 | 1264.25 |
| 2012-07-02 19:00:00 | 1235.5 |
| 2012-07-02 20:00:00 | 1258.5 |
| 2012-07-02 21:00:00 | 1248.25 |
| 2012-07-02 22:00:00 | 1310.75 |
| 2012-07-02 23:00:00 | 1289.25 |
| 2012-07-03 | 1311 |
| 2012-07-03 01:00:00 | 1277 |
| 2012-07-03 02:00:00 | 1290.25 |
| 2012-07-03 03:00:00 | 1284.75 |
| 2012-07-03 04:00:00 | 1099 |
| 2012-07-03 05:00:00 | 1042.25 |
| 2012-07-03 06:00:00 | 1073.5 |
| 2012-07-03 07:00:00 | 1018.75 |
| 2012-07-03 08:00:00 | 1133.75 |
| 2012-07-03 09:00:00 | 1029 |
| 2012-07-03 10:00:00 | 1127 |
| 2012-07-03 11:00:00 | 1143 |
| 2012-07-03 12:00:00 | 1247.25 |
| 2012-07-03 13:00:00 | 1296.25 |
| 2012-07-03 14:00:00 | 1244.25 |
| 2012-07-03 15:00:00 | 1253.75 |
| 2012-07-03 16:00:00 | 1323.25 |
| 2012-07-03 17:00:00 | 1221.25 |
| 2012-07-03 18:00:00 | 1256.5 |
| 2012-07-03 19:00:00 | 1260.75 |
| 2012-07-03 20:00:00 | 1367.5 |
| 2012-07-03 21:00:00 | 1551.5 |
| 2012-07-03 22:00:00 | 1637.75 |
| 2012-07-03 23:00:00 | 1722 |
| 2012-07-04 | 1743.75 |
| 2012-07-04 01:00:00 | 1628.75 |
| 2012-07-04 02:00:00 | 1622.5 |
| 2012-07-04 03:00:00 | 1431 |
| 2012-07-04 04:00:00 | 1285 |
| 2012-07-04 05:00:00 | 1092 |
| 2012-07-04 06:00:00 | 1068.25 |
| 2012-07-04 07:00:00 | 1039.5 |
| 2012-07-04 08:00:00 | 1112.5 |
| 2012-07-04 09:00:00 | 1094.5 |
| 2012-07-04 10:00:00 | 1136 |
| 2012-07-04 11:00:00 | 1121.25 |
| 2012-07-04 12:00:00 | 1237.5 |
| 2012-07-04 13:00:00 | 1221.5 |
| 2012-07-04 14:00:00 | 1263.75 |
| 2012-07-04 15:00:00 | 1165 |
| 2012-07-04 16:00:00 | 1319.5 |
| 2012-07-04 17:00:00 | 1095.25 |
| 2012-07-04 18:00:00 | 1257 |
| 2012-07-04 19:00:00 | 1313.25 |
| 2012-07-04 20:00:00 | 1247.5 |
| 2012-07-04 21:00:00 | 1210 |
| 2012-07-04 22:00:00 | 1038.5 |
| 2012-07-04 23:00:00 | 1156.5 |
| 2012-07-05 | 1302.25 |
| 2012-07-05 01:00:00 | 1322.25 |
| 2012-07-05 02:00:00 | 1366.25 |
| 2012-07-05 03:00:00 | 1222 |
| 2012-07-05 04:00:00 | 1209 |
| 2012-07-05 05:00:00 | 1006 |
| 2012-07-05 06:00:00 | 1003.75 |
| 2012-07-05 07:00:00 | 937.25 |
| 2012-07-05 08:00:00 | 934.75 |
| 2012-07-05 09:00:00 | 918.75 |
| 2012-07-05 10:00:00 | 968.25 |
| 2012-07-05 11:00:00 | 985 |
| 2012-07-05 12:00:00 | 1008.25 |
| 2012-07-05 13:00:00 | 1086.75 |
| 2012-07-05 14:00:00 | 996.5 |
| 2012-07-05 15:00:00 | 977.25 |
| 2012-07-05 16:00:00 | 1046.5 |
| 2012-07-05 17:00:00 | 1069 |
| 2012-07-05 18:00:00 | 1097 |
| 2012-07-05 19:00:00 | 1071.25 |
| 2012-07-05 20:00:00 | 1131.25 |
| 2012-07-05 21:00:00 | 1139.5 |
| 2012-07-05 22:00:00 | 1109 |
| 2012-07-05 23:00:00 | 1161.5 |
| 2012-07-06 | 1089 |
| 2012-07-06 01:00:00 | 1090.25 |
| 2012-07-06 02:00:00 | 1078.25 |
| 2012-07-06 03:00:00 | 974.25 |
| 2012-07-06 04:00:00 | 951.75 |
| 2012-07-06 05:00:00 | 949 |
| 2012-07-06 06:00:00 | 902.25 |
| 2012-07-06 07:00:00 | 914.25 |
| 2012-07-06 08:00:00 | 914.5 |
| 2012-07-06 09:00:00 | 919 |
| 2012-07-06 10:00:00 | 936.75 |
| 2012-07-06 11:00:00 | 979 |
| 2012-07-06 12:00:00 | 984.25 |
| 2012-07-06 13:00:00 | 986.75 |
| 2012-07-06 14:00:00 | 975 |
| 2012-07-06 15:00:00 | 984 |
| 2012-07-06 16:00:00 | 977.25 |
| 2012-07-06 17:00:00 | 986 |
| 2012-07-06 18:00:00 | 1016 |
| 2012-07-06 19:00:00 | 1030.75 |
| 2012-07-06 20:00:00 | 1017.75 |
| 2012-07-06 21:00:00 | 1008.75 |
| 2012-07-06 22:00:00 | 1041.5 |
| 2012-07-06 23:00:00 | 1092.75 |
| 2012-07-07 | 1071.75 |
| 2012-07-07 01:00:00 | 1151 |
| 2012-07-07 02:00:00 | 1593.75 |
| 2012-07-07 03:00:00 | 1805.5 |
| 2012-07-07 04:00:00 | 1679 |
| 2012-07-07 05:00:00 | 1645.25 |
| 2012-07-07 06:00:00 | 1443.5 |
| 2012-07-07 07:00:00 | 1456.25 |
| 2012-07-07 08:00:00 | 1145 |
| 2012-07-07 09:00:00 | 993.5 |
| 2012-07-07 10:00:00 | 949.25 |
| 2012-07-07 11:00:00 | 999 |
| 2012-07-07 12:00:00 | 992.25 |
| 2012-07-07 13:00:00 | 998.75 |
| 2012-07-07 14:00:00 | 981 |
| 2012-07-07 15:00:00 | 1004 |
| 2012-07-07 16:00:00 | 968.75 |
| 2012-07-07 17:00:00 | 995.5 |
| 2012-07-07 18:00:00 | 973.75 |
| 2012-07-07 19:00:00 | 1018.75 |
| 2012-07-07 20:00:00 | 1002 |
| 2012-07-07 21:00:00 | 994.75 |
| 2012-07-07 22:00:00 | 1059 |
| 2012-07-07 23:00:00 | 1044.75 |
| 2012-07-08 | 1093 |
| 2012-07-08 01:00:00 | 1078.75 |
| 2012-07-08 02:00:00 | 1037.5 |
| 2012-07-08 03:00:00 | 1049.75 |
| 2012-07-08 04:00:00 | 940.5 |
| 2012-07-08 05:00:00 | 970.75 |
| 2012-07-08 06:00:00 | 924.5 |
| 2012-07-08 07:00:00 | 957 |
| 2012-07-08 08:00:00 | 923.25 |
| 2012-07-08 09:00:00 | 935.25 |
| 2012-07-08 10:00:00 | 939.75 |
| 2012-07-08 11:00:00 | 977 |
| 2012-07-08 12:00:00 | 975 |
| 2012-07-08 13:00:00 | 992.25 |
| 2012-07-08 14:00:00 | 979 |
| 2012-07-08 15:00:00 | 989.25 |
| 2012-07-08 16:00:00 | 970.75 |
| 2012-07-08 17:00:00 | 979.75 |
| 2012-07-08 18:00:00 | 1001.75 |
| 2012-07-08 19:00:00 | 979.5 |
| 2012-07-08 20:00:00 | 1194.25 |
| 2012-07-08 21:00:00 | 1293.25 |
| 2012-07-08 22:00:00 | 1469.75 |
| 2012-07-08 23:00:00 | 1547 |
| 2012-07-09 | 1568.5 |
| 2012-07-09 01:00:00 | 1522.5 |
| 2012-07-09 02:00:00 | 1141 |
| 2012-07-09 03:00:00 | 1104.5 |
| 2012-07-09 04:00:00 | 1088 |
| 2012-07-09 05:00:00 | 1057.25 |
| 2012-07-09 06:00:00 | 1031.5 |
| 2012-07-09 07:00:00 | 1027.5 |
| 2012-07-09 08:00:00 | 1065.25 |
| 2012-07-09 09:00:00 | 1068 |
| 2012-07-09 10:00:00 | 1069.5 |
| 2012-07-09 11:00:00 | 1091.75 |
| 2012-07-09 12:00:00 | 1137.5 |
| 2012-07-09 13:00:00 | 1164.5 |
| 2012-07-09 14:00:00 | 1167 |
| 2012-07-09 15:00:00 | 1195.75 |
| 2012-07-09 16:00:00 | 1185.25 |
| 2012-07-09 17:00:00 | 1161 |
| 2012-07-09 18:00:00 | 1171.25 |
| 2012-07-09 19:00:00 | 1159 |
| 2012-07-09 20:00:00 | 1172.75 |
| 2012-07-09 21:00:00 | 1200.5 |
| 2012-07-09 22:00:00 | 1330.5 |
| 2012-07-09 23:00:00 | 1281.75 |
| 2012-07-10 | 1293.25 |
| 2012-07-10 01:00:00 | 1261.75 |
| 2012-07-10 02:00:00 | 1269.5 |
| 2012-07-10 03:00:00 | 1297 |
| 2012-07-10 04:00:00 | 1204.25 |
| 2012-07-10 05:00:00 | 1077.75 |
| 2012-07-10 06:00:00 | 1027.5 |
| 2012-07-10 07:00:00 | 1019.25 |
| 2012-07-10 08:00:00 | 1068.25 |
| 2012-07-10 09:00:00 | 1035.25 |
| 2012-07-10 10:00:00 | 1145 |
| 2012-07-10 11:00:00 | 1225.25 |
| 2012-07-10 12:00:00 | 1209.75 |
| 2012-07-10 13:00:00 | 1241.75 |
| 2012-07-10 14:00:00 | 1268 |
| 2012-07-10 15:00:00 | 1213.75 |
| 2012-07-10 16:00:00 | 1298 |
| 2012-07-10 17:00:00 | 1264.75 |
| 2012-07-10 18:00:00 | 1274.25 |
| 2012-07-10 19:00:00 | 1228.75 |
| 2012-07-10 20:00:00 | 1191.25 |
| 2012-07-10 21:00:00 | 1201 |
| 2012-07-10 22:00:00 | 1328 |
| 2012-07-10 23:00:00 | 1240.25 |
| 2012-07-11 | 1252.25 |
| 2012-07-11 01:00:00 | 1199.75 |
| 2012-07-11 02:00:00 | 1228 |
| 2012-07-11 03:00:00 | 1199.25 |
| 2012-07-11 04:00:00 | 1228.25 |
| 2012-07-11 05:00:00 | 1054.25 |
| 2012-07-11 06:00:00 | 1066 |
| 2012-07-11 07:00:00 | 1040 |
| 2012-07-11 08:00:00 | 1099 |
| 2012-07-11 09:00:00 | 1072.25 |
| 2012-07-11 10:00:00 | 1123.5 |
| 2012-07-11 11:00:00 | 1099.5 |
| 2012-07-11 12:00:00 | 1215.75 |
| 2012-07-11 13:00:00 | 1195.5 |
| 2012-07-11 14:00:00 | 1190.75 |
| 2012-07-11 15:00:00 | 1110.75 |
| 2012-07-11 16:00:00 | 1193.75 |
| 2012-07-11 17:00:00 | 1516.25 |
| 2012-07-11 18:00:00 | 1949.25 |
| 2012-07-11 19:00:00 | 1946 |
| 2012-07-11 20:00:00 | 1678.5 |
| 2012-07-11 21:00:00 | 1548.75 |
| 2012-07-11 22:00:00 | 1472.75 |
| 2012-07-11 23:00:00 | 1241.25 |
| 2012-07-12 | 1262.25 |
| 2012-07-12 01:00:00 | 1240.75 |
| 2012-07-12 02:00:00 | 1227.75 |
| 2012-07-12 03:00:00 | 1256.75 |
| 2012-07-12 04:00:00 | 1210.5 |
| 2012-07-12 05:00:00 | 1093.75 |
| 2012-07-12 06:00:00 | 1100 |
| 2012-07-12 07:00:00 | 1115.5 |
| 2012-07-12 08:00:00 | 1145.25 |
| 2012-07-12 09:00:00 | 1100.25 |
| 2012-07-12 10:00:00 | 1191.5 |
| 2012-07-12 11:00:00 | 1207.75 |
| 2012-07-12 12:00:00 | 1274 |
| 2012-07-12 13:00:00 | 1250.25 |
| 2012-07-12 14:00:00 | 1206.75 |
| 2012-07-12 15:00:00 | 1196.5 |
| 2012-07-12 16:00:00 | 1247.5 |
| 2012-07-12 17:00:00 | 1242 |
| 2012-07-12 18:00:00 | 1213 |
| 2012-07-12 19:00:00 | 1166.25 |
| 2012-07-12 20:00:00 | 1234 |
| 2012-07-12 21:00:00 | 1294 |
| 2012-07-12 22:00:00 | 1213 |
| 2012-07-12 23:00:00 | 1282 |
| 2012-07-13 | 1286 |
| 2012-07-13 01:00:00 | 1296.5 |
| 2012-07-13 02:00:00 | 1221.25 |
| 2012-07-13 03:00:00 | 1063.5 |
| 2012-07-13 04:00:00 | 1074.5 |
| 2012-07-13 05:00:00 | 975.5 |
| 2012-07-13 06:00:00 | 956 |
| 2012-07-13 07:00:00 | 950.5 |
| 2012-07-13 08:00:00 | 979.5 |
| 2012-07-13 09:00:00 | 985.75 |
| 2012-07-13 10:00:00 | 1010.5 |
| 2012-07-13 11:00:00 | 1022.25 |
| 2012-07-13 12:00:00 | 1026.25 |
| 2012-07-13 13:00:00 | 1067.25 |
| 2012-07-13 14:00:00 | 1113.5 |
| 2012-07-13 15:00:00 | 1117.5 |
| 2012-07-13 16:00:00 | 1160 |
| 2012-07-13 17:00:00 | 1136.5 |
| 2012-07-13 18:00:00 | 1083.5 |
| 2012-07-13 19:00:00 | 1168.5 |
| 2012-07-13 20:00:00 | 1074.25 |
| 2012-07-13 21:00:00 | 1132.5 |
| 2012-07-13 22:00:00 | 1210 |
| 2012-07-13 23:00:00 | 1205.25 |
| 2012-07-14 | 1158.5 |
| 2012-07-14 01:00:00 | 1098.5 |
| 2012-07-14 02:00:00 | 1080 |
| 2012-07-14 03:00:00 | 1037 |
| 2012-07-14 04:00:00 | 957.5 |
| 2012-07-14 05:00:00 | 973 |
| 2012-07-14 06:00:00 | 925 |
| 2012-07-14 07:00:00 | 961 |
| 2012-07-14 08:00:00 | 955.25 |
| 2012-07-14 09:00:00 | 980.5 |
| 2012-07-14 10:00:00 | 960.75 |
| 2012-07-14 11:00:00 | 982 |
| 2012-07-14 12:00:00 | 982.5 |
| 2012-07-14 13:00:00 | 1006 |
| 2012-07-14 14:00:00 | 973.75 |
| 2012-07-14 15:00:00 | 1010.5 |
| 2012-07-14 16:00:00 | 1057 |
| 2012-07-14 17:00:00 | 1061.5 |
| 2012-07-14 18:00:00 | 957.5 |
| 2012-07-14 19:00:00 | 989.75 |
| 2012-07-14 20:00:00 | 956.75 |
| 2012-07-14 21:00:00 | 1015.5 |
| 2012-07-14 22:00:00 | 1008.25 |
| 2012-07-14 23:00:00 | 1037.5 |
| 2012-07-15 | 1003.5 |
| 2012-07-15 01:00:00 | 1053.75 |
| 2012-07-15 02:00:00 | 1047.25 |
| 2012-07-15 03:00:00 | 1050.5 |
| 2012-07-15 04:00:00 | 965 |
| 2012-07-15 05:00:00 | 979.25 |
| 2012-07-15 06:00:00 | 930.75 |
| 2012-07-15 07:00:00 | 959.25 |
| 2012-07-15 08:00:00 | 922.5 |
| 2012-07-15 09:00:00 | 940 |
| 2012-07-15 10:00:00 | 936 |
| 2012-07-15 11:00:00 | 986.25 |
| 2012-07-15 12:00:00 | 977.5 |
| 2012-07-15 13:00:00 | 996 |
| 2012-07-15 14:00:00 | 980 |
| 2012-07-15 15:00:00 | 995.75 |
| 2012-07-15 16:00:00 | 1000.25 |
| 2012-07-15 17:00:00 | 1070.5 |
| 2012-07-15 18:00:00 | 1051.75 |
| 2012-07-15 19:00:00 | 1062 |
| 2012-07-15 20:00:00 | 1045.75 |
| 2012-07-15 21:00:00 | 1086 |
| 2012-07-15 22:00:00 | 1121 |
| 2012-07-15 23:00:00 | 1118.5 |
| 2012-07-16 | 1105 |
| 2012-07-16 01:00:00 | 1093.25 |
| 2012-07-16 02:00:00 | 1087 |
| 2012-07-16 03:00:00 | 1049.75 |
| 2012-07-16 04:00:00 | 974 |
| 2012-07-16 05:00:00 | 940.75 |
| 2012-07-16 06:00:00 | 915.75 |
| 2012-07-16 07:00:00 | 925.75 |
| 2012-07-16 08:00:00 | 989.75 |
| 2012-07-16 09:00:00 | 1340 |
| 2012-07-16 10:00:00 | 1670 |
| 2012-07-16 11:00:00 | 1787.75 |
| 2012-07-16 12:00:00 | 1637 |
| 2012-07-16 13:00:00 | 1710.75 |
| 2012-07-16 14:00:00 | 1747.25 |
| 2012-07-16 15:00:00 | 1755.25 |
| 2012-07-16 16:00:00 | 1832.75 |
| 2012-07-16 17:00:00 | 2097.25 |
| 2012-07-16 18:00:00 | 2133.25 |
| 2012-07-16 19:00:00 | 1959.5 |
| 2012-07-16 20:00:00 | 1860.25 |
| 2012-07-16 21:00:00 | 1624.5 |
| 2012-07-16 22:00:00 | 1435.25 |
| 2012-07-16 23:00:00 | 1188 |
| 2012-07-17 | 1271.5 |
| 2012-07-17 01:00:00 | 1312.25 |
| 2012-07-17 02:00:00 | 1310.75 |
| 2012-07-17 03:00:00 | 1148.75 |
| 2012-07-17 04:00:00 | 1150 |
| 2012-07-17 05:00:00 | 1123.25 |
| 2012-07-17 06:00:00 | 1099.75 |
| 2012-07-17 07:00:00 | 1083 |
| 2012-07-17 08:00:00 | 1119.25 |
| 2012-07-17 09:00:00 | 1118 |
| 2012-07-17 10:00:00 | 1171.5 |
| 2012-07-17 11:00:00 | 1338.25 |
| 2012-07-17 12:00:00 | 1463.25 |
| 2012-07-17 13:00:00 | 1621 |
| 2012-07-17 14:00:00 | 1674 |
| 2012-07-17 15:00:00 | 1602 |
| 2012-07-17 16:00:00 | 1622 |
| 2012-07-17 17:00:00 | 1656.75 |
| 2012-07-17 18:00:00 | 1271.75 |
| 2012-07-17 19:00:00 | 1108.25 |
| 2012-07-17 20:00:00 | 1126.25 |
| 2012-07-17 21:00:00 | 1085.75 |
| 2012-07-17 22:00:00 | 1154.5 |
| 2012-07-17 23:00:00 | 1206.75 |
| 2012-07-18 | 1334 |
| 2012-07-18 01:00:00 | 1264.25 |
| 2012-07-18 02:00:00 | 1219.5 |
| 2012-07-18 03:00:00 | 1153 |
| 2012-07-18 04:00:00 | 1204.5 |
| 2012-07-18 05:00:00 | 1067.25 |
| 2012-07-18 06:00:00 | 1088.25 |
| 2012-07-18 07:00:00 | 1060.5 |
| 2012-07-18 08:00:00 | 1125.75 |
| 2012-07-18 09:00:00 | 1098.5 |
| 2012-07-18 10:00:00 | 1149.5 |
| 2012-07-18 11:00:00 | 1112.5 |
| 2012-07-18 12:00:00 | 1157.75 |
| 2012-07-18 13:00:00 | 1159.5 |
| 2012-07-18 14:00:00 | 1216.5 |
| 2012-07-18 15:00:00 | 1145.25 |
| 2012-07-18 16:00:00 | 1128.5 |
| 2012-07-18 17:00:00 | 1125.75 |
| 2012-07-18 18:00:00 | 1259.5 |
| 2012-07-18 19:00:00 | 1201.5 |
| 2012-07-18 20:00:00 | 1252.5 |
| 2012-07-18 21:00:00 | 1145.5 |
| 2012-07-18 22:00:00 | 1179.5 |
| 2012-07-18 23:00:00 | 1133.25 |
| 2012-07-19 | 1253.75 |
| 2012-07-19 01:00:00 | 1153.75 |
| 2012-07-19 02:00:00 | 1185.25 |
| 2012-07-19 03:00:00 | 1152 |
| 2012-07-19 04:00:00 | 1103 |
| 2012-07-19 05:00:00 | 1021.75 |
| 2012-07-19 06:00:00 | 959.25 |
| 2012-07-19 07:00:00 | 937 |
| 2012-07-19 08:00:00 | 959.25 |
| 2012-07-19 09:00:00 | 950.25 |
| 2012-07-19 10:00:00 | 1009.25 |
| 2012-07-19 11:00:00 | 1048.75 |
| 2012-07-19 12:00:00 | 1039.75 |
| 2012-07-19 13:00:00 | 1053.75 |
| 2012-07-19 14:00:00 | 1115 |
| 2012-07-19 15:00:00 | 1085.25 |
| 2012-07-19 16:00:00 | 1104.75 |
| 2012-07-19 17:00:00 | 1127.75 |
| 2012-07-19 18:00:00 | 1143.75 |
| 2012-07-19 19:00:00 | 1190.5 |
| 2012-07-19 20:00:00 | 1211.25 |
| 2012-07-19 21:00:00 | 1122.75 |
| 2012-07-19 22:00:00 | 1199 |
| 2012-07-19 23:00:00 | 1199.25 |
| 2012-07-20 | 1164.25 |
| 2012-07-20 01:00:00 | 1124 |
| 2012-07-20 02:00:00 | 1079.25 |
| 2012-07-20 03:00:00 | 1061 |
| 2012-07-20 04:00:00 | 1011.25 |
| 2012-07-20 05:00:00 | 954 |
| 2012-07-20 06:00:00 | 946 |
| 2012-07-20 07:00:00 | 940 |
| 2012-07-20 08:00:00 | 986.5 |
| 2012-07-20 09:00:00 | 1024.75 |
| 2012-07-20 10:00:00 | 1036 |
| 2012-07-20 11:00:00 | 1101.75 |
| 2012-07-20 12:00:00 | 1154.5 |
| 2012-07-20 13:00:00 | 1231 |
| 2012-07-20 14:00:00 | 1231.75 |
| 2012-07-20 15:00:00 | 1358.75 |
| 2012-07-20 16:00:00 | 1363.5 |
| 2012-07-20 17:00:00 | 1345.25 |
| 2012-07-20 18:00:00 | 1321.25 |
| 2012-07-20 19:00:00 | 1220.5 |
| 2012-07-20 20:00:00 | 1261.25 |
| 2012-07-20 21:00:00 | 1214.5 |
| 2012-07-20 22:00:00 | 1173.75 |
| 2012-07-20 23:00:00 | 1103.25 |
| 2012-07-21 | 1188.5 |
| 2012-07-21 01:00:00 | 1140.25 |
| 2012-07-21 02:00:00 | 1071.25 |
| 2012-07-21 03:00:00 | 1069.75 |
| 2012-07-21 04:00:00 | 1020.5 |
| 2012-07-21 05:00:00 | 1038.25 |
| 2012-07-21 06:00:00 | 1015.5 |
| 2012-07-21 07:00:00 | 963.25 |
| 2012-07-21 08:00:00 | 955.75 |
| 2012-07-21 09:00:00 | 957.5 |
| 2012-07-21 10:00:00 | 952.25 |
| 2012-07-21 11:00:00 | 990 |
| 2012-07-21 12:00:00 | 971.75 |
| 2012-07-21 13:00:00 | 1017 |
| 2012-07-21 14:00:00 | 1017.75 |
| 2012-07-21 15:00:00 | 1065.75 |
| 2012-07-21 16:00:00 | 1062 |
| 2012-07-21 17:00:00 | 1134 |
| 2012-07-21 18:00:00 | 1020.75 |
| 2012-07-21 19:00:00 | 1115.25 |
| 2012-07-21 20:00:00 | 1093 |
| 2012-07-21 21:00:00 | 1092.25 |
| 2012-07-21 22:00:00 | 1085.5 |
| 2012-07-21 23:00:00 | 1093.5 |
| 2012-07-22 | 1030.25 |
| 2012-07-22 01:00:00 | 1049.5 |
| 2012-07-22 02:00:00 | 1001 |
| 2012-07-22 03:00:00 | 1016.75 |
| 2012-07-22 04:00:00 | 954.25 |
| 2012-07-22 05:00:00 | 987.25 |
| 2012-07-22 06:00:00 | 929 |
| 2012-07-22 07:00:00 | 970.75 |
| 2012-07-22 08:00:00 | 925.5 |
| 2012-07-22 09:00:00 | 938.5 |
| 2012-07-22 10:00:00 | 925.5 |
| 2012-07-22 11:00:00 | 972.25 |
| 2012-07-22 12:00:00 | 970.25 |
| 2012-07-22 13:00:00 | 993.25 |
| 2012-07-22 14:00:00 | 968.5 |
| 2012-07-22 15:00:00 | 988.5 |
| 2012-07-22 16:00:00 | 1016.75 |
| 2012-07-22 17:00:00 | 1010 |
| 2012-07-22 18:00:00 | 1018 |
| 2012-07-22 19:00:00 | 977.5 |
| 2012-07-22 20:00:00 | 1104.75 |
| 2012-07-22 21:00:00 | 985.25 |
| 2012-07-22 22:00:00 | 1084.25 |
| 2012-07-22 23:00:00 | 1064.25 |
| 2012-07-23 | 1063.5 |
| 2012-07-23 01:00:00 | 1078.5 |
| 2012-07-23 02:00:00 | 1018.25 |
| 2012-07-23 03:00:00 | 978.75 |
| 2012-07-23 04:00:00 | 952.75 |
| 2012-07-23 05:00:00 | 984 |
| 2012-07-23 06:00:00 | 919 |
| 2012-07-23 07:00:00 | 955.25 |
| 2012-07-23 08:00:00 | 998.25 |
| 2012-07-23 09:00:00 | 1016.75 |
| 2012-07-23 10:00:00 | 1049 |
| 2012-07-23 11:00:00 | 1058.25 |
| 2012-07-23 12:00:00 | 1066.75 |
| 2012-07-23 13:00:00 | 1081.5 |
| 2012-07-23 14:00:00 | 1132.75 |
| 2012-07-23 15:00:00 | 1183.75 |
| 2012-07-23 16:00:00 | 1130.5 |
| 2012-07-23 17:00:00 | 1175.5 |
| 2012-07-23 18:00:00 | 1182.75 |
| 2012-07-23 19:00:00 | 1210.5 |
| 2012-07-23 20:00:00 | 1182.5 |
| 2012-07-23 21:00:00 | 1259.75 |
| 2012-07-23 22:00:00 | 1183.5 |
| 2012-07-23 23:00:00 | 1135.25 |
| 2012-07-24 | 1302.75 |
| 2012-07-24 01:00:00 | 1202.75 |
| 2012-07-24 02:00:00 | 1198.5 |
| 2012-07-24 03:00:00 | 1083.75 |
| 2012-07-24 04:00:00 | 1029 |
| 2012-07-24 05:00:00 | 1020.5 |
| 2012-07-24 06:00:00 | 994.25 |
| 2012-07-24 07:00:00 | 995.75 |
| 2012-07-24 08:00:00 | 1017.75 |
| 2012-07-24 09:00:00 | 1037.25 |
| 2012-07-24 10:00:00 | 1045.25 |
| 2012-07-24 11:00:00 | 1046.5 |
| 2012-07-24 12:00:00 | 1132.5 |
| 2012-07-24 13:00:00 | 1144.25 |
| 2012-07-24 14:00:00 | 1211.5 |
| 2012-07-24 15:00:00 | 1161.5 |
| 2012-07-24 16:00:00 | 1198 |
| 2012-07-24 17:00:00 | 1164 |
| 2012-07-24 18:00:00 | 1092.75 |
| 2012-07-24 19:00:00 | 1126.75 |
| 2012-07-24 20:00:00 | 1180.75 |
| 2012-07-24 21:00:00 | 1148.25 |
| 2012-07-24 22:00:00 | 1230.25 |
| 2012-07-24 23:00:00 | 1237.75 |
| 2012-07-25 | 1190.25 |
| 2012-07-25 01:00:00 | 1161.5 |
| 2012-07-25 02:00:00 | 1165.75 |
| 2012-07-25 03:00:00 | 1157.5 |
| 2012-07-25 04:00:00 | 1093.5 |
| 2012-07-25 05:00:00 | 1066 |
| 2012-07-25 06:00:00 | 1066 |
| 2012-07-25 07:00:00 | 1050 |
| 2012-07-25 08:00:00 | 1075.5 |
| 2012-07-25 09:00:00 | 991.75 |
| 2012-07-25 10:00:00 | 1055.75 |
| 2012-07-25 11:00:00 | 1071.5 |
| 2012-07-25 12:00:00 | 1192 |
| 2012-07-25 13:00:00 | 1162.25 |
| 2012-07-25 14:00:00 | 1236.25 |
| 2012-07-25 15:00:00 | 1271.75 |
| 2012-07-25 16:00:00 | 1148.75 |
| 2012-07-25 17:00:00 | 1084 |
| 2012-07-25 18:00:00 | 1129.5 |
| 2012-07-25 19:00:00 | 1088.25 |
| 2012-07-25 20:00:00 | 1131.25 |
| 2012-07-25 21:00:00 | 1187 |
| 2012-07-25 22:00:00 | 1186 |
| 2012-07-25 23:00:00 | 1171.75 |
| 2012-07-26 | 1171.25 |
| 2012-07-26 01:00:00 | 1105.75 |
| 2012-07-26 02:00:00 | 1144 |
| 2012-07-26 03:00:00 | 1012.75 |
| 2012-07-26 04:00:00 | 1034.75 |
| 2012-07-26 05:00:00 | 1000 |
| 2012-07-26 06:00:00 | 1020 |
| 2012-07-26 07:00:00 | 984.5 |
| 2012-07-26 08:00:00 | 1030.25 |
| 2012-07-26 09:00:00 | 1004.5 |
| 2012-07-26 10:00:00 | 1038.75 |
| 2012-07-26 11:00:00 | 1029.75 |
| 2012-07-26 12:00:00 | 1119.75 |
| 2012-07-26 13:00:00 | 1154.5 |
| 2012-07-26 14:00:00 | 1279.75 |
| 2012-07-26 15:00:00 | 1725.5 |
| 2012-07-26 16:00:00 | 1924.25 |
| 2012-07-26 17:00:00 | 1988 |
| 2012-07-26 18:00:00 | 1970 |
| 2012-07-26 19:00:00 | 1966 |
| 2012-07-26 20:00:00 | 1547.75 |
| 2012-07-26 21:00:00 | 1126 |
| 2012-07-26 22:00:00 | 1121.75 |
| 2012-07-26 23:00:00 | 1130.25 |
| 2012-07-27 | 1187.75 |
| 2012-07-27 01:00:00 | 1159.5 |
| 2012-07-27 02:00:00 | 1148 |
| 2012-07-27 03:00:00 | 1149.5 |
| 2012-07-27 04:00:00 | 1067.5 |
| 2012-07-27 05:00:00 | 1021.25 |
| 2012-07-27 06:00:00 | 994 |
| 2012-07-27 07:00:00 | 997.25 |
| 2012-07-27 08:00:00 | 1054.5 |
| 2012-07-27 09:00:00 | 1041 |
| 2012-07-27 10:00:00 | 1109.75 |
| 2012-07-27 11:00:00 | 1126 |
| 2012-07-27 12:00:00 | 1151.5 |
| 2012-07-27 13:00:00 | 1203.25 |
| 2012-07-27 14:00:00 | 1198.25 |
| 2012-07-27 15:00:00 | 1171.5 |
| 2012-07-27 16:00:00 | 1323 |
| 2012-07-27 17:00:00 | 1248 |
| 2012-07-27 18:00:00 | 1319.75 |
| 2012-07-27 19:00:00 | 1309.75 |
| 2012-07-27 20:00:00 | 1281.25 |
| 2012-07-27 21:00:00 | 1252.75 |
| 2012-07-27 22:00:00 | 1281.5 |
| 2012-07-27 23:00:00 | 1302.25 |
| 2012-07-28 | 1245.25 |
| 2012-07-28 01:00:00 | 1185 |
| 2012-07-28 02:00:00 | 1160 |
| 2012-07-28 03:00:00 | 1113.25 |
| 2012-07-28 04:00:00 | 1086 |
| 2012-07-28 05:00:00 | 1030.25 |
| 2012-07-28 06:00:00 | 932.25 |
| 2012-07-28 07:00:00 | 928.75 |
| 2012-07-28 08:00:00 | 923 |
| 2012-07-28 09:00:00 | 915.5 |
| 2012-07-28 10:00:00 | 938.5 |
| 2012-07-28 11:00:00 | 965.5 |
| 2012-07-28 12:00:00 | 1043.25 |
| 2012-07-28 13:00:00 | 1064.25 |
| 2012-07-28 14:00:00 | 1048 |
| 2012-07-28 15:00:00 | 1055.25 |
| 2012-07-28 16:00:00 | 1028.25 |
| 2012-07-28 17:00:00 | 1104.5 |
| 2012-07-28 18:00:00 | 1067.75 |
| 2012-07-28 19:00:00 | 1041.5 |
| 2012-07-28 20:00:00 | 1024.5 |
| 2012-07-28 21:00:00 | 1055.25 |
| 2012-07-28 22:00:00 | 1060.75 |
| 2012-07-28 23:00:00 | 1089.5 |
| 2012-07-29 | 1088 |
| 2012-07-29 01:00:00 | 1086 |
| 2012-07-29 02:00:00 | 1026.5 |
| 2012-07-29 03:00:00 | 1036.75 |
| 2012-07-29 04:00:00 | 956 |
| 2012-07-29 05:00:00 | 973.75 |
| 2012-07-29 06:00:00 | 939.75 |
| 2012-07-29 07:00:00 | 935 |
| 2012-07-29 08:00:00 | 908.25 |
| 2012-07-29 09:00:00 | 927.75 |
| 2012-07-29 10:00:00 | 910.25 |
| 2012-07-29 11:00:00 | 946.25 |
| 2012-07-29 12:00:00 | 930.75 |
| 2012-07-29 13:00:00 | 1045 |
| 2012-07-29 14:00:00 | 998.25 |
| 2012-07-29 15:00:00 | 1077 |
| 2012-07-29 16:00:00 | 1056.75 |
| 2012-07-29 17:00:00 | 1205.75 |
| 2012-07-29 18:00:00 | 1024 |
| 2012-07-29 19:00:00 | 1110.5 |
| 2012-07-29 20:00:00 | 1081.5 |
| 2012-07-29 21:00:00 | 1106.75 |
| 2012-07-29 22:00:00 | 1206 |
| 2012-07-29 23:00:00 | 1193 |
| 2012-07-30 | 1142.5 |
| 2012-07-30 01:00:00 | 1133 |
| 2012-07-30 02:00:00 | 1066.5 |
| 2012-07-30 03:00:00 | 1075.75 |
| 2012-07-30 04:00:00 | 1032.25 |
| 2012-07-30 05:00:00 | 1046.25 |
| 2012-07-30 06:00:00 | 1018.5 |
| 2012-07-30 07:00:00 | 1066 |
| 2012-07-30 08:00:00 | 1060.5 |
| 2012-07-30 09:00:00 | 1055.75 |
| 2012-07-30 10:00:00 | 1038.25 |
| 2012-07-30 11:00:00 | 1135.25 |
| 2012-07-30 12:00:00 | 1138.25 |
| 2012-07-30 13:00:00 | 1169.5 |
| 2012-07-30 14:00:00 | 1187.75 |
| 2012-07-30 15:00:00 | 1360 |
| 2012-07-30 16:00:00 | 1279.5 |
| 2012-07-30 17:00:00 | 1335.5 |
| 2012-07-30 18:00:00 | 1318.75 |
| 2012-07-30 19:00:00 | 1313.25 |
| 2012-07-30 20:00:00 | 1211 |
| 2012-07-30 21:00:00 | 1219.5 |
| 2012-07-30 22:00:00 | 1217.5 |
| 2012-07-30 23:00:00 | 1193.5 |
| 2012-07-31 | 1173 |
| 2012-07-31 01:00:00 | 1172 |
| 2012-07-31 02:00:00 | 1092.25 |
| 2012-07-31 03:00:00 | 1113.5 |
| 2012-07-31 04:00:00 | 1035 |
| 2012-07-31 05:00:00 | 1049.5 |
| 2012-07-31 06:00:00 | 1017.5 |
| 2012-07-31 07:00:00 | 1018.75 |
| 2012-07-31 08:00:00 | 1027.75 |
| 2012-07-31 09:00:00 | 998 |
| 2012-07-31 10:00:00 | 1146.25 |
| 2012-07-31 11:00:00 | 1097.75 |
| 2012-07-31 12:00:00 | 1095 |
| 2012-07-31 13:00:00 | 1125.5 |
| 2012-07-31 14:00:00 | 1124 |
| 2012-07-31 15:00:00 | 1207.75 |
| 2012-07-31 16:00:00 | 1219 |
| 2012-07-31 17:00:00 | 1390 |
| 2012-07-31 18:00:00 | 1354.5 |
| 2012-07-31 19:00:00 | 1279.25 |
| 2012-07-31 20:00:00 | 1270.5 |
| 2012-07-31 21:00:00 | 1348.75 |
| 2012-07-31 22:00:00 | 1304.5 |
| 2012-07-31 23:00:00 | 1278 |
| 2012-08-01 | 1266.25 |
| 2012-08-01 01:00:00 | 1160 |
| 2012-08-01 02:00:00 | 1238 |
| 2012-08-01 03:00:00 | 1065 |
| 2012-08-01 04:00:00 | 1147.5 |
| 2012-08-01 05:00:00 | 1063.25 |
| 2012-08-01 06:00:00 | 1050.25 |
| 2012-08-01 07:00:00 | 1042 |
| 2012-08-01 08:00:00 | 1109.5 |
| 2012-08-01 09:00:00 | 998.25 |
| 2012-08-01 10:00:00 | 1078 |
| 2012-08-01 11:00:00 | 1088.25 |
| 2012-08-01 12:00:00 | 1182.75 |
| 2012-08-01 13:00:00 | 1140.5 |
| 2012-08-01 14:00:00 | 1224 |
| 2012-08-01 15:00:00 | 1257.75 |
| 2012-08-01 16:00:00 | 1281.75 |
| 2012-08-01 17:00:00 | 1268.25 |
| 2012-08-01 18:00:00 | 1329.5 |
| 2012-08-01 19:00:00 | 1275.75 |
| 2012-08-01 20:00:00 | 1259.25 |
| 2012-08-01 21:00:00 | 1218.5 |
| 2012-08-01 22:00:00 | 1284.5 |
| 2012-08-01 23:00:00 | 1267.25 |
| 2012-08-02 | 1302.25 |
| 2012-08-02 01:00:00 | 1263.75 |
| 2012-08-02 02:00:00 | 1312 |
| 2012-08-02 03:00:00 | 1223 |
| 2012-08-02 04:00:00 | 1264.5 |
| 2012-08-02 05:00:00 | 1146.5 |
| 2012-08-02 06:00:00 | 1078.75 |
| 2012-08-02 07:00:00 | 1045.5 |
| 2012-08-02 08:00:00 | 1092 |
| 2012-08-02 09:00:00 | 1076.5 |
| 2012-08-02 10:00:00 | 1125.5 |
| 2012-08-02 11:00:00 | 1133 |
| 2012-08-02 12:00:00 | 1290.5 |
| 2012-08-02 13:00:00 | 1322 |
| 2012-08-02 14:00:00 | 1236.25 |
| 2012-08-02 15:00:00 | 1196.5 |
| 2012-08-02 16:00:00 | 1223.75 |
| 2012-08-02 17:00:00 | 1178 |
| 2012-08-02 18:00:00 | 1210.25 |
| 2012-08-02 19:00:00 | 1169.25 |
| 2012-08-02 20:00:00 | 1195.25 |
| 2012-08-02 21:00:00 | 1201.5 |
| 2012-08-02 22:00:00 | 1330.25 |
| 2012-08-02 23:00:00 | 1392.5 |
| 2012-08-03 | 1410.75 |
| 2012-08-03 01:00:00 | 1373.25 |
| 2012-08-03 02:00:00 | 1268.75 |
| 2012-08-03 03:00:00 | 1236.25 |
| 2012-08-03 04:00:00 | 1230.25 |
| 2012-08-03 05:00:00 | 1197 |
| 2012-08-03 06:00:00 | 1154.5 |
| 2012-08-03 07:00:00 | 1053.25 |
| 2012-08-03 08:00:00 | 1106 |
| 2012-08-03 09:00:00 | 1092.5 |
| 2012-08-03 10:00:00 | 1154.5 |
| 2012-08-03 11:00:00 | 1207 |
| 2012-08-03 12:00:00 | 1284.75 |
| 2012-08-03 13:00:00 | 1305.5 |
| 2012-08-03 14:00:00 | 1348.75 |
| 2012-08-03 15:00:00 | 1271.5 |
| 2012-08-03 16:00:00 | 1274 |
| 2012-08-03 17:00:00 | 1187 |
| 2012-08-03 18:00:00 | 1432.75 |
| 2012-08-03 19:00:00 | 1518.25 |
| 2012-08-03 20:00:00 | 1547 |
| 2012-08-03 21:00:00 | 1568.5 |
| 2012-08-03 22:00:00 | 1436.25 |
| 2012-08-03 23:00:00 | 1298.25 |
| 2012-08-04 | 1309.5 |
| 2012-08-04 01:00:00 | 1079.25 |
| 2012-08-04 02:00:00 | 1028.5 |
| 2012-08-04 03:00:00 | 962.75 |
| 2012-08-04 04:00:00 | 971.5 |
| 2012-08-04 05:00:00 | 973.5 |
| 2012-08-04 06:00:00 | 949.5 |
| 2012-08-04 07:00:00 | 945.25 |
| 2012-08-04 08:00:00 | 933.75 |
| 2012-08-04 09:00:00 | 932.75 |
| 2012-08-04 10:00:00 | 946.75 |
| 2012-08-04 11:00:00 | 980.5 |
| 2012-08-04 12:00:00 | 985.25 |
| 2012-08-04 13:00:00 | 993 |
| 2012-08-04 14:00:00 | 992.25 |
| 2012-08-04 15:00:00 | 994.75 |
| 2012-08-04 16:00:00 | 966.5 |
| 2012-08-04 17:00:00 | 1060.5 |
| 2012-08-04 18:00:00 | 1061.25 |
| 2012-08-04 19:00:00 | 1070.75 |
| 2012-08-04 20:00:00 | 1055.25 |
| 2012-08-04 21:00:00 | 1076.25 |
| 2012-08-04 22:00:00 | 1025.25 |
| 2012-08-04 23:00:00 | 1015.5 |
| 2012-08-05 | 988.5 |
| 2012-08-05 01:00:00 | 1004.25 |
| 2012-08-05 02:00:00 | 972 |
| 2012-08-05 03:00:00 | 980.75 |
| 2012-08-05 04:00:00 | 984 |
| 2012-08-05 05:00:00 | 976.75 |
| 2012-08-05 06:00:00 | 952.5 |
| 2012-08-05 07:00:00 | 945.25 |
| 2012-08-05 08:00:00 | 947.5 |
| 2012-08-05 09:00:00 | 970.75 |
| 2012-08-05 10:00:00 | 937.75 |
| 2012-08-05 11:00:00 | 1033.25 |
| 2012-08-05 12:00:00 | 1012.75 |
| 2012-08-05 13:00:00 | 1160.75 |
| 2012-08-05 14:00:00 | 1105.5 |
| 2012-08-05 15:00:00 | 1129 |
| 2012-08-05 16:00:00 | 1076.25 |
| 2012-08-05 17:00:00 | 1099.75 |
| 2012-08-05 18:00:00 | 1007.25 |
| 2012-08-05 19:00:00 | 1031.5 |
| 2012-08-05 20:00:00 | 989.75 |
| 2012-08-05 21:00:00 | 1011.75 |
| 2012-08-05 22:00:00 | 997 |
| 2012-08-05 23:00:00 | 1066.5 |
| 2012-08-06 | 1034.5 |
| 2012-08-06 01:00:00 | 1051.75 |
| 2012-08-06 02:00:00 | 1079 |
| 2012-08-06 03:00:00 | 993.5 |
| 2012-08-06 04:00:00 | 1009 |
| 2012-08-06 05:00:00 | 978.5 |
| 2012-08-06 06:00:00 | 928.25 |
| 2012-08-06 07:00:00 | 1000.25 |
| 2012-08-06 08:00:00 | 1026.5 |
| 2012-08-06 09:00:00 | 1071 |
| 2012-08-06 10:00:00 | 1076 |
| 2012-08-06 11:00:00 | 1103 |
| 2012-08-06 12:00:00 | 1131 |
| 2012-08-06 13:00:00 | 1100.75 |
| 2012-08-06 14:00:00 | 1215 |
| 2012-08-06 15:00:00 | 1235.25 |
| 2012-08-06 16:00:00 | 1218.5 |
| 2012-08-06 17:00:00 | 1330.75 |
| 2012-08-06 18:00:00 | 1252.25 |
| 2012-08-06 19:00:00 | 1231.5 |
| 2012-08-06 20:00:00 | 1216.25 |
| 2012-08-06 21:00:00 | 1221.75 |
| 2012-08-06 22:00:00 | 1280.5 |
| 2012-08-06 23:00:00 | 1291.25 |
| 2012-08-07 | 313 |
| 2012-08-07 01:00:00 | 1627.5 |
| 2012-08-07 02:00:00 | 1932 |
| 2012-08-07 03:00:00 | 2023.25 |
| 2012-08-07 04:00:00 | 2203.75 |
| 2012-08-07 05:00:00 | 2218.5 |
| 2012-08-07 06:00:00 | 2000.5 |
| 2012-08-07 07:00:00 | 1990.75 |
| 2012-08-07 08:00:00 | 1708.25 |
| 2012-08-07 09:00:00 | 1191.5 |
| 2012-08-07 10:00:00 | 1281.75 |
| 2012-08-07 11:00:00 | 1316 |
| 2012-08-07 12:00:00 | 1291 |
| 2012-08-07 13:00:00 | 1178 |
| 2012-08-07 14:00:00 | 1181.5 |
| 2012-08-07 15:00:00 | 1162.75 |
| 2012-08-07 16:00:00 | 1184.75 |
| 2012-08-07 17:00:00 | 1251 |
| 2012-08-07 18:00:00 | 1155.25 |
| 2012-08-07 19:00:00 | 1172.25 |
| 2012-08-07 20:00:00 | 1161 |
| 2012-08-07 21:00:00 | 1152 |
| 2012-08-07 22:00:00 | 1144 |
| 2012-08-07 23:00:00 | 1139.25 |
| 2012-08-08 | 1129 |
| 2012-08-08 01:00:00 | 1103 |
| 2012-08-08 02:00:00 | 1086 |
| 2012-08-08 03:00:00 | 1085 |
| 2012-08-08 04:00:00 | 1061.25 |
| 2012-08-08 05:00:00 | 1070.5 |
| 2012-08-08 06:00:00 | 1056.75 |
| 2012-08-08 07:00:00 | 1065 |
| 2012-08-08 08:00:00 | 1088.5 |
| 2012-08-08 09:00:00 | 1094 |
| 2012-08-08 10:00:00 | 1110.5 |
| 2012-08-08 11:00:00 | 1125.25 |
| 2012-08-08 12:00:00 | 1114.75 |
| 2012-08-08 13:00:00 | 1119 |
| 2012-08-08 14:00:00 | 1142.75 |
| 2012-08-08 15:00:00 | 1265 |
| 2012-08-08 16:00:00 | 1220.75 |
| 2012-08-08 17:00:00 | 1231.25 |
| 2012-08-08 18:00:00 | 1157.25 |
| 2012-08-08 19:00:00 | 1189 |
| 2012-08-08 20:00:00 | 1125.75 |
| 2012-08-08 21:00:00 | 1145.25 |
| 2012-08-08 22:00:00 | 1206.5 |
| 2012-08-08 23:00:00 | 1174.25 |
| 2012-08-09 | 1162 |
| 2012-08-09 01:00:00 | 1117.75 |
| 2012-08-09 02:00:00 | 1131.25 |
| 2012-08-09 03:00:00 | 1108.5 |
| 2012-08-09 04:00:00 | 1050.5 |
| 2012-08-09 05:00:00 | 1075 |
| 2012-08-09 06:00:00 | 1044.25 |
| 2012-08-09 07:00:00 | 1078.75 |
| 2012-08-09 08:00:00 | 1045 |
| 2012-08-09 09:00:00 | 1032.25 |
| 2012-08-09 10:00:00 | 1071.75 |
| 2012-08-09 11:00:00 | 1133 |
| 2012-08-09 12:00:00 | 1111 |
| 2012-08-09 13:00:00 | 1195 |
| 2012-08-09 14:00:00 | 1109 |
| 2012-08-09 15:00:00 | 1273.75 |
| 2012-08-09 16:00:00 | 1248.5 |
| 2012-08-09 17:00:00 | 1313.5 |
| 2012-08-09 18:00:00 | 1231.25 |
| 2012-08-09 19:00:00 | 1253.75 |
| 2012-08-09 20:00:00 | 1211.75 |
| 2012-08-09 21:00:00 | 1138.75 |
| 2012-08-09 22:00:00 | 1203.25 |
| 2012-08-09 23:00:00 | 1211.75 |
| 2012-08-10 | 1209 |
| 2012-08-10 01:00:00 | 1195.75 |
| 2012-08-10 02:00:00 | 1129 |
| 2012-08-10 03:00:00 | 1069.25 |
| 2012-08-10 04:00:00 | 1038.5 |
| 2012-08-10 05:00:00 | 1081.75 |
| 2012-08-10 06:00:00 | 1018.75 |
| 2012-08-10 07:00:00 | 1047 |
| 2012-08-10 08:00:00 | 1029.75 |
| 2012-08-10 09:00:00 | 1059 |
| 2012-08-10 10:00:00 | 1048.5 |
| 2012-08-10 11:00:00 | 1070.5 |
| 2012-08-10 12:00:00 | 1066.75 |
| 2012-08-10 13:00:00 | 1150.5 |
| 2012-08-10 14:00:00 | 1097.5 |
| 2012-08-10 15:00:00 | 1069.5 |
| 2012-08-10 16:00:00 | 1044.25 |
| 2012-08-10 17:00:00 | 1049.75 |
| 2012-08-10 18:00:00 | 1047.25 |
| 2012-08-10 19:00:00 | 1047 |
| 2012-08-10 20:00:00 | 1037.5 |
| 2012-08-10 21:00:00 | 1118.25 |
| 2012-08-10 22:00:00 | 1123.75 |
| 2012-08-10 23:00:00 | 1271.5 |
| 2012-08-11 | 1266 |
| 2012-08-11 01:00:00 | 1109.5 |
| 2012-08-11 02:00:00 | 1004.25 |
| 2012-08-11 03:00:00 | 982.25 |
| 2012-08-11 04:00:00 | 964 |
| 2012-08-11 05:00:00 | 965.25 |
| 2012-08-11 06:00:00 | 988.25 |
| 2012-08-11 07:00:00 | 1128 |
| 2012-08-11 08:00:00 | 1497.75 |
| 2012-08-11 09:00:00 | 1796.75 |
| 2012-08-11 10:00:00 | 1850 |
| 2012-08-11 11:00:00 | 1947.25 |
| 2012-08-11 12:00:00 | 1946.25 |
| 2012-08-11 13:00:00 | 1771.5 |
| 2012-08-11 14:00:00 | 1717.25 |
| 2012-08-11 15:00:00 | 1500 |
| 2012-08-11 16:00:00 | 1430.5 |
| 2012-08-11 17:00:00 | 1282.75 |
| 2012-08-11 18:00:00 | 1282 |
| 2012-08-11 19:00:00 | 1200.75 |
| 2012-08-11 20:00:00 | 1300.25 |
| 2012-08-11 21:00:00 | 1174.25 |
| 2012-08-11 22:00:00 | 1105.25 |
| 2012-08-11 23:00:00 | 1078.5 |
| 2012-08-12 | 1076.75 |
| 2012-08-12 01:00:00 | 1046.25 |
| 2012-08-12 02:00:00 | 1036.75 |
| 2012-08-12 03:00:00 | 999.25 |
| 2012-08-12 04:00:00 | 988.75 |
| 2012-08-12 05:00:00 | 969.75 |
| 2012-08-12 06:00:00 | 989.75 |
| 2012-08-12 07:00:00 | 1006 |
| 2012-08-12 08:00:00 | 922.25 |
| 2012-08-12 09:00:00 | 914 |
| 2012-08-12 10:00:00 | 927 |
| 2012-08-12 11:00:00 | 942.75 |
| 2012-08-12 12:00:00 | 977 |
| 2012-08-12 13:00:00 | 1005.25 |
| 2012-08-12 14:00:00 | 952 |
| 2012-08-12 15:00:00 | 967.5 |
| 2012-08-12 16:00:00 | 1253.25 |
| 2012-08-12 17:00:00 | 1270.75 |
| 2012-08-12 18:00:00 | 1390.25 |
| 2012-08-12 19:00:00 | 1425.25 |
| 2012-08-12 20:00:00 | 1436.5 |
| 2012-08-12 21:00:00 | 1430 |
| 2012-08-12 22:00:00 | 1148 |
| 2012-08-12 23:00:00 | 1128 |
| 2012-08-13 | 1158.75 |
| 2012-08-13 01:00:00 | 1183.75 |
| 2012-08-13 02:00:00 | 1200.5 |
| 2012-08-13 03:00:00 | 991.5 |
| 2012-08-13 04:00:00 | 1053.75 |
| 2012-08-13 05:00:00 | 1020.75 |
| 2012-08-13 06:00:00 | 1059.75 |
| 2012-08-13 07:00:00 | 1028.5 |
| 2012-08-13 08:00:00 | 1084.75 |
| 2012-08-13 09:00:00 | 1000.25 |
| 2012-08-13 10:00:00 | 1075 |
| 2012-08-13 11:00:00 | 1041.75 |
| 2012-08-13 12:00:00 | 1077 |
| 2012-08-13 13:00:00 | 1048.5 |
| 2012-08-13 14:00:00 | 1077 |
| 2012-08-13 15:00:00 | 1034.5 |
| 2012-08-13 16:00:00 | 1047.75 |
| 2012-08-13 17:00:00 | 1004 |
| 2012-08-13 18:00:00 | 1027 |
| 2012-08-13 19:00:00 | 1075.75 |
| 2012-08-13 20:00:00 | 1035.75 |
| 2012-08-13 21:00:00 | 1058.25 |
| 2012-08-13 22:00:00 | 1127.75 |
| 2012-08-13 23:00:00 | 1103.5 |
| 2012-08-14 | 1129 |
| 2012-08-14 01:00:00 | 1132.75 |
| 2012-08-14 02:00:00 | 1124.5 |
| 2012-08-14 03:00:00 | 1067.5 |
| 2012-08-14 04:00:00 | 1120.5 |
| 2012-08-14 05:00:00 | 994.75 |
| 2012-08-14 06:00:00 | 1098.75 |
| 2012-08-14 07:00:00 | 977 |
| 2012-08-14 08:00:00 | 1028.75 |
| 2012-08-14 09:00:00 | 1007 |
| 2012-08-14 10:00:00 | 1061.25 |
| 2012-08-14 11:00:00 | 1081.25 |
| 2012-08-14 12:00:00 | 1088.25 |
| 2012-08-14 13:00:00 | 1113.75 |
| 2012-08-14 14:00:00 | 1060 |
| 2012-08-14 15:00:00 | 1037.25 |
| 2012-08-14 16:00:00 | 1035.75 |
| 2012-08-14 17:00:00 | 1085.5 |
| 2012-08-14 18:00:00 | 1032.25 |
| 2012-08-14 19:00:00 | 1084.25 |
| 2012-08-14 20:00:00 | 1048.25 |
| 2012-08-14 21:00:00 | 1121 |
| 2012-08-14 22:00:00 | 1168.75 |
| 2012-08-14 23:00:00 | 1149.75 |
| 2012-08-15 | 1145.5 |
| 2012-08-15 01:00:00 | 1140.75 |
| 2012-08-15 02:00:00 | 1130.25 |
| 2012-08-15 03:00:00 | 1055.25 |
| 2012-08-15 04:00:00 | 1004.5 |
| 2012-08-15 05:00:00 | 1016.75 |
| 2012-08-15 06:00:00 | 999.5 |
| 2012-08-15 07:00:00 | 995.25 |
| 2012-08-15 08:00:00 | 911.5 |
| 2012-08-15 09:00:00 | 816.5 |
| 2012-08-15 10:00:00 | 803.5 |
| 2012-08-15 11:00:00 | 951.25 |
| 2012-08-15 12:00:00 | 1028.25 |
| 2012-08-15 13:00:00 | 1116 |
| 2012-08-15 14:00:00 | 1215 |
| 2012-08-15 15:00:00 | 1143.75 |
| 2012-08-15 16:00:00 | 1118.75 |
| 2012-08-15 17:00:00 | 1121.25 |
| 2012-08-15 18:00:00 | 1147 |
| 2012-08-15 19:00:00 | 1187.5 |
| 2012-08-15 20:00:00 | 1168.25 |
| 2012-08-15 21:00:00 | 1162.5 |
| 2012-08-15 22:00:00 | 1129.75 |
| 2012-08-15 23:00:00 | 1238.25 |
| 2012-08-16 | 1156.25 |
| 2012-08-16 01:00:00 | 1155.5 |
| 2012-08-16 02:00:00 | 1130.25 |
| 2012-08-16 03:00:00 | 1161.25 |
| 2012-08-16 04:00:00 | 1083 |
| 2012-08-16 05:00:00 | 1090.25 |
| 2012-08-16 06:00:00 | 1004.5 |
| 2012-08-16 07:00:00 | 1114.25 |
| 2012-08-16 08:00:00 | 1120 |
| 2012-08-16 09:00:00 | 1003.25 |
| 2012-08-16 10:00:00 | 1021.25 |
| 2012-08-16 11:00:00 | 1137 |
| 2012-08-16 12:00:00 | 1121 |
| 2012-08-16 13:00:00 | 1167.25 |
| 2012-08-16 14:00:00 | 1147.5 |
| 2012-08-16 15:00:00 | 1160.5 |
| 2012-08-16 16:00:00 | 1115 |
| 2012-08-16 17:00:00 | 1180.5 |
| 2012-08-16 18:00:00 | 1181 |
| 2012-08-16 19:00:00 | 1284.5 |
| 2012-08-16 20:00:00 | 1276.75 |
| 2012-08-16 21:00:00 | 1335.25 |
| 2012-08-16 22:00:00 | 1281.25 |
| 2012-08-16 23:00:00 | 1356.5 |
| 2012-08-17 | 1311.5 |
| 2012-08-17 01:00:00 | 1346.25 |
| 2012-08-17 02:00:00 | 1301.75 |
| 2012-08-17 03:00:00 | 1226.75 |
| 2012-08-17 04:00:00 | 1243.5 |
| 2012-08-17 05:00:00 | 1039 |
| 2012-08-17 06:00:00 | 1009.25 |
| 2012-08-17 07:00:00 | 1037.25 |
| 2012-08-17 08:00:00 | 994.75 |
| 2012-08-17 09:00:00 | 1044.5 |
| 2012-08-17 10:00:00 | 1061.25 |
| 2012-08-17 11:00:00 | 1107.25 |
| 2012-08-17 12:00:00 | 1155.25 |
| 2012-08-17 13:00:00 | 1188.75 |
| 2012-08-17 14:00:00 | 1072.75 |
| 2012-08-17 15:00:00 | 1093.25 |
| 2012-08-17 16:00:00 | 1060.25 |
| 2012-08-17 17:00:00 | 1143.5 |
| 2012-08-17 18:00:00 | 1214.75 |
| 2012-08-17 19:00:00 | 1284 |
| 2012-08-17 20:00:00 | 1336 |
| 2012-08-17 21:00:00 | 1378 |
| 2012-08-17 22:00:00 | 1329.25 |
| 2012-08-17 23:00:00 | 1288 |
| 2012-08-18 | 1252.75 |
| 2012-08-18 01:00:00 | 1194.5 |
| 2012-08-18 02:00:00 | 1195 |
| 2012-08-18 03:00:00 | 1202 |
| 2012-08-18 04:00:00 | 1135.25 |
| 2012-08-18 05:00:00 | 1031.25 |
| 2012-08-18 06:00:00 | 968.5 |
| 2012-08-18 07:00:00 | 943.5 |
| 2012-08-18 08:00:00 | 938.25 |
| 2012-08-18 09:00:00 | 926.25 |
| 2012-08-18 10:00:00 | 951.5 |
| 2012-08-18 11:00:00 | 972 |
| 2012-08-18 12:00:00 | 984.5 |
| 2012-08-18 13:00:00 | 992.25 |
| 2012-08-18 14:00:00 | 986 |
| 2012-08-18 15:00:00 | 978 |
| 2012-08-18 16:00:00 | 967 |
| 2012-08-18 17:00:00 | 957.25 |
| 2012-08-18 18:00:00 | 974.5 |
| 2012-08-18 19:00:00 | 949.5 |
| 2012-08-18 20:00:00 | 946 |
| 2012-08-18 21:00:00 | 1072.25 |
| 2012-08-18 22:00:00 | 1093.25 |
| 2012-08-18 23:00:00 | 1071.25 |
| 2012-08-19 | 1005.75 |
| 2012-08-19 01:00:00 | 1077.25 |
| 2012-08-19 02:00:00 | 954.75 |
| 2012-08-19 03:00:00 | 951.5 |
| 2012-08-19 04:00:00 | 955 |
| 2012-08-19 05:00:00 | 937.5 |
| 2012-08-19 06:00:00 | 964 |
| 2012-08-19 07:00:00 | 939.25 |
| 2012-08-19 08:00:00 | 931 |
| 2012-08-19 09:00:00 | 917.75 |
| 2012-08-19 10:00:00 | 943.75 |
| 2012-08-19 11:00:00 | 954 |
| 2012-08-19 12:00:00 | 997.75 |
| 2012-08-19 13:00:00 | 977.75 |
| 2012-08-19 14:00:00 | 993.75 |
| 2012-08-19 15:00:00 | 999.25 |
| 2012-08-19 16:00:00 | 978.25 |
| 2012-08-19 17:00:00 | 960.25 |
| 2012-08-19 18:00:00 | 989 |
| 2012-08-19 19:00:00 | 955 |
| 2012-08-19 20:00:00 | 1026 |
| 2012-08-19 21:00:00 | 1139.75 |
| 2012-08-19 22:00:00 | 1024.25 |
| 2012-08-19 23:00:00 | 1066.75 |
| 2012-08-20 | 1049.25 |
| 2012-08-20 01:00:00 | 1034.75 |
| 2012-08-20 02:00:00 | 1091.5 |
| 2012-08-20 03:00:00 | 932.5 |
| 2012-08-20 04:00:00 | 968 |
| 2012-08-20 05:00:00 | 939.5 |
| 2012-08-20 06:00:00 | 965 |
| 2012-08-20 07:00:00 | 961.5 |
| 2012-08-20 08:00:00 | 1064.5 |
| 2012-08-20 09:00:00 | 930.75 |
| 2012-08-20 10:00:00 | 1064.5 |
| 2012-08-20 11:00:00 | 1089.75 |
| 2012-08-20 12:00:00 | 1230.25 |
| 2012-08-20 13:00:00 | 1127.5 |
| 2012-08-20 14:00:00 | 1262.25 |
| 2012-08-20 15:00:00 | 1252.5 |
| 2012-08-20 16:00:00 | 1270.25 |
| 2012-08-20 17:00:00 | 1212.25 |
| 2012-08-20 18:00:00 | 1254.5 |
| 2012-08-20 19:00:00 | 1213.5 |
| 2012-08-20 20:00:00 | 1311.5 |
| 2012-08-20 21:00:00 | 1306.75 |
| 2012-08-20 22:00:00 | 1263.75 |
| 2012-08-20 23:00:00 | 1263.75 |
| 2012-08-21 | 1304.25 |
| 2012-08-21 01:00:00 | 1210.75 |
| 2012-08-21 02:00:00 | 1204.75 |
| 2012-08-21 03:00:00 | 1112.25 |
| 2012-08-21 04:00:00 | 1095 |
| 2012-08-21 05:00:00 | 1037.25 |
| 2012-08-21 06:00:00 | 1068.5 |
| 2012-08-21 07:00:00 | 1024.75 |
| 2012-08-21 08:00:00 | 1075.5 |
| 2012-08-21 09:00:00 | 1055 |
| 2012-08-21 10:00:00 | 1092.75 |
| 2012-08-21 11:00:00 | 1147.75 |
| 2012-08-21 12:00:00 | 1239.25 |
| 2012-08-21 13:00:00 | 1186 |
| 2012-08-21 14:00:00 | 1214.75 |
| 2012-08-21 15:00:00 | 1182.25 |
| 2012-08-21 16:00:00 | 1231.5 |
| 2012-08-21 17:00:00 | 1168.5 |
| 2012-08-21 18:00:00 | 1056.5 |
| 2012-08-21 19:00:00 | 1113 |
| 2012-08-21 20:00:00 | 1367.5 |
| 2012-08-21 21:00:00 | 1328.5 |
| 2012-08-21 22:00:00 | 1292.25 |
| 2012-08-21 23:00:00 | 1254.75 |
| 2012-08-22 | 1262 |
| 2012-08-22 01:00:00 | 1133.25 |
| 2012-08-22 02:00:00 | 1154.75 |
| 2012-08-22 03:00:00 | 1061.25 |
| 2012-08-22 04:00:00 | 1045.5 |
| 2012-08-22 05:00:00 | 1033 |
| 2012-08-22 06:00:00 | 1042.25 |
| 2012-08-22 07:00:00 | 1014.25 |
| 2012-08-22 08:00:00 | 1059.75 |
| 2012-08-22 09:00:00 | 1049.75 |
| 2012-08-22 10:00:00 | 1079.25 |
| 2012-08-22 11:00:00 | 1065.5 |
| 2012-08-22 12:00:00 | 1098.25 |
| 2012-08-22 13:00:00 | 1103.25 |
| 2012-08-22 14:00:00 | 1148.25 |
| 2012-08-22 15:00:00 | 1202.75 |
| 2012-08-22 16:00:00 | 1235 |
| 2012-08-22 17:00:00 | 1167.25 |
| 2012-08-22 18:00:00 | 1211.25 |
| 2012-08-22 19:00:00 | 1235.25 |
| 2012-08-22 20:00:00 | 1251.25 |
| 2012-08-22 21:00:00 | 1201 |
| 2012-08-22 22:00:00 | 1182 |
| 2012-08-22 23:00:00 | 1181.5 |
| 2012-08-23 | 1118.25 |
| 2012-08-23 01:00:00 | 1143 |
| 2012-08-23 02:00:00 | 1102 |
| 2012-08-23 03:00:00 | 1055 |
| 2012-08-23 04:00:00 | 1054.5 |
| 2012-08-23 05:00:00 | 1033.25 |
| 2012-08-23 06:00:00 | 1011.5 |
| 2012-08-23 07:00:00 | 1026 |
| 2012-08-23 08:00:00 | 1024.75 |
| 2012-08-23 09:00:00 | 997 |
| 2012-08-23 10:00:00 | 1022.25 |
| 2012-08-23 11:00:00 | 1034.5 |
| 2012-08-23 12:00:00 | 1143.75 |
| 2012-08-23 13:00:00 | 1177 |
| 2012-08-23 14:00:00 | 1207.75 |
| 2012-08-23 15:00:00 | 1880.75 |
| 2012-08-23 16:00:00 | 2193.5 |
| 2012-08-23 17:00:00 | 2219 |
| 2012-08-23 18:00:00 | 1580.5 |
| 2012-08-23 19:00:00 | 1444.25 |
| 2012-08-23 20:00:00 | 1226.5 |
| 2012-08-23 21:00:00 | 1122 |
| 2012-08-23 22:00:00 | 1093.75 |
| 2012-08-23 23:00:00 | 1107.5 |
| 2012-08-24 | 1056.75 |
| 2012-08-24 01:00:00 | 1084.75 |
| 2012-08-24 02:00:00 | 1068.25 |
| 2012-08-24 03:00:00 | 1035.5 |
| 2012-08-24 04:00:00 | 1004.25 |
| 2012-08-24 05:00:00 | 1010 |
| 2012-08-24 06:00:00 | 919 |
| 2012-08-24 07:00:00 | 925.5 |
| 2012-08-24 08:00:00 | 933.75 |
| 2012-08-24 09:00:00 | 945.25 |
| 2012-08-24 10:00:00 | 874 |
| 2012-08-24 11:00:00 | 998.25 |
| 2012-08-24 12:00:00 | 989.25 |
| 2012-08-24 13:00:00 | 1266.75 |
| 2012-08-24 14:00:00 | 1260.75 |
| 2012-08-24 15:00:00 | 1139.25 |
| 2012-08-24 16:00:00 | 1042.5 |
| 2012-08-24 17:00:00 | 1102.25 |
| 2012-08-24 18:00:00 | 1095.5 |
| 2012-08-24 19:00:00 | 1079 |
| 2012-08-24 20:00:00 | 1117.5 |
| 2012-08-24 21:00:00 | 1109.25 |
| 2012-08-24 22:00:00 | 1177.75 |
| 2012-08-24 23:00:00 | 1257.25 |
| 2012-08-25 | 1291.25 |
| 2012-08-25 01:00:00 | 1590.75 |
| 2012-08-25 02:00:00 | 1709.25 |
| 2012-08-25 03:00:00 | 1670.25 |
| 2012-08-25 04:00:00 | 1634.5 |
| 2012-08-25 05:00:00 | 1634 |
| 2012-08-25 06:00:00 | 1253 |
| 2012-08-25 07:00:00 | 992.25 |
| 2012-08-25 08:00:00 | 880.25 |
| 2012-08-25 09:00:00 | 864 |
| 2012-08-25 10:00:00 | 888 |
| 2012-08-25 11:00:00 | 905.25 |
| 2012-08-25 12:00:00 | 902.25 |
| 2012-08-25 13:00:00 | 912.25 |
| 2012-08-25 14:00:00 | 940.5 |
| 2012-08-25 15:00:00 | 966 |
| 2012-08-25 16:00:00 | 954.25 |
| 2012-08-25 17:00:00 | 983 |
| 2012-08-25 18:00:00 | 995.5 |
| 2012-08-25 19:00:00 | 975 |
| 2012-08-25 20:00:00 | 995.5 |
| 2012-08-25 21:00:00 | 989.5 |
| 2012-08-25 22:00:00 | 1004.5 |
| 2012-08-25 23:00:00 | 990.75 |
| 2012-08-26 | 985.75 |
| 2012-08-26 01:00:00 | 964.75 |
| 2012-08-26 02:00:00 | 961.75 |
| 2012-08-26 03:00:00 | 970.25 |
| 2012-08-26 04:00:00 | 952.25 |
| 2012-08-26 05:00:00 | 964.5 |
| 2012-08-26 06:00:00 | 967 |
| 2012-08-26 07:00:00 | 954.25 |
| 2012-08-26 08:00:00 | 987.25 |
| 2012-08-26 09:00:00 | 1276.25 |
| 2012-08-26 10:00:00 | 1521 |
| 2012-08-26 11:00:00 | 1583 |
| 2012-08-26 12:00:00 | 1565 |
| 2012-08-26 13:00:00 | 1477.75 |
| 2012-08-26 14:00:00 | 1303.75 |
| 2012-08-26 15:00:00 | 1331.25 |
| 2012-08-26 16:00:00 | 1125.25 |
| 2012-08-26 17:00:00 | 950.25 |
| 2012-08-26 18:00:00 | 980 |
| 2012-08-26 19:00:00 | 958 |
| 2012-08-26 20:00:00 | 977.25 |
| 2012-08-26 21:00:00 | 971.5 |
| 2012-08-26 22:00:00 | 982.5 |
| 2012-08-26 23:00:00 | 1039.75 |
| 2012-08-27 | 1091.75 |
| 2012-08-27 01:00:00 | 1102.75 |
| 2012-08-27 02:00:00 | 1056.5 |
| 2012-08-27 03:00:00 | 1095.25 |
| 2012-08-27 04:00:00 | 1037.5 |
| 2012-08-27 05:00:00 | 998.75 |
| 2012-08-27 06:00:00 | 1039.5 |
| 2012-08-27 07:00:00 | 1007.75 |
| 2012-08-27 08:00:00 | 1036.5 |
| 2012-08-27 09:00:00 | 979 |
| 2012-08-27 10:00:00 | 1140.75 |
| 2012-08-27 11:00:00 | 1156 |
| 2012-08-27 12:00:00 | 1223 |
| 2012-08-27 13:00:00 | 1174.75 |
| 2012-08-27 14:00:00 | 1130.25 |
| 2012-08-27 15:00:00 | 1226.75 |
| 2012-08-27 16:00:00 | 1377.25 |
| 2012-08-27 17:00:00 | 1309.25 |
| 2012-08-27 18:00:00 | 1303.75 |
| 2012-08-27 19:00:00 | 1426.75 |
| 2012-08-27 20:00:00 | 1348.25 |
| 2012-08-27 21:00:00 | 1342.25 |
| 2012-08-27 22:00:00 | 1247.5 |
| 2012-08-27 23:00:00 | 1300.75 |
| 2012-08-28 | 1344.25 |
| 2012-08-28 01:00:00 | 1251.25 |
| 2012-08-28 02:00:00 | 1320.5 |
| 2012-08-28 03:00:00 | 1269.25 |
| 2012-08-28 04:00:00 | 1128.75 |
| 2012-08-28 05:00:00 | 997.75 |
| 2012-08-28 06:00:00 | 1086.5 |
| 2012-08-28 07:00:00 | 985.5 |
| 2012-08-28 08:00:00 | 1062.75 |
| 2012-08-28 09:00:00 | 1011 |
| 2012-08-28 10:00:00 | 1075.75 |
| 2012-08-28 11:00:00 | 1123.5 |
| 2012-08-28 12:00:00 | 1284.5 |
| 2012-08-28 13:00:00 | 1254 |
| 2012-08-28 14:00:00 | 1315.75 |
| 2012-08-28 15:00:00 | 1373.75 |
| 2012-08-28 16:00:00 | 1392.75 |
| 2012-08-28 17:00:00 | 1334.25 |
| 2012-08-28 18:00:00 | 1357 |
| 2012-08-28 19:00:00 | 1312 |
| 2012-08-28 20:00:00 | 1361.5 |
| 2012-08-28 21:00:00 | 1369 |
| 2012-08-28 22:00:00 | 1430.25 |
| 2012-08-28 23:00:00 | 1305.75 |
| 2012-08-29 | 1331.5 |
| 2012-08-29 01:00:00 | 1246.5 |
| 2012-08-29 02:00:00 | 1167.5 |
| 2012-08-29 03:00:00 | 1109.75 |
| 2012-08-29 04:00:00 | 1022.5 |
| 2012-08-29 05:00:00 | 943.5 |
| 2012-08-29 06:00:00 | 945.5 |
| 2012-08-29 07:00:00 | 914 |
| 2012-08-29 08:00:00 | 965.5 |
| 2012-08-29 09:00:00 | 958.25 |
| 2012-08-29 10:00:00 | 967.5 |
| 2012-08-29 11:00:00 | 949.75 |
| 2012-08-29 12:00:00 | 1031.5 |
| 2012-08-29 13:00:00 | 1064 |
| 2012-08-29 14:00:00 | 1091.25 |
| 2012-08-29 15:00:00 | 1021.75 |
| 2012-08-29 16:00:00 | 1022.75 |
| 2012-08-29 17:00:00 | 994.75 |
| 2012-08-29 18:00:00 | 1024.75 |
| 2012-08-29 19:00:00 | 1019.5 |
| 2012-08-29 20:00:00 | 1003.75 |
| 2012-08-29 21:00:00 | 1074.25 |
| 2012-08-29 22:00:00 | 1017.25 |
| 2012-08-29 23:00:00 | 1110.25 |
| 2012-08-30 | 1165.5 |
| 2012-08-30 01:00:00 | 1086.75 |
| 2012-08-30 02:00:00 | 1068.5 |
| 2012-08-30 03:00:00 | 1024.75 |
| 2012-08-30 04:00:00 | 1059.75 |
| 2012-08-30 05:00:00 | 1023.75 |
| 2012-08-30 06:00:00 | 1032.25 |
| 2012-08-30 07:00:00 | 1039.75 |
| 2012-08-30 08:00:00 | 1050.5 |
| 2012-08-30 09:00:00 | 1061 |
| 2012-08-30 10:00:00 | 1065.5 |
| 2012-08-30 11:00:00 | 1082.5 |
| 2012-08-30 12:00:00 | 1070.75 |
| 2012-08-30 13:00:00 | 1086.75 |
| 2012-08-30 14:00:00 | 1075 |
| 2012-08-30 15:00:00 | 1114.75 |
| 2012-08-30 16:00:00 | 1051.25 |
| 2012-08-30 17:00:00 | 1068.25 |
| 2012-08-30 18:00:00 | 1035 |
| 2012-08-30 19:00:00 | 1072.25 |
| 2012-08-30 20:00:00 | 1094.5 |
| 2012-08-30 21:00:00 | 1140.75 |
| 2012-08-30 22:00:00 | 1164.5 |
| 2012-08-30 23:00:00 | 1196.25 |
| 2012-08-31 | 1196.75 |
| 2012-08-31 01:00:00 | 1233.25 |
| 2012-08-31 02:00:00 | 1210.5 |
| 2012-08-31 03:00:00 | 1137.5 |
| 2012-08-31 04:00:00 | 1097 |
| 2012-08-31 05:00:00 | 1054.75 |
| 2012-08-31 06:00:00 | 1034.5 |
| 2012-08-31 07:00:00 | 1049.5 |
| 2012-08-31 08:00:00 | 1047.25 |
| 2012-08-31 09:00:00 | 1084 |
| 2012-08-31 10:00:00 | 1084.5 |
| 2012-08-31 11:00:00 | 1129 |
| 2012-08-31 12:00:00 | 1086.5 |
| 2012-08-31 13:00:00 | 1056.5 |
| 2012-08-31 14:00:00 | 994.75 |
| 2012-08-31 15:00:00 | 1040 |
| 2012-08-31 16:00:00 | 1017.75 |
| 2012-08-31 17:00:00 | 1055.5 |
| 2012-08-31 18:00:00 | 1021.25 |
| 2012-08-31 19:00:00 | 1023.25 |
| 2012-08-31 20:00:00 | 1009.25 |
| 2012-08-31 21:00:00 | 1038 |
| 2012-08-31 22:00:00 | 1008 |
| 2012-08-31 23:00:00 | 1018.25 |
| 2012-09-01 | 993.75 |
| 2012-09-01 01:00:00 | 1086 |
| 2012-09-01 02:00:00 | 1033.75 |
| 2012-09-01 03:00:00 | 1025.25 |
| 2012-09-01 04:00:00 | 966.75 |
| 2012-09-01 05:00:00 | 987.5 |
| 2012-09-01 06:00:00 | 976 |
| 2012-09-01 07:00:00 | 979.5 |
| 2012-09-01 08:00:00 | 931.75 |
| 2012-09-01 09:00:00 | 940 |
| 2012-09-01 10:00:00 | 936.5 |
| 2012-09-01 11:00:00 | 994.5 |
| 2012-09-01 12:00:00 | 1014 |
| 2012-09-01 13:00:00 | 1025 |
| 2012-09-01 14:00:00 | 1065.75 |
| 2012-09-01 15:00:00 | 1062.25 |
| 2012-09-01 16:00:00 | 1020 |
| 2012-09-01 17:00:00 | 1042 |
| 2012-09-01 18:00:00 | 1006.75 |
| 2012-09-01 19:00:00 | 1033.5 |
| 2012-09-01 20:00:00 | 986.75 |
| 2012-09-01 21:00:00 | 1012.25 |
| 2012-09-01 22:00:00 | 998.5 |
| 2012-09-01 23:00:00 | 1009 |
| 2012-09-02 | 992.25 |
| 2012-09-02 01:00:00 | 998.75 |
| 2012-09-02 02:00:00 | 995 |
| 2012-09-02 03:00:00 | 954.75 |
| 2012-09-02 04:00:00 | 965 |
| 2012-09-02 05:00:00 | 959.75 |
| 2012-09-02 06:00:00 | 966.25 |
| 2012-09-02 07:00:00 | 940.75 |
| 2012-09-02 08:00:00 | 928.75 |
| 2012-09-02 09:00:00 | 903.75 |
| 2012-09-02 10:00:00 | 935.5 |
| 2012-09-02 11:00:00 | 972.25 |
| 2012-09-02 12:00:00 | 993.75 |
| 2012-09-02 13:00:00 | 989.25 |
| 2012-09-02 14:00:00 | 1004.5 |
| 2012-09-02 15:00:00 | 1000.5 |
| 2012-09-02 16:00:00 | 996.5 |
| 2012-09-02 17:00:00 | 1040.25 |
| 2012-09-02 18:00:00 | 1022.5 |
| 2012-09-02 19:00:00 | 1052.25 |
| 2012-09-02 20:00:00 | 1069.75 |
| 2012-09-02 21:00:00 | 1022.5 |
| 2012-09-02 22:00:00 | 1054 |
| 2012-09-02 23:00:00 | 1085.75 |
| 2012-09-03 | 1153.5 |
| 2012-09-03 01:00:00 | 1112 |
| 2012-09-03 02:00:00 | 1102 |
| 2012-09-03 03:00:00 | 1052.5 |
| 2012-09-03 04:00:00 | 1065 |
| 2012-09-03 05:00:00 | 1040.5 |
| 2012-09-03 06:00:00 | 1072 |
| 2012-09-03 07:00:00 | 1043.25 |
| 2012-09-03 08:00:00 | 1089.75 |
| 2012-09-03 09:00:00 | 1082.25 |
| 2012-09-03 10:00:00 | 1140 |
| 2012-09-03 11:00:00 | 1114.75 |
| 2012-09-03 12:00:00 | 1126.5 |
| 2012-09-03 13:00:00 | 1122.5 |
| 2012-09-03 14:00:00 | 1233 |
| 2012-09-03 15:00:00 | 1101.5 |
| 2012-09-03 16:00:00 | 1153.5 |
| 2012-09-03 17:00:00 | 1155.75 |
| 2012-09-03 18:00:00 | 1170.5 |
| 2012-09-03 19:00:00 | 1123 |
| 2012-09-03 20:00:00 | 1184 |
| 2012-09-03 21:00:00 | 1096 |
| 2012-09-03 22:00:00 | 1238.75 |
| 2012-09-03 23:00:00 | 1184.25 |
| 2012-09-04 | 1207 |
| 2012-09-04 01:00:00 | 1159 |
| 2012-09-04 02:00:00 | 1182 |
| 2012-09-04 03:00:00 | 1097.75 |
| 2012-09-04 04:00:00 | 1078.5 |
| 2012-09-04 05:00:00 | 1036 |
| 2012-09-04 06:00:00 | 1080.5 |
| 2012-09-04 07:00:00 | 1051.25 |
| 2012-09-04 08:00:00 | 1116.25 |
| 2012-09-04 09:00:00 | 1158.75 |
| 2012-09-04 10:00:00 | 1182.5 |
| 2012-09-04 11:00:00 | 1125 |
| 2012-09-04 12:00:00 | 1168.5 |
| 2012-09-04 13:00:00 | 1168.25 |
| 2012-09-04 14:00:00 | 1221.5 |
| 2012-09-04 15:00:00 | 1167 |
| 2012-09-04 16:00:00 | 1175 |
| 2012-09-04 17:00:00 | 1128.75 |
| 2012-09-04 18:00:00 | 1132.25 |
| 2012-09-04 19:00:00 | 1217 |
| 2012-09-04 20:00:00 | 1187.25 |
| 2012-09-04 21:00:00 | 1224.5 |
| 2012-09-04 22:00:00 | 1212 |
| 2012-09-04 23:00:00 | 1205.75 |
| 2012-09-05 | 1237.25 |
| 2012-09-05 01:00:00 | 1187.25 |
| 2012-09-05 02:00:00 | 1170 |
| 2012-09-05 03:00:00 | 1186.25 |
| 2012-09-05 04:00:00 | 1097 |
| 2012-09-05 05:00:00 | 969.25 |
| 2012-09-05 06:00:00 | 1008.75 |
| 2012-09-05 07:00:00 | 994.25 |
| 2012-09-05 08:00:00 | 1052.75 |
| 2012-09-05 09:00:00 | 1037.5 |
| 2012-09-05 10:00:00 | 1054.25 |
| 2012-09-05 11:00:00 | 1074 |
| 2012-09-05 12:00:00 | 1085.5 |
| 2012-09-05 13:00:00 | 1131 |
| 2012-09-05 14:00:00 | 1191.25 |
| 2012-09-05 15:00:00 | 1105.75 |
| 2012-09-05 16:00:00 | 1084.25 |
| 2012-09-05 17:00:00 | 1198.75 |
| 2012-09-05 18:00:00 | 1245.75 |
| 2012-09-05 19:00:00 | 1221.75 |
| 2012-09-05 20:00:00 | 1175.75 |
| 2012-09-05 21:00:00 | 1195 |
| 2012-09-05 22:00:00 | 1282.5 |
| 2012-09-05 23:00:00 | 1174.75 |
| 2012-09-06 | 1277.5 |
| 2012-09-06 01:00:00 | 1252.75 |
| 2012-09-06 02:00:00 | 1249.5 |
| 2012-09-06 03:00:00 | 1214 |
| 2012-09-06 04:00:00 | 1138 |
| 2012-09-06 05:00:00 | 1095.75 |
| 2012-09-06 06:00:00 | 1066 |
| 2012-09-06 07:00:00 | 1076.5 |
| 2012-09-06 08:00:00 | 1085.5 |
| 2012-09-06 09:00:00 | 1137.5 |
| 2012-09-06 10:00:00 | 1173.5 |
| 2012-09-06 11:00:00 | 1179.75 |
| 2012-09-06 12:00:00 | 1155.5 |
| 2012-09-06 13:00:00 | 1178.75 |
| 2012-09-06 14:00:00 | 1155.25 |
| 2012-09-06 15:00:00 | 1235.75 |
| 2012-09-06 16:00:00 | 1278 |
| 2012-09-06 17:00:00 | 1244 |
| 2012-09-06 18:00:00 | 1190.5 |
| 2012-09-06 19:00:00 | 1188.75 |
| 2012-09-06 20:00:00 | 1164 |
| 2012-09-06 21:00:00 | 1149 |
| 2012-09-06 22:00:00 | 1184.5 |
| 2012-09-06 23:00:00 | 1192 |
| 2012-09-07 | 1175.5 |
| 2012-09-07 01:00:00 | 1231.75 |
| 2012-09-07 02:00:00 | 1152 |
| 2012-09-07 03:00:00 | 1117.75 |
| 2012-09-07 04:00:00 | 1081 |
| 2012-09-07 05:00:00 | 1079.25 |
| 2012-09-07 06:00:00 | 1061.5 |
| 2012-09-07 07:00:00 | 1071.75 |
| 2012-09-07 08:00:00 | 1065.75 |
| 2012-09-07 09:00:00 | 1102 |
| 2012-09-07 10:00:00 | 1112.25 |
| 2012-09-07 11:00:00 | 1130.5 |
| 2012-09-07 12:00:00 | 1102.5 |
| 2012-09-07 13:00:00 | 1148.75 |
| 2012-09-07 14:00:00 | 1146 |
| 2012-09-07 15:00:00 | 1166.75 |
| 2012-09-07 16:00:00 | 1158.75 |
| 2012-09-07 17:00:00 | 1167.75 |
| 2012-09-07 18:00:00 | 1147.75 |
| 2012-09-07 19:00:00 | 1169 |
| 2012-09-07 20:00:00 | 1154.75 |
| 2012-09-07 21:00:00 | 1150.25 |
| 2012-09-07 22:00:00 | 1088.75 |
| 2012-09-07 23:00:00 | 1141 |
| 2012-09-08 | 1089.5 |
| 2012-09-08 01:00:00 | 1222.75 |
| 2012-09-08 02:00:00 | 1071.5 |
| 2012-09-08 03:00:00 | 1082 |
| 2012-09-08 04:00:00 | 963.75 |
| 2012-09-08 05:00:00 | 992.5 |
| 2012-09-08 06:00:00 | 965.25 |
| 2012-09-08 07:00:00 | 964.25 |
| 2012-09-08 08:00:00 | 937.5 |
| 2012-09-08 09:00:00 | 971.5 |
| 2012-09-08 10:00:00 | 954.75 |
| 2012-09-08 11:00:00 | 993 |
| 2012-09-08 12:00:00 | 984.5 |
| 2012-09-08 13:00:00 | 1003 |
| 2012-09-08 14:00:00 | 982.5 |
| 2012-09-08 15:00:00 | 1069.75 |
| 2012-09-08 16:00:00 | 1039 |
| 2012-09-08 17:00:00 | 1082 |
| 2012-09-08 18:00:00 | 972.25 |
| 2012-09-08 19:00:00 | 977.75 |
| 2012-09-08 20:00:00 | 1116.75 |
| 2012-09-08 21:00:00 | 1071.5 |
| 2012-09-08 22:00:00 | 1073.75 |
| 2012-09-08 23:00:00 | 1044 |
| 2012-09-09 | 1068.25 |
| 2012-09-09 01:00:00 | 1032.5 |
| 2012-09-09 02:00:00 | 1020.75 |
| 2012-09-09 03:00:00 | 990 |
| 2012-09-09 04:00:00 | 968.5 |
| 2012-09-09 05:00:00 | 966.25 |
| 2012-09-09 06:00:00 | 968 |
| 2012-09-09 07:00:00 | 955.75 |
| 2012-09-09 08:00:00 | 934.5 |
| 2012-09-09 09:00:00 | 918.75 |
| 2012-09-09 10:00:00 | 929.25 |
| 2012-09-09 11:00:00 | 955.5 |
| 2012-09-09 12:00:00 | 978.5 |
| 2012-09-09 13:00:00 | 979.25 |
| 2012-09-09 14:00:00 | 985 |
| 2012-09-09 15:00:00 | 1005 |
| 2012-09-09 16:00:00 | 1006.75 |
| 2012-09-09 17:00:00 | 1022.75 |
| 2012-09-09 18:00:00 | 1047 |
| 2012-09-09 19:00:00 | 1043.25 |
| 2012-09-09 20:00:00 | 1072.5 |
| 2012-09-09 21:00:00 | 1076.75 |
| 2012-09-09 22:00:00 | 1110.75 |
| 2012-09-09 23:00:00 | 1165.25 |
| 2012-09-10 | 1239 |
| 2012-09-10 01:00:00 | 1121 |
| 2012-09-10 02:00:00 | 1070.75 |
| 2012-09-10 03:00:00 | 1082.75 |
| 2012-09-10 04:00:00 | 1132.75 |
| 2012-09-10 05:00:00 | 1044.75 |
| 2012-09-10 06:00:00 | 1066.25 |
| 2012-09-10 07:00:00 | 1038.75 |
| 2012-09-10 08:00:00 | 1076.5 |
| 2012-09-10 09:00:00 | 1069 |
| 2012-09-10 10:00:00 | 1122.25 |
| 2012-09-10 11:00:00 | 1106.75 |
| 2012-09-10 12:00:00 | 1182.5 |
| 2012-09-10 13:00:00 | 1158 |
| 2012-09-10 14:00:00 | 1184.25 |
| 2012-09-10 15:00:00 | 1194.25 |
| 2012-09-10 16:00:00 | 1205 |
| 2012-09-10 17:00:00 | 1194.25 |
| 2012-09-10 18:00:00 | 1228.75 |
| 2012-09-10 19:00:00 | 1204.75 |
| 2012-09-10 20:00:00 | 1273.25 |
| 2012-09-10 21:00:00 | 1214.25 |
| 2012-09-10 22:00:00 | 1253.25 |
| 2012-09-10 23:00:00 | 1220.25 |
| 2012-09-11 | 1214.5 |
| 2012-09-11 01:00:00 | 1194.25 |
| 2012-09-11 02:00:00 | 1181.5 |
| 2012-09-11 03:00:00 | 1111.5 |
| 2012-09-11 04:00:00 | 1108.5 |
| 2012-09-11 05:00:00 | 1062.25 |
| 2012-09-11 06:00:00 | 1116.5 |
| 2012-09-11 07:00:00 | 1050 |
| 2012-09-11 08:00:00 | 1084 |
| 2012-09-11 09:00:00 | 1028.25 |
| 2012-09-11 10:00:00 | 1119 |
| 2012-09-11 11:00:00 | 1187 |
| 2012-09-11 12:00:00 | 1130.25 |
| 2012-09-11 13:00:00 | 1093.5 |
| 2012-09-11 14:00:00 | 1204.75 |
| 2012-09-11 15:00:00 | 1151.25 |
| 2012-09-11 16:00:00 | 1270.75 |
| 2012-09-11 17:00:00 | 1219 |
| 2012-09-11 18:00:00 | 1272.75 |
| 2012-09-11 19:00:00 | 1275.75 |
| 2012-09-11 20:00:00 | 1307.5 |
| 2012-09-11 21:00:00 | 1191.25 |
| 2012-09-11 22:00:00 | 1288.5 |
| 2012-09-11 23:00:00 | 1232.75 |
| 2012-09-12 | 1254.5 |
| 2012-09-12 01:00:00 | 1159 |
| 2012-09-12 02:00:00 | 1206.75 |
| 2012-09-12 03:00:00 | 1057.75 |
| 2012-09-12 04:00:00 | 1038.25 |
| 2012-09-12 05:00:00 | 991.75 |
| 2012-09-12 06:00:00 | 1029 |
| 2012-09-12 07:00:00 | 996 |
| 2012-09-12 08:00:00 | 1048.75 |
| 2012-09-12 09:00:00 | 1037.75 |
| 2012-09-12 10:00:00 | 1094 |
| 2012-09-12 11:00:00 | 1064.75 |
| 2012-09-12 12:00:00 | 1080 |
| 2012-09-12 13:00:00 | 1116.5 |
| 2012-09-12 14:00:00 | 1207.75 |
| 2012-09-12 15:00:00 | 1195.75 |
| 2012-09-12 16:00:00 | 1222.25 |
| 2012-09-12 17:00:00 | 1184.25 |
| 2012-09-12 18:00:00 | 1182 |
| 2012-09-12 19:00:00 | 1194.5 |
| 2012-09-12 20:00:00 | 1439.75 |
| 2012-09-12 21:00:00 | 1634.5 |
| 2012-09-12 22:00:00 | 1951.25 |
| 2012-09-12 23:00:00 | 1947.25 |
| 2012-09-13 | 1970.25 |
| 2012-09-13 01:00:00 | 2094.75 |
| 2012-09-13 02:00:00 | 2103.25 |
| 2012-09-13 03:00:00 | 2141.5 |
| 2012-09-13 04:00:00 | 1993.5 |
| 2012-09-13 05:00:00 | 2045.25 |
| 2012-09-13 06:00:00 | 2043.5 |
| 2012-09-13 07:00:00 | 2046.5 |
| 2012-09-13 08:00:00 | 2059.5 |
| 2012-09-13 09:00:00 | 2126 |
| 2012-09-13 10:00:00 | 2192.75 |
| 2012-09-13 11:00:00 | 2229.5 |
| 2012-09-13 12:00:00 | 2271.25 |
| 2012-09-13 13:00:00 | 1887.75 |
| 2012-09-13 14:00:00 | 1973.25 |
| 2012-09-13 15:00:00 | 1989.75 |
| 2012-09-13 16:00:00 | 2050.25 |
| 2012-09-13 17:00:00 | 2076.75 |
| 2012-09-13 18:00:00 | 1967.75 |
| 2012-09-13 19:00:00 | 1906 |
| 2012-09-13 20:00:00 | 1706 |
| 2012-09-13 21:00:00 | 1639.25 |
| 2012-09-13 22:00:00 | 1639.75 |
| 2012-09-13 23:00:00 | 1614 |
| 2012-09-14 | 1541 |
| 2012-09-14 01:00:00 | 1556.75 |
| 2012-09-14 02:00:00 | 1389.75 |
| 2012-09-14 03:00:00 | 1228 |
| 2012-09-14 04:00:00 | 1201.5 |
| 2012-09-14 05:00:00 | 1216 |
| 2012-09-14 06:00:00 | 1195.25 |
| 2012-09-14 07:00:00 | 1184.25 |
| 2012-09-14 08:00:00 | 1130.5 |
| 2012-09-14 09:00:00 | 1194.5 |
| 2012-09-14 10:00:00 | 1210.5 |
| 2012-09-14 11:00:00 | 1242.75 |
| 2012-09-14 12:00:00 | 1209.25 |
| 2012-09-14 13:00:00 | 1220.5 |
| 2012-09-14 14:00:00 | 1188.5 |
| 2012-09-14 15:00:00 | 1205 |
| 2012-09-14 16:00:00 | 1167.75 |
| 2012-09-14 17:00:00 | 1185.25 |
| 2012-09-14 18:00:00 | 1175.25 |
| 2012-09-14 19:00:00 | 1196.75 |
| 2012-09-14 20:00:00 | 1162.25 |
| 2012-09-14 21:00:00 | 1183.75 |
| 2012-09-14 22:00:00 | 1098.75 |
| 2012-09-14 23:00:00 | 1121.25 |
| 2012-09-15 | 1077.5 |
| 2012-09-15 01:00:00 | 1172.75 |
| 2012-09-15 02:00:00 | 1101.5 |
| 2012-09-15 03:00:00 | 1068.5 |
| 2012-09-15 04:00:00 | 1220.5 |
| 2012-09-15 05:00:00 | 999.75 |
| 2012-09-15 06:00:00 | 1010.5 |
| 2012-09-15 07:00:00 | 1032 |
| 2012-09-15 08:00:00 | 986 |
| 2012-09-15 09:00:00 | 1014.5 |
| 2012-09-15 10:00:00 | 996.25 |
| 2012-09-15 11:00:00 | 1041 |
| 2012-09-15 12:00:00 | 1026.75 |
| 2012-09-15 13:00:00 | 1056 |
| 2012-09-15 14:00:00 | 1043.5 |
| 2012-09-15 15:00:00 | 1061.25 |
| 2012-09-15 16:00:00 | 1037.25 |
| 2012-09-15 17:00:00 | 1034.75 |
| 2012-09-15 18:00:00 | 1032.25 |
| 2012-09-15 19:00:00 | 1098.25 |
| 2012-09-15 20:00:00 | 1112.25 |
| 2012-09-15 21:00:00 | 1080.75 |
| 2012-09-15 22:00:00 | 1128.5 |
| 2012-09-15 23:00:00 | 1143.5 |
| 2012-09-16 | 1152.5 |
| 2012-09-16 01:00:00 | 1116.75 |
| 2012-09-16 02:00:00 | 1061.5 |
| 2012-09-16 03:00:00 | 1050.5 |
| 2012-09-16 04:00:00 | 1009 |
| 2012-09-16 05:00:00 | 1023.5 |
| 2012-09-16 06:00:00 | 1019.25 |
| 2012-09-16 07:00:00 | 1002.75 |
| 2012-09-16 08:00:00 | 987.25 |
| 2012-09-16 09:00:00 | 971.25 |
| 2012-09-16 10:00:00 | 987 |
| 2012-09-16 11:00:00 | 1015 |
| 2012-09-16 12:00:00 | 1024.75 |
| 2012-09-16 13:00:00 | 1032.75 |
| 2012-09-16 14:00:00 | 1030.25 |
| 2012-09-16 15:00:00 | 1034 |
| 2012-09-16 16:00:00 | 1027 |
| 2012-09-16 17:00:00 | 1080 |
| 2012-09-16 18:00:00 | 1108 |
| 2012-09-16 19:00:00 | 1110.25 |
| 2012-09-16 20:00:00 | 1135.75 |
| 2012-09-16 21:00:00 | 1149 |
| 2012-09-16 22:00:00 | 1182.5 |
| 2012-09-16 23:00:00 | 1214 |
| 2012-09-17 | 1218.5 |
| 2012-09-17 01:00:00 | 1197.5 |
| 2012-09-17 02:00:00 | 1159.25 |
| 2012-09-17 03:00:00 | 1157.5 |
| 2012-09-17 04:00:00 | 1160.25 |
| 2012-09-17 05:00:00 | 1138.25 |
| 2012-09-17 06:00:00 | 1148.25 |
| 2012-09-17 07:00:00 | 1085.25 |
| 2012-09-17 08:00:00 | 1126.5 |
| 2012-09-17 09:00:00 | 1109 |
| 2012-09-17 10:00:00 | 1154.5 |
| 2012-09-17 11:00:00 | 1173.5 |
| 2012-09-17 12:00:00 | 1212.25 |
| 2012-09-17 13:00:00 | 1216 |
| 2012-09-17 14:00:00 | 1267.5 |
| 2012-09-17 15:00:00 | 1279 |
| 2012-09-17 16:00:00 | 1255 |
| 2012-09-17 17:00:00 | 1198 |
| 2012-09-17 18:00:00 | 1296.25 |
| 2012-09-17 19:00:00 | 1195.25 |
| 2012-09-17 20:00:00 | 1250.5 |
| 2012-09-17 21:00:00 | 1296 |
| 2012-09-17 22:00:00 | 1317 |
| 2012-09-17 23:00:00 | 1332.5 |
| 2012-09-18 | 1371.75 |
| 2012-09-18 01:00:00 | 1382.75 |
| 2012-09-18 02:00:00 | 1316 |
| 2012-09-18 03:00:00 | 1126.75 |
| 2012-09-18 04:00:00 | 1120.25 |
| 2012-09-18 05:00:00 | 1047.25 |
| 2012-09-18 06:00:00 | 1279.25 |
| 2012-09-18 07:00:00 | 1015.75 |
| 2012-09-18 08:00:00 | 1039.75 |
| 2012-09-18 09:00:00 | 1133.75 |
| 2012-09-18 10:00:00 | 1101.5 |
| 2012-09-18 11:00:00 | 1112.5 |
| 2012-09-18 12:00:00 | 1134.5 |
| 2012-09-18 13:00:00 | 1142.75 |
| 2012-09-18 14:00:00 | 1194.5 |
| 2012-09-18 15:00:00 | 1280 |
| 2012-09-18 16:00:00 | 1379.5 |
| 2012-09-18 17:00:00 | 1313 |
| 2012-09-18 18:00:00 | 1351 |
| 2012-09-18 19:00:00 | 1320.25 |
| 2012-09-18 20:00:00 | 1345.25 |
| 2012-09-18 21:00:00 | 1325.75 |
| 2012-09-18 22:00:00 | 1256.75 |
| 2012-09-18 23:00:00 | 1195.75 |
| 2012-09-19 | 1384.75 |
| 2012-09-19 01:00:00 | 1464.25 |
| 2012-09-19 02:00:00 | 1338.75 |
| 2012-09-19 03:00:00 | 1191 |
| 2012-09-19 04:00:00 | 1252 |
| 2012-09-19 05:00:00 | 1123.5 |
| 2012-09-19 06:00:00 | 1057.25 |
| 2012-09-19 07:00:00 | 1043.75 |
| 2012-09-19 08:00:00 | 1145.75 |
| 2012-09-19 09:00:00 | 1053.25 |
| 2012-09-19 10:00:00 | 1141.5 |
| 2012-09-19 11:00:00 | 1190.75 |
| 2012-09-19 12:00:00 | 1218.75 |
| 2012-09-19 13:00:00 | 1076.75 |
| 2012-09-19 14:00:00 | 1258.75 |
| 2012-09-19 15:00:00 | 1474.5 |
| 2012-09-19 16:00:00 | 1917.25 |
| 2012-09-19 17:00:00 | 2128.5 |
| 2012-09-19 18:00:00 | 2140.75 |
| 2012-09-19 19:00:00 | 1906 |
| 2012-09-19 20:00:00 | 1362.5 |
| 2012-09-19 21:00:00 | 1234 |
| 2012-09-19 22:00:00 | 1183.25 |
| 2012-09-19 23:00:00 | 1158.75 |
| 2012-09-20 | 1159.25 |
| 2012-09-20 01:00:00 | 1184.25 |
| 2012-09-20 02:00:00 | 1137.25 |
| 2012-09-20 03:00:00 | 1073.5 |
| 2012-09-20 04:00:00 | 1082.75 |
| 2012-09-20 05:00:00 | 1073.75 |
| 2012-09-20 06:00:00 | 1090.25 |
| 2012-09-20 07:00:00 | 1104 |
| 2012-09-20 08:00:00 | 1129.5 |
| 2012-09-20 09:00:00 | 1125.25 |
| 2012-09-20 10:00:00 | 1138 |
| 2012-09-20 11:00:00 | 1138.75 |
| 2012-09-20 12:00:00 | 1122 |
| 2012-09-20 13:00:00 | 1137.75 |
| 2012-09-20 14:00:00 | 1171.75 |
| 2012-09-20 15:00:00 | 1164.25 |
| 2012-09-20 16:00:00 | 1160 |
| 2012-09-20 17:00:00 | 1144.25 |
| 2012-09-20 18:00:00 | 1137.5 |
| 2012-09-20 19:00:00 | 1144.25 |
| 2012-09-20 20:00:00 | 1184.5 |
| 2012-09-20 21:00:00 | 1201.75 |
| 2012-09-20 22:00:00 | 1222.25 |
| 2012-09-20 23:00:00 | 1231 |
| 2012-09-21 | 1202.25 |
| 2012-09-21 01:00:00 | 1177.25 |
| 2012-09-21 02:00:00 | 1126.5 |
| 2012-09-21 03:00:00 | 1087.5 |
| 2012-09-21 04:00:00 | 1027 |
| 2012-09-21 05:00:00 | 1049.25 |
| 2012-09-21 06:00:00 | 1061 |
| 2012-09-21 07:00:00 | 1131.25 |
| 2012-09-21 08:00:00 | 1122.5 |
| 2012-09-21 09:00:00 | 1116.25 |
| 2012-09-21 10:00:00 | 1082 |
| 2012-09-21 11:00:00 | 1112.25 |
| 2012-09-21 12:00:00 | 1109.25 |
| 2012-09-21 13:00:00 | 1120.25 |
| 2012-09-21 14:00:00 | 1069.5 |
| 2012-09-21 15:00:00 | 1083.25 |
| 2012-09-21 16:00:00 | 1070.25 |
| 2012-09-21 17:00:00 | 1073.75 |
| 2012-09-21 18:00:00 | 1058 |
| 2012-09-21 19:00:00 | 1093.75 |
| 2012-09-21 20:00:00 | 1163 |
| 2012-09-21 21:00:00 | 1080.25 |
| 2012-09-21 22:00:00 | 1073.25 |
| 2012-09-21 23:00:00 | 1064 |
| 2012-09-22 | 1065 |
| 2012-09-22 01:00:00 | 1070.75 |
| 2012-09-22 02:00:00 | 1009 |
| 2012-09-22 03:00:00 | 1044 |
| 2012-09-22 04:00:00 | 958.75 |
| 2012-09-22 05:00:00 | 1002.75 |
| 2012-09-22 06:00:00 | 974.75 |
| 2012-09-22 07:00:00 | 1002.5 |
| 2012-09-22 08:00:00 | 951.75 |
| 2012-09-22 09:00:00 | 952.5 |
| 2012-09-22 10:00:00 | 962.25 |
| 2012-09-22 11:00:00 | 1001.75 |
| 2012-09-22 12:00:00 | 985.25 |
| 2012-09-22 13:00:00 | 1015.5 |
| 2012-09-22 14:00:00 | 989.25 |
| 2012-09-22 15:00:00 | 1010.25 |
| 2012-09-22 16:00:00 | 1035.5 |
| 2012-09-22 17:00:00 | 1034.5 |
| 2012-09-22 18:00:00 | 1048.5 |
| 2012-09-22 19:00:00 | 1134.25 |
| 2012-09-22 20:00:00 | 1436.5 |
| 2012-09-22 21:00:00 | 1478.75 |
| 2012-09-22 22:00:00 | 1304.25 |
| 2012-09-22 23:00:00 | 1379.5 |
| 2012-09-23 | 1215.75 |
| 2012-09-23 01:00:00 | 1145.5 |
| 2012-09-23 02:00:00 | 1055.75 |
| 2012-09-23 03:00:00 | 996.25 |
| 2012-09-23 04:00:00 | 982.25 |
| 2012-09-23 05:00:00 | 1003.75 |
| 2012-09-23 06:00:00 | 948.5 |
| 2012-09-23 07:00:00 | 965 |
| 2012-09-23 08:00:00 | 945.25 |
| 2012-09-23 09:00:00 | 941.5 |
| 2012-09-23 10:00:00 | 950 |
| 2012-09-23 11:00:00 | 972.5 |
| 2012-09-23 12:00:00 | 992.25 |
| 2012-09-23 13:00:00 | 1011.5 |
| 2012-09-23 14:00:00 | 996.75 |
| 2012-09-23 15:00:00 | 999.5 |
| 2012-09-23 16:00:00 | 988.25 |
| 2012-09-23 17:00:00 | 1043 |
| 2012-09-23 18:00:00 | 1061 |
| 2012-09-23 19:00:00 | 1029.25 |
| 2012-09-23 20:00:00 | 1065 |
| 2012-09-23 21:00:00 | 1094 |
| 2012-09-23 22:00:00 | 1111 |
| 2012-09-23 23:00:00 | 1136.25 |
| 2012-09-24 | 1124.75 |
| 2012-09-24 01:00:00 | 1114.25 |
| 2012-09-24 02:00:00 | 1116.5 |
| 2012-09-24 03:00:00 | 1085.5 |
| 2012-09-24 04:00:00 | 1025.75 |
| 2012-09-24 05:00:00 | 1012 |
| 2012-09-24 06:00:00 | 1032.25 |
| 2012-09-24 07:00:00 | 1039 |
| 2012-09-24 08:00:00 | 1066.5 |
| 2012-09-24 09:00:00 | 1075.25 |
| 2012-09-24 10:00:00 | 1094.25 |
| 2012-09-24 11:00:00 | 1088.5 |
| 2012-09-24 12:00:00 | 1151 |
| 2012-09-24 13:00:00 | 1099.25 |
| 2012-09-24 14:00:00 | 1147 |
| 2012-09-24 15:00:00 | 1199.75 |
| 2012-09-24 16:00:00 | 1320 |
| 2012-09-24 17:00:00 | 1206.25 |
| 2012-09-24 18:00:00 | 1183.25 |
| 2012-09-24 19:00:00 | 1214 |
| 2012-09-24 20:00:00 | 1236.5 |
| 2012-09-24 21:00:00 | 1238.25 |
| 2012-09-24 22:00:00 | 1297.5 |
| 2012-09-24 23:00:00 | 1168.25 |
| 2012-09-25 | 1233 |
| 2012-09-25 01:00:00 | 1189.75 |
| 2012-09-25 02:00:00 | 1172.5 |
| 2012-09-25 03:00:00 | 1177.75 |
| 2012-09-25 04:00:00 | 1102.75 |
| 2012-09-25 05:00:00 | 1069.75 |
| 2012-09-25 06:00:00 | 1086 |
| 2012-09-25 07:00:00 | 1073 |
| 2012-09-25 08:00:00 | 1145.5 |
| 2012-09-25 09:00:00 | 1189.25 |
| 2012-09-25 10:00:00 | 1215.75 |
| 2012-09-25 11:00:00 | 1237 |
| 2012-09-25 12:00:00 | 1257.75 |
| 2012-09-25 13:00:00 | 1212.5 |
| 2012-09-25 14:00:00 | 1228.5 |
| 2012-09-25 15:00:00 | 1221.5 |
| 2012-09-25 16:00:00 | 1185.5 |
| 2012-09-25 17:00:00 | 1067.25 |
| 2012-09-25 18:00:00 | 1166.25 |
| 2012-09-25 19:00:00 | 1222.75 |
| 2012-09-25 20:00:00 | 1195.5 |
| 2012-09-25 21:00:00 | 1118 |
| 2012-09-25 22:00:00 | 1170.25 |
| 2012-09-25 23:00:00 | 1195.25 |
| 2012-09-26 | 1275 |
| 2012-09-26 01:00:00 | 1207 |
| 2012-09-26 02:00:00 | 1234.5 |
| 2012-09-26 03:00:00 | 1133.25 |
| 2012-09-26 04:00:00 | 1239.25 |
| 2012-09-26 05:00:00 | 1073.25 |
| 2012-09-26 06:00:00 | 1049 |
| 2012-09-26 07:00:00 | 964.5 |
| 2012-09-26 08:00:00 | 1010 |
| 2012-09-26 09:00:00 | 984 |
| 2012-09-26 10:00:00 | 1021.25 |
| 2012-09-26 11:00:00 | 989.75 |
| 2012-09-26 12:00:00 | 1019.25 |
| 2012-09-26 13:00:00 | 1046.25 |
| 2012-09-26 14:00:00 | 1130.25 |
| 2012-09-26 15:00:00 | 1098.5 |
| 2012-09-26 16:00:00 | 1096.75 |
| 2012-09-26 17:00:00 | 1049.25 |
| 2012-09-26 18:00:00 | 1091.75 |
| 2012-09-26 19:00:00 | 1188 |
| 2012-09-26 20:00:00 | 1222.25 |
| 2012-09-26 21:00:00 | 1153.5 |
| 2012-09-26 22:00:00 | 1276.75 |
| 2012-09-26 23:00:00 | 1298 |
| 2012-09-27 | 1220.75 |
| 2012-09-27 01:00:00 | 1161.25 |
| 2012-09-27 02:00:00 | 1166.75 |
| 2012-09-27 03:00:00 | 1123 |
| 2012-09-27 04:00:00 | 1080.75 |
| 2012-09-27 05:00:00 | 1055.75 |
| 2012-09-27 06:00:00 | 1014 |
| 2012-09-27 07:00:00 | 1003 |
| 2012-09-27 08:00:00 | 1024.5 |
| 2012-09-27 09:00:00 | 1036.5 |
| 2012-09-27 10:00:00 | 1065.75 |
| 2012-09-27 11:00:00 | 1086 |
| 2012-09-27 12:00:00 | 1085.25 |
| 2012-09-27 13:00:00 | 1098 |
| 2012-09-27 14:00:00 | 1093.25 |
| 2012-09-27 15:00:00 | 1111.25 |
| 2012-09-27 16:00:00 | 1115.75 |
| 2012-09-27 17:00:00 | 1094 |
| 2012-09-27 18:00:00 | 1098 |
| 2012-09-27 19:00:00 | 1157.75 |
| 2012-09-27 20:00:00 | 1161 |
| 2012-09-27 21:00:00 | 1116.25 |
| 2012-09-27 22:00:00 | 1097.75 |
| 2012-09-27 23:00:00 | 1123.25 |
| 2012-09-28 | 1103.5 |
| 2012-09-28 01:00:00 | 1082.5 |
| 2012-09-28 02:00:00 | 1062.5 |
| 2012-09-28 03:00:00 | 1045.75 |
| 2012-09-28 04:00:00 | 1010.75 |
| 2012-09-28 05:00:00 | 1040.25 |
| 2012-09-28 06:00:00 | 1063.75 |
| 2012-09-28 07:00:00 | 971 |
| 2012-09-28 08:00:00 | 975.25 |
| 2012-09-28 09:00:00 | 959.25 |
| 2012-09-28 10:00:00 | 932.75 |
| 2012-09-28 11:00:00 | 964.75 |
| 2012-09-28 12:00:00 | 972.75 |
| 2012-09-28 13:00:00 | 992 |
| 2012-09-28 14:00:00 | 988.25 |
| 2012-09-28 15:00:00 | 984.75 |
| 2012-09-28 16:00:00 | 953 |
| 2012-09-28 17:00:00 | 948.25 |
| 2012-09-28 18:00:00 | 996.25 |
| 2012-09-28 19:00:00 | 984 |
| 2012-09-28 20:00:00 | 998 |
| 2012-09-28 21:00:00 | 1022 |
| 2012-09-28 22:00:00 | 1065.25 |
| 2012-09-28 23:00:00 | 1057.75 |
| 2012-09-29 | 1062 |
| 2012-09-29 01:00:00 | 1035.75 |
| 2012-09-29 02:00:00 | 960.25 |
| 2012-09-29 03:00:00 | 989 |
| 2012-09-29 04:00:00 | 930.75 |
| 2012-09-29 05:00:00 | 961 |
| 2012-09-29 06:00:00 | 952.25 |
| 2012-09-29 07:00:00 | 967.25 |
| 2012-09-29 08:00:00 | 902.75 |
| 2012-09-29 09:00:00 | 926 |
| 2012-09-29 10:00:00 | 909 |
| 2012-09-29 11:00:00 | 960.75 |
| 2012-09-29 12:00:00 | 940.5 |
| 2012-09-29 13:00:00 | 965 |
| 2012-09-29 14:00:00 | 966.5 |
| 2012-09-29 15:00:00 | 969.5 |
| 2012-09-29 16:00:00 | 958.25 |
| 2012-09-29 17:00:00 | 998.25 |
| 2012-09-29 18:00:00 | 983.75 |
| 2012-09-29 19:00:00 | 1044.5 |
| 2012-09-29 20:00:00 | 991.5 |
| 2012-09-29 21:00:00 | 1042.5 |
| 2012-09-29 22:00:00 | 1027.25 |
| 2012-09-29 23:00:00 | 1132.5 |
| 2012-09-30 | 1458 |
| 2012-09-30 01:00:00 | 1819.5 |
| 2012-09-30 02:00:00 | 2048 |
| 2012-09-30 03:00:00 | 2123 |
| 2012-09-30 04:00:00 | 2084.25 |
| 2012-09-30 05:00:00 | 1663 |
| 2012-09-30 06:00:00 | 1437 |
| 2012-09-30 07:00:00 | 1214.5 |
| 2012-09-30 08:00:00 | 1032 |
| 2012-09-30 09:00:00 | 963 |
| 2012-09-30 10:00:00 | 952.25 |
| 2012-09-30 11:00:00 | 973.5 |
| 2012-09-30 12:00:00 | 982.25 |
| 2012-09-30 13:00:00 | 994.75 |
| 2012-09-30 14:00:00 | 988.25 |
| 2012-09-30 15:00:00 | 995.75 |
| 2012-09-30 16:00:00 | 980.25 |
| 2012-09-30 17:00:00 | 957.5 |
| 2012-09-30 18:00:00 | 967.75 |
| 2012-09-30 19:00:00 | 972.75 |
| 2012-09-30 20:00:00 | 987.5 |
| 2012-09-30 21:00:00 | 1027.5 |
| 2012-09-30 22:00:00 | 1082 |
| 2012-09-30 23:00:00 | 1106.5 |
| 2012-10-01 | 1107.25 |
| 2012-10-01 01:00:00 | 1116.25 |
| 2012-10-01 02:00:00 | 1059.5 |
| 2012-10-01 03:00:00 | 1011 |
| 2012-10-01 04:00:00 | 1005 |
| 2012-10-01 05:00:00 | 994 |
| 2012-10-01 06:00:00 | 1016.25 |
| 2012-10-01 07:00:00 | 1021.5 |
| 2012-10-01 08:00:00 | 1042 |
| 2012-10-01 09:00:00 | 1052.5 |
| 2012-10-01 10:00:00 | 1077.75 |
| 2012-10-01 11:00:00 | 1075.25 |
| 2012-10-01 12:00:00 | 1094.75 |
| 2012-10-01 13:00:00 | 1059 |
| 2012-10-01 14:00:00 | 1088.75 |
| 2012-10-01 15:00:00 | 1053.5 |
| 2012-10-01 16:00:00 | 1101.25 |
| 2012-10-01 17:00:00 | 1063.75 |
| 2012-10-01 18:00:00 | 1111.5 |
| 2012-10-01 19:00:00 | 1116.25 |
| 2012-10-01 20:00:00 | 1150.75 |
| 2012-10-01 21:00:00 | 1139.5 |
| 2012-10-01 22:00:00 | 1197.5 |
| 2012-10-01 23:00:00 | 1156.25 |
| 2012-10-02 | 1159 |
| 2012-10-02 01:00:00 | 1117.25 |
| 2012-10-02 02:00:00 | 1107.75 |
| 2012-10-02 03:00:00 | 1091.25 |
| 2012-10-02 04:00:00 | 1070.75 |
| 2012-10-02 05:00:00 | 998.75 |
| 2012-10-02 06:00:00 | 1024.5 |
| 2012-10-02 07:00:00 | 1036.5 |
| 2012-10-02 08:00:00 | 1040.75 |
| 2012-10-02 09:00:00 | 1034.5 |
| 2012-10-02 10:00:00 | 1111.5 |
| 2012-10-02 11:00:00 | 1074.5 |
| 2012-10-02 12:00:00 | 1130.5 |
| 2012-10-02 13:00:00 | 1037.5 |
| 2012-10-02 14:00:00 | 1106.25 |
| 2012-10-02 15:00:00 | 1115.75 |
| 2012-10-02 16:00:00 | 1133.5 |
| 2012-10-02 17:00:00 | 1075 |
| 2012-10-02 18:00:00 | 1117 |
| 2012-10-02 19:00:00 | 1097.25 |
| 2012-10-02 20:00:00 | 1140.25 |
| 2012-10-02 21:00:00 | 1127.25 |
| 2012-10-02 22:00:00 | 1183 |
| 2012-10-02 23:00:00 | 1141.5 |
| 2012-10-03 | 1163.25 |
| 2012-10-03 01:00:00 | 1097.75 |
| 2012-10-03 02:00:00 | 1115.5 |
| 2012-10-03 03:00:00 | 1093.25 |
| 2012-10-03 04:00:00 | 1019.75 |
| 2012-10-03 05:00:00 | 1006 |
| 2012-10-03 06:00:00 | 978 |
| 2012-10-03 07:00:00 | 966 |
| 2012-10-03 08:00:00 | 969.5 |
| 2012-10-03 09:00:00 | 984.25 |
| 2012-10-03 10:00:00 | 1046 |
| 2012-10-03 11:00:00 | 1005 |
| 2012-10-03 12:00:00 | 1089 |
| 2012-10-03 13:00:00 | 1038.75 |
| 2012-10-03 14:00:00 | 1076 |
| 2012-10-03 15:00:00 | 1067.25 |
| 2012-10-03 16:00:00 | 1145.5 |
| 2012-10-03 17:00:00 | 1090 |
| 2012-10-03 18:00:00 | 1141.25 |
| 2012-10-03 19:00:00 | 1059.5 |
| 2012-10-03 20:00:00 | 1103.25 |
| 2012-10-03 21:00:00 | 1082.25 |
| 2012-10-03 22:00:00 | 1156.75 |
| 2012-10-03 23:00:00 | 1218.5 |
| 2012-10-04 | 1260.75 |
| 2012-10-04 01:00:00 | 1180.75 |
| 2012-10-04 02:00:00 | 1172.5 |
| 2012-10-04 03:00:00 | 1090.5 |
| 2012-10-04 04:00:00 | 1032 |
| 2012-10-04 05:00:00 | 1004.25 |
| 2012-10-04 06:00:00 | 1018.75 |
| 2012-10-04 07:00:00 | 1024.5 |
| 2012-10-04 08:00:00 | 1025.25 |
| 2012-10-04 09:00:00 | 1027 |
| 2012-10-04 10:00:00 | 1053.5 |
| 2012-10-04 11:00:00 | 1174.5 |
| 2012-10-04 12:00:00 | 1143.25 |
| 2012-10-04 13:00:00 | 1142.5 |
| 2012-10-04 14:00:00 | 1119.25 |
| 2012-10-04 15:00:00 | 1124 |
| 2012-10-04 16:00:00 | 1108.25 |
| 2012-10-04 17:00:00 | 1077 |
| 2012-10-04 18:00:00 | 1221.5 |
| 2012-10-04 19:00:00 | 1247.75 |
| 2012-10-04 20:00:00 | 1192.5 |
| 2012-10-04 21:00:00 | 1197.5 |
| 2012-10-04 22:00:00 | 1318.25 |
| 2012-10-04 23:00:00 | 1813.75 |
| 2012-10-05 | 2010 |
| 2012-10-05 01:00:00 | 2093 |
| 2012-10-05 02:00:00 | 1990.75 |
| 2012-10-05 03:00:00 | 1780 |
| 2012-10-05 04:00:00 | 1197 |
| 2012-10-05 05:00:00 | 1088.25 |
| 2012-10-05 06:00:00 | 1044 |
| 2012-10-05 07:00:00 | 1074.75 |
| 2012-10-05 08:00:00 | 1064.75 |
| 2012-10-05 09:00:00 | 1091.25 |
| 2012-10-05 10:00:00 | 1098.25 |
| 2012-10-05 11:00:00 | 1093.5 |
| 2012-10-05 12:00:00 | 1057.25 |
| 2012-10-05 13:00:00 | 1081.25 |
| 2012-10-05 14:00:00 | 1084 |
| 2012-10-05 15:00:00 | 1079.75 |
| 2012-10-05 16:00:00 | 1125.25 |
| 2012-10-05 17:00:00 | 1182 |
| 2012-10-05 18:00:00 | 1153 |
| 2012-10-05 19:00:00 | 1151.75 |
| 2012-10-05 20:00:00 | 1173.25 |
| 2012-10-05 21:00:00 | 1180.5 |
| 2012-10-05 22:00:00 | 1121.25 |
| 2012-10-05 23:00:00 | 1137.75 |
| 2012-10-06 | 1098.75 |
| 2012-10-06 01:00:00 | 1137.25 |
| 2012-10-06 02:00:00 | 1108.25 |
| 2012-10-06 03:00:00 | 1027 |
| 2012-10-06 04:00:00 | 966.25 |
| 2012-10-06 05:00:00 | 964.25 |
| 2012-10-06 06:00:00 | 942.5 |
| 2012-10-06 07:00:00 | 974.25 |
| 2012-10-06 08:00:00 | 909 |
| 2012-10-06 09:00:00 | 926.5 |
| 2012-10-06 10:00:00 | 926.5 |
| 2012-10-06 11:00:00 | 983.5 |
| 2012-10-06 12:00:00 | 977.25 |
| 2012-10-06 13:00:00 | 1003.25 |
| 2012-10-06 14:00:00 | 980 |
| 2012-10-06 15:00:00 | 1017 |
| 2012-10-06 16:00:00 | 975.5 |
| 2012-10-06 17:00:00 | 979.5 |
| 2012-10-06 18:00:00 | 1011.5 |
| 2012-10-06 19:00:00 | 1078.5 |
| 2012-10-06 20:00:00 | 1065.75 |
| 2012-10-06 21:00:00 | 1112.25 |
| 2012-10-06 22:00:00 | 1028.25 |
| 2012-10-06 23:00:00 | 1102 |
| 2012-10-07 | 1173.25 |
| 2012-10-07 01:00:00 | 1121.75 |
| 2012-10-07 02:00:00 | 990.75 |
| 2012-10-07 03:00:00 | 1023.5 |
| 2012-10-07 04:00:00 | 969 |
| 2012-10-07 05:00:00 | 978.25 |
| 2012-10-07 06:00:00 | 971.75 |
| 2012-10-07 07:00:00 | 1036.75 |
| 2012-10-07 08:00:00 | 995 |
| 2012-10-07 09:00:00 | 984.5 |
| 2012-10-07 10:00:00 | 1035.25 |
| 2012-10-07 11:00:00 | 1194.25 |
| 2012-10-07 12:00:00 | 1481 |
| 2012-10-07 13:00:00 | 1590.75 |
| 2012-10-07 14:00:00 | 1675.5 |
| 2012-10-07 15:00:00 | 1977.25 |
| 2012-10-07 16:00:00 | 2078.5 |
| 2012-10-07 17:00:00 | 2242.75 |
| 2012-10-07 18:00:00 | 2195.25 |
| 2012-10-07 19:00:00 | 2073.75 |
| 2012-10-07 20:00:00 | 1854.5 |
| 2012-10-07 21:00:00 | 1834.5 |
| 2012-10-07 22:00:00 | 1347.5 |
| 2012-10-07 23:00:00 | 1398 |
| 2012-10-08 | 1450.75 |
| 2012-10-08 01:00:00 | 1332.25 |
| 2012-10-08 02:00:00 | 1173.5 |
| 2012-10-08 03:00:00 | 1138.25 |
| 2012-10-08 04:00:00 | 1112 |
| 2012-10-08 05:00:00 | 1111.75 |
| 2012-10-08 06:00:00 | 1107.5 |
| 2012-10-08 07:00:00 | 1148.5 |
| 2012-10-08 08:00:00 | 1146 |
| 2012-10-08 09:00:00 | 1197 |
| 2012-10-08 10:00:00 | 1198.25 |
| 2012-10-08 11:00:00 | 1198.75 |
| 2012-10-08 12:00:00 | 1200.5 |
| 2012-10-08 13:00:00 | 1210.25 |
| 2012-10-08 14:00:00 | 1166.5 |
| 2012-10-08 15:00:00 | 1134.25 |
| 2012-10-08 16:00:00 | 1116 |
| 2012-10-08 17:00:00 | 1088.25 |
| 2012-10-08 18:00:00 | 1108 |
| 2012-10-08 19:00:00 | 1109.25 |
| 2012-10-08 20:00:00 | 1132 |
| 2012-10-08 21:00:00 | 1171 |
| 2012-10-08 22:00:00 | 1239.25 |
| 2012-10-08 23:00:00 | 1213.75 |
| 2012-10-09 | 1236 |
| 2012-10-09 01:00:00 | 1151.25 |
| 2012-10-09 02:00:00 | 1164.25 |
| 2012-10-09 03:00:00 | 1047.5 |
| 2012-10-09 04:00:00 | 1066 |
| 2012-10-09 05:00:00 | 1056 |
| 2012-10-09 06:00:00 | 1084.5 |
| 2012-10-09 07:00:00 | 1110 |
| 2012-10-09 08:00:00 | 1148.5 |
| 2012-10-09 09:00:00 | 1122.75 |
| 2012-10-09 10:00:00 | 1310 |
| 2012-10-09 11:00:00 | 1177.25 |
| 2012-10-09 12:00:00 | 1220.25 |
| 2012-10-09 13:00:00 | 1163.25 |
| 2012-10-09 14:00:00 | 1228.75 |
| 2012-10-09 15:00:00 | 1203.75 |
| 2012-10-09 16:00:00 | 1198.75 |
| 2012-10-09 17:00:00 | 1159.5 |
| 2012-10-09 18:00:00 | 1189 |
| 2012-10-09 19:00:00 | 1159 |
| 2012-10-09 20:00:00 | 1195.5 |
| 2012-10-09 21:00:00 | 1177.5 |
| 2012-10-09 22:00:00 | 1234.25 |
| 2012-10-09 23:00:00 | 1219.25 |
| 2012-10-10 | 1275 |
| 2012-10-10 01:00:00 | 1173 |
| 2012-10-10 02:00:00 | 1181 |
| 2012-10-10 03:00:00 | 1086.75 |
| 2012-10-10 04:00:00 | 1113.75 |
| 2012-10-10 05:00:00 | 1040.5 |
| 2012-10-10 06:00:00 | 1031.25 |
| 2012-10-10 07:00:00 | 1060.75 |
| 2012-10-10 08:00:00 | 1125.5 |
| 2012-10-10 09:00:00 | 1096.5 |
| 2012-10-10 10:00:00 | 1151.75 |
| 2012-10-10 11:00:00 | 1103.5 |
| 2012-10-10 12:00:00 | 1197.75 |
| 2012-10-10 13:00:00 | 1152.75 |
| 2012-10-10 14:00:00 | 1228.5 |
| 2012-10-10 15:00:00 | 1204 |
| 2012-10-10 16:00:00 | 1203.75 |
| 2012-10-10 17:00:00 | 1217.5 |
| 2012-10-10 18:00:00 | 1282 |
| 2012-10-10 19:00:00 | 1187.25 |
| 2012-10-10 20:00:00 | 1204 |
| 2012-10-10 21:00:00 | 1191.25 |
| 2012-10-10 22:00:00 | 1255.75 |
| 2012-10-10 23:00:00 | 1269.5 |
| 2012-10-11 | 1289 |
| 2012-10-11 01:00:00 | 1229.5 |
| 2012-10-11 02:00:00 | 1250 |
| 2012-10-11 03:00:00 | 1177.25 |
| 2012-10-11 04:00:00 | 1076.25 |
| 2012-10-11 05:00:00 | 1067.75 |
| 2012-10-11 06:00:00 | 1056.5 |
| 2012-10-11 07:00:00 | 1083.5 |
| 2012-10-11 08:00:00 | 1104 |
| 2012-10-11 09:00:00 | 1093 |
| 2012-10-11 10:00:00 | 1178.25 |
| 2012-10-11 11:00:00 | 1174.5 |
| 2012-10-11 12:00:00 | 1205.25 |
| 2012-10-11 13:00:00 | 1204.5 |
| 2012-10-11 14:00:00 | 1195.5 |
| 2012-10-11 15:00:00 | 1199 |
| 2012-10-11 16:00:00 | 1204.75 |
| 2012-10-11 17:00:00 | 1208.25 |
| 2012-10-11 18:00:00 | 1192.75 |
| 2012-10-11 19:00:00 | 1162.5 |
| 2012-10-11 20:00:00 | 1189 |
| 2012-10-11 21:00:00 | 1154 |
| 2012-10-11 22:00:00 | 1196 |
| 2012-10-11 23:00:00 | 1175 |
| 2012-10-12 | 1166.75 |
| 2012-10-12 01:00:00 | 1132.25 |
| 2012-10-12 02:00:00 | 1105 |
| 2012-10-12 03:00:00 | 1073.5 |
| 2012-10-12 04:00:00 | 1045.5 |
| 2012-10-12 05:00:00 | 1041 |
| 2012-10-12 06:00:00 | 1064.75 |
| 2012-10-12 07:00:00 | 1112 |
| 2012-10-12 08:00:00 | 1105 |
| 2012-10-12 09:00:00 | 1105.25 |
| 2012-10-12 10:00:00 | 1151.5 |
| 2012-10-12 11:00:00 | 1141.5 |
| 2012-10-12 12:00:00 | 1108.75 |
| 2012-10-12 13:00:00 | 1115 |
| 2012-10-12 14:00:00 | 1080.5 |
| 2012-10-12 15:00:00 | 1067.25 |
| 2012-10-12 16:00:00 | 1098.75 |
| 2012-10-12 17:00:00 | 1123.25 |
| 2012-10-12 18:00:00 | 1135.5 |
| 2012-10-12 19:00:00 | 1124.75 |
| 2012-10-12 20:00:00 | 1104 |
| 2012-10-12 21:00:00 | 1117 |
| 2012-10-12 22:00:00 | 1087.5 |
| 2012-10-12 23:00:00 | 1119.75 |
| 2012-10-13 | 1122.25 |
| 2012-10-13 01:00:00 | 1209.75 |
| 2012-10-13 02:00:00 | 1377 |
| 2012-10-13 03:00:00 | 1619.5 |
| 2012-10-13 04:00:00 | 1630 |
| 2012-10-13 05:00:00 | 1570.75 |
| 2012-10-13 06:00:00 | 1315.75 |
| 2012-10-13 07:00:00 | 1212.5 |
| 2012-10-13 08:00:00 | 1005 |
| 2012-10-13 09:00:00 | 1019.5 |
| 2012-10-13 10:00:00 | 965.5 |
| 2012-10-13 11:00:00 | 1004.25 |
| 2012-10-13 12:00:00 | 988.5 |
| 2012-10-13 13:00:00 | 1014.75 |
| 2012-10-13 14:00:00 | 997.75 |
| 2012-10-13 15:00:00 | 1015.5 |
| 2012-10-13 16:00:00 | 980.5 |
| 2012-10-13 17:00:00 | 1077.5 |
| 2012-10-13 18:00:00 | 1104 |
| 2012-10-13 19:00:00 | 1049 |
| 2012-10-13 20:00:00 | 1057.25 |
| 2012-10-13 21:00:00 | 1054.25 |
| 2012-10-13 22:00:00 | 1045.5 |
| 2012-10-13 23:00:00 | 1073.25 |
| 2012-10-14 | 1035.5 |
| 2012-10-14 01:00:00 | 1030 |
| 2012-10-14 02:00:00 | 1009 |
| 2012-10-14 03:00:00 | 988.75 |
| 2012-10-14 04:00:00 | 947.25 |
| 2012-10-14 05:00:00 | 997 |
| 2012-10-14 06:00:00 | 959.25 |
| 2012-10-14 07:00:00 | 982.75 |
| 2012-10-14 08:00:00 | 928.5 |
| 2012-10-14 09:00:00 | 940.75 |
| 2012-10-14 10:00:00 | 939 |
| 2012-10-14 11:00:00 | 991.25 |
| 2012-10-14 12:00:00 | 986.25 |
| 2012-10-14 13:00:00 | 1006 |
| 2012-10-14 14:00:00 | 994.25 |
| 2012-10-14 15:00:00 | 1003.25 |
| 2012-10-14 16:00:00 | 1040.25 |
| 2012-10-14 17:00:00 | 1088.5 |
| 2012-10-14 18:00:00 | 1074.25 |
| 2012-10-14 19:00:00 | 1110 |
| 2012-10-14 20:00:00 | 1111.5 |
| 2012-10-14 21:00:00 | 1147 |
| 2012-10-14 22:00:00 | 1215.25 |
| 2012-10-14 23:00:00 | 1252 |
| 2012-10-15 | 1281.75 |
| 2012-10-15 01:00:00 | 1291 |
| 2012-10-15 02:00:00 | 1166 |
| 2012-10-15 03:00:00 | 1188.5 |
| 2012-10-15 04:00:00 | 1081.25 |
| 2012-10-15 05:00:00 | 1082 |
| 2012-10-15 06:00:00 | 1057.5 |
| 2012-10-15 07:00:00 | 1072.25 |
| 2012-10-15 08:00:00 | 1074.25 |
| 2012-10-15 09:00:00 | 1115 |
| 2012-10-15 10:00:00 | 1144 |
| 2012-10-15 11:00:00 | 1176.25 |
| 2012-10-15 12:00:00 | 1219.5 |
| 2012-10-15 13:00:00 | 1250.25 |
| 2012-10-15 14:00:00 | 1301.75 |
| 2012-10-15 15:00:00 | 1282.5 |
| 2012-10-15 16:00:00 | 1313.25 |
| 2012-10-15 17:00:00 | 1333.75 |
| 2012-10-15 18:00:00 | 1297.5 |
| 2012-10-15 19:00:00 | 1333 |
| 2012-10-15 20:00:00 | 1342 |
| 2012-10-15 21:00:00 | 1426.25 |
| 2012-10-15 22:00:00 | 1553 |
| 2012-10-15 23:00:00 | 1666.5 |
| 2012-10-16 | 1661.5 |
| 2012-10-16 01:00:00 | 1633.75 |
| 2012-10-16 02:00:00 | 1441 |
| 2012-10-16 03:00:00 | 1393.25 |
| 2012-10-16 04:00:00 | 1102.5 |
| 2012-10-16 05:00:00 | 1170 |
| 2012-10-16 06:00:00 | 1135.25 |
| 2012-10-16 07:00:00 | 1175.5 |
| 2012-10-16 08:00:00 | 1264 |
| 2012-10-16 09:00:00 | 1487.25 |
| 2012-10-16 10:00:00 | 1705 |
| 2012-10-16 11:00:00 | 1727.75 |
| 2012-10-16 12:00:00 | 1715 |
| 2012-10-16 13:00:00 | 1671.25 |
| 2012-10-16 14:00:00 | 1803.5 |
| 2012-10-16 15:00:00 | 2073.5 |
| 2012-10-16 16:00:00 | 2422.75 |
| 2012-10-16 17:00:00 | 2491.75 |
| 2012-10-16 18:00:00 | 2506.25 |
| 2012-10-16 19:00:00 | 2400.5 |
| 2012-10-16 20:00:00 | 2220.75 |
| 2012-10-16 21:00:00 | 2054.25 |
| 2012-10-16 22:00:00 | 1577.75 |
| 2012-10-16 23:00:00 | 1543.75 |
| 2012-10-17 | 1567.75 |
| 2012-10-17 01:00:00 | 1548.5 |
| 2012-10-17 02:00:00 | 1589.5 |
| 2012-10-17 03:00:00 | 1308.25 |
| 2012-10-17 04:00:00 | 1163.5 |
| 2012-10-17 05:00:00 | 1116 |
| 2012-10-17 06:00:00 | 1150.5 |
| 2012-10-17 07:00:00 | 1148.75 |
| 2012-10-17 08:00:00 | 1172.5 |
| 2012-10-17 09:00:00 | 1176.5 |
| 2012-10-17 10:00:00 | 1224.25 |
| 2012-10-17 11:00:00 | 1196 |
| 2012-10-17 12:00:00 | 1226 |
| 2012-10-17 13:00:00 | 1177.75 |
| 2012-10-17 14:00:00 | 1182.5 |
| 2012-10-17 15:00:00 | 1106.75 |
| 2012-10-17 16:00:00 | 1152.75 |
| 2012-10-17 17:00:00 | 1160.75 |
| 2012-10-17 18:00:00 | 1269.5 |
| 2012-10-17 19:00:00 | 1186.25 |
| 2012-10-17 20:00:00 | 1292.25 |
| 2012-10-17 21:00:00 | 1195.25 |
| 2012-10-17 22:00:00 | 1302.75 |
| 2012-10-17 23:00:00 | 1231.25 |
| 2012-10-18 | 1319.5 |
| 2012-10-18 01:00:00 | 1182.5 |
| 2012-10-18 02:00:00 | 1226.5 |
| 2012-10-18 03:00:00 | 1144.5 |
| 2012-10-18 04:00:00 | 1089.75 |
| 2012-10-18 05:00:00 | 1089 |
| 2012-10-18 06:00:00 | 1086 |
| 2012-10-18 07:00:00 | 1104.75 |
| 2012-10-18 08:00:00 | 1130.25 |
| 2012-10-18 09:00:00 | 1098.75 |
| 2012-10-18 10:00:00 | 1177 |
| 2012-10-18 11:00:00 | 1196 |
| 2012-10-18 12:00:00 | 1330 |
| 2012-10-18 13:00:00 | 1278.5 |
| 2012-10-18 14:00:00 | 1297.25 |
| 2012-10-18 15:00:00 | 1259.25 |
| 2012-10-18 16:00:00 | 1305.25 |
| 2012-10-18 17:00:00 | 1314.25 |
| 2012-10-18 18:00:00 | 1511.25 |
| 2012-10-18 19:00:00 | 1353.5 |
| 2012-10-18 20:00:00 | 1299.5 |
| 2012-10-18 21:00:00 | 1247 |
| 2012-10-18 22:00:00 | 1277.75 |
| 2012-10-18 23:00:00 | 1276 |
| 2012-10-19 | 1275 |
| 2012-10-19 01:00:00 | 1206.25 |
| 2012-10-19 02:00:00 | 1174.25 |
| 2012-10-19 03:00:00 | 1232 |
| 2012-10-19 04:00:00 | 1171 |
| 2012-10-19 05:00:00 | 1033.5 |
| 2012-10-19 06:00:00 | 1009.5 |
| 2012-10-19 07:00:00 | 1028.75 |
| 2012-10-19 08:00:00 | 1020.5 |
| 2012-10-19 09:00:00 | 1041.75 |
| 2012-10-19 10:00:00 | 1043.75 |
| 2012-10-19 11:00:00 | 1076.5 |
| 2012-10-19 12:00:00 | 1110.5 |
| 2012-10-19 13:00:00 | 1108 |
| 2012-10-19 14:00:00 | 1140 |
| 2012-10-19 15:00:00 | 1080.5 |
| 2012-10-19 16:00:00 | 1080.75 |
| 2012-10-19 17:00:00 | 1072.25 |
| 2012-10-19 18:00:00 | 1061.5 |
| 2012-10-19 19:00:00 | 1097.25 |
| 2012-10-19 20:00:00 | 1087.75 |
| 2012-10-19 21:00:00 | 1111.25 |
| 2012-10-19 22:00:00 | 1102.25 |
| 2012-10-19 23:00:00 | 1106.75 |
| 2012-10-20 | 1085.5 |
| 2012-10-20 01:00:00 | 1077.25 |
| 2012-10-20 02:00:00 | 1026 |
| 2012-10-20 03:00:00 | 1038.75 |
| 2012-10-20 04:00:00 | 961.25 |
| 2012-10-20 05:00:00 | 969.75 |
| 2012-10-20 06:00:00 | 957.25 |
| 2012-10-20 07:00:00 | 978.75 |
| 2012-10-20 08:00:00 | 934.75 |
| 2012-10-20 09:00:00 | 953.25 |
| 2012-10-20 10:00:00 | 922 |
| 2012-10-20 11:00:00 | 963.25 |
| 2012-10-20 12:00:00 | 994.25 |
| 2012-10-20 13:00:00 | 1024.75 |
| 2012-10-20 14:00:00 | 960.25 |
| 2012-10-20 15:00:00 | 976.25 |
| 2012-10-20 16:00:00 | 1052.5 |
| 2012-10-20 17:00:00 | 1103 |
| 2012-10-20 18:00:00 | 997 |
| 2012-10-20 19:00:00 | 1080.5 |
| 2012-10-20 20:00:00 | 1080.25 |
| 2012-10-20 21:00:00 | 1060.75 |
| 2012-10-20 22:00:00 | 1071.5 |
| 2012-10-20 23:00:00 | 1143.75 |
| 2012-10-21 | 1098.25 |
| 2012-10-21 01:00:00 | 1092 |
| 2012-10-21 02:00:00 | 1049.5 |
| 2012-10-21 03:00:00 | 1003.75 |
| 2012-10-21 04:00:00 | 968.75 |
| 2012-10-21 05:00:00 | 995.25 |
| 2012-10-21 06:00:00 | 979.5 |
| 2012-10-21 07:00:00 | 1013.25 |
| 2012-10-21 08:00:00 | 958.5 |
| 2012-10-21 09:00:00 | 977.5 |
| 2012-10-21 10:00:00 | 948.5 |
| 2012-10-21 11:00:00 | 999 |
| 2012-10-21 12:00:00 | 992.5 |
| 2012-10-21 13:00:00 | 1068 |
| 2012-10-21 14:00:00 | 1056.75 |
| 2012-10-21 15:00:00 | 1044.25 |
| 2012-10-21 16:00:00 | 1076.75 |
| 2012-10-21 17:00:00 | 1160.25 |
| 2012-10-21 18:00:00 | 1055 |
| 2012-10-21 19:00:00 | 1117.5 |
| 2012-10-21 20:00:00 | 1196.25 |
| 2012-10-21 21:00:00 | 1165 |
| 2012-10-21 22:00:00 | 1198.25 |
| 2012-10-21 23:00:00 | 1257.75 |
| 2012-10-22 | 1172 |
| 2012-10-22 01:00:00 | 1184.25 |
| 2012-10-22 02:00:00 | 1108 |
| 2012-10-22 03:00:00 | 1121.5 |
| 2012-10-22 04:00:00 | 985.25 |
| 2012-10-22 05:00:00 | 1010.75 |
| 2012-10-22 06:00:00 | 1013.75 |
| 2012-10-22 07:00:00 | 1055 |
| 2012-10-22 08:00:00 | 1063.75 |
| 2012-10-22 09:00:00 | 1071.25 |
| 2012-10-22 10:00:00 | 1096.5 |
| 2012-10-22 11:00:00 | 1182 |
| 2012-10-22 12:00:00 | 1209 |
| 2012-10-22 13:00:00 | 1181.25 |
| 2012-10-22 14:00:00 | 1128.5 |
| 2012-10-22 15:00:00 | 1089 |
| 2012-10-22 16:00:00 | 1059.25 |
| 2012-10-22 17:00:00 | 1124.5 |
| 2012-10-22 18:00:00 | 1162.25 |
| 2012-10-22 19:00:00 | 1157.5 |
| 2012-10-22 20:00:00 | 1160.5 |
| 2012-10-22 21:00:00 | 1196.5 |
| 2012-10-22 22:00:00 | 1263.5 |
| 2012-10-22 23:00:00 | 1304 |
| 2012-10-23 | 1353.75 |
| 2012-10-23 01:00:00 | 1212 |
| 2012-10-23 02:00:00 | 1164.75 |
| 2012-10-23 03:00:00 | 1167.25 |
| 2012-10-23 04:00:00 | 1150.25 |
| 2012-10-23 05:00:00 | 1094.75 |
| 2012-10-23 06:00:00 | 1052.5 |
| 2012-10-23 07:00:00 | 1070.25 |
| 2012-10-23 08:00:00 | 1108.25 |
| 2012-10-23 09:00:00 | 1125.25 |
| 2012-10-23 10:00:00 | 1171 |
| 2012-10-23 11:00:00 | 1251 |
| 2012-10-23 12:00:00 | 1229.75 |
| 2012-10-23 13:00:00 | 1208.5 |
| 2012-10-23 14:00:00 | 1335 |
| 2012-10-23 15:00:00 | 1305.25 |
| 2012-10-23 16:00:00 | 1273 |
| 2012-10-23 17:00:00 | 1240.25 |
| 2012-10-23 18:00:00 | 1295 |
| 2012-10-23 19:00:00 | 1235.5 |
| 2012-10-23 20:00:00 | 1300 |
| 2012-10-23 21:00:00 | 1239.25 |
| 2012-10-23 22:00:00 | 1329 |
| 2012-10-23 23:00:00 | 1285.75 |
| 2012-10-24 | 1290 |
| 2012-10-24 01:00:00 | 1265 |
| 2012-10-24 02:00:00 | 1197 |
| 2012-10-24 03:00:00 | 1158.25 |
| 2012-10-24 04:00:00 | 1152 |
| 2012-10-24 05:00:00 | 1059.75 |
| 2012-10-24 06:00:00 | 1096.25 |
| 2012-10-24 07:00:00 | 1073 |
| 2012-10-24 08:00:00 | 1120.25 |
| 2012-10-24 09:00:00 | 1098.25 |
| 2012-10-24 10:00:00 | 1144.25 |
| 2012-10-24 11:00:00 | 1127.5 |
| 2012-10-24 12:00:00 | 1170 |
| 2012-10-24 13:00:00 | 1156 |
| 2012-10-24 14:00:00 | 1185.75 |
| 2012-10-24 15:00:00 | 1228.25 |
| 2012-10-24 16:00:00 | 1286.25 |
| 2012-10-24 17:00:00 | 1227.75 |
| 2012-10-24 18:00:00 | 1287.5 |
| 2012-10-24 19:00:00 | 1258.75 |
| 2012-10-24 20:00:00 | 1288.75 |
| 2012-10-24 21:00:00 | 1240.5 |
| 2012-10-24 22:00:00 | 1271.75 |
| 2012-10-24 23:00:00 | 1203 |
| 2012-10-25 | 1233.75 |
| 2012-10-25 01:00:00 | 1188.75 |
| 2012-10-25 02:00:00 | 1210.25 |
| 2012-10-25 03:00:00 | 1152.75 |
| 2012-10-25 04:00:00 | 1209.25 |
| 2012-10-25 05:00:00 | 1125.5 |
| 2012-10-25 06:00:00 | 1228.5 |
| 2012-10-25 07:00:00 | 1139.25 |
| 2012-10-25 08:00:00 | 1128.75 |
| 2012-10-25 09:00:00 | 1053.25 |
| 2012-10-25 10:00:00 | 1125 |
| 2012-10-25 11:00:00 | 1112.5 |
| 2012-10-25 12:00:00 | 1139.5 |
| 2012-10-25 13:00:00 | 1136.5 |
| 2012-10-25 14:00:00 | 1142.5 |
| 2012-10-25 15:00:00 | 1084.75 |
| 2012-10-25 16:00:00 | 1111.25 |
| 2012-10-25 17:00:00 | 1158.75 |
| 2012-10-25 18:00:00 | 1238.5 |
| 2012-10-25 19:00:00 | 1223.25 |
| 2012-10-25 20:00:00 | 1273.5 |
| 2012-10-25 21:00:00 | 1218.5 |
| 2012-10-25 22:00:00 | 1309.5 |
| 2012-10-25 23:00:00 | 1232.25 |
| 2012-10-26 | 1295.75 |
| 2012-10-26 01:00:00 | 1287.75 |
| 2012-10-26 02:00:00 | 1221 |
| 2012-10-26 03:00:00 | 1116.25 |
| 2012-10-26 04:00:00 | 1182.75 |
| 2012-10-26 05:00:00 | 1126.25 |
| 2012-10-26 06:00:00 | 1098.5 |
| 2012-10-26 07:00:00 | 1078.75 |
| 2012-10-26 08:00:00 | 1150.75 |
| 2012-10-26 09:00:00 | 1189.75 |
| 2012-10-26 10:00:00 | 1212.5 |
| 2012-10-26 11:00:00 | 1171.75 |
| 2012-10-26 12:00:00 | 1144.5 |
| 2012-10-26 13:00:00 | 1134.25 |
| 2012-10-26 14:00:00 | 1172.25 |
| 2012-10-26 15:00:00 | 1162.25 |
| 2012-10-26 16:00:00 | 1156 |
| 2012-10-26 17:00:00 | 1200.25 |
| 2012-10-26 18:00:00 | 1180 |
| 2012-10-26 19:00:00 | 1189 |
| 2012-10-26 20:00:00 | 1198.5 |
| 2012-10-26 21:00:00 | 1204.75 |
| 2012-10-26 22:00:00 | 1291.25 |
| 2012-10-26 23:00:00 | 1482.75 |
| 2012-10-27 | 1398 |
| 2012-10-27 01:00:00 | 1354.75 |
| 2012-10-27 02:00:00 | 1347.5 |
| 2012-10-27 03:00:00 | 1442.75 |
| 2012-10-27 04:00:00 | 1720.5 |
| 2012-10-27 05:00:00 | 1898.75 |
| 2012-10-27 06:00:00 | 1909.75 |
| 2012-10-27 07:00:00 | 1840.75 |
| 2012-10-27 08:00:00 | 1720.5 |
| 2012-10-27 09:00:00 | 1765 |
| 2012-10-27 10:00:00 | 1912.25 |
| 2012-10-27 11:00:00 | 1834.75 |
| 2012-10-27 12:00:00 | 1732.75 |
| 2012-10-27 13:00:00 | 1792.25 |
| 2012-10-27 14:00:00 | 1890.75 |
| 2012-10-27 15:00:00 | 1931.5 |
| 2012-10-27 16:00:00 | 1805 |
| 2012-10-27 17:00:00 | 1946.5 |
| 2012-10-27 18:00:00 | 1955 |
| 2012-10-27 19:00:00 | 2150.5 |
| 2012-10-27 20:00:00 | 2054.5 |
| 2012-10-27 21:00:00 | 1874.25 |
| 2012-10-27 22:00:00 | 1460.5 |
| 2012-10-27 23:00:00 | 1475.5 |
| 2012-10-28 | 1495.75 |
| 2012-10-28 01:00:00 | 1500.25 |
| 2012-10-28 02:00:00 | 1457.75 |
| 2012-10-28 02:00:00 | 1484 |
| 2012-10-28 03:00:00 | 1446 |
| 2012-10-28 04:00:00 | 1491.25 |
| 2012-10-28 05:00:00 | 1285.5 |
| 2012-10-28 06:00:00 | 1213.75 |
| 2012-10-28 07:00:00 | 1144.5 |
| 2012-10-28 08:00:00 | 1156.75 |
| 2012-10-28 09:00:00 | 1152.5 |
| 2012-10-28 10:00:00 | 1315 |
| 2012-10-28 11:00:00 | 1418.75 |
| 2012-10-28 12:00:00 | 1438.5 |
| 2012-10-28 13:00:00 | 1404 |
| 2012-10-28 14:00:00 | 1485.25 |
| 2012-10-28 15:00:00 | 1434.75 |
| 2012-10-28 16:00:00 | 1504.75 |
| 2012-10-28 17:00:00 | 1488.5 |
| 2012-10-28 18:00:00 | 1484.75 |
| 2012-10-28 19:00:00 | 1441.75 |
| 2012-10-28 20:00:00 | 1387.25 |
| 2012-10-28 21:00:00 | 1366.75 |
| 2012-10-28 22:00:00 | 1348.5 |
| 2012-10-28 23:00:00 | 1387.25 |
| 2012-10-29 | 1320.25 |
| 2012-10-29 01:00:00 | 1238.25 |
| 2012-10-29 02:00:00 | 1251 |
| 2012-10-29 03:00:00 | 1277.75 |
| 2012-10-29 04:00:00 | 1195.25 |
| 2012-10-29 05:00:00 | 1140.25 |
| 2012-10-29 06:00:00 | 1174.25 |
| 2012-10-29 07:00:00 | 1170.5 |
| 2012-10-29 08:00:00 | 1235.5 |
| 2012-10-29 09:00:00 | 1199.75 |
| 2012-10-29 10:00:00 | 1245.5 |
| 2012-10-29 11:00:00 | 1227.25 |
| 2012-10-29 12:00:00 | 1334 |
| 2012-10-29 13:00:00 | 1429 |
| 2012-10-29 14:00:00 | 1411 |
| 2012-10-29 15:00:00 | 1410.75 |
| 2012-10-29 16:00:00 | 1427.25 |
| 2012-10-29 17:00:00 | 1544.5 |
| 2012-10-29 18:00:00 | 1531.5 |
| 2012-10-29 19:00:00 | 1324.75 |
| 2012-10-29 20:00:00 | 1340.75 |
| 2012-10-29 21:00:00 | 1339.75 |
| 2012-10-29 22:00:00 | 1387.25 |
| 2012-10-29 23:00:00 | 1443.25 |
| 2012-10-30 | 1444.75 |
| 2012-10-30 01:00:00 | 1403.25 |
| 2012-10-30 02:00:00 | 1382 |
| 2012-10-30 03:00:00 | 1277.75 |
| 2012-10-30 04:00:00 | 1275.75 |
| 2012-10-30 05:00:00 | 1173.5 |
| 2012-10-30 06:00:00 | 1163.75 |
| 2012-10-30 07:00:00 | 1189 |
| 2012-10-30 08:00:00 | 1196.75 |
| 2012-10-30 09:00:00 | 1203.5 |
| 2012-10-30 10:00:00 | 1423.25 |
| 2012-10-30 11:00:00 | 1283.5 |
| 2012-10-30 12:00:00 | 1329.75 |
| 2012-10-30 13:00:00 | 1476.25 |
| 2012-10-30 14:00:00 | 1418.5 |
| 2012-10-30 15:00:00 | 1537.5 |
| 2012-10-30 16:00:00 | 1513 |
| 2012-10-30 17:00:00 | 1642.5 |
| 2012-10-30 18:00:00 | 1629.75 |
| 2012-10-30 19:00:00 | 1592.5 |
| 2012-10-30 20:00:00 | 1572 |
| 2012-10-30 21:00:00 | 1561.5 |
| 2012-10-30 22:00:00 | 1518.5 |
| 2012-10-30 23:00:00 | 1521.75 |
| 2012-10-31 | 1457.75 |
| 2012-10-31 01:00:00 | 1432.5 |
| 2012-10-31 02:00:00 | 1499.25 |
| 2012-10-31 03:00:00 | 1432.5 |
| 2012-10-31 04:00:00 | 1177.5 |
| 2012-10-31 05:00:00 | 1177 |
| 2012-10-31 06:00:00 | 1164.5 |
| 2012-10-31 07:00:00 | 1231.75 |
| 2012-10-31 08:00:00 | 1220.5 |
| 2012-10-31 09:00:00 | 1266.5 |
| 2012-10-31 10:00:00 | 1281 |
| 2012-10-31 11:00:00 | 1358.5 |
| 2012-10-31 12:00:00 | 1383.25 |
| 2012-10-31 13:00:00 | 1503 |
| 2012-10-31 14:00:00 | 1488 |
| 2012-10-31 15:00:00 | 1529.75 |
| 2012-10-31 16:00:00 | 1471.75 |
| 2012-10-31 17:00:00 | 1443 |
| 2012-10-31 18:00:00 | 1255 |
| 2012-10-31 19:00:00 | 1441.5 |
| 2012-10-31 20:00:00 | 1280.5 |
| 2012-10-31 21:00:00 | 1215.25 |
| 2012-10-31 22:00:00 | 1257.75 |
| 2012-10-31 23:00:00 | 1175.25 |
| 2012-11-01 | 1155.5 |
| 2012-11-01 01:00:00 | 1303.25 |
| 2012-11-01 02:00:00 | 1152 |
| 2012-11-01 03:00:00 | 1234.75 |
| 2012-11-01 04:00:00 | 1118.25 |
| 2012-11-01 05:00:00 | 1185 |
| 2012-11-01 06:00:00 | 1107.25 |
| 2012-11-01 07:00:00 | 1160.75 |
| 2012-11-01 08:00:00 | 1098.75 |
| 2012-11-01 09:00:00 | 1096 |
| 2012-11-01 10:00:00 | 1053.5 |
| 2012-11-01 11:00:00 | 1068.25 |
| 2012-11-01 12:00:00 | 1045 |
| 2012-11-01 13:00:00 | 1061.25 |
| 2012-11-01 14:00:00 | 1045.75 |
| 2012-11-01 15:00:00 | 1199.25 |
| 2012-11-01 16:00:00 | 1169.5 |
| 2012-11-01 17:00:00 | 1283.5 |
| 2012-11-01 18:00:00 | 1185.5 |
| 2012-11-01 19:00:00 | 1337.25 |
| 2012-11-01 20:00:00 | 1381.5 |
| 2012-11-01 21:00:00 | 1412.75 |
| 2012-11-01 22:00:00 | 1310.5 |
| 2012-11-01 23:00:00 | 1303.25 |
| 2012-11-02 | 1249.5 |
| 2012-11-02 01:00:00 | 1245.5 |
| 2012-11-02 02:00:00 | 1230 |
| 2012-11-02 03:00:00 | 1225.5 |
| 2012-11-02 04:00:00 | 1058.75 |
| 2012-11-02 05:00:00 | 1025 |
| 2012-11-02 06:00:00 | 1023.75 |
| 2012-11-02 07:00:00 | 1065.75 |
| 2012-11-02 08:00:00 | 1042.5 |
| 2012-11-02 09:00:00 | 1074.25 |
| 2012-11-02 10:00:00 | 1081.5 |
| 2012-11-02 11:00:00 | 1103.75 |
| 2012-11-02 12:00:00 | 1073.25 |
| 2012-11-02 13:00:00 | 1086 |
| 2012-11-02 14:00:00 | 1073.5 |
| 2012-11-02 15:00:00 | 1078 |
| 2012-11-02 16:00:00 | 1095.5 |
| 2012-11-02 17:00:00 | 1203 |
| 2012-11-02 18:00:00 | 1231.75 |
| 2012-11-02 19:00:00 | 1198.75 |
| 2012-11-02 20:00:00 | 1215.25 |
| 2012-11-02 21:00:00 | 1216.5 |
| 2012-11-02 22:00:00 | 1145.5 |
| 2012-11-02 23:00:00 | 1098.75 |
| 2012-11-03 | 1102 |
| 2012-11-03 01:00:00 | 1154.25 |
| 2012-11-03 02:00:00 | 1142.25 |
| 2012-11-03 03:00:00 | 1145.25 |
| 2012-11-03 04:00:00 | 1021.25 |
| 2012-11-03 05:00:00 | 1027.25 |
| 2012-11-03 06:00:00 | 1021.5 |
| 2012-11-03 07:00:00 | 1009.75 |
| 2012-11-03 08:00:00 | 993.25 |
| 2012-11-03 09:00:00 | 984 |
| 2012-11-03 10:00:00 | 1041.25 |
| 2012-11-03 11:00:00 | 1029.75 |
| 2012-11-03 12:00:00 | 1034.25 |
| 2012-11-03 13:00:00 | 1017 |
| 2012-11-03 14:00:00 | 1076.25 |
| 2012-11-03 15:00:00 | 1057.75 |
| 2012-11-03 16:00:00 | 1071.25 |
| 2012-11-03 17:00:00 | 1064.5 |
| 2012-11-03 18:00:00 | 1096.5 |
| 2012-11-03 19:00:00 | 1136 |
| 2012-11-03 20:00:00 | 1247 |
| 2012-11-03 21:00:00 | 1226.25 |
| 2012-11-03 22:00:00 | 1252 |
| 2012-11-03 23:00:00 | 1193 |
| 2012-11-04 | 1170 |
| 2012-11-04 01:00:00 | 1146 |
| 2012-11-04 02:00:00 | 1145.5 |
| 2012-11-04 03:00:00 | 1091.75 |
| 2012-11-04 04:00:00 | 1073 |
| 2012-11-04 05:00:00 | 1004 |
| 2012-11-04 06:00:00 | 1044.5 |
| 2012-11-04 07:00:00 | 1010.25 |
| 2012-11-04 08:00:00 | 998.5 |
| 2012-11-04 09:00:00 | 956.25 |
| 2012-11-04 10:00:00 | 1010.5 |
| 2012-11-04 11:00:00 | 1008.75 |
| 2012-11-04 12:00:00 | 1063.5 |
| 2012-11-04 13:00:00 | 1041 |
| 2012-11-04 14:00:00 | 1167.75 |
| 2012-11-04 15:00:00 | 1060.25 |
| 2012-11-04 16:00:00 | 1101.25 |
| 2012-11-04 17:00:00 | 1037.5 |
| 2012-11-04 18:00:00 | 1144.25 |
| 2012-11-04 19:00:00 | 1144 |
| 2012-11-04 20:00:00 | 1245.75 |
| 2012-11-04 21:00:00 | 1340 |
| 2012-11-04 22:00:00 | 1285.25 |
| 2012-11-04 23:00:00 | 1251.5 |
| 2012-11-05 | 1270.75 |
| 2012-11-05 01:00:00 | 1253.25 |
| 2012-11-05 02:00:00 | 1247 |
| 2012-11-05 03:00:00 | 1221.75 |
| 2012-11-05 04:00:00 | 1114.75 |
| 2012-11-05 05:00:00 | 1167 |
| 2012-11-05 06:00:00 | 1893.25 |
| 2012-11-05 07:00:00 | 2185.25 |
| 2012-11-05 08:00:00 | 2294.75 |
| 2012-11-05 09:00:00 | 2374 |
| 2012-11-05 10:00:00 | 2485.75 |
| 2012-11-05 11:00:00 | 2130.25 |
| 2012-11-05 12:00:00 | 1982.75 |
| 2012-11-05 13:00:00 | 1917.75 |
| 2012-11-05 14:00:00 | 1979 |
| 2012-11-05 15:00:00 | 1919.5 |
| 2012-11-05 16:00:00 | 1801.5 |
| 2012-11-05 17:00:00 | 1756 |
| 2012-11-05 18:00:00 | 1797 |
| 2012-11-05 19:00:00 | 1550 |
| 2012-11-05 20:00:00 | 1489 |
| 2012-11-05 21:00:00 | 1531.25 |
| 2012-11-05 22:00:00 | 1607.25 |
| 2012-11-05 23:00:00 | 1606.25 |
| 2012-11-06 | 1604 |
| 2012-11-06 01:00:00 | 1616.25 |
| 2012-11-06 02:00:00 | 1629.5 |
| 2012-11-06 03:00:00 | 1399 |
| 2012-11-06 04:00:00 | 1169.5 |
| 2012-11-06 05:00:00 | 1192 |
| 2012-11-06 06:00:00 | 1184 |
| 2012-11-06 07:00:00 | 1198 |
| 2012-11-06 08:00:00 | 1201 |
| 2012-11-06 09:00:00 | 1248.5 |
| 2012-11-06 10:00:00 | 1326.75 |
| 2012-11-06 11:00:00 | 1387 |
| 2012-11-06 12:00:00 | 1697 |
| 2012-11-06 13:00:00 | 1741.5 |
| 2012-11-06 14:00:00 | 1796.25 |
| 2012-11-06 15:00:00 | 1725.75 |
| 2012-11-06 16:00:00 | 1522 |
| 2012-11-06 17:00:00 | 1532.25 |
| 2012-11-06 18:00:00 | 1519.75 |
| 2012-11-06 19:00:00 | 1486.5 |
| 2012-11-06 20:00:00 | 1454.25 |
| 2012-11-06 21:00:00 | 1329.25 |
| 2012-11-06 22:00:00 | 1397 |
| 2012-11-06 23:00:00 | 1447.5 |
| 2012-11-07 | 1341.25 |
| 2012-11-07 01:00:00 | 1418.75 |
| 2012-11-07 02:00:00 | 1229 |
| 2012-11-07 03:00:00 | 1165.5 |
| 2012-11-07 04:00:00 | 1106 |
| 2012-11-07 05:00:00 | 1058.75 |
| 2012-11-07 06:00:00 | 1047.5 |
| 2012-11-07 07:00:00 | 1105.25 |
| 2012-11-07 08:00:00 | 1087.75 |
| 2012-11-07 09:00:00 | 1133.75 |
| 2012-11-07 10:00:00 | 1139.5 |
| 2012-11-07 11:00:00 | 1169.5 |
| 2012-11-07 12:00:00 | 1133.5 |
| 2012-11-07 13:00:00 | 1184.5 |
| 2012-11-07 14:00:00 | 1292.75 |
| 2012-11-07 15:00:00 | 1308 |
| 2012-11-07 16:00:00 | 1259.75 |
| 2012-11-07 17:00:00 | 1393.5 |
| 2012-11-07 18:00:00 | 1366.5 |
| 2012-11-07 19:00:00 | 1377 |
| 2012-11-07 20:00:00 | 1359.75 |
| 2012-11-07 21:00:00 | 1352.75 |
| 2012-11-07 22:00:00 | 1214.5 |
| 2012-11-07 23:00:00 | 1265.25 |
| 2012-11-08 | 1245.25 |
| 2012-11-08 01:00:00 | 1256.25 |
| 2012-11-08 02:00:00 | 1201 |
| 2012-11-08 03:00:00 | 1217.5 |
| 2012-11-08 04:00:00 | 1159.75 |
| 2012-11-08 05:00:00 | 1163 |
| 2012-11-08 06:00:00 | 1122 |
| 2012-11-08 07:00:00 | 1193.75 |
| 2012-11-08 08:00:00 | 1076.25 |
| 2012-11-08 09:00:00 | 1127.5 |
| 2012-11-08 10:00:00 | 1106.75 |
| 2012-11-08 11:00:00 | 1283.75 |
| 2012-11-08 12:00:00 | 1135 |
| 2012-11-08 13:00:00 | 1273 |
| 2012-11-08 14:00:00 | 1276.75 |
| 2012-11-08 15:00:00 | 1314.25 |
| 2012-11-08 16:00:00 | 1323.25 |
| 2012-11-08 17:00:00 | 1391 |
| 2012-11-08 18:00:00 | 1363.25 |
| 2012-11-08 19:00:00 | 1390.5 |
| 2012-11-08 20:00:00 | 1298 |
| 2012-11-08 21:00:00 | 1357.5 |
| 2012-11-08 22:00:00 | 1297 |
| 2012-11-08 23:00:00 | 1327 |
| 2012-11-09 | 1309.5 |
| 2012-11-09 01:00:00 | 1370.5 |
| 2012-11-09 02:00:00 | 1267 |
| 2012-11-09 03:00:00 | 1295 |
| 2012-11-09 04:00:00 | 1162.5 |
| 2012-11-09 05:00:00 | 1122 |
| 2012-11-09 06:00:00 | 1076 |
| 2012-11-09 07:00:00 | 1131.75 |
| 2012-11-09 08:00:00 | 1091.75 |
| 2012-11-09 09:00:00 | 1099.25 |
| 2012-11-09 10:00:00 | 1221 |
| 2012-11-09 11:00:00 | 1229 |
| 2012-11-09 12:00:00 | 1203.5 |
| 2012-11-09 13:00:00 | 1310.75 |
| 2012-11-09 14:00:00 | 1215.5 |
| 2012-11-09 15:00:00 | 1228.75 |
| 2012-11-09 16:00:00 | 1067 |
| 2012-11-09 17:00:00 | 1100.25 |
| 2012-11-09 18:00:00 | 1168 |
| 2012-11-09 19:00:00 | 1333 |
| 2012-11-09 20:00:00 | 1366.75 |
| 2012-11-09 21:00:00 | 1331.25 |
| 2012-11-09 22:00:00 | 1313.75 |
| 2012-11-09 23:00:00 | 1311.25 |
| 2012-11-10 | 1301 |
| 2012-11-10 01:00:00 | 1203.5 |
| 2012-11-10 02:00:00 | 1177.5 |
| 2012-11-10 03:00:00 | 1088.25 |
| 2012-11-10 04:00:00 | 1010.5 |
| 2012-11-10 05:00:00 | 1042 |
| 2012-11-10 06:00:00 | 1029.25 |
| 2012-11-10 07:00:00 | 985.75 |
| 2012-11-10 08:00:00 | 968 |
| 2012-11-10 09:00:00 | 955.25 |
| 2012-11-10 10:00:00 | 985.5 |
| 2012-11-10 11:00:00 | 1009 |
| 2012-11-10 12:00:00 | 1014.25 |
| 2012-11-10 13:00:00 | 1066 |
| 2012-11-10 14:00:00 | 1163.25 |
| 2012-11-10 15:00:00 | 1194.75 |
| 2012-11-10 16:00:00 | 1219 |
| 2012-11-10 17:00:00 | 1292 |
| 2012-11-10 18:00:00 | 1262 |
| 2012-11-10 19:00:00 | 1114.25 |
| 2012-11-10 20:00:00 | 1224 |
| 2012-11-10 21:00:00 | 1302.5 |
| 2012-11-10 22:00:00 | 1262 |
| 2012-11-10 23:00:00 | 1183 |
| 2012-11-11 | 1199.5 |
| 2012-11-11 01:00:00 | 1111.25 |
| 2012-11-11 02:00:00 | 1112.75 |
| 2012-11-11 03:00:00 | 1091.5 |
| 2012-11-11 04:00:00 | 1094.25 |
| 2012-11-11 05:00:00 | 1006 |
| 2012-11-11 06:00:00 | 1044.5 |
| 2012-11-11 07:00:00 | 1014 |
| 2012-11-11 08:00:00 | 967.75 |
| 2012-11-11 09:00:00 | 939 |
| 2012-11-11 10:00:00 | 986 |
| 2012-11-11 11:00:00 | 992.5 |
| 2012-11-11 12:00:00 | 1129.75 |
| 2012-11-11 13:00:00 | 1070 |
| 2012-11-11 14:00:00 | 1198.25 |
| 2012-11-11 15:00:00 | 1157.25 |
| 2012-11-11 16:00:00 | 1283.25 |
| 2012-11-11 17:00:00 | 1298.5 |
| 2012-11-11 18:00:00 | 1281.75 |
| 2012-11-11 19:00:00 | 1184 |
| 2012-11-11 20:00:00 | 1256.25 |
| 2012-11-11 21:00:00 | 1300.75 |
| 2012-11-11 22:00:00 | 1343 |
| 2012-11-11 23:00:00 | 1360.25 |
| 2012-11-12 | 1373.5 |
| 2012-11-12 01:00:00 | 1242.5 |
| 2012-11-12 02:00:00 | 1269.75 |
| 2012-11-12 03:00:00 | 1216.5 |
| 2012-11-12 04:00:00 | 1128 |
| 2012-11-12 05:00:00 | 1115.25 |
| 2012-11-12 06:00:00 | 1083.5 |
| 2012-11-12 07:00:00 | 1075 |
| 2012-11-12 08:00:00 | 1109.5 |
| 2012-11-12 09:00:00 | 1087.25 |
| 2012-11-12 10:00:00 | 1151 |
| 2012-11-12 11:00:00 | 1196.75 |
| 2012-11-12 12:00:00 | 1293.75 |
| 2012-11-12 13:00:00 | 1308 |
| 2012-11-12 14:00:00 | 1437.75 |
| 2012-11-12 15:00:00 | 1325.5 |
| 2012-11-12 16:00:00 | 1361 |
| 2012-11-12 17:00:00 | 1311.25 |
| 2012-11-12 18:00:00 | 1312 |
| 2012-11-12 19:00:00 | 1272.5 |
| 2012-11-12 20:00:00 | 1234.5 |
| 2012-11-12 21:00:00 | 1304.25 |
| 2012-11-12 22:00:00 | 1326.25 |
| 2012-11-12 23:00:00 | 1288.75 |
| 2012-11-13 | 1303.25 |
| 2012-11-13 01:00:00 | 1282.25 |
| 2012-11-13 02:00:00 | 1202.25 |
| 2012-11-13 03:00:00 | 1060.25 |
| 2012-11-13 04:00:00 | 995.5 |
| 2012-11-13 05:00:00 | 1054.25 |
| 2012-11-13 06:00:00 | 1007.75 |
| 2012-11-13 07:00:00 | 1045.25 |
| 2012-11-13 08:00:00 | 1097.5 |
| 2012-11-13 09:00:00 | 1127.75 |
| 2012-11-13 10:00:00 | 1133.75 |
| 2012-11-13 11:00:00 | 1124.5 |
| 2012-11-13 12:00:00 | 1115.75 |
| 2012-11-13 13:00:00 | 1103.75 |
| 2012-11-13 14:00:00 | 1141.25 |
| 2012-11-13 15:00:00 | 1168.75 |
| 2012-11-13 16:00:00 | 1191.25 |
| 2012-11-13 17:00:00 | 1326.5 |
| 2012-11-13 18:00:00 | 1378 |
| 2012-11-13 19:00:00 | 1286.25 |
| 2012-11-13 20:00:00 | 1281.25 |
| 2012-11-13 21:00:00 | 1259.75 |
| 2012-11-13 22:00:00 | 1269.75 |
| 2012-11-13 23:00:00 | 1348 |
| 2012-11-14 | 1368.25 |
| 2012-11-14 01:00:00 | 1331.75 |
| 2012-11-14 02:00:00 | 1265 |
| 2012-11-14 03:00:00 | 1173.25 |
| 2012-11-14 04:00:00 | 1141.75 |
| 2012-11-14 05:00:00 | 1070.5 |
| 2012-11-14 06:00:00 | 984 |
| 2012-11-14 07:00:00 | 1046.5 |
| 2012-11-14 08:00:00 | 1028.5 |
| 2012-11-14 09:00:00 | 1037 |
| 2012-11-14 10:00:00 | 1041 |
| 2012-11-14 11:00:00 | 1082.25 |
| 2012-11-14 12:00:00 | 1073.75 |
| 2012-11-14 13:00:00 | 1141.5 |
| 2012-11-14 14:00:00 | 1150.75 |
| 2012-11-14 15:00:00 | 1153.25 |
| 2012-11-14 16:00:00 | 1109 |
| 2012-11-14 17:00:00 | 1151 |
| 2012-11-14 18:00:00 | 1051.75 |
| 2012-11-14 19:00:00 | 1063.75 |
| 2012-11-14 20:00:00 | 1044.5 |
| 2012-11-14 21:00:00 | 1079.25 |
| 2012-11-14 22:00:00 | 1059.5 |
| 2012-11-14 23:00:00 | 1149.5 |
| 2012-11-15 | 1201.75 |
| 2012-11-15 01:00:00 | 1292.25 |
| 2012-11-15 02:00:00 | 1248.25 |
| 2012-11-15 03:00:00 | 1258.75 |
| 2012-11-15 04:00:00 | 1227.5 |
| 2012-11-15 05:00:00 | 1238 |
| 2012-11-15 06:00:00 | 1134.75 |
| 2012-11-15 07:00:00 | 1117.75 |
| 2012-11-15 08:00:00 | 1104.25 |
| 2012-11-15 09:00:00 | 1199.75 |
| 2012-11-15 10:00:00 | 1080.25 |
| 2012-11-15 11:00:00 | 1101 |
| 2012-11-15 12:00:00 | 1087.75 |
| 2012-11-15 13:00:00 | 1269.25 |
| 2012-11-15 14:00:00 | 1212.5 |
| 2012-11-15 15:00:00 | 1269.5 |
| 2012-11-15 16:00:00 | 1252.75 |
| 2012-11-15 17:00:00 | 1306.25 |
| 2012-11-15 18:00:00 | 1242.5 |
| 2012-11-15 19:00:00 | 1262 |
| 2012-11-15 20:00:00 | 1250.75 |
| 2012-11-15 21:00:00 | 1288.25 |
| 2012-11-15 22:00:00 | 1312.75 |
| 2012-11-15 23:00:00 | 1413.5 |
| 2012-11-16 | 1413.5 |
| 2012-11-16 01:00:00 | 1392 |
| 2012-11-16 02:00:00 | 1351.5 |
| 2012-11-16 03:00:00 | 1368.5 |
| 2012-11-16 04:00:00 | 1328.75 |
| 2012-11-16 05:00:00 | 1289 |
| 2012-11-16 06:00:00 | 1074.75 |
| 2012-11-16 07:00:00 | 1113 |
| 2012-11-16 08:00:00 | 1084.25 |
| 2012-11-16 09:00:00 | 1099.75 |
| 2012-11-16 10:00:00 | 1143.25 |
| 2012-11-16 11:00:00 | 1244.75 |
| 2012-11-16 12:00:00 | 1141.5 |
| 2012-11-16 13:00:00 | 1092.25 |
| 2012-11-16 14:00:00 | 1107 |
| 2012-11-16 15:00:00 | 1205 |
| 2012-11-16 16:00:00 | 1234 |
| 2012-11-16 17:00:00 | 1328.25 |
| 2012-11-16 18:00:00 | 1336.75 |
| 2012-11-16 19:00:00 | 1374 |
| 2012-11-16 20:00:00 | 1310.25 |
| 2012-11-16 21:00:00 | 1250.75 |
| 2012-11-16 22:00:00 | 1206 |
| 2012-11-16 23:00:00 | 1191.25 |
| 2012-11-17 | 1185.5 |
| 2012-11-17 01:00:00 | 1095 |
| 2012-11-17 02:00:00 | 1093.25 |
| 2012-11-17 03:00:00 | 1095.5 |
| 2012-11-17 04:00:00 | 1028.25 |
| 2012-11-17 05:00:00 | 978.25 |
| 2012-11-17 06:00:00 | 1119.75 |
| 2012-11-17 07:00:00 | 1066 |
| 2012-11-17 08:00:00 | 994.5 |
| 2012-11-17 09:00:00 | 980.5 |
| 2012-11-17 10:00:00 | 999.25 |
| 2012-11-17 11:00:00 | 1014.75 |
| 2012-11-17 12:00:00 | 1069.5 |
| 2012-11-17 13:00:00 | 1186 |
| 2012-11-17 14:00:00 | 1179.75 |
| 2012-11-17 15:00:00 | 1067.5 |
| 2012-11-17 16:00:00 | 1040.25 |
| 2012-11-17 17:00:00 | 1156.75 |
| 2012-11-17 18:00:00 | 1230 |
| 2012-11-17 19:00:00 | 1214.25 |
| 2012-11-17 20:00:00 | 1226.25 |
| 2012-11-17 21:00:00 | 1203.5 |
| 2012-11-17 22:00:00 | 1280.75 |
| 2012-11-17 23:00:00 | 1307.5 |
| 2012-11-18 | 1306.25 |
| 2012-11-18 01:00:00 | 1238 |
| 2012-11-18 02:00:00 | 1176.25 |
| 2012-11-18 03:00:00 | 1147.75 |
| 2012-11-18 04:00:00 | 1099.25 |
| 2012-11-18 05:00:00 | 1055.25 |
| 2012-11-18 06:00:00 | 1018 |
| 2012-11-18 07:00:00 | 957.5 |
| 2012-11-18 08:00:00 | 972.5 |
| 2012-11-18 09:00:00 | 1011.75 |
| 2012-11-18 10:00:00 | 1008 |
| 2012-11-18 11:00:00 | 987.75 |
| 2012-11-18 12:00:00 | 995 |
| 2012-11-18 13:00:00 | 986.5 |
| 2012-11-18 14:00:00 | 1051.5 |
| 2012-11-18 15:00:00 | 1012.25 |
| 2012-11-18 16:00:00 | 1051.5 |
| 2012-11-18 17:00:00 | 1028.75 |
| 2012-11-18 18:00:00 | 1170.75 |
| 2012-11-18 19:00:00 | 1181.5 |
| 2012-11-18 20:00:00 | 1293.5 |
| 2012-11-18 21:00:00 | 1337 |
| 2012-11-18 22:00:00 | 1370.75 |
| 2012-11-18 23:00:00 | 1173.5 |
| 2012-11-19 | 1220 |
| 2012-11-19 01:00:00 | 1293 |
| 2012-11-19 02:00:00 | 1432.5 |
| 2012-11-19 03:00:00 | 1247.5 |
| 2012-11-19 04:00:00 | 1155.75 |
| 2012-11-19 05:00:00 | 1137 |
| 2012-11-19 06:00:00 | 1177.5 |
| 2012-11-19 07:00:00 | 1111.75 |
| 2012-11-19 08:00:00 | 1202 |
| 2012-11-19 09:00:00 | 1062.5 |
| 2012-11-19 10:00:00 | 1171.5 |
| 2012-11-19 11:00:00 | 1224.5 |
| 2012-11-19 12:00:00 | 1305.25 |
| 2012-11-19 13:00:00 | 1202 |
| 2012-11-19 14:00:00 | 1160 |
| 2012-11-19 15:00:00 | 1240.5 |
| 2012-11-19 16:00:00 | 1272.5 |
| 2012-11-19 17:00:00 | 1298.5 |
| 2012-11-19 18:00:00 | 1262.25 |
| 2012-11-19 19:00:00 | 1318.5 |
| 2012-11-19 20:00:00 | 1325.5 |
| 2012-11-19 21:00:00 | 1354.25 |
| 2012-11-19 22:00:00 | 1413 |
| 2012-11-19 23:00:00 | 1388.25 |
| 2012-11-20 | 1400.75 |
| 2012-11-20 01:00:00 | 1363.25 |
| 2012-11-20 02:00:00 | 1320 |
| 2012-11-20 03:00:00 | 1228.75 |
| 2012-11-20 04:00:00 | 1244.5 |
| 2012-11-20 05:00:00 | 1224.5 |
| 2012-11-20 06:00:00 | 1156.5 |
| 2012-11-20 07:00:00 | 1169.75 |
| 2012-11-20 08:00:00 | 1175.5 |
| 2012-11-20 09:00:00 | 1109 |
| 2012-11-20 10:00:00 | 1256.5 |
| 2012-11-20 11:00:00 | 1302.5 |
| 2012-11-20 12:00:00 | 1291.75 |
| 2012-11-20 13:00:00 | 1345.5 |
| 2012-11-20 14:00:00 | 1245.5 |
| 2012-11-20 15:00:00 | 1166 |
| 2012-11-20 16:00:00 | 1192.75 |
| 2012-11-20 17:00:00 | 1253.75 |
| 2012-11-20 18:00:00 | 1315.5 |
| 2012-11-20 19:00:00 | 1324.25 |
| 2012-11-20 20:00:00 | 1342.75 |
| 2012-11-20 21:00:00 | 1353 |
| 2012-11-20 22:00:00 | 1437 |
| 2012-11-20 23:00:00 | 1474 |
| 2012-11-21 | 1437.5 |
| 2012-11-21 01:00:00 | 1406 |
| 2012-11-21 02:00:00 | 1330.25 |
| 2012-11-21 03:00:00 | 1262.5 |
| 2012-11-21 04:00:00 | 1303 |
| 2012-11-21 05:00:00 | 1219 |
| 2012-11-21 06:00:00 | 1121.75 |
| 2012-11-21 07:00:00 | 1063 |
| 2012-11-21 08:00:00 | 1088.25 |
| 2012-11-21 09:00:00 | 1085 |
| 2012-11-21 10:00:00 | 1119.5 |
| 2012-11-21 11:00:00 | 1210.25 |
| 2012-11-21 12:00:00 | 1222.25 |
| 2012-11-21 13:00:00 | 1296.5 |
| 2012-11-21 14:00:00 | 1278.5 |
| 2012-11-21 15:00:00 | 1367.25 |
| 2012-11-21 16:00:00 | 1436 |
| 2012-11-21 17:00:00 | 1490.25 |
| 2012-11-21 18:00:00 | 1490.75 |
| 2012-11-21 19:00:00 | 1516.5 |
| 2012-11-21 20:00:00 | 1472.5 |
| 2012-11-21 21:00:00 | 1450.75 |
| 2012-11-21 22:00:00 | 1434.25 |
| 2012-11-21 23:00:00 | 1650.75 |
| 2012-11-22 | 1606.75 |
| 2012-11-22 01:00:00 | 1642.5 |
| 2012-11-22 02:00:00 | 1583.25 |
| 2012-11-22 03:00:00 | 1518.5 |
| 2012-11-22 04:00:00 | 1284.5 |
| 2012-11-22 05:00:00 | 1282 |
| 2012-11-22 06:00:00 | 1116.25 |
| 2012-11-22 07:00:00 | 1141.75 |
| 2012-11-22 08:00:00 | 1157.75 |
| 2012-11-22 09:00:00 | 1147.75 |
| 2012-11-22 10:00:00 | 1157.25 |
| 2012-11-22 11:00:00 | 1289.5 |
| 2012-11-22 12:00:00 | 1276.75 |
| 2012-11-22 13:00:00 | 1262.25 |
| 2012-11-22 14:00:00 | 1317.75 |
| 2012-11-22 15:00:00 | 1320.75 |
| 2012-11-22 16:00:00 | 1336 |
| 2012-11-22 17:00:00 | 1401.25 |
| 2012-11-22 18:00:00 | 1334.25 |
| 2012-11-22 19:00:00 | 1327.5 |
| 2012-11-22 20:00:00 | 1241.25 |
| 2012-11-22 21:00:00 | 1168 |
| 2012-11-22 22:00:00 | 1187 |
| 2012-11-22 23:00:00 | 1371.5 |
| 2012-11-23 | 1292.5 |
| 2012-11-23 01:00:00 | 1324.25 |
| 2012-11-23 02:00:00 | 1331.5 |
| 2012-11-23 03:00:00 | 1297.75 |
| 2012-11-23 04:00:00 | 1202 |
| 2012-11-23 05:00:00 | 1180.5 |
| 2012-11-23 06:00:00 | 1143.5 |
| 2012-11-23 07:00:00 | 1201.75 |
| 2012-11-23 08:00:00 | 1165.5 |
| 2012-11-23 09:00:00 | 1175.75 |
| 2012-11-23 10:00:00 | 1200.25 |
| 2012-11-23 11:00:00 | 1246.25 |
| 2012-11-23 12:00:00 | 1315.25 |
| 2012-11-23 13:00:00 | 1272.75 |
| 2012-11-23 14:00:00 | 1293.75 |
| 2012-11-23 15:00:00 | 1330.25 |
| 2012-11-23 16:00:00 | 1333 |
| 2012-11-23 17:00:00 | 1316.75 |
| 2012-11-23 18:00:00 | 1300 |
| 2012-11-23 19:00:00 | 1151 |
| 2012-11-23 20:00:00 | 1149.75 |
| 2012-11-23 21:00:00 | 1210.5 |
| 2012-11-23 22:00:00 | 1195 |
| 2012-11-23 23:00:00 | 1126.75 |
| 2012-11-24 | 1117.25 |
| 2012-11-24 01:00:00 | 1147 |
| 2012-11-24 02:00:00 | 1142.25 |
| 2012-11-24 03:00:00 | 1072 |
| 2012-11-24 04:00:00 | 1042.75 |
| 2012-11-24 05:00:00 | 1042.25 |
| 2012-11-24 06:00:00 | 1051.5 |
| 2012-11-24 07:00:00 | 1054.25 |
| 2012-11-24 08:00:00 | 1031.5 |
| 2012-11-24 09:00:00 | 1010.25 |
| 2012-11-24 10:00:00 | 1031.5 |
| 2012-11-24 11:00:00 | 1046.25 |
| 2012-11-24 12:00:00 | 1073.5 |
| 2012-11-24 13:00:00 | 1064.75 |
| 2012-11-24 14:00:00 | 1091.75 |
| 2012-11-24 15:00:00 | 1122.25 |
| 2012-11-24 16:00:00 | 1102.25 |
| 2012-11-24 17:00:00 | 1225.25 |
| 2012-11-24 18:00:00 | 1205.75 |
| 2012-11-24 19:00:00 | 1175.75 |
| 2012-11-24 20:00:00 | 1185.75 |
| 2012-11-24 21:00:00 | 1131 |
| 2012-11-24 22:00:00 | 1168.25 |
| 2012-11-24 23:00:00 | 1111 |
| 2012-11-25 | 1113 |
| 2012-11-25 01:00:00 | 1070.25 |
| 2012-11-25 02:00:00 | 1104 |
| 2012-11-25 03:00:00 | 1083.25 |
| 2012-11-25 04:00:00 | 1048 |
| 2012-11-25 05:00:00 | 1040.5 |
| 2012-11-25 06:00:00 | 1059.75 |
| 2012-11-25 07:00:00 | 1049.5 |
| 2012-11-25 08:00:00 | 1026.5 |
| 2012-11-25 09:00:00 | 985.5 |
| 2012-11-25 10:00:00 | 1024.5 |
| 2012-11-25 11:00:00 | 1026.25 |
| 2012-11-25 12:00:00 | 1068.5 |
| 2012-11-25 13:00:00 | 1047.5 |
| 2012-11-25 14:00:00 | 1141.75 |
| 2012-11-25 15:00:00 | 1137.75 |
| 2012-11-25 16:00:00 | 1070.25 |
| 2012-11-25 17:00:00 | 1075 |
| 2012-11-25 18:00:00 | 1148.5 |
| 2012-11-25 19:00:00 | 1096.75 |
| 2012-11-25 20:00:00 | 1138.25 |
| 2012-11-25 21:00:00 | 1166.25 |
| 2012-11-25 22:00:00 | 1207 |
| 2012-11-25 23:00:00 | 1247.75 |
| 2012-11-26 | 1360 |
| 2012-11-26 01:00:00 | 1257 |
| 2012-11-26 02:00:00 | 1282.5 |
| 2012-11-26 03:00:00 | 1116 |
| 2012-11-26 04:00:00 | 1164.5 |
| 2012-11-26 05:00:00 | 1088.25 |
| 2012-11-26 06:00:00 | 1133.25 |
| 2012-11-26 07:00:00 | 1113.25 |
| 2012-11-26 08:00:00 | 1155.75 |
| 2012-11-26 09:00:00 | 1127.5 |
| 2012-11-26 10:00:00 | 1157.25 |
| 2012-11-26 11:00:00 | 1125.5 |
| 2012-11-26 12:00:00 | 1150 |
| 2012-11-26 13:00:00 | 1124.5 |
| 2012-11-26 14:00:00 | 1197.25 |
| 2012-11-26 15:00:00 | 1286.75 |
| 2012-11-26 16:00:00 | 1284 |
| 2012-11-26 17:00:00 | 1261.75 |
| 2012-11-26 18:00:00 | 1320 |
| 2012-11-26 19:00:00 | 1190 |
| 2012-11-26 20:00:00 | 1269.75 |
| 2012-11-26 21:00:00 | 1271 |
| 2012-11-26 22:00:00 | 1291 |
| 2012-11-26 23:00:00 | 1266.75 |
| 2012-11-27 | 1284.25 |
| 2012-11-27 01:00:00 | 1235.25 |
| 2012-11-27 02:00:00 | 1247.75 |
| 2012-11-27 03:00:00 | 1244.5 |
| 2012-11-27 04:00:00 | 1194.25 |
| 2012-11-27 05:00:00 | 1172.25 |
| 2012-11-27 06:00:00 | 1141.75 |
| 2012-11-27 07:00:00 | 1148.5 |
| 2012-11-27 08:00:00 | 1260 |
| 2012-11-27 09:00:00 | 1188.25 |
| 2012-11-27 10:00:00 | 1148.25 |
| 2012-11-27 11:00:00 | 1212 |
| 2012-11-27 12:00:00 | 1213.25 |
| 2012-11-27 13:00:00 | 1278.5 |
| 2012-11-27 14:00:00 | 1431.25 |
| 2012-11-27 15:00:00 | 1304.75 |
| 2012-11-27 16:00:00 | 1349.75 |
| 2012-11-27 17:00:00 | 1347 |
| 2012-11-27 18:00:00 | 1345.5 |
| 2012-11-27 19:00:00 | 1337.75 |
| 2012-11-27 20:00:00 | 1347.5 |
| 2012-11-27 21:00:00 | 1276.5 |
| 2012-11-27 22:00:00 | 1340.25 |
| 2012-11-27 23:00:00 | 1218.25 |
| 2012-11-28 | 1290 |
| 2012-11-28 01:00:00 | 1336 |
| 2012-11-28 02:00:00 | 1329.25 |
| 2012-11-28 03:00:00 | 1225.25 |
| 2012-11-28 04:00:00 | 1201.75 |
| 2012-11-28 05:00:00 | 1140.25 |
| 2012-11-28 06:00:00 | 1068.75 |
| 2012-11-28 07:00:00 | 1089.5 |
| 2012-11-28 08:00:00 | 1129.75 |
| 2012-11-28 09:00:00 | 1117.5 |
| 2012-11-28 10:00:00 | 1142.25 |
| 2012-11-28 11:00:00 | 1143.75 |
| 2012-11-28 12:00:00 | 1126.25 |
| 2012-11-28 13:00:00 | 1172.25 |
| 2012-11-28 14:00:00 | 1161.25 |
| 2012-11-28 15:00:00 | 1206.25 |
| 2012-11-28 16:00:00 | 1252.25 |
| 2012-11-28 17:00:00 | 1213.5 |
| 2012-11-28 18:00:00 | 1343.5 |
| 2012-11-28 19:00:00 | 1299.5 |
| 2012-11-28 20:00:00 | 1299 |
| 2012-11-28 21:00:00 | 1292.25 |
| 2012-11-28 22:00:00 | 1252.5 |
| 2012-11-28 23:00:00 | 1271.25 |
| 2012-11-29 | 1353 |
| 2012-11-29 01:00:00 | 1359.75 |
| 2012-11-29 02:00:00 | 1365.25 |
| 2012-11-29 03:00:00 | 1234.75 |
| 2012-11-29 04:00:00 | 1224 |
| 2012-11-29 05:00:00 | 1156 |
| 2012-11-29 06:00:00 | 1147.75 |
| 2012-11-29 07:00:00 | 1181.75 |
| 2012-11-29 08:00:00 | 1184 |
| 2012-11-29 09:00:00 | 1200.75 |
| 2012-11-29 10:00:00 | 1261 |
| 2012-11-29 11:00:00 | 1382.5 |
| 2012-11-29 12:00:00 | 1481.5 |
| 2012-11-29 13:00:00 | 1545.75 |
| 2012-11-29 14:00:00 | 1467.75 |
| 2012-11-29 15:00:00 | 1401.75 |
| 2012-11-29 16:00:00 | 1320 |
| 2012-11-29 17:00:00 | 1380.25 |
| 2012-11-29 18:00:00 | 1328.5 |
| 2012-11-29 19:00:00 | 1323.75 |
| 2012-11-29 20:00:00 | 1275.75 |
| 2012-11-29 21:00:00 | 1329.5 |
| 2012-11-29 22:00:00 | 1352.75 |
| 2012-11-29 23:00:00 | 1315.25 |
| 2012-11-30 | 1330 |
| 2012-11-30 01:00:00 | 1283.5 |
| 2012-11-30 02:00:00 | 1241.75 |
| 2012-11-30 03:00:00 | 1180.25 |
| 2012-11-30 04:00:00 | 1153.25 |
| 2012-11-30 05:00:00 | 1170.25 |
| 2012-11-30 06:00:00 | 1133 |
| 2012-11-30 07:00:00 | 1173 |
| 2012-11-30 08:00:00 | 1181.5 |
| 2012-11-30 09:00:00 | 1193.25 |
| 2012-11-30 10:00:00 | 1183.25 |
| 2012-11-30 11:00:00 | 1221.75 |
| 2012-11-30 12:00:00 | 1200.75 |
| 2012-11-30 13:00:00 | 1236.5 |
| 2012-11-30 14:00:00 | 1296.5 |
| 2012-11-30 15:00:00 | 1305.25 |
| 2012-11-30 16:00:00 | 1266.75 |
| 2012-11-30 17:00:00 | 1279.75 |
| 2012-11-30 18:00:00 | 1203.5 |
| 2012-11-30 19:00:00 | 1282.5 |
| 2012-11-30 20:00:00 | 1295 |
| 2012-11-30 21:00:00 | 1303.75 |
| 2012-11-30 22:00:00 | 1259.25 |
| 2012-11-30 23:00:00 | 1230.5 |
| 2012-12-01 | 1227 |
| 2012-12-01 01:00:00 | 1232.25 |
| 2012-12-01 02:00:00 | 1176.5 |
| 2012-12-01 03:00:00 | 1291 |
| 2012-12-01 04:00:00 | 1080.75 |
| 2012-12-01 05:00:00 | 1068.5 |
| 2012-12-01 06:00:00 | 1068.5 |
| 2012-12-01 07:00:00 | 1088.75 |
| 2012-12-01 08:00:00 | 1049.5 |
| 2012-12-01 09:00:00 | 1031.75 |
| 2012-12-01 10:00:00 | 1048.75 |
| 2012-12-01 11:00:00 | 1079.5 |
| 2012-12-01 12:00:00 | 1091.5 |
| 2012-12-01 13:00:00 | 1114 |
| 2012-12-01 14:00:00 | 1113.5 |
| 2012-12-01 15:00:00 | 1119 |
| 2012-12-01 16:00:00 | 1159.5 |
| 2012-12-01 17:00:00 | 1192 |
| 2012-12-01 18:00:00 | 1240.75 |
| 2012-12-01 19:00:00 | 1216.75 |
| 2012-12-01 20:00:00 | 1221 |
| 2012-12-01 21:00:00 | 1184.75 |
| 2012-12-01 22:00:00 | 1131 |
| 2012-12-01 23:00:00 | 1165 |
| 2012-12-02 | 1209.5 |
| 2012-12-02 01:00:00 | 1247.75 |
| 2012-12-02 02:00:00 | 1100.75 |
| 2012-12-02 03:00:00 | 1071 |
| 2012-12-02 04:00:00 | 1076.25 |
| 2012-12-02 05:00:00 | 1063.5 |
| 2012-12-02 06:00:00 | 1085.5 |
| 2012-12-02 07:00:00 | 1066 |
| 2012-12-02 08:00:00 | 1056 |
| 2012-12-02 09:00:00 | 1006.25 |
| 2012-12-02 10:00:00 | 1044.75 |
| 2012-12-02 11:00:00 | 1046.75 |
| 2012-12-02 12:00:00 | 1105.5 |
| 2012-12-02 13:00:00 | 1099.75 |
| 2012-12-02 14:00:00 | 1120.75 |
| 2012-12-02 15:00:00 | 1082.75 |
| 2012-12-02 16:00:00 | 1131.5 |
| 2012-12-02 17:00:00 | 1224.25 |
| 2012-12-02 18:00:00 | 1226 |
| 2012-12-02 19:00:00 | 1189.25 |
| 2012-12-02 20:00:00 | 1186 |
| 2012-12-02 21:00:00 | 1188 |
| 2012-12-02 22:00:00 | 1156.75 |
| 2012-12-02 23:00:00 | 1169 |
| 2012-12-03 | 1265.5 |
| 2012-12-03 01:00:00 | 1199.5 |
| 2012-12-03 02:00:00 | 1289.75 |
| 2012-12-03 03:00:00 | 1123.75 |
| 2012-12-03 04:00:00 | 1264.25 |
| 2012-12-03 05:00:00 | 1150 |
| 2012-12-03 06:00:00 | 1180.5 |
| 2012-12-03 07:00:00 | 1149.25 |
| 2012-12-03 08:00:00 | 1225.5 |
| 2012-12-03 09:00:00 | 1162.75 |
| 2012-12-03 10:00:00 | 1250.75 |
| 2012-12-03 11:00:00 | 1196.5 |
| 2012-12-03 12:00:00 | 1225.75 |
| 2012-12-03 13:00:00 | 1138 |
| 2012-12-03 14:00:00 | 1215.25 |
| 2012-12-03 15:00:00 | 1120.75 |
| 2012-12-03 16:00:00 | 1298.5 |
| 2012-12-03 17:00:00 | 1281.75 |
| 2012-12-03 18:00:00 | 1316.25 |
| 2012-12-03 19:00:00 | 1276 |
| 2012-12-03 20:00:00 | 1350.5 |
| 2012-12-03 21:00:00 | 1328.75 |
| 2012-12-03 22:00:00 | 1325.5 |
| 2012-12-03 23:00:00 | 1298.75 |
| 2012-12-04 | 1317.75 |
| 2012-12-04 01:00:00 | 1286.25 |
| 2012-12-04 02:00:00 | 1300.5 |
| 2012-12-04 03:00:00 | 1290.5 |
| 2012-12-04 04:00:00 | 1163.5 |
| 2012-12-04 05:00:00 | 1186 |
| 2012-12-04 06:00:00 | 1177.25 |
| 2012-12-04 07:00:00 | 1173.25 |
| 2012-12-04 08:00:00 | 1222.75 |
| 2012-12-04 09:00:00 | 1211.25 |
| 2012-12-04 10:00:00 | 1263 |
| 2012-12-04 11:00:00 | 1306.75 |
| 2012-12-04 12:00:00 | 1365.5 |
| 2012-12-04 13:00:00 | 1266.5 |
| 2012-12-04 14:00:00 | 1253.5 |
| 2012-12-04 15:00:00 | 1299.25 |
| 2012-12-04 16:00:00 | 1232.25 |
| 2012-12-04 17:00:00 | 1211.75 |
| 2012-12-04 18:00:00 | 1235.5 |
| 2012-12-04 19:00:00 | 1248.75 |
| 2012-12-04 20:00:00 | 1207 |
| 2012-12-04 21:00:00 | 1191.75 |
| 2012-12-04 22:00:00 | 1224 |
| 2012-12-04 23:00:00 | 1202 |
| 2012-12-05 | 1199.25 |
| 2012-12-05 01:00:00 | 1179.5 |
| 2012-12-05 02:00:00 | 1166.5 |
| 2012-12-05 03:00:00 | 1153.5 |
| 2012-12-05 04:00:00 | 1138.25 |
| 2012-12-05 05:00:00 | 1132.5 |
| 2012-12-05 06:00:00 | 1073.25 |
| 2012-12-05 07:00:00 | 1156.25 |
| 2012-12-05 08:00:00 | 1259 |
| 2012-12-05 09:00:00 | 1224.25 |
| 2012-12-05 10:00:00 | 1154.75 |
| 2012-12-05 11:00:00 | 1175 |
| 2012-12-05 12:00:00 | 1141.75 |
| 2012-12-05 13:00:00 | 1152.25 |
| 2012-12-05 14:00:00 | 1218.5 |
| 2012-12-05 15:00:00 | 1271.25 |
| 2012-12-05 16:00:00 | 1275 |
| 2012-12-05 17:00:00 | 1310.5 |
| 2012-12-05 18:00:00 | 1300.75 |
| 2012-12-05 19:00:00 | 1314.25 |
| 2012-12-05 20:00:00 | 1304.75 |
| 2012-12-05 21:00:00 | 1266.75 |
| 2012-12-05 22:00:00 | 1244.25 |
| 2012-12-05 23:00:00 | 1309.75 |
| 2012-12-06 | 1269.75 |
| 2012-12-06 01:00:00 | 1258 |
| 2012-12-06 02:00:00 | 1249.5 |
| 2012-12-06 03:00:00 | 1169.75 |
| 2012-12-06 04:00:00 | 1116 |
| 2012-12-06 05:00:00 | 1165.75 |
| 2012-12-06 06:00:00 | 1159 |
| 2012-12-06 07:00:00 | 1205.75 |
| 2012-12-06 08:00:00 | 1195.25 |
| 2012-12-06 09:00:00 | 1231.5 |
| 2012-12-06 10:00:00 | 1221 |
| 2012-12-06 11:00:00 | 1270.25 |
| 2012-12-06 12:00:00 | 1254 |
| 2012-12-06 13:00:00 | 1301.5 |
| 2012-12-06 14:00:00 | 1321.25 |
| 2012-12-06 15:00:00 | 1319.25 |
| 2012-12-06 16:00:00 | 1328.5 |
| 2012-12-06 17:00:00 | 1408.75 |
| 2012-12-06 18:00:00 | 1399.25 |
| 2012-12-06 19:00:00 | 1358.25 |
| 2012-12-06 20:00:00 | 1306.5 |
| 2012-12-06 21:00:00 | 1427.25 |
| 2012-12-06 22:00:00 | 1289.5 |
| 2012-12-06 23:00:00 | 1304 |
| 2012-12-07 | 1252.75 |
| 2012-12-07 01:00:00 | 1273 |
| 2012-12-07 02:00:00 | 1202.75 |
| 2012-12-07 03:00:00 | 1165.5 |
| 2012-12-07 04:00:00 | 1126.75 |
| 2012-12-07 05:00:00 | 1152.5 |
| 2012-12-07 06:00:00 | 1171.25 |
| 2012-12-07 07:00:00 | 1232.75 |
| 2012-12-07 08:00:00 | 1213 |
| 2012-12-07 09:00:00 | 1185.75 |
| 2012-12-07 10:00:00 | 1174.5 |
| 2012-12-07 11:00:00 | 1202.5 |
| 2012-12-07 12:00:00 | 1189.5 |
| 2012-12-07 13:00:00 | 1245.25 |
| 2012-12-07 14:00:00 | 1235.5 |
| 2012-12-07 15:00:00 | 1258 |
| 2012-12-07 16:00:00 | 1268 |
| 2012-12-07 17:00:00 | 1264.5 |
| 2012-12-07 18:00:00 | 1274.25 |
| 2012-12-07 19:00:00 | 1330.75 |
| 2012-12-07 20:00:00 | 1218 |
| 2012-12-07 21:00:00 | 1221.75 |
| 2012-12-07 22:00:00 | 1168.25 |
| 2012-12-07 23:00:00 | 1205.25 |
| 2012-12-08 | 1197.75 |
| 2012-12-08 01:00:00 | 1152 |
| 2012-12-08 02:00:00 | 1175 |
| 2012-12-08 03:00:00 | 1179 |
| 2012-12-08 04:00:00 | 1116.75 |
| 2012-12-08 05:00:00 | 1124.25 |
| 2012-12-08 06:00:00 | 1125.75 |
| 2012-12-08 07:00:00 | 1131 |
| 2012-12-08 08:00:00 | 1089 |
| 2012-12-08 09:00:00 | 1075 |
| 2012-12-08 10:00:00 | 1103.25 |
| 2012-12-08 11:00:00 | 1129.5 |
| 2012-12-08 12:00:00 | 1139.75 |
| 2012-12-08 13:00:00 | 1139 |
| 2012-12-08 14:00:00 | 1148.5 |
| 2012-12-08 15:00:00 | 1133.5 |
| 2012-12-08 16:00:00 | 1137.75 |
| 2012-12-08 17:00:00 | 1157.25 |
| 2012-12-08 18:00:00 | 1161.75 |
| 2012-12-08 19:00:00 | 1155.75 |
| 2012-12-08 20:00:00 | 1239.75 |
| 2012-12-08 21:00:00 | 1165.75 |
| 2012-12-08 22:00:00 | 1166 |
| 2012-12-08 23:00:00 | 1161.5 |
| 2012-12-09 | 1155.75 |
| 2012-12-09 01:00:00 | 1163.25 |
| 2012-12-09 02:00:00 | 1219.75 |
| 2012-12-09 03:00:00 | 1116 |
| 2012-12-09 04:00:00 | 1118.5 |
| 2012-12-09 05:00:00 | 1120.5 |
| 2012-12-09 06:00:00 | 1113 |
| 2012-12-09 07:00:00 | 1108.25 |
| 2012-12-09 08:00:00 | 1085.75 |
| 2012-12-09 09:00:00 | 1046.75 |
| 2012-12-09 10:00:00 | 1091.25 |
| 2012-12-09 11:00:00 | 1096 |
| 2012-12-09 12:00:00 | 1132.25 |
| 2012-12-09 13:00:00 | 1127.25 |
| 2012-12-09 14:00:00 | 1153 |
| 2012-12-09 15:00:00 | 1130.25 |
| 2012-12-09 16:00:00 | 1173.5 |
| 2012-12-09 17:00:00 | 1149.75 |
| 2012-12-09 18:00:00 | 1190 |
| 2012-12-09 19:00:00 | 1169.25 |
| 2012-12-09 20:00:00 | 1266.75 |
| 2012-12-09 21:00:00 | 1216 |
| 2012-12-09 22:00:00 | 1234.25 |
| 2012-12-09 23:00:00 | 1205.25 |
| 2012-12-10 | 1298.75 |
| 2012-12-10 01:00:00 | 1316 |
| 2012-12-10 02:00:00 | 1247 |
| 2012-12-10 03:00:00 | 1204.75 |
| 2012-12-10 04:00:00 | 1210.25 |
| 2012-12-10 05:00:00 | 1171.5 |
| 2012-12-10 06:00:00 | 1210.75 |
| 2012-12-10 07:00:00 | 1205.75 |
| 2012-12-10 08:00:00 | 1245 |
| 2012-12-10 09:00:00 | 1206.5 |
| 2012-12-10 10:00:00 | 1214.75 |
| 2012-12-10 11:00:00 | 1093.75 |
| 2012-12-10 12:00:00 | 1143.5 |
| 2012-12-10 13:00:00 | 1101 |
| 2012-12-10 14:00:00 | 1249.75 |
| 2012-12-10 15:00:00 | 1256 |
| 2012-12-10 16:00:00 | 1416.75 |
| 2012-12-10 17:00:00 | 1384.25 |
| 2012-12-10 18:00:00 | 1363.75 |
| 2012-12-10 19:00:00 | 1405.75 |
| 2012-12-10 20:00:00 | 1363.25 |
| 2012-12-10 21:00:00 | 1207.25 |
| 2012-12-10 22:00:00 | 1263 |
| 2012-12-10 23:00:00 | 1267 |
| 2012-12-11 | 1313.75 |
| 2012-12-11 01:00:00 | 1259.5 |
| 2012-12-11 02:00:00 | 1297.25 |
| 2012-12-11 03:00:00 | 1240 |
| 2012-12-11 04:00:00 | 1298.5 |
| 2012-12-11 05:00:00 | 1301.25 |
| 2012-12-11 06:00:00 | 1327.5 |
| 2012-12-11 07:00:00 | 1266 |
| 2012-12-11 08:00:00 | 1288.25 |
| 2012-12-11 09:00:00 | 1058.5 |
| 2012-12-11 10:00:00 | 1249.5 |
| 2012-12-11 11:00:00 | 1244 |
| 2012-12-11 12:00:00 | 1338.5 |
| 2012-12-11 13:00:00 | 1343 |
| 2012-12-11 14:00:00 | 1300.75 |
| 2012-12-11 15:00:00 | 1264.75 |
| 2012-12-11 16:00:00 | 1168.75 |
| 2012-12-11 17:00:00 | 1191 |
| 2012-12-11 18:00:00 | 1214 |
| 2012-12-11 19:00:00 | 1257.75 |
| 2012-12-11 20:00:00 | 1342 |
| 2012-12-11 21:00:00 | 1319 |
| 2012-12-11 22:00:00 | 1325.75 |
| 2012-12-11 23:00:00 | 1332.75 |
| 2012-12-12 | 1380.5 |
| 2012-12-12 01:00:00 | 1344.5 |
| 2012-12-12 02:00:00 | 1351 |
| 2012-12-12 03:00:00 | 1310.5 |
| 2012-12-12 04:00:00 | 1397.25 |
| 2012-12-12 05:00:00 | 1332.5 |
| 2012-12-12 06:00:00 | 1305.5 |
| 2012-12-12 07:00:00 | 1096 |
| 2012-12-12 08:00:00 | 1139.25 |
| 2012-12-12 09:00:00 | 1154.75 |
| 2012-12-12 10:00:00 | 1135.25 |
| 2012-12-12 11:00:00 | 1145.5 |
| 2012-12-12 12:00:00 | 1182 |
| 2012-12-12 13:00:00 | 1252.25 |
| 2012-12-12 14:00:00 | 1239 |
| 2012-12-12 15:00:00 | 1333.25 |
| 2012-12-12 16:00:00 | 1340 |
| 2012-12-12 17:00:00 | 1426.25 |
| 2012-12-12 18:00:00 | 1422 |
| 2012-12-12 19:00:00 | 1417.25 |
| 2012-12-12 20:00:00 | 1425.25 |
| 2012-12-12 21:00:00 | 1436 |
| 2012-12-12 22:00:00 | 1403 |
| 2012-12-12 23:00:00 | 1371.5 |
| 2012-12-13 | 1379.5 |
| 2012-12-13 01:00:00 | 1279.5 |
| 2012-12-13 02:00:00 | 1309.25 |
| 2012-12-13 03:00:00 | 1292.5 |
| 2012-12-13 04:00:00 | 1261.5 |
| 2012-12-13 05:00:00 | 1237 |
| 2012-12-13 06:00:00 | 1220.25 |
| 2012-12-13 07:00:00 | 1247.5 |
| 2012-12-13 08:00:00 | 1202.75 |
| 2012-12-13 09:00:00 | 1216.25 |
| 2012-12-13 10:00:00 | 1214 |
| 2012-12-13 11:00:00 | 1232.75 |
| 2012-12-13 12:00:00 | 1236.25 |
| 2012-12-13 13:00:00 | 1234.25 |
| 2012-12-13 14:00:00 | 1271.25 |
| 2012-12-13 15:00:00 | 1269.75 |
| 2012-12-13 16:00:00 | 1335 |
| 2012-12-13 17:00:00 | 1421.5 |
| 2012-12-13 18:00:00 | 1294.75 |
| 2012-12-13 19:00:00 | 1248.25 |
| 2012-12-13 20:00:00 | 1331.75 |
| 2012-12-13 21:00:00 | 1225.25 |
| 2012-12-13 22:00:00 | 1264.75 |
| 2012-12-13 23:00:00 | 1251.5 |
| 2012-12-14 | 1240.25 |
| 2012-12-14 01:00:00 | 1268 |
| 2012-12-14 02:00:00 | 1218 |
| 2012-12-14 03:00:00 | 1201 |
| 2012-12-14 04:00:00 | 1160.5 |
| 2012-12-14 05:00:00 | 1179 |
| 2012-12-14 06:00:00 | 1168.5 |
| 2012-12-14 07:00:00 | 1255.5 |
| 2012-12-14 08:00:00 | 1245.75 |
| 2012-12-14 09:00:00 | 1262 |
| 2012-12-14 10:00:00 | 1213.25 |
| 2012-12-14 11:00:00 | 1138.25 |
| 2012-12-14 12:00:00 | 1122.75 |
| 2012-12-14 13:00:00 | 1160.5 |
| 2012-12-14 14:00:00 | 1253 |
| 2012-12-14 15:00:00 | 1267.5 |
| 2012-12-14 16:00:00 | 1277.75 |
| 2012-12-14 17:00:00 | 1285.75 |
| 2012-12-14 18:00:00 | 1336.75 |
| 2012-12-14 19:00:00 | 1323.5 |
| 2012-12-14 20:00:00 | 1330.5 |
| 2012-12-14 21:00:00 | 1333 |
| 2012-12-14 22:00:00 | 1267 |
| 2012-12-14 23:00:00 | 1286.75 |
| 2012-12-15 | 1240.25 |
| 2012-12-15 01:00:00 | 1224.5 |
| 2012-12-15 02:00:00 | 1167.75 |
| 2012-12-15 03:00:00 | 1125.25 |
| 2012-12-15 04:00:00 | 1125.5 |
| 2012-12-15 05:00:00 | 1075.25 |
| 2012-12-15 06:00:00 | 1074.75 |
| 2012-12-15 07:00:00 | 1121 |
| 2012-12-15 08:00:00 | 1146.25 |
| 2012-12-15 09:00:00 | 1192.5 |
| 2012-12-15 10:00:00 | 1434.75 |
| 2012-12-15 11:00:00 | 1446.5 |
| 2012-12-15 12:00:00 | 1409.75 |
| 2012-12-15 13:00:00 | 1371.25 |
| 2012-12-15 14:00:00 | 1506 |
| 2012-12-15 15:00:00 | 1604.25 |
| 2012-12-15 16:00:00 | 1787.25 |
| 2012-12-15 17:00:00 | 2138.5 |
| 2012-12-15 18:00:00 | 1860 |
| 2012-12-15 19:00:00 | 1994.75 |
| 2012-12-15 20:00:00 | 1991.75 |
| 2012-12-15 21:00:00 | 1853.5 |
| 2012-12-15 22:00:00 | 1545.5 |
| 2012-12-15 23:00:00 | 1578.75 |
| 2012-12-16 | 1411 |
| 2012-12-16 01:00:00 | 1270.25 |
| 2012-12-16 02:00:00 | 1265.5 |
| 2012-12-16 03:00:00 | 1201.5 |
| 2012-12-16 04:00:00 | 1266.75 |
| 2012-12-16 05:00:00 | 1115 |
| 2012-12-16 06:00:00 | 1094.5 |
| 2012-12-16 07:00:00 | 1082 |
| 2012-12-16 08:00:00 | 1059.75 |
| 2012-12-16 09:00:00 | 1035.5 |
| 2012-12-16 10:00:00 | 1052.75 |
| 2012-12-16 11:00:00 | 1065 |
| 2012-12-16 12:00:00 | 1098.25 |
| 2012-12-16 13:00:00 | 1097 |
| 2012-12-16 14:00:00 | 1113.25 |
| 2012-12-16 15:00:00 | 1097.75 |
| 2012-12-16 16:00:00 | 1151.5 |
| 2012-12-16 17:00:00 | 1244 |
| 2012-12-16 18:00:00 | 1130.25 |
| 2012-12-16 19:00:00 | 1215.75 |
| 2012-12-16 20:00:00 | 1233.5 |
| 2012-12-16 21:00:00 | 1125.25 |
| 2012-12-16 22:00:00 | 1227.5 |
| 2012-12-16 23:00:00 | 1242 |
| 2012-12-17 | 1233.75 |
| 2012-12-17 01:00:00 | 1272 |
| 2012-12-17 02:00:00 | 1207 |
| 2012-12-17 03:00:00 | 1155.5 |
| 2012-12-17 04:00:00 | 1184 |
| 2012-12-17 05:00:00 | 1142.25 |
| 2012-12-17 06:00:00 | 1142.25 |
| 2012-12-17 07:00:00 | 1174.75 |
| 2012-12-17 08:00:00 | 1212.25 |
| 2012-12-17 09:00:00 | 1166.75 |
| 2012-12-17 10:00:00 | 1201.5 |
| 2012-12-17 11:00:00 | 1200.5 |
| 2012-12-17 12:00:00 | 1235.5 |
| 2012-12-17 13:00:00 | 1193.5 |
| 2012-12-17 14:00:00 | 1277.25 |
| 2012-12-17 15:00:00 | 1267.75 |
| 2012-12-17 16:00:00 | 1300.5 |
| 2012-12-17 17:00:00 | 1339.5 |
| 2012-12-17 18:00:00 | 1305.5 |
| 2012-12-17 19:00:00 | 1258 |
| 2012-12-17 20:00:00 | 1343.5 |
| 2012-12-17 21:00:00 | 1347 |
| 2012-12-17 22:00:00 | 1315.75 |
| 2012-12-17 23:00:00 | 1274.5 |
| 2012-12-18 | 1402.25 |
| 2012-12-18 01:00:00 | 1258.75 |
| 2012-12-18 02:00:00 | 1370.25 |
| 2012-12-18 03:00:00 | 1230.75 |
| 2012-12-18 04:00:00 | 1207.25 |
| 2012-12-18 05:00:00 | 1163.75 |
| 2012-12-18 06:00:00 | 1169.5 |
| 2012-12-18 07:00:00 | 1145.5 |
| 2012-12-18 08:00:00 | 1209.25 |
| 2012-12-18 09:00:00 | 1251.25 |
| 2012-12-18 10:00:00 | 1234 |
| 2012-12-18 11:00:00 | 1191 |
| 2012-12-18 12:00:00 | 1234 |
| 2012-12-18 13:00:00 | 1260 |
| 2012-12-18 14:00:00 | 1289.75 |
| 2012-12-18 15:00:00 | 1293 |
| 2012-12-18 16:00:00 | 1297.5 |
| 2012-12-18 17:00:00 | 1337.25 |
| 2012-12-18 18:00:00 | 1350.75 |
| 2012-12-18 19:00:00 | 1355.25 |
| 2012-12-18 20:00:00 | 1390 |
| 2012-12-18 21:00:00 | 1376.25 |
| 2012-12-18 22:00:00 | 1372.5 |
| 2012-12-18 23:00:00 | 1373.5 |
| 2012-12-19 | 1395.25 |
| 2012-12-19 01:00:00 | 1399 |
| 2012-12-19 02:00:00 | 1446.5 |
| 2012-12-19 03:00:00 | 1315.5 |
| 2012-12-19 04:00:00 | 1158 |
| 2012-12-19 05:00:00 | 1216.25 |
| 2012-12-19 06:00:00 | 1147.5 |
| 2012-12-19 07:00:00 | 1165.25 |
| 2012-12-19 08:00:00 | 1212.5 |
| 2012-12-19 09:00:00 | 1169 |
| 2012-12-19 10:00:00 | 1212.75 |
| 2012-12-19 11:00:00 | 1203.75 |
| 2012-12-19 12:00:00 | 1221.75 |
| 2012-12-19 13:00:00 | 1221.75 |
| 2012-12-19 14:00:00 | 1295.5 |
| 2012-12-19 15:00:00 | 1329.75 |
| 2012-12-19 16:00:00 | 1391 |
| 2012-12-19 17:00:00 | 1331 |
| 2012-12-19 18:00:00 | 1417.75 |
| 2012-12-19 19:00:00 | 1364.25 |
| 2012-12-19 20:00:00 | 1481.75 |
| 2012-12-19 21:00:00 | 1378.5 |
| 2012-12-19 22:00:00 | 1366.75 |
| 2012-12-19 23:00:00 | 1489 |
| 2012-12-20 | 1454 |
| 2012-12-20 01:00:00 | 1294 |
| 2012-12-20 02:00:00 | 1329.25 |
| 2012-12-20 03:00:00 | 1348.75 |
| 2012-12-20 04:00:00 | 1193.5 |
| 2012-12-20 05:00:00 | 1251 |
| 2012-12-20 06:00:00 | 1170.5 |
| 2012-12-20 07:00:00 | 1187.25 |
| 2012-12-20 08:00:00 | 1199.5 |
| 2012-12-20 09:00:00 | 1195.25 |
| 2012-12-20 10:00:00 | 1207.5 |
| 2012-12-20 11:00:00 | 1223.25 |
| 2012-12-20 12:00:00 | 1217 |
| 2012-12-20 13:00:00 | 1210.5 |
| 2012-12-20 14:00:00 | 1205.25 |
| 2012-12-20 15:00:00 | 1260 |
| 2012-12-20 16:00:00 | 1275.5 |
| 2012-12-20 17:00:00 | 1281.75 |
| 2012-12-20 18:00:00 | 1290.5 |
| 2012-12-20 19:00:00 | 1329.25 |
| 2012-12-20 20:00:00 | 1343.75 |
| 2012-12-20 21:00:00 | 1439.5 |
| 2012-12-20 22:00:00 | 1382 |
| 2012-12-20 23:00:00 | 1432.5 |
| 2012-12-21 | 1420.25 |
| 2012-12-21 01:00:00 | 1392.75 |
| 2012-12-21 02:00:00 | 1294.5 |
| 2012-12-21 03:00:00 | 1296.25 |
| 2012-12-21 04:00:00 | 1208 |
| 2012-12-21 05:00:00 | 1173.25 |
| 2012-12-21 06:00:00 | 1143.25 |
| 2012-12-21 07:00:00 | 1178.5 |
| 2012-12-21 08:00:00 | 1193 |
| 2012-12-21 09:00:00 | 1198.25 |
| 2012-12-21 10:00:00 | 1196.75 |
| 2012-12-21 11:00:00 | 1241 |
| 2012-12-21 12:00:00 | 1213.75 |
| 2012-12-21 13:00:00 | 1240.25 |
| 2012-12-21 14:00:00 | 1270.5 |
| 2012-12-21 15:00:00 | 1326.25 |
| 2012-12-21 16:00:00 | 1336 |
| 2012-12-21 17:00:00 | 1328.25 |
| 2012-12-21 18:00:00 | 1335 |
| 2012-12-21 19:00:00 | 1431.5 |
| 2012-12-21 20:00:00 | 1436.75 |
| 2012-12-21 21:00:00 | 1248 |
| 2012-12-21 22:00:00 | 1184.75 |
| 2012-12-21 23:00:00 | 1327.25 |
| 2012-12-22 | 1261 |
| 2012-12-22 01:00:00 | 1264.5 |
| 2012-12-22 02:00:00 | 1246.75 |
| 2012-12-22 03:00:00 | 1165 |
| 2012-12-22 04:00:00 | 1100 |
| 2012-12-22 05:00:00 | 1100.5 |
| 2012-12-22 06:00:00 | 1080.5 |
| 2012-12-22 07:00:00 | 1093.75 |
| 2012-12-22 08:00:00 | 1083.75 |
| 2012-12-22 09:00:00 | 1075.25 |
| 2012-12-22 10:00:00 | 1043.5 |
| 2012-12-22 11:00:00 | 1091.25 |
| 2012-12-22 12:00:00 | 1096 |
| 2012-12-22 13:00:00 | 1114.75 |
| 2012-12-22 14:00:00 | 1101.75 |
| 2012-12-22 15:00:00 | 1104 |
| 2012-12-22 16:00:00 | 1200 |
| 2012-12-22 17:00:00 | 1234.25 |
| 2012-12-22 18:00:00 | 1229 |
| 2012-12-22 19:00:00 | 1190 |
| 2012-12-22 20:00:00 | 1194 |
| 2012-12-22 21:00:00 | 1184.25 |
| 2012-12-22 22:00:00 | 1169.75 |
| 2012-12-22 23:00:00 | 1203.75 |
| 2012-12-23 | 1218.25 |
| 2012-12-23 01:00:00 | 1176.25 |
| 2012-12-23 02:00:00 | 1156 |
| 2012-12-23 03:00:00 | 1189.25 |
| 2012-12-23 04:00:00 | 1101.75 |
| 2012-12-23 05:00:00 | 1081.25 |
| 2012-12-23 06:00:00 | 1099.25 |
| 2012-12-23 07:00:00 | 1080 |
| 2012-12-23 08:00:00 | 1081.5 |
| 2012-12-23 09:00:00 | 1044.75 |
| 2012-12-23 10:00:00 | 1058.5 |
| 2012-12-23 11:00:00 | 1075.25 |
| 2012-12-23 12:00:00 | 1102.75 |
| 2012-12-23 13:00:00 | 1099.75 |
| 2012-12-23 14:00:00 | 1118.25 |
| 2012-12-23 15:00:00 | 1118 |
| 2012-12-23 16:00:00 | 1266.5 |
| 2012-12-23 17:00:00 | 1249 |
| 2012-12-23 18:00:00 | 1259.25 |
| 2012-12-23 19:00:00 | 1125.5 |
| 2012-12-23 20:00:00 | 1140 |
| 2012-12-23 21:00:00 | 1139 |
| 2012-12-23 22:00:00 | 1269 |
| 2012-12-23 23:00:00 | 1359.75 |
| 2012-12-24 | 1488.25 |
| 2012-12-24 01:00:00 | 1610 |
| 2012-12-24 02:00:00 | 1822 |
| 2012-12-24 03:00:00 | 2032.75 |
| 2012-12-24 04:00:00 | 2124 |
| 2012-12-24 05:00:00 | 2131.5 |
| 2012-12-24 06:00:00 | 1949.5 |
| 2012-12-24 07:00:00 | 1911 |
| 2012-12-24 08:00:00 | 1987.25 |
| 2012-12-24 09:00:00 | 1917 |
| 2012-12-24 10:00:00 | 1847.25 |
| 2012-12-24 11:00:00 | 1770.25 |
| 2012-12-24 12:00:00 | 1790 |
| 2012-12-24 13:00:00 | 1760.75 |
| 2012-12-24 14:00:00 | 1782 |
| 2012-12-24 15:00:00 | 1703 |
| 2012-12-24 16:00:00 | 1403 |
| 2012-12-24 17:00:00 | 1394.25 |
| 2012-12-24 18:00:00 | 1419 |
| 2012-12-24 19:00:00 | 1301.5 |
| 2012-12-24 20:00:00 | 1223.25 |
| 2012-12-24 21:00:00 | 1129.5 |
| 2012-12-24 22:00:00 | 1165.25 |
| 2012-12-24 23:00:00 | 1109.75 |
| 2012-12-25 | 1132.75 |
| 2012-12-25 01:00:00 | 1106.75 |
| 2012-12-25 02:00:00 | 1130.75 |
| 2012-12-25 03:00:00 | 1082.75 |
| 2012-12-25 04:00:00 | 1123.25 |
| 2012-12-25 05:00:00 | 1081.25 |
| 2012-12-25 06:00:00 | 1127.75 |
| 2012-12-25 07:00:00 | 1076 |
| 2012-12-25 08:00:00 | 1116.5 |
| 2012-12-25 09:00:00 | 1044.25 |
| 2012-12-25 10:00:00 | 1249.5 |
| 2012-12-25 11:00:00 | 1104.5 |
| 2012-12-25 12:00:00 | 1182.5 |
| 2012-12-25 13:00:00 | 1124 |
| 2012-12-25 14:00:00 | 1261 |
| 2012-12-25 15:00:00 | 1362.25 |
| 2012-12-25 16:00:00 | 1268.5 |
| 2012-12-25 17:00:00 | 1325.75 |
| 2012-12-25 18:00:00 | 1282.75 |
| 2012-12-25 19:00:00 | 1233.5 |
| 2012-12-25 20:00:00 | 1244.25 |
| 2012-12-25 21:00:00 | 1209.75 |
| 2012-12-25 22:00:00 | 1224 |
| 2012-12-25 23:00:00 | 1182.25 |
| 2012-12-26 | 1198.75 |
| 2012-12-26 01:00:00 | 1131.75 |
| 2012-12-26 02:00:00 | 1151.25 |
| 2012-12-26 03:00:00 | 1158.25 |
| 2012-12-26 04:00:00 | 1097 |
| 2012-12-26 05:00:00 | 1113.5 |
| 2012-12-26 06:00:00 | 1129.5 |
| 2012-12-26 07:00:00 | 1110.25 |
| 2012-12-26 08:00:00 | 1138.75 |
| 2012-12-26 09:00:00 | 1073.75 |
| 2012-12-26 10:00:00 | 1096.5 |
| 2012-12-26 11:00:00 | 1108.25 |
| 2012-12-26 12:00:00 | 1138.5 |
| 2012-12-26 13:00:00 | 1134.25 |
| 2012-12-26 14:00:00 | 1156.75 |
| 2012-12-26 15:00:00 | 1128.5 |
| 2012-12-26 16:00:00 | 1124.5 |
| 2012-12-26 17:00:00 | 1120.25 |
| 2012-12-26 18:00:00 | 1132.75 |
| 2012-12-26 19:00:00 | 1130.5 |
| 2012-12-26 20:00:00 | 1135.25 |
| 2012-12-26 21:00:00 | 1139.75 |
| 2012-12-26 22:00:00 | 1163.5 |
| 2012-12-26 23:00:00 | 1149.75 |
| 2012-12-27 | 1162.75 |
| 2012-12-27 01:00:00 | 1135.75 |
| 2012-12-27 02:00:00 | 1181 |
| 2012-12-27 03:00:00 | 1111.75 |
| 2012-12-27 04:00:00 | 1112 |
| 2012-12-27 05:00:00 | 1105.5 |
| 2012-12-27 06:00:00 | 1127.75 |
| 2012-12-27 07:00:00 | 1126.5 |
| 2012-12-27 08:00:00 | 1135 |
| 2012-12-27 09:00:00 | 1145.5 |
| 2012-12-27 10:00:00 | 1176.25 |
| 2012-12-27 11:00:00 | 1202.75 |
| 2012-12-27 12:00:00 | 1213.75 |
| 2012-12-27 13:00:00 | 1238.75 |
| 2012-12-27 14:00:00 | 1282 |
| 2012-12-27 15:00:00 | 1369.75 |
| 2012-12-27 16:00:00 | 1275.25 |
| 2012-12-27 17:00:00 | 1436.25 |
| 2012-12-27 18:00:00 | 1334.75 |
| 2012-12-27 19:00:00 | 1381.5 |
| 2012-12-27 20:00:00 | 1364 |
| 2012-12-27 21:00:00 | 1321.5 |
| 2012-12-27 22:00:00 | 1501.5 |
| 2012-12-27 23:00:00 | 1880.75 |
| 2012-12-28 | 2025.75 |
| 2012-12-28 01:00:00 | 2027.75 |
| 2012-12-28 02:00:00 | 1950.75 |
| 2012-12-28 03:00:00 | 1816.75 |
| 2012-12-28 04:00:00 | 1480.75 |
| 2012-12-28 05:00:00 | 1249.25 |
| 2012-12-28 06:00:00 | 1218.75 |
| 2012-12-28 07:00:00 | 1243 |
| 2012-12-28 08:00:00 | 1236.5 |
| 2012-12-28 09:00:00 | 1209.25 |
| 2012-12-28 10:00:00 | 1200 |
| 2012-12-28 11:00:00 | 1243 |
| 2012-12-28 12:00:00 | 1227 |
| 2012-12-28 13:00:00 | 1252.25 |
| 2012-12-28 14:00:00 | 1238 |
| 2012-12-28 15:00:00 | 1239 |
| 2012-12-28 16:00:00 | 1247 |
| 2012-12-28 17:00:00 | 1308.25 |
| 2012-12-28 18:00:00 | 1256.5 |
| 2012-12-28 19:00:00 | 1321.75 |
| 2012-12-28 20:00:00 | 1234 |
| 2012-12-28 21:00:00 | 1295.75 |
| 2012-12-28 22:00:00 | 1280.25 |
| 2012-12-28 23:00:00 | 1308 |
| 2012-12-29 | 1307.25 |
| 2012-12-29 01:00:00 | 1226.25 |
| 2012-12-29 02:00:00 | 1232.25 |
| 2012-12-29 03:00:00 | 1272.75 |
| 2012-12-29 04:00:00 | 1159.25 |
| 2012-12-29 05:00:00 | 1171 |
| 2012-12-29 06:00:00 | 1127.75 |
| 2012-12-29 07:00:00 | 1150.75 |
| 2012-12-29 08:00:00 | 1115.75 |
| 2012-12-29 09:00:00 | 1105 |
| 2012-12-29 10:00:00 | 1084.75 |
| 2012-12-29 11:00:00 | 1127.5 |
| 2012-12-29 12:00:00 | 1123.5 |
| 2012-12-29 13:00:00 | 1156.5 |
| 2012-12-29 14:00:00 | 1133.25 |
| 2012-12-29 15:00:00 | 1164 |
| 2012-12-29 16:00:00 | 1179 |
| 2012-12-29 17:00:00 | 1272 |
| 2012-12-29 18:00:00 | 1232.25 |
| 2012-12-29 19:00:00 | 1228 |
| 2012-12-29 20:00:00 | 1199.5 |
| 2012-12-29 21:00:00 | 1164.5 |
| 2012-12-29 22:00:00 | 1179.75 |
| 2012-12-29 23:00:00 | 1192.75 |
| 2012-12-30 | 1146.25 |
| 2012-12-30 01:00:00 | 1157 |
| 2012-12-30 02:00:00 | 1162 |
| 2012-12-30 03:00:00 | 1110.75 |
| 2012-12-30 04:00:00 | 1121.75 |
| 2012-12-30 05:00:00 | 1129.5 |
| 2012-12-30 06:00:00 | 1134 |
| 2012-12-30 07:00:00 | 1130.25 |
| 2012-12-30 08:00:00 | 1112.25 |
| 2012-12-30 09:00:00 | 1076 |
| 2012-12-30 10:00:00 | 1105.25 |
| 2012-12-30 11:00:00 | 1123.25 |
| 2012-12-30 12:00:00 | 1140 |
| 2012-12-30 13:00:00 | 1141.25 |
| 2012-12-30 14:00:00 | 1153 |
| 2012-12-30 15:00:00 | 1158 |
| 2012-12-30 16:00:00 | 1158 |
| 2012-12-30 17:00:00 | 1170.75 |
| 2012-12-30 18:00:00 | 1239.75 |
| 2012-12-30 19:00:00 | 1177.75 |
| 2012-12-30 20:00:00 | 1168 |
| 2012-12-30 21:00:00 | 1169.75 |
| 2012-12-30 22:00:00 | 1207.25 |
| 2012-12-30 23:00:00 | 1167.5 |
| 2012-12-31 | 1252.75 |
| 2012-12-31 | 1176.75 |
| 2012-12-31 | 1214.5 |
| 2012-12-31 | 1086 |
| 2012-12-31 | 1158 |
| 2012-12-31 | 1139 |
| 2012-12-31 | 1167 |
| 2012-12-31 | 1152 |
| 2012-12-31 | 1167 |
| 2012-12-31 | 1109 |
| 2012-12-31 | 1154.25 |
| 2012-12-31 | 1145.5 |
| 2012-12-31 | 1184.25 |
| 2012-12-31 | 1167.5 |
| 2012-12-31 | 1201.25 |
| 2012-12-31 | 1167.25 |
| 2012-12-31 | 1189.75 |
| 2012-12-31 | 1168 |
| 2012-12-31 | 1201.75 |
| 2012-12-31 | 1177 |
| 2012-12-31 | 1200.5 |
| 2012-12-31 | 1236.5 |
| 2012-12-31 | 1249 |
| 2012-12-31 | 1154.5 |
| 2013-01-01 | 1170 |